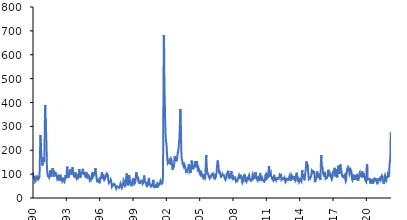
| Category | Index |
|---|---|
| 1990-01-01 | 108.888 |
| 1990-01-02 | 107.41 |
| 1990-01-03 | 104.913 |
| 1990-01-04 | 101.838 |
| 1990-01-05 | 100.555 |
| 1990-01-06 | 100.528 |
| 1990-01-07 | 98.655 |
| 1990-01-08 | 98.989 |
| 1990-01-09 | 100.439 |
| 1990-01-10 | 100.368 |
| 1990-01-11 | 98.759 |
| 1990-01-12 | 98.669 |
| 1990-01-13 | 97.061 |
| 1990-01-14 | 95.389 |
| 1990-01-15 | 94.045 |
| 1990-01-16 | 92.8 |
| 1990-01-17 | 93.206 |
| 1990-01-18 | 90.599 |
| 1990-01-19 | 89.236 |
| 1990-01-20 | 86.482 |
| 1990-01-21 | 85.16 |
| 1990-01-22 | 84.007 |
| 1990-01-23 | 84.643 |
| 1990-01-24 | 83.991 |
| 1990-01-25 | 84.277 |
| 1990-01-26 | 84.188 |
| 1990-01-27 | 84.197 |
| 1990-01-28 | 82.541 |
| 1990-01-29 | 81.961 |
| 1990-01-30 | 82.99 |
| 1990-01-31 | 83.37 |
| 1990-02-01 | 83.561 |
| 1990-02-02 | 84.544 |
| 1990-02-03 | 86.52 |
| 1990-02-04 | 86.381 |
| 1990-02-05 | 87.983 |
| 1990-02-06 | 91.495 |
| 1990-02-07 | 91.184 |
| 1990-02-08 | 89.132 |
| 1990-02-09 | 88.004 |
| 1990-02-10 | 88.749 |
| 1990-02-11 | 88.25 |
| 1990-02-12 | 89.704 |
| 1990-02-13 | 89.977 |
| 1990-02-14 | 88.712 |
| 1990-02-15 | 88.406 |
| 1990-02-16 | 87.166 |
| 1990-02-17 | 87.312 |
| 1990-02-18 | 86.625 |
| 1990-02-19 | 87.193 |
| 1990-02-20 | 86.603 |
| 1990-02-21 | 86.388 |
| 1990-02-22 | 84.271 |
| 1990-02-23 | 83.254 |
| 1990-02-24 | 82.737 |
| 1990-02-25 | 81.87 |
| 1990-02-26 | 81.005 |
| 1990-02-27 | 83.451 |
| 1990-02-28 | 82.212 |
| 1990-03-01 | 81.337 |
| 1990-03-02 | 79.881 |
| 1990-03-03 | 78.446 |
| 1990-03-04 | 76.539 |
| 1990-03-05 | 75.167 |
| 1990-03-06 | 75.443 |
| 1990-03-07 | 74.192 |
| 1990-03-08 | 71.445 |
| 1990-03-09 | 70.327 |
| 1990-03-10 | 71.295 |
| 1990-03-11 | 70.455 |
| 1990-03-12 | 68.815 |
| 1990-03-13 | 69.386 |
| 1990-03-14 | 68.702 |
| 1990-03-15 | 67.928 |
| 1990-03-16 | 68.188 |
| 1990-03-17 | 68.685 |
| 1990-03-18 | 68.941 |
| 1990-03-19 | 68.688 |
| 1990-03-20 | 68.804 |
| 1990-03-21 | 67.771 |
| 1990-03-22 | 68.325 |
| 1990-03-23 | 67.422 |
| 1990-03-24 | 67.949 |
| 1990-03-25 | 68.957 |
| 1990-03-26 | 69.097 |
| 1990-03-27 | 69.89 |
| 1990-03-28 | 70.682 |
| 1990-03-29 | 69.19 |
| 1990-03-30 | 68.958 |
| 1990-03-31 | 70.704 |
| 1990-04-01 | 70.158 |
| 1990-04-02 | 73.422 |
| 1990-04-03 | 75.191 |
| 1990-04-04 | 75.59 |
| 1990-04-05 | 75.518 |
| 1990-04-06 | 76.008 |
| 1990-04-07 | 75.975 |
| 1990-04-08 | 75.326 |
| 1990-04-09 | 74.881 |
| 1990-04-10 | 76.383 |
| 1990-04-11 | 78.055 |
| 1990-04-12 | 78.141 |
| 1990-04-13 | 77.781 |
| 1990-04-14 | 79.164 |
| 1990-04-15 | 78.725 |
| 1990-04-16 | 78.929 |
| 1990-04-17 | 79.578 |
| 1990-04-18 | 80.737 |
| 1990-04-19 | 80.804 |
| 1990-04-20 | 82.924 |
| 1990-04-21 | 83.57 |
| 1990-04-22 | 85.28 |
| 1990-04-23 | 87.052 |
| 1990-04-24 | 87.251 |
| 1990-04-25 | 87.436 |
| 1990-04-26 | 88.024 |
| 1990-04-27 | 87.672 |
| 1990-04-28 | 87.759 |
| 1990-04-29 | 86.872 |
| 1990-04-30 | 84.691 |
| 1990-05-01 | 86.428 |
| 1990-05-02 | 87.079 |
| 1990-05-03 | 86.471 |
| 1990-05-04 | 86.835 |
| 1990-05-05 | 88.836 |
| 1990-05-06 | 87.506 |
| 1990-05-07 | 87.706 |
| 1990-05-08 | 88.491 |
| 1990-05-09 | 88.167 |
| 1990-05-10 | 87.384 |
| 1990-05-11 | 86.09 |
| 1990-05-12 | 84.584 |
| 1990-05-13 | 84.657 |
| 1990-05-14 | 84.476 |
| 1990-05-15 | 85.028 |
| 1990-05-16 | 85.713 |
| 1990-05-17 | 85.847 |
| 1990-05-18 | 84.95 |
| 1990-05-19 | 84.734 |
| 1990-05-20 | 82.827 |
| 1990-05-21 | 83.704 |
| 1990-05-22 | 83.857 |
| 1990-05-23 | 82.49 |
| 1990-05-24 | 83.213 |
| 1990-05-25 | 83.811 |
| 1990-05-26 | 83.866 |
| 1990-05-27 | 83.852 |
| 1990-05-28 | 85.695 |
| 1990-05-29 | 88.988 |
| 1990-05-30 | 90.612 |
| 1990-05-31 | 90.288 |
| 1990-06-01 | 88.062 |
| 1990-06-02 | 88.599 |
| 1990-06-03 | 88.045 |
| 1990-06-04 | 88.156 |
| 1990-06-05 | 89.708 |
| 1990-06-06 | 90.555 |
| 1990-06-07 | 91.1 |
| 1990-06-08 | 91.674 |
| 1990-06-09 | 92.383 |
| 1990-06-10 | 92.216 |
| 1990-06-11 | 92.507 |
| 1990-06-12 | 91.941 |
| 1990-06-13 | 91.258 |
| 1990-06-14 | 91.162 |
| 1990-06-15 | 89.927 |
| 1990-06-16 | 91.257 |
| 1990-06-17 | 90.814 |
| 1990-06-18 | 90.942 |
| 1990-06-19 | 90.664 |
| 1990-06-20 | 89.604 |
| 1990-06-21 | 88.773 |
| 1990-06-22 | 88.803 |
| 1990-06-23 | 89.433 |
| 1990-06-24 | 87.612 |
| 1990-06-25 | 86.231 |
| 1990-06-26 | 85.266 |
| 1990-06-27 | 83.956 |
| 1990-06-28 | 81.266 |
| 1990-06-29 | 81.395 |
| 1990-06-30 | 79.453 |
| 1990-07-01 | 79.619 |
| 1990-07-02 | 79.694 |
| 1990-07-03 | 81.252 |
| 1990-07-04 | 80.527 |
| 1990-07-05 | 80.068 |
| 1990-07-06 | 79.805 |
| 1990-07-07 | 81.898 |
| 1990-07-08 | 81.248 |
| 1990-07-09 | 80.202 |
| 1990-07-10 | 81.353 |
| 1990-07-11 | 82.132 |
| 1990-07-12 | 81.686 |
| 1990-07-13 | 81.727 |
| 1990-07-14 | 81.57 |
| 1990-07-15 | 81.203 |
| 1990-07-16 | 79.424 |
| 1990-07-17 | 78.849 |
| 1990-07-18 | 79.084 |
| 1990-07-19 | 79.631 |
| 1990-07-20 | 79.664 |
| 1990-07-21 | 80.957 |
| 1990-07-22 | 79.903 |
| 1990-07-23 | 79.552 |
| 1990-07-24 | 82.489 |
| 1990-07-25 | 84.811 |
| 1990-07-26 | 86.03 |
| 1990-07-27 | 85.32 |
| 1990-07-28 | 88.356 |
| 1990-07-29 | 87.033 |
| 1990-07-30 | 87.395 |
| 1990-07-31 | 88.76 |
| 1990-08-01 | 89.971 |
| 1990-08-02 | 89.36 |
| 1990-08-03 | 94.125 |
| 1990-08-04 | 98.387 |
| 1990-08-05 | 100.55 |
| 1990-08-06 | 104.374 |
| 1990-08-07 | 111.679 |
| 1990-08-08 | 120.63 |
| 1990-08-09 | 125.054 |
| 1990-08-10 | 130.204 |
| 1990-08-11 | 137.649 |
| 1990-08-12 | 142.137 |
| 1990-08-13 | 151.323 |
| 1990-08-14 | 161.894 |
| 1990-08-15 | 168.642 |
| 1990-08-16 | 173.748 |
| 1990-08-17 | 178.78 |
| 1990-08-18 | 184.345 |
| 1990-08-19 | 186.776 |
| 1990-08-20 | 191.094 |
| 1990-08-21 | 199.834 |
| 1990-08-22 | 207.727 |
| 1990-08-23 | 213.09 |
| 1990-08-24 | 218.012 |
| 1990-08-25 | 226.364 |
| 1990-08-26 | 230.697 |
| 1990-08-27 | 233.677 |
| 1990-08-28 | 240.632 |
| 1990-08-29 | 248.28 |
| 1990-08-30 | 250.135 |
| 1990-08-31 | 254.349 |
| 1990-09-01 | 259.432 |
| 1990-09-02 | 257.131 |
| 1990-09-03 | 258.662 |
| 1990-09-04 | 263.269 |
| 1990-09-05 | 263.858 |
| 1990-09-06 | 259.837 |
| 1990-09-07 | 256.058 |
| 1990-09-08 | 256.927 |
| 1990-09-09 | 254.21 |
| 1990-09-10 | 251.669 |
| 1990-09-11 | 250.891 |
| 1990-09-12 | 244.306 |
| 1990-09-13 | 235.978 |
| 1990-09-14 | 233.571 |
| 1990-09-15 | 236.36 |
| 1990-09-16 | 232.822 |
| 1990-09-17 | 230.669 |
| 1990-09-18 | 231.067 |
| 1990-09-19 | 230.129 |
| 1990-09-20 | 224.346 |
| 1990-09-21 | 218.618 |
| 1990-09-22 | 213.784 |
| 1990-09-23 | 209.185 |
| 1990-09-24 | 204.642 |
| 1990-09-25 | 206.99 |
| 1990-09-26 | 205.247 |
| 1990-09-27 | 201.497 |
| 1990-09-28 | 196.678 |
| 1990-09-29 | 195.995 |
| 1990-09-30 | 191.022 |
| 1990-10-01 | 189.418 |
| 1990-10-02 | 189.296 |
| 1990-10-03 | 184.958 |
| 1990-10-04 | 179.893 |
| 1990-10-05 | 176.692 |
| 1990-10-06 | 176.302 |
| 1990-10-07 | 173.024 |
| 1990-10-08 | 169.992 |
| 1990-10-09 | 170.384 |
| 1990-10-10 | 169.118 |
| 1990-10-11 | 166.356 |
| 1990-10-12 | 166.398 |
| 1990-10-13 | 167.752 |
| 1990-10-14 | 164.543 |
| 1990-10-15 | 160.898 |
| 1990-10-16 | 161.753 |
| 1990-10-17 | 160.01 |
| 1990-10-18 | 158.356 |
| 1990-10-19 | 156.78 |
| 1990-10-20 | 157.133 |
| 1990-10-21 | 155.508 |
| 1990-10-22 | 156.115 |
| 1990-10-23 | 156.503 |
| 1990-10-24 | 155.406 |
| 1990-10-25 | 149.924 |
| 1990-10-26 | 148.698 |
| 1990-10-27 | 147.52 |
| 1990-10-28 | 146.083 |
| 1990-10-29 | 145.463 |
| 1990-10-30 | 144.637 |
| 1990-10-31 | 143.308 |
| 1990-11-01 | 140.489 |
| 1990-11-02 | 140.319 |
| 1990-11-03 | 138.491 |
| 1990-11-04 | 135.831 |
| 1990-11-05 | 134.936 |
| 1990-11-06 | 138.865 |
| 1990-11-07 | 137.727 |
| 1990-11-08 | 136.763 |
| 1990-11-09 | 136.579 |
| 1990-11-10 | 139.652 |
| 1990-11-11 | 138.035 |
| 1990-11-12 | 137.703 |
| 1990-11-13 | 139.317 |
| 1990-11-14 | 140.408 |
| 1990-11-15 | 140.44 |
| 1990-11-16 | 141.38 |
| 1990-11-17 | 142.353 |
| 1990-11-18 | 140.939 |
| 1990-11-19 | 140.71 |
| 1990-11-20 | 142.068 |
| 1990-11-21 | 143.917 |
| 1990-11-22 | 142.944 |
| 1990-11-23 | 142.001 |
| 1990-11-24 | 145.842 |
| 1990-11-25 | 144.647 |
| 1990-11-26 | 146.535 |
| 1990-11-27 | 150.699 |
| 1990-11-28 | 152.173 |
| 1990-11-29 | 155.514 |
| 1990-11-30 | 155.135 |
| 1990-12-01 | 159.444 |
| 1990-12-02 | 158.778 |
| 1990-12-03 | 163.545 |
| 1990-12-04 | 167.11 |
| 1990-12-05 | 169.755 |
| 1990-12-06 | 167.82 |
| 1990-12-07 | 170.297 |
| 1990-12-08 | 172.686 |
| 1990-12-09 | 170.88 |
| 1990-12-10 | 169.331 |
| 1990-12-11 | 171.765 |
| 1990-12-12 | 170.33 |
| 1990-12-13 | 169.585 |
| 1990-12-14 | 167.422 |
| 1990-12-15 | 167.676 |
| 1990-12-16 | 165.871 |
| 1990-12-17 | 166.773 |
| 1990-12-18 | 168.805 |
| 1990-12-19 | 167.92 |
| 1990-12-20 | 166.815 |
| 1990-12-21 | 162.189 |
| 1990-12-22 | 165.289 |
| 1990-12-23 | 164.01 |
| 1990-12-24 | 159.775 |
| 1990-12-25 | 161.217 |
| 1990-12-26 | 162.591 |
| 1990-12-27 | 161.342 |
| 1990-12-28 | 158.55 |
| 1990-12-29 | 157.229 |
| 1990-12-30 | 155.134 |
| 1990-12-31 | 154.157 |
| 1991-01-01 | 156.688 |
| 1991-01-02 | 154.629 |
| 1991-01-03 | 153.135 |
| 1991-01-04 | 151.791 |
| 1991-01-05 | 154.468 |
| 1991-01-06 | 150.904 |
| 1991-01-07 | 152.765 |
| 1991-01-08 | 161.563 |
| 1991-01-09 | 166.57 |
| 1991-01-10 | 170.601 |
| 1991-01-11 | 179.217 |
| 1991-01-12 | 186.844 |
| 1991-01-13 | 190.141 |
| 1991-01-14 | 196.383 |
| 1991-01-15 | 211.914 |
| 1991-01-16 | 221.773 |
| 1991-01-17 | 234.695 |
| 1991-01-18 | 249.09 |
| 1991-01-19 | 257.772 |
| 1991-01-20 | 263.979 |
| 1991-01-21 | 272.418 |
| 1991-01-22 | 285.864 |
| 1991-01-23 | 296.976 |
| 1991-01-24 | 305.113 |
| 1991-01-25 | 311.71 |
| 1991-01-26 | 319.529 |
| 1991-01-27 | 325.117 |
| 1991-01-28 | 331.397 |
| 1991-01-29 | 343.023 |
| 1991-01-30 | 352.917 |
| 1991-01-31 | 358.199 |
| 1991-02-01 | 363.29 |
| 1991-02-02 | 368.68 |
| 1991-02-03 | 372.897 |
| 1991-02-04 | 374.876 |
| 1991-02-05 | 384.75 |
| 1991-02-06 | 389.402 |
| 1991-02-07 | 385.547 |
| 1991-02-08 | 387.621 |
| 1991-02-09 | 387.625 |
| 1991-02-10 | 381.881 |
| 1991-02-11 | 381.881 |
| 1991-02-12 | 383.405 |
| 1991-02-13 | 380.495 |
| 1991-02-14 | 371.234 |
| 1991-02-15 | 363.16 |
| 1991-02-16 | 353.78 |
| 1991-02-17 | 342.821 |
| 1991-02-18 | 341.998 |
| 1991-02-19 | 342.092 |
| 1991-02-20 | 336.266 |
| 1991-02-21 | 329.164 |
| 1991-02-22 | 325.409 |
| 1991-02-23 | 326.082 |
| 1991-02-24 | 321.539 |
| 1991-02-25 | 324.321 |
| 1991-02-26 | 327.445 |
| 1991-02-27 | 330.672 |
| 1991-02-28 | 323.834 |
| 1991-03-01 | 313.975 |
| 1991-03-02 | 309.706 |
| 1991-03-03 | 305.109 |
| 1991-03-04 | 301.824 |
| 1991-03-05 | 298.284 |
| 1991-03-06 | 294.369 |
| 1991-03-07 | 288.048 |
| 1991-03-08 | 279.02 |
| 1991-03-09 | 276.178 |
| 1991-03-10 | 269.37 |
| 1991-03-11 | 266.034 |
| 1991-03-12 | 265.826 |
| 1991-03-13 | 258.04 |
| 1991-03-14 | 251.402 |
| 1991-03-15 | 246.312 |
| 1991-03-16 | 242.048 |
| 1991-03-17 | 239.382 |
| 1991-03-18 | 236.995 |
| 1991-03-19 | 235.156 |
| 1991-03-20 | 227.367 |
| 1991-03-21 | 221.416 |
| 1991-03-22 | 216.044 |
| 1991-03-23 | 211.219 |
| 1991-03-24 | 203.24 |
| 1991-03-25 | 193.128 |
| 1991-03-26 | 187.388 |
| 1991-03-27 | 174.635 |
| 1991-03-28 | 165.776 |
| 1991-03-29 | 153.906 |
| 1991-03-30 | 149.16 |
| 1991-03-31 | 144.999 |
| 1991-04-01 | 140.599 |
| 1991-04-02 | 139.802 |
| 1991-04-03 | 137.34 |
| 1991-04-04 | 133.918 |
| 1991-04-05 | 131.056 |
| 1991-04-06 | 128.787 |
| 1991-04-07 | 127.756 |
| 1991-04-08 | 125.668 |
| 1991-04-09 | 123.665 |
| 1991-04-10 | 120.104 |
| 1991-04-11 | 116.471 |
| 1991-04-12 | 115.998 |
| 1991-04-13 | 115.368 |
| 1991-04-14 | 113.591 |
| 1991-04-15 | 112.53 |
| 1991-04-16 | 110.267 |
| 1991-04-17 | 107.371 |
| 1991-04-18 | 104.538 |
| 1991-04-19 | 103.422 |
| 1991-04-20 | 104.688 |
| 1991-04-21 | 102.75 |
| 1991-04-22 | 100.245 |
| 1991-04-23 | 99.564 |
| 1991-04-24 | 99.54 |
| 1991-04-25 | 97.63 |
| 1991-04-26 | 96.73 |
| 1991-04-27 | 96.195 |
| 1991-04-28 | 95.465 |
| 1991-04-29 | 95.43 |
| 1991-04-30 | 96.354 |
| 1991-05-01 | 97.747 |
| 1991-05-02 | 93.892 |
| 1991-05-03 | 91.185 |
| 1991-05-04 | 89.99 |
| 1991-05-05 | 88.508 |
| 1991-05-06 | 90.856 |
| 1991-05-07 | 92.22 |
| 1991-05-08 | 92.945 |
| 1991-05-09 | 92.056 |
| 1991-05-10 | 92.871 |
| 1991-05-11 | 92.869 |
| 1991-05-12 | 91.171 |
| 1991-05-13 | 92.64 |
| 1991-05-14 | 94.059 |
| 1991-05-15 | 92.715 |
| 1991-05-16 | 92.32 |
| 1991-05-17 | 90.23 |
| 1991-05-18 | 90.556 |
| 1991-05-19 | 89.003 |
| 1991-05-20 | 88.975 |
| 1991-05-21 | 89.099 |
| 1991-05-22 | 90.142 |
| 1991-05-23 | 91.61 |
| 1991-05-24 | 89.674 |
| 1991-05-25 | 90.551 |
| 1991-05-26 | 90.171 |
| 1991-05-27 | 90.905 |
| 1991-05-28 | 92.555 |
| 1991-05-29 | 91.12 |
| 1991-05-30 | 90.098 |
| 1991-05-31 | 90.056 |
| 1991-06-01 | 92.122 |
| 1991-06-02 | 92.058 |
| 1991-06-03 | 91.38 |
| 1991-06-04 | 93.162 |
| 1991-06-05 | 90.056 |
| 1991-06-06 | 87.98 |
| 1991-06-07 | 86.439 |
| 1991-06-08 | 88.106 |
| 1991-06-09 | 86.725 |
| 1991-06-10 | 87.303 |
| 1991-06-11 | 88.491 |
| 1991-06-12 | 88.092 |
| 1991-06-13 | 87.528 |
| 1991-06-14 | 87.369 |
| 1991-06-15 | 86.569 |
| 1991-06-16 | 86.408 |
| 1991-06-17 | 85.655 |
| 1991-06-18 | 86.875 |
| 1991-06-19 | 85.575 |
| 1991-06-20 | 85.165 |
| 1991-06-21 | 84.802 |
| 1991-06-22 | 82.634 |
| 1991-06-23 | 82.813 |
| 1991-06-24 | 82.16 |
| 1991-06-25 | 82.983 |
| 1991-06-26 | 81.838 |
| 1991-06-27 | 82.64 |
| 1991-06-28 | 85.265 |
| 1991-06-29 | 87.215 |
| 1991-06-30 | 86.096 |
| 1991-07-01 | 87.988 |
| 1991-07-02 | 89.568 |
| 1991-07-03 | 93.826 |
| 1991-07-04 | 95.651 |
| 1991-07-05 | 96.149 |
| 1991-07-06 | 99.139 |
| 1991-07-07 | 101.109 |
| 1991-07-08 | 103.037 |
| 1991-07-09 | 104.261 |
| 1991-07-10 | 105.07 |
| 1991-07-11 | 105.238 |
| 1991-07-12 | 105.56 |
| 1991-07-13 | 106.379 |
| 1991-07-14 | 107.041 |
| 1991-07-15 | 110.778 |
| 1991-07-16 | 113.038 |
| 1991-07-17 | 113.555 |
| 1991-07-18 | 113.559 |
| 1991-07-19 | 113.943 |
| 1991-07-20 | 114.218 |
| 1991-07-21 | 113.387 |
| 1991-07-22 | 115.394 |
| 1991-07-23 | 115.349 |
| 1991-07-24 | 116.352 |
| 1991-07-25 | 115.856 |
| 1991-07-26 | 116.777 |
| 1991-07-27 | 115.639 |
| 1991-07-28 | 113.42 |
| 1991-07-29 | 112.767 |
| 1991-07-30 | 113.397 |
| 1991-07-31 | 112.207 |
| 1991-08-01 | 111.575 |
| 1991-08-02 | 109.022 |
| 1991-08-03 | 106.429 |
| 1991-08-04 | 104.566 |
| 1991-08-05 | 101.646 |
| 1991-08-06 | 100.538 |
| 1991-08-07 | 98.34 |
| 1991-08-08 | 97.992 |
| 1991-08-09 | 98.157 |
| 1991-08-10 | 98.432 |
| 1991-08-11 | 97.419 |
| 1991-08-12 | 98.37 |
| 1991-08-13 | 97.573 |
| 1991-08-14 | 93.884 |
| 1991-08-15 | 91.9 |
| 1991-08-16 | 91.058 |
| 1991-08-17 | 91.309 |
| 1991-08-18 | 89.246 |
| 1991-08-19 | 89.004 |
| 1991-08-20 | 95.642 |
| 1991-08-21 | 98.738 |
| 1991-08-22 | 101.297 |
| 1991-08-23 | 103.634 |
| 1991-08-24 | 102.364 |
| 1991-08-25 | 101.164 |
| 1991-08-26 | 102.48 |
| 1991-08-27 | 104.627 |
| 1991-08-28 | 106.598 |
| 1991-08-29 | 107.622 |
| 1991-08-30 | 109.262 |
| 1991-08-31 | 108.993 |
| 1991-09-01 | 107.967 |
| 1991-09-02 | 109.04 |
| 1991-09-03 | 109.608 |
| 1991-09-04 | 110.73 |
| 1991-09-05 | 110.325 |
| 1991-09-06 | 110.85 |
| 1991-09-07 | 110.107 |
| 1991-09-08 | 108.825 |
| 1991-09-09 | 107.859 |
| 1991-09-10 | 109.212 |
| 1991-09-11 | 107.589 |
| 1991-09-12 | 108.544 |
| 1991-09-13 | 110.225 |
| 1991-09-14 | 112.987 |
| 1991-09-15 | 113.872 |
| 1991-09-16 | 115.856 |
| 1991-09-17 | 117.935 |
| 1991-09-18 | 119.128 |
| 1991-09-19 | 113.974 |
| 1991-09-20 | 111.868 |
| 1991-09-21 | 110.788 |
| 1991-09-22 | 108.428 |
| 1991-09-23 | 112.72 |
| 1991-09-24 | 115.518 |
| 1991-09-25 | 115.724 |
| 1991-09-26 | 116.713 |
| 1991-09-27 | 115.889 |
| 1991-09-28 | 117.145 |
| 1991-09-29 | 114.781 |
| 1991-09-30 | 116.281 |
| 1991-10-01 | 120.257 |
| 1991-10-02 | 119.598 |
| 1991-10-03 | 121.286 |
| 1991-10-04 | 122.746 |
| 1991-10-05 | 123.645 |
| 1991-10-06 | 122.002 |
| 1991-10-07 | 123.591 |
| 1991-10-08 | 125.627 |
| 1991-10-09 | 127.011 |
| 1991-10-10 | 125.2 |
| 1991-10-11 | 125.454 |
| 1991-10-12 | 125.429 |
| 1991-10-13 | 124.986 |
| 1991-10-14 | 121.218 |
| 1991-10-15 | 122.713 |
| 1991-10-16 | 120.148 |
| 1991-10-17 | 119.459 |
| 1991-10-18 | 118.565 |
| 1991-10-19 | 117.411 |
| 1991-10-20 | 115.683 |
| 1991-10-21 | 114.547 |
| 1991-10-22 | 115.19 |
| 1991-10-23 | 110.958 |
| 1991-10-24 | 108.476 |
| 1991-10-25 | 107.729 |
| 1991-10-26 | 104.959 |
| 1991-10-27 | 103.355 |
| 1991-10-28 | 100.393 |
| 1991-10-29 | 100.946 |
| 1991-10-30 | 100.248 |
| 1991-10-31 | 97.741 |
| 1991-11-01 | 96.307 |
| 1991-11-02 | 93.654 |
| 1991-11-03 | 91.685 |
| 1991-11-04 | 92.844 |
| 1991-11-05 | 93.954 |
| 1991-11-06 | 92.883 |
| 1991-11-07 | 89.413 |
| 1991-11-08 | 88.252 |
| 1991-11-09 | 89.868 |
| 1991-11-10 | 90.933 |
| 1991-11-11 | 91.372 |
| 1991-11-12 | 91.251 |
| 1991-11-13 | 93.118 |
| 1991-11-14 | 90.715 |
| 1991-11-15 | 91.21 |
| 1991-11-16 | 90.707 |
| 1991-11-17 | 90.424 |
| 1991-11-18 | 91.202 |
| 1991-11-19 | 92.531 |
| 1991-11-20 | 92.239 |
| 1991-11-21 | 92.869 |
| 1991-11-22 | 94.907 |
| 1991-11-23 | 96.643 |
| 1991-11-24 | 95.109 |
| 1991-11-25 | 95.662 |
| 1991-11-26 | 97.251 |
| 1991-11-27 | 97.584 |
| 1991-11-28 | 97.322 |
| 1991-11-29 | 98.115 |
| 1991-11-30 | 97.963 |
| 1991-12-01 | 98.396 |
| 1991-12-02 | 100.749 |
| 1991-12-03 | 102.048 |
| 1991-12-04 | 100.358 |
| 1991-12-05 | 98.964 |
| 1991-12-06 | 99.068 |
| 1991-12-07 | 100.305 |
| 1991-12-08 | 99.843 |
| 1991-12-09 | 99.602 |
| 1991-12-10 | 101.03 |
| 1991-12-11 | 100.369 |
| 1991-12-12 | 100.801 |
| 1991-12-13 | 101.208 |
| 1991-12-14 | 102.954 |
| 1991-12-15 | 103.352 |
| 1991-12-16 | 106.391 |
| 1991-12-17 | 107.652 |
| 1991-12-18 | 106.904 |
| 1991-12-19 | 105.785 |
| 1991-12-20 | 107.047 |
| 1991-12-21 | 106.469 |
| 1991-12-22 | 105.724 |
| 1991-12-23 | 104.566 |
| 1991-12-24 | 105.605 |
| 1991-12-25 | 105.289 |
| 1991-12-26 | 103.527 |
| 1991-12-27 | 103.489 |
| 1991-12-28 | 103.805 |
| 1991-12-29 | 102.102 |
| 1991-12-30 | 101.927 |
| 1991-12-31 | 104.054 |
| 1992-01-01 | 103.886 |
| 1992-01-02 | 103.303 |
| 1992-01-03 | 103.738 |
| 1992-01-04 | 105.715 |
| 1992-01-05 | 104.847 |
| 1992-01-06 | 105.647 |
| 1992-01-07 | 107.705 |
| 1992-01-08 | 107.958 |
| 1992-01-09 | 105.572 |
| 1992-01-10 | 105.158 |
| 1992-01-11 | 106.671 |
| 1992-01-12 | 106.249 |
| 1992-01-13 | 105.301 |
| 1992-01-14 | 105.876 |
| 1992-01-15 | 103.501 |
| 1992-01-16 | 102.08 |
| 1992-01-17 | 101.931 |
| 1992-01-18 | 102.344 |
| 1992-01-19 | 101.091 |
| 1992-01-20 | 101.981 |
| 1992-01-21 | 102.427 |
| 1992-01-22 | 101.998 |
| 1992-01-23 | 100.957 |
| 1992-01-24 | 101.839 |
| 1992-01-25 | 102.342 |
| 1992-01-26 | 101.455 |
| 1992-01-27 | 100.234 |
| 1992-01-28 | 100.657 |
| 1992-01-29 | 101.037 |
| 1992-01-30 | 101.226 |
| 1992-01-31 | 101.52 |
| 1992-02-01 | 101.119 |
| 1992-02-02 | 100.363 |
| 1992-02-03 | 99.512 |
| 1992-02-04 | 99.699 |
| 1992-02-05 | 99.122 |
| 1992-02-06 | 97.269 |
| 1992-02-07 | 96.989 |
| 1992-02-08 | 96.579 |
| 1992-02-09 | 96.603 |
| 1992-02-10 | 93.91 |
| 1992-02-11 | 93.322 |
| 1992-02-12 | 93.63 |
| 1992-02-13 | 92.067 |
| 1992-02-14 | 92.316 |
| 1992-02-15 | 93.375 |
| 1992-02-16 | 93.456 |
| 1992-02-17 | 91.568 |
| 1992-02-18 | 92.434 |
| 1992-02-19 | 92.004 |
| 1992-02-20 | 90.447 |
| 1992-02-21 | 90.393 |
| 1992-02-22 | 92.443 |
| 1992-02-23 | 91.75 |
| 1992-02-24 | 90.924 |
| 1992-02-25 | 91.842 |
| 1992-02-26 | 91.106 |
| 1992-02-27 | 89.091 |
| 1992-02-28 | 88.35 |
| 1992-02-29 | 86.365 |
| 1992-03-01 | 84.426 |
| 1992-03-02 | 83.109 |
| 1992-03-03 | 83.002 |
| 1992-03-04 | 81.685 |
| 1992-03-05 | 81.344 |
| 1992-03-06 | 80.036 |
| 1992-03-07 | 80.661 |
| 1992-03-08 | 78.99 |
| 1992-03-09 | 79.44 |
| 1992-03-10 | 79.217 |
| 1992-03-11 | 80.322 |
| 1992-03-12 | 80.251 |
| 1992-03-13 | 80.675 |
| 1992-03-14 | 80.371 |
| 1992-03-15 | 79.144 |
| 1992-03-16 | 79.003 |
| 1992-03-17 | 79.117 |
| 1992-03-18 | 80.155 |
| 1992-03-19 | 80.299 |
| 1992-03-20 | 80.64 |
| 1992-03-21 | 81.027 |
| 1992-03-22 | 80.835 |
| 1992-03-23 | 79.78 |
| 1992-03-24 | 79.207 |
| 1992-03-25 | 78.602 |
| 1992-03-26 | 78.537 |
| 1992-03-27 | 80.391 |
| 1992-03-28 | 82.269 |
| 1992-03-29 | 81.902 |
| 1992-03-30 | 83.467 |
| 1992-03-31 | 83.969 |
| 1992-04-01 | 86.199 |
| 1992-04-02 | 86.19 |
| 1992-04-03 | 86.251 |
| 1992-04-04 | 87.106 |
| 1992-04-05 | 87.504 |
| 1992-04-06 | 87.228 |
| 1992-04-07 | 88.785 |
| 1992-04-08 | 89.03 |
| 1992-04-09 | 88.591 |
| 1992-04-10 | 88.847 |
| 1992-04-11 | 89.289 |
| 1992-04-12 | 88.683 |
| 1992-04-13 | 89.095 |
| 1992-04-14 | 90.266 |
| 1992-04-15 | 91.143 |
| 1992-04-16 | 91.445 |
| 1992-04-17 | 92.846 |
| 1992-04-18 | 92.501 |
| 1992-04-19 | 90.007 |
| 1992-04-20 | 92.116 |
| 1992-04-21 | 93.555 |
| 1992-04-22 | 92.49 |
| 1992-04-23 | 91.921 |
| 1992-04-24 | 91.604 |
| 1992-04-25 | 92.008 |
| 1992-04-26 | 89.349 |
| 1992-04-27 | 89.176 |
| 1992-04-28 | 89.089 |
| 1992-04-29 | 86.766 |
| 1992-04-30 | 86.446 |
| 1992-05-01 | 84.238 |
| 1992-05-02 | 83.361 |
| 1992-05-03 | 83.459 |
| 1992-05-04 | 83.678 |
| 1992-05-05 | 83.359 |
| 1992-05-06 | 83.552 |
| 1992-05-07 | 83.187 |
| 1992-05-08 | 81.08 |
| 1992-05-09 | 81.115 |
| 1992-05-10 | 79.237 |
| 1992-05-11 | 78.637 |
| 1992-05-12 | 79.46 |
| 1992-05-13 | 78.607 |
| 1992-05-14 | 76.773 |
| 1992-05-15 | 74.82 |
| 1992-05-16 | 74.173 |
| 1992-05-17 | 72.05 |
| 1992-05-18 | 72.727 |
| 1992-05-19 | 73.777 |
| 1992-05-20 | 72.157 |
| 1992-05-21 | 70.719 |
| 1992-05-22 | 71.005 |
| 1992-05-23 | 72.05 |
| 1992-05-24 | 72.75 |
| 1992-05-25 | 74.276 |
| 1992-05-26 | 77.585 |
| 1992-05-27 | 77.307 |
| 1992-05-28 | 78.031 |
| 1992-05-29 | 78.16 |
| 1992-05-30 | 78.598 |
| 1992-05-31 | 79.704 |
| 1992-06-01 | 80.515 |
| 1992-06-02 | 80.042 |
| 1992-06-03 | 82.399 |
| 1992-06-04 | 84.292 |
| 1992-06-05 | 85.855 |
| 1992-06-06 | 86.492 |
| 1992-06-07 | 87.433 |
| 1992-06-08 | 87.021 |
| 1992-06-09 | 90.037 |
| 1992-06-10 | 90.564 |
| 1992-06-11 | 89.883 |
| 1992-06-12 | 90.391 |
| 1992-06-13 | 93.058 |
| 1992-06-14 | 93.512 |
| 1992-06-15 | 94.809 |
| 1992-06-16 | 97.231 |
| 1992-06-17 | 96.518 |
| 1992-06-18 | 96.924 |
| 1992-06-19 | 96.716 |
| 1992-06-20 | 97.114 |
| 1992-06-21 | 97.544 |
| 1992-06-22 | 97.074 |
| 1992-06-23 | 97.428 |
| 1992-06-24 | 96.341 |
| 1992-06-25 | 93.321 |
| 1992-06-26 | 92.105 |
| 1992-06-27 | 92.182 |
| 1992-06-28 | 92.551 |
| 1992-06-29 | 92.83 |
| 1992-06-30 | 91.85 |
| 1992-07-01 | 91.559 |
| 1992-07-02 | 91.463 |
| 1992-07-03 | 89.81 |
| 1992-07-04 | 88.307 |
| 1992-07-05 | 87.089 |
| 1992-07-06 | 86.1 |
| 1992-07-07 | 87.05 |
| 1992-07-08 | 89.346 |
| 1992-07-09 | 87.343 |
| 1992-07-10 | 86.687 |
| 1992-07-11 | 85.94 |
| 1992-07-12 | 84.251 |
| 1992-07-13 | 82.051 |
| 1992-07-14 | 83.168 |
| 1992-07-15 | 80.567 |
| 1992-07-16 | 78.993 |
| 1992-07-17 | 77.905 |
| 1992-07-18 | 76.323 |
| 1992-07-19 | 75.093 |
| 1992-07-20 | 74.562 |
| 1992-07-21 | 73.647 |
| 1992-07-22 | 73.7 |
| 1992-07-23 | 74.768 |
| 1992-07-24 | 74.42 |
| 1992-07-25 | 75.96 |
| 1992-07-26 | 76.945 |
| 1992-07-27 | 76.661 |
| 1992-07-28 | 77.165 |
| 1992-07-29 | 75.959 |
| 1992-07-30 | 75.114 |
| 1992-07-31 | 74.968 |
| 1992-08-01 | 75.449 |
| 1992-08-02 | 73.589 |
| 1992-08-03 | 73.411 |
| 1992-08-04 | 72.807 |
| 1992-08-05 | 72.527 |
| 1992-08-06 | 70.795 |
| 1992-08-07 | 69.354 |
| 1992-08-08 | 68.916 |
| 1992-08-09 | 68.618 |
| 1992-08-10 | 70.559 |
| 1992-08-11 | 74.726 |
| 1992-08-12 | 75.585 |
| 1992-08-13 | 74.373 |
| 1992-08-14 | 76.81 |
| 1992-08-15 | 76.492 |
| 1992-08-16 | 76.728 |
| 1992-08-17 | 79.178 |
| 1992-08-18 | 79.538 |
| 1992-08-19 | 79.771 |
| 1992-08-20 | 80.94 |
| 1992-08-21 | 80.128 |
| 1992-08-22 | 78.242 |
| 1992-08-23 | 75.467 |
| 1992-08-24 | 74.518 |
| 1992-08-25 | 76.033 |
| 1992-08-26 | 75.912 |
| 1992-08-27 | 77.553 |
| 1992-08-28 | 78.068 |
| 1992-08-29 | 80.428 |
| 1992-08-30 | 80.34 |
| 1992-08-31 | 81.711 |
| 1992-09-01 | 82.313 |
| 1992-09-02 | 82.498 |
| 1992-09-03 | 82.32 |
| 1992-09-04 | 83.386 |
| 1992-09-05 | 84.907 |
| 1992-09-06 | 83.85 |
| 1992-09-07 | 84.314 |
| 1992-09-08 | 85.391 |
| 1992-09-09 | 84.25 |
| 1992-09-10 | 81.187 |
| 1992-09-11 | 80.403 |
| 1992-09-12 | 80.887 |
| 1992-09-13 | 79.676 |
| 1992-09-14 | 80.472 |
| 1992-09-15 | 81.443 |
| 1992-09-16 | 80.198 |
| 1992-09-17 | 80.012 |
| 1992-09-18 | 80.779 |
| 1992-09-19 | 79.914 |
| 1992-09-20 | 80.374 |
| 1992-09-21 | 81.298 |
| 1992-09-22 | 84.013 |
| 1992-09-23 | 83.343 |
| 1992-09-24 | 81.524 |
| 1992-09-25 | 80.322 |
| 1992-09-26 | 78.75 |
| 1992-09-27 | 76.995 |
| 1992-09-28 | 76.914 |
| 1992-09-29 | 77.081 |
| 1992-09-30 | 76.46 |
| 1992-10-01 | 75.83 |
| 1992-10-02 | 75.902 |
| 1992-10-03 | 76.354 |
| 1992-10-04 | 74.93 |
| 1992-10-05 | 73.586 |
| 1992-10-06 | 72.806 |
| 1992-10-07 | 71.814 |
| 1992-10-08 | 71.405 |
| 1992-10-09 | 70.517 |
| 1992-10-10 | 70.357 |
| 1992-10-11 | 70.626 |
| 1992-10-12 | 72.328 |
| 1992-10-13 | 72.758 |
| 1992-10-14 | 71.589 |
| 1992-10-15 | 70.344 |
| 1992-10-16 | 70.219 |
| 1992-10-17 | 70.101 |
| 1992-10-18 | 69.112 |
| 1992-10-19 | 69.087 |
| 1992-10-20 | 69.087 |
| 1992-10-21 | 68.357 |
| 1992-10-22 | 67.63 |
| 1992-10-23 | 69.133 |
| 1992-10-24 | 69.053 |
| 1992-10-25 | 68.627 |
| 1992-10-26 | 67.836 |
| 1992-10-27 | 69.492 |
| 1992-10-28 | 69.15 |
| 1992-10-29 | 68.474 |
| 1992-10-30 | 67.152 |
| 1992-10-31 | 68.28 |
| 1992-11-01 | 67.549 |
| 1992-11-02 | 67.021 |
| 1992-11-03 | 67.829 |
| 1992-11-04 | 67.959 |
| 1992-11-05 | 68.63 |
| 1992-11-06 | 70.049 |
| 1992-11-07 | 69.888 |
| 1992-11-08 | 70.884 |
| 1992-11-09 | 74.735 |
| 1992-11-10 | 77.277 |
| 1992-11-11 | 77.413 |
| 1992-11-12 | 76.629 |
| 1992-11-13 | 77.57 |
| 1992-11-14 | 78.492 |
| 1992-11-15 | 77.768 |
| 1992-11-16 | 80.402 |
| 1992-11-17 | 81.403 |
| 1992-11-18 | 81.731 |
| 1992-11-19 | 82.507 |
| 1992-11-20 | 83.162 |
| 1992-11-21 | 83.213 |
| 1992-11-22 | 82.11 |
| 1992-11-23 | 85.007 |
| 1992-11-24 | 87.757 |
| 1992-11-25 | 88.548 |
| 1992-11-26 | 89.161 |
| 1992-11-27 | 88.003 |
| 1992-11-28 | 89.702 |
| 1992-11-29 | 91.107 |
| 1992-11-30 | 93.006 |
| 1992-12-01 | 96.023 |
| 1992-12-02 | 96.368 |
| 1992-12-03 | 95.726 |
| 1992-12-04 | 97.277 |
| 1992-12-05 | 99.22 |
| 1992-12-06 | 97.804 |
| 1992-12-07 | 98.042 |
| 1992-12-08 | 99.092 |
| 1992-12-09 | 96.453 |
| 1992-12-10 | 92.804 |
| 1992-12-11 | 90.483 |
| 1992-12-12 | 90.684 |
| 1992-12-13 | 90.059 |
| 1992-12-14 | 89.936 |
| 1992-12-15 | 89.537 |
| 1992-12-16 | 88.115 |
| 1992-12-17 | 87.737 |
| 1992-12-18 | 86.74 |
| 1992-12-19 | 86.953 |
| 1992-12-20 | 86.623 |
| 1992-12-21 | 86.227 |
| 1992-12-22 | 88.363 |
| 1992-12-23 | 87.471 |
| 1992-12-24 | 86.424 |
| 1992-12-25 | 86.032 |
| 1992-12-26 | 83.488 |
| 1992-12-27 | 84.047 |
| 1992-12-28 | 83.83 |
| 1992-12-29 | 84.299 |
| 1992-12-30 | 84.141 |
| 1992-12-31 | 82.322 |
| 1993-01-01 | 83.704 |
| 1993-01-02 | 85.395 |
| 1993-01-03 | 84.268 |
| 1993-01-04 | 84.582 |
| 1993-01-05 | 86.896 |
| 1993-01-06 | 87.143 |
| 1993-01-07 | 87.983 |
| 1993-01-08 | 89.543 |
| 1993-01-09 | 93.567 |
| 1993-01-10 | 93.785 |
| 1993-01-11 | 96.717 |
| 1993-01-12 | 99.815 |
| 1993-01-13 | 101.463 |
| 1993-01-14 | 108.414 |
| 1993-01-15 | 111.579 |
| 1993-01-16 | 113.047 |
| 1993-01-17 | 114.67 |
| 1993-01-18 | 117.218 |
| 1993-01-19 | 120.577 |
| 1993-01-20 | 121.378 |
| 1993-01-21 | 120.561 |
| 1993-01-22 | 120.286 |
| 1993-01-23 | 121.474 |
| 1993-01-24 | 121.029 |
| 1993-01-25 | 126.575 |
| 1993-01-26 | 128.897 |
| 1993-01-27 | 128.275 |
| 1993-01-28 | 128.494 |
| 1993-01-29 | 127.491 |
| 1993-01-30 | 128.243 |
| 1993-01-31 | 128.137 |
| 1993-02-01 | 128.861 |
| 1993-02-02 | 131.612 |
| 1993-02-03 | 132.194 |
| 1993-02-04 | 131.466 |
| 1993-02-05 | 131.973 |
| 1993-02-06 | 129.945 |
| 1993-02-07 | 127.628 |
| 1993-02-08 | 124.873 |
| 1993-02-09 | 125.971 |
| 1993-02-10 | 123.779 |
| 1993-02-11 | 122.156 |
| 1993-02-12 | 121.423 |
| 1993-02-13 | 114.345 |
| 1993-02-14 | 110.731 |
| 1993-02-15 | 109.045 |
| 1993-02-16 | 108.361 |
| 1993-02-17 | 104.541 |
| 1993-02-18 | 102.178 |
| 1993-02-19 | 101.989 |
| 1993-02-20 | 100.302 |
| 1993-02-21 | 98.365 |
| 1993-02-22 | 96.741 |
| 1993-02-23 | 97.216 |
| 1993-02-24 | 94.355 |
| 1993-02-25 | 93.6 |
| 1993-02-26 | 93.975 |
| 1993-02-27 | 93.076 |
| 1993-02-28 | 91.57 |
| 1993-03-01 | 91.345 |
| 1993-03-02 | 90.071 |
| 1993-03-03 | 87.634 |
| 1993-03-04 | 84.345 |
| 1993-03-05 | 81.918 |
| 1993-03-06 | 81.361 |
| 1993-03-07 | 80.359 |
| 1993-03-08 | 80.463 |
| 1993-03-09 | 82.765 |
| 1993-03-10 | 82.859 |
| 1993-03-11 | 82.428 |
| 1993-03-12 | 83.9 |
| 1993-03-13 | 83.519 |
| 1993-03-14 | 82.092 |
| 1993-03-15 | 82.524 |
| 1993-03-16 | 83.326 |
| 1993-03-17 | 85.224 |
| 1993-03-18 | 85.41 |
| 1993-03-19 | 87.314 |
| 1993-03-20 | 86.237 |
| 1993-03-21 | 85.396 |
| 1993-03-22 | 87.645 |
| 1993-03-23 | 90.277 |
| 1993-03-24 | 90.442 |
| 1993-03-25 | 91.063 |
| 1993-03-26 | 92.886 |
| 1993-03-27 | 92.771 |
| 1993-03-28 | 91.726 |
| 1993-03-29 | 91.622 |
| 1993-03-30 | 93.668 |
| 1993-03-31 | 93.198 |
| 1993-04-01 | 93.943 |
| 1993-04-02 | 95.358 |
| 1993-04-03 | 97.214 |
| 1993-04-04 | 98.248 |
| 1993-04-05 | 99.419 |
| 1993-04-06 | 99.788 |
| 1993-04-07 | 100.621 |
| 1993-04-08 | 101.309 |
| 1993-04-09 | 102.724 |
| 1993-04-10 | 102.141 |
| 1993-04-11 | 100.854 |
| 1993-04-12 | 102.203 |
| 1993-04-13 | 104.513 |
| 1993-04-14 | 107.18 |
| 1993-04-15 | 108.501 |
| 1993-04-16 | 107.592 |
| 1993-04-17 | 109.116 |
| 1993-04-18 | 108.171 |
| 1993-04-19 | 110.731 |
| 1993-04-20 | 112.676 |
| 1993-04-21 | 111.863 |
| 1993-04-22 | 110.748 |
| 1993-04-23 | 111.074 |
| 1993-04-24 | 111.221 |
| 1993-04-25 | 109.45 |
| 1993-04-26 | 109.738 |
| 1993-04-27 | 112.128 |
| 1993-04-28 | 113.031 |
| 1993-04-29 | 112.357 |
| 1993-04-30 | 113.779 |
| 1993-05-01 | 113.482 |
| 1993-05-02 | 113.185 |
| 1993-05-03 | 114.263 |
| 1993-05-04 | 116.306 |
| 1993-05-05 | 115.972 |
| 1993-05-06 | 117.539 |
| 1993-05-07 | 119.841 |
| 1993-05-08 | 118.691 |
| 1993-05-09 | 117.61 |
| 1993-05-10 | 119.244 |
| 1993-05-11 | 119.667 |
| 1993-05-12 | 118.749 |
| 1993-05-13 | 117.741 |
| 1993-05-14 | 117.241 |
| 1993-05-15 | 115.65 |
| 1993-05-16 | 114.446 |
| 1993-05-17 | 115.789 |
| 1993-05-18 | 117.606 |
| 1993-05-19 | 116.152 |
| 1993-05-20 | 114.276 |
| 1993-05-21 | 113.681 |
| 1993-05-22 | 114.221 |
| 1993-05-23 | 113.753 |
| 1993-05-24 | 114.402 |
| 1993-05-25 | 115.39 |
| 1993-05-26 | 115.744 |
| 1993-05-27 | 113.573 |
| 1993-05-28 | 112.083 |
| 1993-05-29 | 110.746 |
| 1993-05-30 | 109.346 |
| 1993-05-31 | 110.594 |
| 1993-06-01 | 112.545 |
| 1993-06-02 | 109.186 |
| 1993-06-03 | 105.951 |
| 1993-06-04 | 105.796 |
| 1993-06-05 | 106.641 |
| 1993-06-06 | 102.449 |
| 1993-06-07 | 102.117 |
| 1993-06-08 | 102.47 |
| 1993-06-09 | 101.566 |
| 1993-06-10 | 100.398 |
| 1993-06-11 | 99.303 |
| 1993-06-12 | 99.746 |
| 1993-06-13 | 97.507 |
| 1993-06-14 | 96.742 |
| 1993-06-15 | 97.405 |
| 1993-06-16 | 95.847 |
| 1993-06-17 | 94.469 |
| 1993-06-18 | 94.532 |
| 1993-06-19 | 95.276 |
| 1993-06-20 | 95.256 |
| 1993-06-21 | 94.471 |
| 1993-06-22 | 96.68 |
| 1993-06-23 | 97.285 |
| 1993-06-24 | 96.488 |
| 1993-06-25 | 96.179 |
| 1993-06-26 | 99.032 |
| 1993-06-27 | 99.126 |
| 1993-06-28 | 103.191 |
| 1993-06-29 | 105.806 |
| 1993-06-30 | 105.138 |
| 1993-07-01 | 103.594 |
| 1993-07-02 | 106.713 |
| 1993-07-03 | 109.837 |
| 1993-07-04 | 109.858 |
| 1993-07-05 | 109.547 |
| 1993-07-06 | 112.172 |
| 1993-07-07 | 113.794 |
| 1993-07-08 | 114.049 |
| 1993-07-09 | 114.353 |
| 1993-07-10 | 116.698 |
| 1993-07-11 | 118.457 |
| 1993-07-12 | 120.399 |
| 1993-07-13 | 123.076 |
| 1993-07-14 | 125.176 |
| 1993-07-15 | 126.443 |
| 1993-07-16 | 126.469 |
| 1993-07-17 | 128.563 |
| 1993-07-18 | 127.485 |
| 1993-07-19 | 129.214 |
| 1993-07-20 | 131.72 |
| 1993-07-21 | 132.432 |
| 1993-07-22 | 131.041 |
| 1993-07-23 | 129.918 |
| 1993-07-24 | 130.185 |
| 1993-07-25 | 127.875 |
| 1993-07-26 | 127.188 |
| 1993-07-27 | 128.856 |
| 1993-07-28 | 127.81 |
| 1993-07-29 | 126.108 |
| 1993-07-30 | 125.125 |
| 1993-07-31 | 125.553 |
| 1993-08-01 | 123.431 |
| 1993-08-02 | 122.029 |
| 1993-08-03 | 122.479 |
| 1993-08-04 | 121.075 |
| 1993-08-05 | 119.208 |
| 1993-08-06 | 116.474 |
| 1993-08-07 | 116.184 |
| 1993-08-08 | 114.609 |
| 1993-08-09 | 112.372 |
| 1993-08-10 | 111.828 |
| 1993-08-11 | 108.474 |
| 1993-08-12 | 106.817 |
| 1993-08-13 | 105.468 |
| 1993-08-14 | 104.217 |
| 1993-08-15 | 101.231 |
| 1993-08-16 | 99.635 |
| 1993-08-17 | 100.211 |
| 1993-08-18 | 99.058 |
| 1993-08-19 | 97.231 |
| 1993-08-20 | 96.559 |
| 1993-08-21 | 97.207 |
| 1993-08-22 | 95.717 |
| 1993-08-23 | 95.905 |
| 1993-08-24 | 96.804 |
| 1993-08-25 | 97.034 |
| 1993-08-26 | 98.214 |
| 1993-08-27 | 97.978 |
| 1993-08-28 | 98.038 |
| 1993-08-29 | 98.342 |
| 1993-08-30 | 97.704 |
| 1993-08-31 | 96.915 |
| 1993-09-01 | 95.406 |
| 1993-09-02 | 93.783 |
| 1993-09-03 | 93.918 |
| 1993-09-04 | 93.771 |
| 1993-09-05 | 94.109 |
| 1993-09-06 | 93.734 |
| 1993-09-07 | 95.665 |
| 1993-09-08 | 95.339 |
| 1993-09-09 | 94.884 |
| 1993-09-10 | 95.845 |
| 1993-09-11 | 96.008 |
| 1993-09-12 | 95.153 |
| 1993-09-13 | 94.58 |
| 1993-09-14 | 96.463 |
| 1993-09-15 | 94.805 |
| 1993-09-16 | 95.921 |
| 1993-09-17 | 94.936 |
| 1993-09-18 | 94.675 |
| 1993-09-19 | 94.786 |
| 1993-09-20 | 94.324 |
| 1993-09-21 | 95.052 |
| 1993-09-22 | 94.745 |
| 1993-09-23 | 95.197 |
| 1993-09-24 | 93.041 |
| 1993-09-25 | 90.454 |
| 1993-09-26 | 86.912 |
| 1993-09-27 | 85.726 |
| 1993-09-28 | 87.6 |
| 1993-09-29 | 86.974 |
| 1993-09-30 | 88.075 |
| 1993-10-01 | 91.163 |
| 1993-10-02 | 92.06 |
| 1993-10-03 | 90.406 |
| 1993-10-04 | 91.733 |
| 1993-10-05 | 93.243 |
| 1993-10-06 | 93.549 |
| 1993-10-07 | 92.634 |
| 1993-10-08 | 93.945 |
| 1993-10-09 | 94.055 |
| 1993-10-10 | 92.741 |
| 1993-10-11 | 91.883 |
| 1993-10-12 | 94 |
| 1993-10-13 | 95.948 |
| 1993-10-14 | 96.553 |
| 1993-10-15 | 97.678 |
| 1993-10-16 | 96.813 |
| 1993-10-17 | 97.295 |
| 1993-10-18 | 98.447 |
| 1993-10-19 | 100.137 |
| 1993-10-20 | 101.397 |
| 1993-10-21 | 101.311 |
| 1993-10-22 | 101.748 |
| 1993-10-23 | 101.537 |
| 1993-10-24 | 102.375 |
| 1993-10-25 | 105.181 |
| 1993-10-26 | 108.402 |
| 1993-10-27 | 108.953 |
| 1993-10-28 | 106.911 |
| 1993-10-29 | 107.779 |
| 1993-10-30 | 107.6 |
| 1993-10-31 | 104.008 |
| 1993-11-01 | 104.462 |
| 1993-11-02 | 105.177 |
| 1993-11-03 | 104.804 |
| 1993-11-04 | 103.05 |
| 1993-11-05 | 102.244 |
| 1993-11-06 | 103.263 |
| 1993-11-07 | 103.327 |
| 1993-11-08 | 102.852 |
| 1993-11-09 | 103.434 |
| 1993-11-10 | 103.354 |
| 1993-11-11 | 102.258 |
| 1993-11-12 | 99.702 |
| 1993-11-13 | 98.269 |
| 1993-11-14 | 96.755 |
| 1993-11-15 | 95.821 |
| 1993-11-16 | 95.172 |
| 1993-11-17 | 95.299 |
| 1993-11-18 | 93.377 |
| 1993-11-19 | 92.283 |
| 1993-11-20 | 91.448 |
| 1993-11-21 | 89.664 |
| 1993-11-22 | 89.14 |
| 1993-11-23 | 88.924 |
| 1993-11-24 | 86.145 |
| 1993-11-25 | 83.628 |
| 1993-11-26 | 82.66 |
| 1993-11-27 | 83.317 |
| 1993-11-28 | 81.568 |
| 1993-11-29 | 81.709 |
| 1993-11-30 | 83.57 |
| 1993-12-01 | 83.019 |
| 1993-12-02 | 82.011 |
| 1993-12-03 | 80.876 |
| 1993-12-04 | 81.413 |
| 1993-12-05 | 81.136 |
| 1993-12-06 | 79.413 |
| 1993-12-07 | 78.244 |
| 1993-12-08 | 79.362 |
| 1993-12-09 | 79.492 |
| 1993-12-10 | 80.813 |
| 1993-12-11 | 79.763 |
| 1993-12-12 | 79.449 |
| 1993-12-13 | 79.07 |
| 1993-12-14 | 80.907 |
| 1993-12-15 | 81.283 |
| 1993-12-16 | 81.602 |
| 1993-12-17 | 81.03 |
| 1993-12-18 | 80.453 |
| 1993-12-19 | 78.295 |
| 1993-12-20 | 79.262 |
| 1993-12-21 | 80.33 |
| 1993-12-22 | 79.662 |
| 1993-12-23 | 79.068 |
| 1993-12-24 | 79.725 |
| 1993-12-25 | 81 |
| 1993-12-26 | 81.629 |
| 1993-12-27 | 81.569 |
| 1993-12-28 | 83.501 |
| 1993-12-29 | 83.245 |
| 1993-12-30 | 80.542 |
| 1993-12-31 | 81.478 |
| 1994-01-01 | 82.652 |
| 1994-01-02 | 81.988 |
| 1994-01-03 | 81.618 |
| 1994-01-04 | 83.34 |
| 1994-01-05 | 84.512 |
| 1994-01-06 | 86.241 |
| 1994-01-07 | 85.68 |
| 1994-01-08 | 86.666 |
| 1994-01-09 | 85.378 |
| 1994-01-10 | 85.917 |
| 1994-01-11 | 88.047 |
| 1994-01-12 | 89.866 |
| 1994-01-13 | 89.068 |
| 1994-01-14 | 89.467 |
| 1994-01-15 | 89.932 |
| 1994-01-16 | 88.54 |
| 1994-01-17 | 88.579 |
| 1994-01-18 | 90.439 |
| 1994-01-19 | 90.12 |
| 1994-01-20 | 87.865 |
| 1994-01-21 | 88.078 |
| 1994-01-22 | 87.985 |
| 1994-01-23 | 86.194 |
| 1994-01-24 | 86.141 |
| 1994-01-25 | 86.443 |
| 1994-01-26 | 85.485 |
| 1994-01-27 | 84.636 |
| 1994-01-28 | 85.338 |
| 1994-01-29 | 86.123 |
| 1994-01-30 | 83.662 |
| 1994-01-31 | 83.975 |
| 1994-02-01 | 84.49 |
| 1994-02-02 | 84.734 |
| 1994-02-03 | 84.01 |
| 1994-02-04 | 84.103 |
| 1994-02-05 | 83.144 |
| 1994-02-06 | 82.783 |
| 1994-02-07 | 82.883 |
| 1994-02-08 | 86.814 |
| 1994-02-09 | 88.547 |
| 1994-02-10 | 88.873 |
| 1994-02-11 | 89.359 |
| 1994-02-12 | 89.778 |
| 1994-02-13 | 89.408 |
| 1994-02-14 | 91.813 |
| 1994-02-15 | 94.645 |
| 1994-02-16 | 98.582 |
| 1994-02-17 | 100.52 |
| 1994-02-18 | 101.552 |
| 1994-02-19 | 106.015 |
| 1994-02-20 | 108.482 |
| 1994-02-21 | 111.429 |
| 1994-02-22 | 114.673 |
| 1994-02-23 | 114.853 |
| 1994-02-24 | 115.341 |
| 1994-02-25 | 115.349 |
| 1994-02-26 | 116.004 |
| 1994-02-27 | 115.468 |
| 1994-02-28 | 116.695 |
| 1994-03-01 | 118.326 |
| 1994-03-02 | 119.013 |
| 1994-03-03 | 119.685 |
| 1994-03-04 | 121.093 |
| 1994-03-05 | 121.779 |
| 1994-03-06 | 119.904 |
| 1994-03-07 | 120.581 |
| 1994-03-08 | 120.832 |
| 1994-03-09 | 120.438 |
| 1994-03-10 | 118.625 |
| 1994-03-11 | 117.943 |
| 1994-03-12 | 115.397 |
| 1994-03-13 | 113.148 |
| 1994-03-14 | 112.306 |
| 1994-03-15 | 111.729 |
| 1994-03-16 | 109.469 |
| 1994-03-17 | 107.41 |
| 1994-03-18 | 104.695 |
| 1994-03-19 | 101.969 |
| 1994-03-20 | 102.455 |
| 1994-03-21 | 100.799 |
| 1994-03-22 | 100.871 |
| 1994-03-23 | 99.256 |
| 1994-03-24 | 97.634 |
| 1994-03-25 | 96.399 |
| 1994-03-26 | 94.854 |
| 1994-03-27 | 94.339 |
| 1994-03-28 | 94.816 |
| 1994-03-29 | 94 |
| 1994-03-30 | 93.18 |
| 1994-03-31 | 93.375 |
| 1994-04-01 | 92.787 |
| 1994-04-02 | 92.213 |
| 1994-04-03 | 90.13 |
| 1994-04-04 | 88.806 |
| 1994-04-05 | 90.159 |
| 1994-04-06 | 88.673 |
| 1994-04-07 | 87.345 |
| 1994-04-08 | 87.082 |
| 1994-04-09 | 84.59 |
| 1994-04-10 | 82.845 |
| 1994-04-11 | 84.698 |
| 1994-04-12 | 86.017 |
| 1994-04-13 | 86.55 |
| 1994-04-14 | 86.994 |
| 1994-04-15 | 88.275 |
| 1994-04-16 | 88.106 |
| 1994-04-17 | 86.417 |
| 1994-04-18 | 88.217 |
| 1994-04-19 | 87.545 |
| 1994-04-20 | 88.85 |
| 1994-04-21 | 87.819 |
| 1994-04-22 | 89.295 |
| 1994-04-23 | 90.07 |
| 1994-04-24 | 90.494 |
| 1994-04-25 | 92.537 |
| 1994-04-26 | 93.823 |
| 1994-04-27 | 93.267 |
| 1994-04-28 | 94.41 |
| 1994-04-29 | 95.569 |
| 1994-04-30 | 94.699 |
| 1994-05-01 | 93.711 |
| 1994-05-02 | 94.75 |
| 1994-05-03 | 96.765 |
| 1994-05-04 | 98.803 |
| 1994-05-05 | 98.957 |
| 1994-05-06 | 102.249 |
| 1994-05-07 | 103.111 |
| 1994-05-08 | 103.688 |
| 1994-05-09 | 106.613 |
| 1994-05-10 | 108.6 |
| 1994-05-11 | 107.833 |
| 1994-05-12 | 107.746 |
| 1994-05-13 | 109.4 |
| 1994-05-14 | 109.702 |
| 1994-05-15 | 107.885 |
| 1994-05-16 | 108.742 |
| 1994-05-17 | 109.92 |
| 1994-05-18 | 108.713 |
| 1994-05-19 | 107.467 |
| 1994-05-20 | 105.142 |
| 1994-05-21 | 104.487 |
| 1994-05-22 | 102.159 |
| 1994-05-23 | 101.914 |
| 1994-05-24 | 103.475 |
| 1994-05-25 | 103.337 |
| 1994-05-26 | 104.042 |
| 1994-05-27 | 105.428 |
| 1994-05-28 | 105.434 |
| 1994-05-29 | 104.342 |
| 1994-05-30 | 105.331 |
| 1994-05-31 | 106.762 |
| 1994-06-01 | 108.108 |
| 1994-06-02 | 106.503 |
| 1994-06-03 | 106.602 |
| 1994-06-04 | 108.318 |
| 1994-06-05 | 106.188 |
| 1994-06-06 | 106.06 |
| 1994-06-07 | 105.409 |
| 1994-06-08 | 104.004 |
| 1994-06-09 | 103.852 |
| 1994-06-10 | 106.338 |
| 1994-06-11 | 107.308 |
| 1994-06-12 | 106.018 |
| 1994-06-13 | 109.959 |
| 1994-06-14 | 111.547 |
| 1994-06-15 | 113.305 |
| 1994-06-16 | 114.182 |
| 1994-06-17 | 115.079 |
| 1994-06-18 | 117.719 |
| 1994-06-19 | 117.381 |
| 1994-06-20 | 119.988 |
| 1994-06-21 | 121.762 |
| 1994-06-22 | 121.348 |
| 1994-06-23 | 120.745 |
| 1994-06-24 | 121.881 |
| 1994-06-25 | 121.188 |
| 1994-06-26 | 118.457 |
| 1994-06-27 | 120.487 |
| 1994-06-28 | 122.243 |
| 1994-06-29 | 122.217 |
| 1994-06-30 | 121.076 |
| 1994-07-01 | 118.003 |
| 1994-07-02 | 118.543 |
| 1994-07-03 | 116.449 |
| 1994-07-04 | 115.319 |
| 1994-07-05 | 116.042 |
| 1994-07-06 | 118.082 |
| 1994-07-07 | 118.902 |
| 1994-07-08 | 119.965 |
| 1994-07-09 | 119.359 |
| 1994-07-10 | 117.428 |
| 1994-07-11 | 117.594 |
| 1994-07-12 | 116.712 |
| 1994-07-13 | 113.681 |
| 1994-07-14 | 112.609 |
| 1994-07-15 | 109.885 |
| 1994-07-16 | 109.952 |
| 1994-07-17 | 107.31 |
| 1994-07-18 | 106.013 |
| 1994-07-19 | 106.421 |
| 1994-07-20 | 103.719 |
| 1994-07-21 | 101.459 |
| 1994-07-22 | 101.757 |
| 1994-07-23 | 101.418 |
| 1994-07-24 | 98.082 |
| 1994-07-25 | 96.986 |
| 1994-07-26 | 98.163 |
| 1994-07-27 | 97.463 |
| 1994-07-28 | 97.706 |
| 1994-07-29 | 99.06 |
| 1994-07-30 | 101.199 |
| 1994-07-31 | 103.041 |
| 1994-08-01 | 105.766 |
| 1994-08-02 | 107.425 |
| 1994-08-03 | 106.733 |
| 1994-08-04 | 106.453 |
| 1994-08-05 | 106.277 |
| 1994-08-06 | 106.456 |
| 1994-08-07 | 104.902 |
| 1994-08-08 | 106.129 |
| 1994-08-09 | 107.022 |
| 1994-08-10 | 106.205 |
| 1994-08-11 | 106.817 |
| 1994-08-12 | 106.348 |
| 1994-08-13 | 107.118 |
| 1994-08-14 | 107.168 |
| 1994-08-15 | 106.392 |
| 1994-08-16 | 108.067 |
| 1994-08-17 | 107.046 |
| 1994-08-18 | 106.396 |
| 1994-08-19 | 106.469 |
| 1994-08-20 | 107.757 |
| 1994-08-21 | 107.281 |
| 1994-08-22 | 106.798 |
| 1994-08-23 | 106.758 |
| 1994-08-24 | 107.496 |
| 1994-08-25 | 107.41 |
| 1994-08-26 | 106.005 |
| 1994-08-27 | 104.182 |
| 1994-08-28 | 101.589 |
| 1994-08-29 | 101.079 |
| 1994-08-30 | 100.186 |
| 1994-08-31 | 98.319 |
| 1994-09-01 | 97.427 |
| 1994-09-02 | 98.681 |
| 1994-09-03 | 96.795 |
| 1994-09-04 | 94.61 |
| 1994-09-05 | 93.447 |
| 1994-09-06 | 93.55 |
| 1994-09-07 | 91.589 |
| 1994-09-08 | 90.708 |
| 1994-09-09 | 89.248 |
| 1994-09-10 | 88.707 |
| 1994-09-11 | 86.905 |
| 1994-09-12 | 86.458 |
| 1994-09-13 | 87.644 |
| 1994-09-14 | 87.047 |
| 1994-09-15 | 88.072 |
| 1994-09-16 | 88.503 |
| 1994-09-17 | 89.694 |
| 1994-09-18 | 89.583 |
| 1994-09-19 | 90.661 |
| 1994-09-20 | 92.744 |
| 1994-09-21 | 93.05 |
| 1994-09-22 | 94.701 |
| 1994-09-23 | 94.933 |
| 1994-09-24 | 94.401 |
| 1994-09-25 | 94.133 |
| 1994-09-26 | 94.625 |
| 1994-09-27 | 97.822 |
| 1994-09-28 | 97.851 |
| 1994-09-29 | 98.513 |
| 1994-09-30 | 97.799 |
| 1994-10-01 | 96.423 |
| 1994-10-02 | 93.729 |
| 1994-10-03 | 95.205 |
| 1994-10-04 | 94.865 |
| 1994-10-05 | 94.493 |
| 1994-10-06 | 93.879 |
| 1994-10-07 | 93.359 |
| 1994-10-08 | 94.169 |
| 1994-10-09 | 94.433 |
| 1994-10-10 | 97.29 |
| 1994-10-11 | 103.687 |
| 1994-10-12 | 104.924 |
| 1994-10-13 | 104.564 |
| 1994-10-14 | 106.016 |
| 1994-10-15 | 106.147 |
| 1994-10-16 | 105.471 |
| 1994-10-17 | 106.19 |
| 1994-10-18 | 108.203 |
| 1994-10-19 | 107.501 |
| 1994-10-20 | 106.307 |
| 1994-10-21 | 106.559 |
| 1994-10-22 | 105.827 |
| 1994-10-23 | 105.423 |
| 1994-10-24 | 105.97 |
| 1994-10-25 | 106.108 |
| 1994-10-26 | 104.645 |
| 1994-10-27 | 102.541 |
| 1994-10-28 | 101.159 |
| 1994-10-29 | 99.784 |
| 1994-10-30 | 98.526 |
| 1994-10-31 | 99.315 |
| 1994-11-01 | 100.213 |
| 1994-11-02 | 99.204 |
| 1994-11-03 | 98.411 |
| 1994-11-04 | 98.498 |
| 1994-11-05 | 98.034 |
| 1994-11-06 | 97.936 |
| 1994-11-07 | 96.731 |
| 1994-11-08 | 96.078 |
| 1994-11-09 | 92.752 |
| 1994-11-10 | 86.548 |
| 1994-11-11 | 86.159 |
| 1994-11-12 | 87.467 |
| 1994-11-13 | 86.256 |
| 1994-11-14 | 85.357 |
| 1994-11-15 | 87.526 |
| 1994-11-16 | 86.868 |
| 1994-11-17 | 85.705 |
| 1994-11-18 | 84.686 |
| 1994-11-19 | 83.711 |
| 1994-11-20 | 81.628 |
| 1994-11-21 | 82.715 |
| 1994-11-22 | 82.848 |
| 1994-11-23 | 82.346 |
| 1994-11-24 | 82.645 |
| 1994-11-25 | 84.265 |
| 1994-11-26 | 84.356 |
| 1994-11-27 | 84.031 |
| 1994-11-28 | 85.541 |
| 1994-11-29 | 88.562 |
| 1994-11-30 | 89.258 |
| 1994-12-01 | 90.334 |
| 1994-12-02 | 92.925 |
| 1994-12-03 | 95.425 |
| 1994-12-04 | 95.884 |
| 1994-12-05 | 97.933 |
| 1994-12-06 | 100.015 |
| 1994-12-07 | 100.094 |
| 1994-12-08 | 100.884 |
| 1994-12-09 | 101.459 |
| 1994-12-10 | 101.795 |
| 1994-12-11 | 99.251 |
| 1994-12-12 | 98.135 |
| 1994-12-13 | 99.815 |
| 1994-12-14 | 98.399 |
| 1994-12-15 | 96.999 |
| 1994-12-16 | 97.035 |
| 1994-12-17 | 97.262 |
| 1994-12-18 | 95.842 |
| 1994-12-19 | 96.657 |
| 1994-12-20 | 99.399 |
| 1994-12-21 | 98.793 |
| 1994-12-22 | 98.099 |
| 1994-12-23 | 97.411 |
| 1994-12-24 | 97.488 |
| 1994-12-25 | 96.617 |
| 1994-12-26 | 98.267 |
| 1994-12-27 | 100.546 |
| 1994-12-28 | 101.302 |
| 1994-12-29 | 98.142 |
| 1994-12-30 | 98.042 |
| 1994-12-31 | 98.979 |
| 1995-01-01 | 96.607 |
| 1995-01-02 | 94.962 |
| 1995-01-03 | 95.474 |
| 1995-01-04 | 94.497 |
| 1995-01-05 | 93.812 |
| 1995-01-06 | 93.822 |
| 1995-01-07 | 94.968 |
| 1995-01-08 | 93.679 |
| 1995-01-09 | 96.135 |
| 1995-01-10 | 96.96 |
| 1995-01-11 | 96.69 |
| 1995-01-12 | 94.693 |
| 1995-01-13 | 95.367 |
| 1995-01-14 | 94.575 |
| 1995-01-15 | 92.518 |
| 1995-01-16 | 92.07 |
| 1995-01-17 | 92.758 |
| 1995-01-18 | 92.259 |
| 1995-01-19 | 90.583 |
| 1995-01-20 | 89.524 |
| 1995-01-21 | 90.086 |
| 1995-01-22 | 89.288 |
| 1995-01-23 | 88.99 |
| 1995-01-24 | 89.843 |
| 1995-01-25 | 87.756 |
| 1995-01-26 | 84.659 |
| 1995-01-27 | 82.186 |
| 1995-01-28 | 81.811 |
| 1995-01-29 | 80.027 |
| 1995-01-30 | 80.024 |
| 1995-01-31 | 81.605 |
| 1995-02-01 | 81.833 |
| 1995-02-02 | 79.895 |
| 1995-02-03 | 78.568 |
| 1995-02-04 | 76.57 |
| 1995-02-05 | 76.019 |
| 1995-02-06 | 75.302 |
| 1995-02-07 | 76.792 |
| 1995-02-08 | 74.366 |
| 1995-02-09 | 74.475 |
| 1995-02-10 | 74.515 |
| 1995-02-11 | 74.787 |
| 1995-02-12 | 74.405 |
| 1995-02-13 | 74.773 |
| 1995-02-14 | 75.685 |
| 1995-02-15 | 75.559 |
| 1995-02-16 | 75.839 |
| 1995-02-17 | 75.43 |
| 1995-02-18 | 75.607 |
| 1995-02-19 | 76.341 |
| 1995-02-20 | 76.711 |
| 1995-02-21 | 79.477 |
| 1995-02-22 | 79.808 |
| 1995-02-23 | 79.333 |
| 1995-02-24 | 79.729 |
| 1995-02-25 | 80.548 |
| 1995-02-26 | 79.724 |
| 1995-02-27 | 79.774 |
| 1995-02-28 | 80.66 |
| 1995-03-01 | 79.018 |
| 1995-03-02 | 76.412 |
| 1995-03-03 | 75.651 |
| 1995-03-04 | 76.065 |
| 1995-03-05 | 76.143 |
| 1995-03-06 | 78.612 |
| 1995-03-07 | 78.387 |
| 1995-03-08 | 78.163 |
| 1995-03-09 | 78.479 |
| 1995-03-10 | 78.805 |
| 1995-03-11 | 78.267 |
| 1995-03-12 | 76.477 |
| 1995-03-13 | 76.447 |
| 1995-03-14 | 76.951 |
| 1995-03-15 | 77.51 |
| 1995-03-16 | 76.539 |
| 1995-03-17 | 75 |
| 1995-03-18 | 74.702 |
| 1995-03-19 | 72.927 |
| 1995-03-20 | 73.855 |
| 1995-03-21 | 75.439 |
| 1995-03-22 | 76.084 |
| 1995-03-23 | 77.095 |
| 1995-03-24 | 78.49 |
| 1995-03-25 | 77.719 |
| 1995-03-26 | 76.942 |
| 1995-03-27 | 77.578 |
| 1995-03-28 | 80.425 |
| 1995-03-29 | 82.308 |
| 1995-03-30 | 82.807 |
| 1995-03-31 | 83.198 |
| 1995-04-01 | 83.95 |
| 1995-04-02 | 84.003 |
| 1995-04-03 | 84.161 |
| 1995-04-04 | 85.648 |
| 1995-04-05 | 85.881 |
| 1995-04-06 | 87.387 |
| 1995-04-07 | 88.061 |
| 1995-04-08 | 87.848 |
| 1995-04-09 | 87.489 |
| 1995-04-10 | 88.208 |
| 1995-04-11 | 88.828 |
| 1995-04-12 | 89.254 |
| 1995-04-13 | 89.65 |
| 1995-04-14 | 89.669 |
| 1995-04-15 | 91.14 |
| 1995-04-16 | 92.37 |
| 1995-04-17 | 94.815 |
| 1995-04-18 | 97.384 |
| 1995-04-19 | 97.365 |
| 1995-04-20 | 98.327 |
| 1995-04-21 | 101.428 |
| 1995-04-22 | 99.411 |
| 1995-04-23 | 98.442 |
| 1995-04-24 | 99.84 |
| 1995-04-25 | 100.229 |
| 1995-04-26 | 100.284 |
| 1995-04-27 | 98.483 |
| 1995-04-28 | 97.458 |
| 1995-04-29 | 99.065 |
| 1995-04-30 | 98.382 |
| 1995-05-01 | 101.737 |
| 1995-05-02 | 104.032 |
| 1995-05-03 | 106.745 |
| 1995-05-04 | 106.341 |
| 1995-05-05 | 105.301 |
| 1995-05-06 | 103.862 |
| 1995-05-07 | 102.734 |
| 1995-05-08 | 103.349 |
| 1995-05-09 | 104.147 |
| 1995-05-10 | 103.785 |
| 1995-05-11 | 104.576 |
| 1995-05-12 | 104.134 |
| 1995-05-13 | 102.791 |
| 1995-05-14 | 101.245 |
| 1995-05-15 | 100.598 |
| 1995-05-16 | 99.67 |
| 1995-05-17 | 97.455 |
| 1995-05-18 | 96.39 |
| 1995-05-19 | 95.949 |
| 1995-05-20 | 92.388 |
| 1995-05-21 | 86.934 |
| 1995-05-22 | 86.468 |
| 1995-05-23 | 85.887 |
| 1995-05-24 | 85.736 |
| 1995-05-25 | 85.154 |
| 1995-05-26 | 84.534 |
| 1995-05-27 | 85.061 |
| 1995-05-28 | 84.316 |
| 1995-05-29 | 83.433 |
| 1995-05-30 | 85.948 |
| 1995-05-31 | 84.788 |
| 1995-06-01 | 85.942 |
| 1995-06-02 | 85.14 |
| 1995-06-03 | 85.362 |
| 1995-06-04 | 85.079 |
| 1995-06-05 | 87.504 |
| 1995-06-06 | 88.089 |
| 1995-06-07 | 88.302 |
| 1995-06-08 | 88.007 |
| 1995-06-09 | 89.787 |
| 1995-06-10 | 90.096 |
| 1995-06-11 | 89.344 |
| 1995-06-12 | 90.191 |
| 1995-06-13 | 91.852 |
| 1995-06-14 | 94.695 |
| 1995-06-15 | 97.768 |
| 1995-06-16 | 99.78 |
| 1995-06-17 | 101.841 |
| 1995-06-18 | 102.363 |
| 1995-06-19 | 104.974 |
| 1995-06-20 | 107.469 |
| 1995-06-21 | 108.956 |
| 1995-06-22 | 110.513 |
| 1995-06-23 | 110.302 |
| 1995-06-24 | 109.998 |
| 1995-06-25 | 110.181 |
| 1995-06-26 | 110.34 |
| 1995-06-27 | 110.828 |
| 1995-06-28 | 109.352 |
| 1995-06-29 | 108.336 |
| 1995-06-30 | 106.53 |
| 1995-07-01 | 104.284 |
| 1995-07-02 | 102.575 |
| 1995-07-03 | 100.875 |
| 1995-07-04 | 102.161 |
| 1995-07-05 | 99.479 |
| 1995-07-06 | 99.237 |
| 1995-07-07 | 98.444 |
| 1995-07-08 | 98.496 |
| 1995-07-09 | 95.645 |
| 1995-07-10 | 95.76 |
| 1995-07-11 | 96.196 |
| 1995-07-12 | 97.675 |
| 1995-07-13 | 97.224 |
| 1995-07-14 | 95.11 |
| 1995-07-15 | 93.785 |
| 1995-07-16 | 92.69 |
| 1995-07-17 | 94.257 |
| 1995-07-18 | 93.828 |
| 1995-07-19 | 93.703 |
| 1995-07-20 | 93.547 |
| 1995-07-21 | 93.186 |
| 1995-07-22 | 92.316 |
| 1995-07-23 | 91.542 |
| 1995-07-24 | 94.796 |
| 1995-07-25 | 96.837 |
| 1995-07-26 | 99.8 |
| 1995-07-27 | 102.937 |
| 1995-07-28 | 105.47 |
| 1995-07-29 | 106.814 |
| 1995-07-30 | 107.102 |
| 1995-07-31 | 109.334 |
| 1995-08-01 | 110.262 |
| 1995-08-02 | 112.874 |
| 1995-08-03 | 112.374 |
| 1995-08-04 | 114.736 |
| 1995-08-05 | 115.97 |
| 1995-08-06 | 116.262 |
| 1995-08-07 | 118.339 |
| 1995-08-08 | 120.682 |
| 1995-08-09 | 121.444 |
| 1995-08-10 | 122.522 |
| 1995-08-11 | 122.553 |
| 1995-08-12 | 122.868 |
| 1995-08-13 | 123.016 |
| 1995-08-14 | 125.01 |
| 1995-08-15 | 125.537 |
| 1995-08-16 | 123.142 |
| 1995-08-17 | 123.435 |
| 1995-08-18 | 124.425 |
| 1995-08-19 | 124.74 |
| 1995-08-20 | 123.676 |
| 1995-08-21 | 123.22 |
| 1995-08-22 | 123.942 |
| 1995-08-23 | 122.453 |
| 1995-08-24 | 120.146 |
| 1995-08-25 | 117.153 |
| 1995-08-26 | 114.591 |
| 1995-08-27 | 112.594 |
| 1995-08-28 | 110.28 |
| 1995-08-29 | 110.225 |
| 1995-08-30 | 108.81 |
| 1995-08-31 | 108.849 |
| 1995-09-01 | 107.309 |
| 1995-09-02 | 106.062 |
| 1995-09-03 | 103.686 |
| 1995-09-04 | 103.678 |
| 1995-09-05 | 103.973 |
| 1995-09-06 | 101.532 |
| 1995-09-07 | 101.03 |
| 1995-09-08 | 99.497 |
| 1995-09-09 | 99.747 |
| 1995-09-10 | 97.551 |
| 1995-09-11 | 97.644 |
| 1995-09-12 | 96.803 |
| 1995-09-13 | 93.993 |
| 1995-09-14 | 92.512 |
| 1995-09-15 | 90.379 |
| 1995-09-16 | 89.276 |
| 1995-09-17 | 85.23 |
| 1995-09-18 | 83.823 |
| 1995-09-19 | 83.127 |
| 1995-09-20 | 82.976 |
| 1995-09-21 | 82.069 |
| 1995-09-22 | 80.259 |
| 1995-09-23 | 80.577 |
| 1995-09-24 | 79.306 |
| 1995-09-25 | 77.781 |
| 1995-09-26 | 78.291 |
| 1995-09-27 | 76.567 |
| 1995-09-28 | 75.911 |
| 1995-09-29 | 74.048 |
| 1995-09-30 | 72.731 |
| 1995-10-01 | 72.802 |
| 1995-10-02 | 73.293 |
| 1995-10-03 | 73.258 |
| 1995-10-04 | 72.649 |
| 1995-10-05 | 70.753 |
| 1995-10-06 | 69.912 |
| 1995-10-07 | 69.439 |
| 1995-10-08 | 68.78 |
| 1995-10-09 | 66.978 |
| 1995-10-10 | 68.167 |
| 1995-10-11 | 67.221 |
| 1995-10-12 | 66.91 |
| 1995-10-13 | 66.111 |
| 1995-10-14 | 66.703 |
| 1995-10-15 | 68.113 |
| 1995-10-16 | 69.324 |
| 1995-10-17 | 69.908 |
| 1995-10-18 | 70.555 |
| 1995-10-19 | 71.337 |
| 1995-10-20 | 70.397 |
| 1995-10-21 | 70.299 |
| 1995-10-22 | 70.259 |
| 1995-10-23 | 68.334 |
| 1995-10-24 | 68.34 |
| 1995-10-25 | 68.634 |
| 1995-10-26 | 67.879 |
| 1995-10-27 | 68.744 |
| 1995-10-28 | 68.028 |
| 1995-10-29 | 67.979 |
| 1995-10-30 | 69.559 |
| 1995-10-31 | 68.641 |
| 1995-11-01 | 67.594 |
| 1995-11-02 | 68.557 |
| 1995-11-03 | 67.997 |
| 1995-11-04 | 67.184 |
| 1995-11-05 | 67.795 |
| 1995-11-06 | 68.182 |
| 1995-11-07 | 69.308 |
| 1995-11-08 | 70.088 |
| 1995-11-09 | 69.075 |
| 1995-11-10 | 69.053 |
| 1995-11-11 | 69.038 |
| 1995-11-12 | 69.101 |
| 1995-11-13 | 70.72 |
| 1995-11-14 | 71.891 |
| 1995-11-15 | 70.361 |
| 1995-11-16 | 69.875 |
| 1995-11-17 | 69.051 |
| 1995-11-18 | 69.237 |
| 1995-11-19 | 69.161 |
| 1995-11-20 | 69.215 |
| 1995-11-21 | 70.278 |
| 1995-11-22 | 72.995 |
| 1995-11-23 | 75.417 |
| 1995-11-24 | 77.917 |
| 1995-11-25 | 78.34 |
| 1995-11-26 | 78.053 |
| 1995-11-27 | 77.974 |
| 1995-11-28 | 78.368 |
| 1995-11-29 | 76.33 |
| 1995-11-30 | 76.835 |
| 1995-12-01 | 77.725 |
| 1995-12-02 | 75.612 |
| 1995-12-03 | 74.818 |
| 1995-12-04 | 76.646 |
| 1995-12-05 | 76.913 |
| 1995-12-06 | 75.995 |
| 1995-12-07 | 74.996 |
| 1995-12-08 | 74.562 |
| 1995-12-09 | 75.182 |
| 1995-12-10 | 75.166 |
| 1995-12-11 | 74.968 |
| 1995-12-12 | 75.755 |
| 1995-12-13 | 72.995 |
| 1995-12-14 | 70.94 |
| 1995-12-15 | 71.78 |
| 1995-12-16 | 73.444 |
| 1995-12-17 | 72.898 |
| 1995-12-18 | 72.324 |
| 1995-12-19 | 72.806 |
| 1995-12-20 | 72.804 |
| 1995-12-21 | 70.922 |
| 1995-12-22 | 68.496 |
| 1995-12-23 | 66.438 |
| 1995-12-24 | 63.499 |
| 1995-12-25 | 61.848 |
| 1995-12-26 | 62.227 |
| 1995-12-27 | 63.525 |
| 1995-12-28 | 63.411 |
| 1995-12-29 | 64.355 |
| 1995-12-30 | 64.27 |
| 1995-12-31 | 64.047 |
| 1996-01-01 | 66.661 |
| 1996-01-02 | 67.267 |
| 1996-01-03 | 65.984 |
| 1996-01-04 | 66.826 |
| 1996-01-05 | 67.437 |
| 1996-01-06 | 67.458 |
| 1996-01-07 | 67.414 |
| 1996-01-08 | 68.765 |
| 1996-01-09 | 68.787 |
| 1996-01-10 | 69.882 |
| 1996-01-11 | 70.267 |
| 1996-01-12 | 71.32 |
| 1996-01-13 | 71.318 |
| 1996-01-14 | 72.25 |
| 1996-01-15 | 73.664 |
| 1996-01-16 | 75.77 |
| 1996-01-17 | 76.801 |
| 1996-01-18 | 79.644 |
| 1996-01-19 | 81.001 |
| 1996-01-20 | 82.289 |
| 1996-01-21 | 83.564 |
| 1996-01-22 | 84.807 |
| 1996-01-23 | 85.637 |
| 1996-01-24 | 86.878 |
| 1996-01-25 | 87.463 |
| 1996-01-26 | 86.209 |
| 1996-01-27 | 86.293 |
| 1996-01-28 | 84.974 |
| 1996-01-29 | 86.312 |
| 1996-01-30 | 87.424 |
| 1996-01-31 | 85.709 |
| 1996-02-01 | 85.999 |
| 1996-02-02 | 88.755 |
| 1996-02-03 | 87.773 |
| 1996-02-04 | 86.651 |
| 1996-02-05 | 86.728 |
| 1996-02-06 | 86.207 |
| 1996-02-07 | 86.272 |
| 1996-02-08 | 87.395 |
| 1996-02-09 | 87.399 |
| 1996-02-10 | 87.269 |
| 1996-02-11 | 87.116 |
| 1996-02-12 | 87.234 |
| 1996-02-13 | 87.923 |
| 1996-02-14 | 86.402 |
| 1996-02-15 | 85.911 |
| 1996-02-16 | 85.868 |
| 1996-02-17 | 82.727 |
| 1996-02-18 | 81.589 |
| 1996-02-19 | 81.999 |
| 1996-02-20 | 83.224 |
| 1996-02-21 | 83.345 |
| 1996-02-22 | 84.086 |
| 1996-02-23 | 86.259 |
| 1996-02-24 | 84.925 |
| 1996-02-25 | 85.335 |
| 1996-02-26 | 86.966 |
| 1996-02-27 | 90.472 |
| 1996-02-28 | 93 |
| 1996-02-29 | 93.707 |
| 1996-03-01 | 94.856 |
| 1996-03-02 | 94.134 |
| 1996-03-03 | 92.292 |
| 1996-03-04 | 94.875 |
| 1996-03-05 | 98.61 |
| 1996-03-06 | 101.757 |
| 1996-03-07 | 104.056 |
| 1996-03-08 | 104.936 |
| 1996-03-09 | 105.394 |
| 1996-03-10 | 104.464 |
| 1996-03-11 | 105.325 |
| 1996-03-12 | 107.409 |
| 1996-03-13 | 109.083 |
| 1996-03-14 | 109.279 |
| 1996-03-15 | 110.74 |
| 1996-03-16 | 108.621 |
| 1996-03-17 | 107.541 |
| 1996-03-18 | 107.35 |
| 1996-03-19 | 107.335 |
| 1996-03-20 | 107.625 |
| 1996-03-21 | 105.995 |
| 1996-03-22 | 105.157 |
| 1996-03-23 | 104.91 |
| 1996-03-24 | 102.204 |
| 1996-03-25 | 105.332 |
| 1996-03-26 | 104.528 |
| 1996-03-27 | 103.105 |
| 1996-03-28 | 101.17 |
| 1996-03-29 | 98.703 |
| 1996-03-30 | 95.778 |
| 1996-03-31 | 94.4 |
| 1996-04-01 | 97.446 |
| 1996-04-02 | 98.137 |
| 1996-04-03 | 96.159 |
| 1996-04-04 | 93.029 |
| 1996-04-05 | 90.075 |
| 1996-04-06 | 88.301 |
| 1996-04-07 | 84.68 |
| 1996-04-08 | 85.12 |
| 1996-04-09 | 85.692 |
| 1996-04-10 | 84.046 |
| 1996-04-11 | 82.813 |
| 1996-04-12 | 82.116 |
| 1996-04-13 | 80.528 |
| 1996-04-14 | 79.14 |
| 1996-04-15 | 80.687 |
| 1996-04-16 | 81.134 |
| 1996-04-17 | 84.07 |
| 1996-04-18 | 86.71 |
| 1996-04-19 | 87.304 |
| 1996-04-20 | 89.222 |
| 1996-04-21 | 88.624 |
| 1996-04-22 | 90.642 |
| 1996-04-23 | 93.513 |
| 1996-04-24 | 92.094 |
| 1996-04-25 | 94.17 |
| 1996-04-26 | 95.943 |
| 1996-04-27 | 96.138 |
| 1996-04-28 | 94.416 |
| 1996-04-29 | 96.446 |
| 1996-04-30 | 99.164 |
| 1996-05-01 | 97.171 |
| 1996-05-02 | 96.282 |
| 1996-05-03 | 94.936 |
| 1996-05-04 | 93.782 |
| 1996-05-05 | 92.255 |
| 1996-05-06 | 93.354 |
| 1996-05-07 | 93.678 |
| 1996-05-08 | 91.428 |
| 1996-05-09 | 92.192 |
| 1996-05-10 | 91.637 |
| 1996-05-11 | 90.619 |
| 1996-05-12 | 89.304 |
| 1996-05-13 | 89.1 |
| 1996-05-14 | 87.857 |
| 1996-05-15 | 86.84 |
| 1996-05-16 | 87.385 |
| 1996-05-17 | 84.778 |
| 1996-05-18 | 82.549 |
| 1996-05-19 | 79.921 |
| 1996-05-20 | 79.617 |
| 1996-05-21 | 82.387 |
| 1996-05-22 | 80.433 |
| 1996-05-23 | 79.441 |
| 1996-05-24 | 79.619 |
| 1996-05-25 | 79.365 |
| 1996-05-26 | 76.937 |
| 1996-05-27 | 77.136 |
| 1996-05-28 | 78.17 |
| 1996-05-29 | 76.976 |
| 1996-05-30 | 74.845 |
| 1996-05-31 | 75.611 |
| 1996-06-01 | 75.451 |
| 1996-06-02 | 76.234 |
| 1996-06-03 | 76.961 |
| 1996-06-04 | 78.01 |
| 1996-06-05 | 76.262 |
| 1996-06-06 | 76.377 |
| 1996-06-07 | 76.687 |
| 1996-06-08 | 74.616 |
| 1996-06-09 | 73.612 |
| 1996-06-10 | 75.245 |
| 1996-06-11 | 75.471 |
| 1996-06-12 | 74.58 |
| 1996-06-13 | 75.447 |
| 1996-06-14 | 75.851 |
| 1996-06-15 | 75.326 |
| 1996-06-16 | 74.901 |
| 1996-06-17 | 75.553 |
| 1996-06-18 | 76.521 |
| 1996-06-19 | 76.824 |
| 1996-06-20 | 74.584 |
| 1996-06-21 | 75.974 |
| 1996-06-22 | 74.495 |
| 1996-06-23 | 73.53 |
| 1996-06-24 | 72.119 |
| 1996-06-25 | 74.407 |
| 1996-06-26 | 73.742 |
| 1996-06-27 | 77.178 |
| 1996-06-28 | 78.865 |
| 1996-06-29 | 80.337 |
| 1996-06-30 | 79.695 |
| 1996-07-01 | 81.388 |
| 1996-07-02 | 82.439 |
| 1996-07-03 | 82.265 |
| 1996-07-04 | 82.049 |
| 1996-07-05 | 83.127 |
| 1996-07-06 | 82.54 |
| 1996-07-07 | 82.204 |
| 1996-07-08 | 84.063 |
| 1996-07-09 | 87.394 |
| 1996-07-10 | 86.068 |
| 1996-07-11 | 87.808 |
| 1996-07-12 | 87.699 |
| 1996-07-13 | 86.902 |
| 1996-07-14 | 85.723 |
| 1996-07-15 | 85.862 |
| 1996-07-16 | 86.6 |
| 1996-07-17 | 86.911 |
| 1996-07-18 | 88.219 |
| 1996-07-19 | 87.752 |
| 1996-07-20 | 88.838 |
| 1996-07-21 | 88.978 |
| 1996-07-22 | 90.797 |
| 1996-07-23 | 91.202 |
| 1996-07-24 | 93.686 |
| 1996-07-25 | 92.674 |
| 1996-07-26 | 93.49 |
| 1996-07-27 | 90.955 |
| 1996-07-28 | 88.857 |
| 1996-07-29 | 89.817 |
| 1996-07-30 | 91.307 |
| 1996-07-31 | 92.094 |
| 1996-08-01 | 92.291 |
| 1996-08-02 | 92.359 |
| 1996-08-03 | 93.042 |
| 1996-08-04 | 93.583 |
| 1996-08-05 | 96.916 |
| 1996-08-06 | 99.231 |
| 1996-08-07 | 101.376 |
| 1996-08-08 | 102.496 |
| 1996-08-09 | 103.401 |
| 1996-08-10 | 101.99 |
| 1996-08-11 | 103.225 |
| 1996-08-12 | 103.429 |
| 1996-08-13 | 106.505 |
| 1996-08-14 | 105.962 |
| 1996-08-15 | 106.526 |
| 1996-08-16 | 104.987 |
| 1996-08-17 | 104.456 |
| 1996-08-18 | 102.571 |
| 1996-08-19 | 102.545 |
| 1996-08-20 | 101.45 |
| 1996-08-21 | 100.868 |
| 1996-08-22 | 101.562 |
| 1996-08-23 | 100.101 |
| 1996-08-24 | 99.007 |
| 1996-08-25 | 97.326 |
| 1996-08-26 | 96.569 |
| 1996-08-27 | 96.634 |
| 1996-08-28 | 94.274 |
| 1996-08-29 | 92.627 |
| 1996-08-30 | 92.265 |
| 1996-08-31 | 92.994 |
| 1996-09-01 | 94.219 |
| 1996-09-02 | 97.878 |
| 1996-09-03 | 100.842 |
| 1996-09-04 | 102.702 |
| 1996-09-05 | 102.875 |
| 1996-09-06 | 103.065 |
| 1996-09-07 | 100.419 |
| 1996-09-08 | 98.913 |
| 1996-09-09 | 99.776 |
| 1996-09-10 | 100.032 |
| 1996-09-11 | 102.238 |
| 1996-09-12 | 99.847 |
| 1996-09-13 | 100.878 |
| 1996-09-14 | 101.568 |
| 1996-09-15 | 102.117 |
| 1996-09-16 | 101.538 |
| 1996-09-17 | 103.466 |
| 1996-09-18 | 102.508 |
| 1996-09-19 | 101.738 |
| 1996-09-20 | 101.114 |
| 1996-09-21 | 99.297 |
| 1996-09-22 | 99.684 |
| 1996-09-23 | 99.536 |
| 1996-09-24 | 101.397 |
| 1996-09-25 | 101.056 |
| 1996-09-26 | 102.401 |
| 1996-09-27 | 103.727 |
| 1996-09-28 | 102.702 |
| 1996-09-29 | 100.456 |
| 1996-09-30 | 98.75 |
| 1996-10-01 | 98.03 |
| 1996-10-02 | 95.174 |
| 1996-10-03 | 91.021 |
| 1996-10-04 | 87.227 |
| 1996-10-05 | 83.985 |
| 1996-10-06 | 80.252 |
| 1996-10-07 | 79.588 |
| 1996-10-08 | 79.692 |
| 1996-10-09 | 79.803 |
| 1996-10-10 | 78.46 |
| 1996-10-11 | 76.018 |
| 1996-10-12 | 75.833 |
| 1996-10-13 | 73.368 |
| 1996-10-14 | 72.44 |
| 1996-10-15 | 72.16 |
| 1996-10-16 | 71.491 |
| 1996-10-17 | 70.471 |
| 1996-10-18 | 70.05 |
| 1996-10-19 | 69.189 |
| 1996-10-20 | 68.483 |
| 1996-10-21 | 69.344 |
| 1996-10-22 | 69.286 |
| 1996-10-23 | 69.311 |
| 1996-10-24 | 67.988 |
| 1996-10-25 | 67.207 |
| 1996-10-26 | 65.965 |
| 1996-10-27 | 63.638 |
| 1996-10-28 | 62.815 |
| 1996-10-29 | 63.776 |
| 1996-10-30 | 61.873 |
| 1996-10-31 | 61.895 |
| 1996-11-01 | 60.986 |
| 1996-11-02 | 61.144 |
| 1996-11-03 | 59.157 |
| 1996-11-04 | 61.088 |
| 1996-11-05 | 61.805 |
| 1996-11-06 | 62.003 |
| 1996-11-07 | 60.931 |
| 1996-11-08 | 59.306 |
| 1996-11-09 | 58.864 |
| 1996-11-10 | 59.475 |
| 1996-11-11 | 60.16 |
| 1996-11-12 | 62.457 |
| 1996-11-13 | 62.647 |
| 1996-11-14 | 62.593 |
| 1996-11-15 | 63.592 |
| 1996-11-16 | 63.423 |
| 1996-11-17 | 64.082 |
| 1996-11-18 | 65.403 |
| 1996-11-19 | 65.349 |
| 1996-11-20 | 65.031 |
| 1996-11-21 | 63.957 |
| 1996-11-22 | 63.092 |
| 1996-11-23 | 62.053 |
| 1996-11-24 | 62.33 |
| 1996-11-25 | 63.241 |
| 1996-11-26 | 65.101 |
| 1996-11-27 | 66.071 |
| 1996-11-28 | 65.855 |
| 1996-11-29 | 67.416 |
| 1996-11-30 | 65.886 |
| 1996-12-01 | 64.949 |
| 1996-12-02 | 65.37 |
| 1996-12-03 | 67.52 |
| 1996-12-04 | 67.219 |
| 1996-12-05 | 67.469 |
| 1996-12-06 | 68.307 |
| 1996-12-07 | 67.676 |
| 1996-12-08 | 67.396 |
| 1996-12-09 | 67.672 |
| 1996-12-10 | 68.666 |
| 1996-12-11 | 68.582 |
| 1996-12-12 | 67.847 |
| 1996-12-13 | 65.967 |
| 1996-12-14 | 66.01 |
| 1996-12-15 | 64.877 |
| 1996-12-16 | 65.546 |
| 1996-12-17 | 65.401 |
| 1996-12-18 | 64.635 |
| 1996-12-19 | 65.667 |
| 1996-12-20 | 67.535 |
| 1996-12-21 | 68.539 |
| 1996-12-22 | 70.116 |
| 1996-12-23 | 72.473 |
| 1996-12-24 | 72.468 |
| 1996-12-25 | 72.121 |
| 1996-12-26 | 71.649 |
| 1996-12-27 | 71.523 |
| 1996-12-28 | 70.791 |
| 1996-12-29 | 70.433 |
| 1996-12-30 | 73.987 |
| 1996-12-31 | 76.566 |
| 1997-01-01 | 77 |
| 1997-01-02 | 77.355 |
| 1997-01-03 | 76.215 |
| 1997-01-04 | 75.746 |
| 1997-01-05 | 75.168 |
| 1997-01-06 | 76.808 |
| 1997-01-07 | 77.765 |
| 1997-01-08 | 77.112 |
| 1997-01-09 | 74.711 |
| 1997-01-10 | 73.981 |
| 1997-01-11 | 73.429 |
| 1997-01-12 | 73.34 |
| 1997-01-13 | 72.382 |
| 1997-01-14 | 72.079 |
| 1997-01-15 | 70.907 |
| 1997-01-16 | 70.158 |
| 1997-01-17 | 69.601 |
| 1997-01-18 | 68.268 |
| 1997-01-19 | 65.917 |
| 1997-01-20 | 65.06 |
| 1997-01-21 | 64.014 |
| 1997-01-22 | 61.937 |
| 1997-01-23 | 61.722 |
| 1997-01-24 | 61.105 |
| 1997-01-25 | 59.19 |
| 1997-01-26 | 59.586 |
| 1997-01-27 | 59.702 |
| 1997-01-28 | 59.174 |
| 1997-01-29 | 56.572 |
| 1997-01-30 | 54.916 |
| 1997-01-31 | 52.827 |
| 1997-02-01 | 50.611 |
| 1997-02-02 | 49.503 |
| 1997-02-03 | 48.806 |
| 1997-02-04 | 47.959 |
| 1997-02-05 | 46.775 |
| 1997-02-06 | 45.98 |
| 1997-02-07 | 47.276 |
| 1997-02-08 | 47.376 |
| 1997-02-09 | 46.469 |
| 1997-02-10 | 46.932 |
| 1997-02-11 | 47.216 |
| 1997-02-12 | 48.202 |
| 1997-02-13 | 48.33 |
| 1997-02-14 | 47.85 |
| 1997-02-15 | 47.695 |
| 1997-02-16 | 47.621 |
| 1997-02-17 | 47.413 |
| 1997-02-18 | 47.608 |
| 1997-02-19 | 48.68 |
| 1997-02-20 | 49.301 |
| 1997-02-21 | 49.481 |
| 1997-02-22 | 48.952 |
| 1997-02-23 | 48.702 |
| 1997-02-24 | 49.543 |
| 1997-02-25 | 48.307 |
| 1997-02-26 | 48.284 |
| 1997-02-27 | 49.258 |
| 1997-02-28 | 49.007 |
| 1997-03-01 | 47.668 |
| 1997-03-02 | 47.926 |
| 1997-03-03 | 49.905 |
| 1997-03-04 | 51.363 |
| 1997-03-05 | 52.074 |
| 1997-03-06 | 52.773 |
| 1997-03-07 | 54.023 |
| 1997-03-08 | 54.349 |
| 1997-03-09 | 53.69 |
| 1997-03-10 | 54.809 |
| 1997-03-11 | 56.059 |
| 1997-03-12 | 56.294 |
| 1997-03-13 | 55.867 |
| 1997-03-14 | 55.77 |
| 1997-03-15 | 56.213 |
| 1997-03-16 | 55.935 |
| 1997-03-17 | 55.85 |
| 1997-03-18 | 56.153 |
| 1997-03-19 | 56.086 |
| 1997-03-20 | 55.837 |
| 1997-03-21 | 54.729 |
| 1997-03-22 | 54.887 |
| 1997-03-23 | 55.384 |
| 1997-03-24 | 56.828 |
| 1997-03-25 | 57.143 |
| 1997-03-26 | 57.403 |
| 1997-03-27 | 58.077 |
| 1997-03-28 | 58.179 |
| 1997-03-29 | 58.347 |
| 1997-03-30 | 58.203 |
| 1997-03-31 | 59.069 |
| 1997-04-01 | 59.542 |
| 1997-04-02 | 57.952 |
| 1997-04-03 | 57.091 |
| 1997-04-04 | 56.766 |
| 1997-04-05 | 55.697 |
| 1997-04-06 | 54.873 |
| 1997-04-07 | 55.177 |
| 1997-04-08 | 56.07 |
| 1997-04-09 | 56.963 |
| 1997-04-10 | 56.239 |
| 1997-04-11 | 55.722 |
| 1997-04-12 | 55.81 |
| 1997-04-13 | 54.519 |
| 1997-04-14 | 54.669 |
| 1997-04-15 | 56.234 |
| 1997-04-16 | 56.34 |
| 1997-04-17 | 57.306 |
| 1997-04-18 | 56.739 |
| 1997-04-19 | 56.362 |
| 1997-04-20 | 55.271 |
| 1997-04-21 | 55.506 |
| 1997-04-22 | 54.967 |
| 1997-04-23 | 57.663 |
| 1997-04-24 | 59.027 |
| 1997-04-25 | 60.16 |
| 1997-04-26 | 59.986 |
| 1997-04-27 | 59.912 |
| 1997-04-28 | 59.091 |
| 1997-04-29 | 61.012 |
| 1997-04-30 | 61.791 |
| 1997-05-01 | 61.966 |
| 1997-05-02 | 62.6 |
| 1997-05-03 | 62.514 |
| 1997-05-04 | 61.872 |
| 1997-05-05 | 63.009 |
| 1997-05-06 | 62.773 |
| 1997-05-07 | 61.126 |
| 1997-05-08 | 60.231 |
| 1997-05-09 | 58.932 |
| 1997-05-10 | 59.198 |
| 1997-05-11 | 59.051 |
| 1997-05-12 | 59.612 |
| 1997-05-13 | 60.886 |
| 1997-05-14 | 61.867 |
| 1997-05-15 | 62.008 |
| 1997-05-16 | 62.199 |
| 1997-05-17 | 60.644 |
| 1997-05-18 | 60.961 |
| 1997-05-19 | 61.701 |
| 1997-05-20 | 62.617 |
| 1997-05-21 | 61.622 |
| 1997-05-22 | 61.597 |
| 1997-05-23 | 58.282 |
| 1997-05-24 | 56.113 |
| 1997-05-25 | 54.46 |
| 1997-05-26 | 54.957 |
| 1997-05-27 | 56.225 |
| 1997-05-28 | 56.525 |
| 1997-05-29 | 55.312 |
| 1997-05-30 | 55.264 |
| 1997-05-31 | 54.434 |
| 1997-06-01 | 53.091 |
| 1997-06-02 | 53.121 |
| 1997-06-03 | 52.814 |
| 1997-06-04 | 52.096 |
| 1997-06-05 | 51.824 |
| 1997-06-06 | 52.45 |
| 1997-06-07 | 51.475 |
| 1997-06-08 | 50.53 |
| 1997-06-09 | 49.88 |
| 1997-06-10 | 49.049 |
| 1997-06-11 | 48.89 |
| 1997-06-12 | 48.172 |
| 1997-06-13 | 46.828 |
| 1997-06-14 | 45.021 |
| 1997-06-15 | 44.617 |
| 1997-06-16 | 45.719 |
| 1997-06-17 | 46.07 |
| 1997-06-18 | 45.56 |
| 1997-06-19 | 45.098 |
| 1997-06-20 | 45.159 |
| 1997-06-21 | 44.29 |
| 1997-06-22 | 43.624 |
| 1997-06-23 | 44.892 |
| 1997-06-24 | 45.176 |
| 1997-06-25 | 44.326 |
| 1997-06-26 | 42.757 |
| 1997-06-27 | 41.868 |
| 1997-06-28 | 41.077 |
| 1997-06-29 | 39.351 |
| 1997-06-30 | 39.108 |
| 1997-07-01 | 39.926 |
| 1997-07-02 | 39.783 |
| 1997-07-03 | 40.207 |
| 1997-07-04 | 39.495 |
| 1997-07-05 | 39.978 |
| 1997-07-06 | 40.402 |
| 1997-07-07 | 42.093 |
| 1997-07-08 | 42.666 |
| 1997-07-09 | 42.833 |
| 1997-07-10 | 43.534 |
| 1997-07-11 | 43.783 |
| 1997-07-12 | 43.914 |
| 1997-07-13 | 42.816 |
| 1997-07-14 | 43.469 |
| 1997-07-15 | 43.602 |
| 1997-07-16 | 43.609 |
| 1997-07-17 | 43.986 |
| 1997-07-18 | 44.588 |
| 1997-07-19 | 45.155 |
| 1997-07-20 | 44.489 |
| 1997-07-21 | 45.128 |
| 1997-07-22 | 46.1 |
| 1997-07-23 | 45.182 |
| 1997-07-24 | 44.881 |
| 1997-07-25 | 44.707 |
| 1997-07-26 | 44.957 |
| 1997-07-27 | 45.081 |
| 1997-07-28 | 45.328 |
| 1997-07-29 | 46.362 |
| 1997-07-30 | 46.947 |
| 1997-07-31 | 47.886 |
| 1997-08-01 | 48.713 |
| 1997-08-02 | 49.709 |
| 1997-08-03 | 50.048 |
| 1997-08-04 | 50.287 |
| 1997-08-05 | 51.011 |
| 1997-08-06 | 50.67 |
| 1997-08-07 | 50.551 |
| 1997-08-08 | 51.203 |
| 1997-08-09 | 51.701 |
| 1997-08-10 | 50.61 |
| 1997-08-11 | 51.036 |
| 1997-08-12 | 52.105 |
| 1997-08-13 | 52.198 |
| 1997-08-14 | 52.234 |
| 1997-08-15 | 51.357 |
| 1997-08-16 | 50.333 |
| 1997-08-17 | 49.222 |
| 1997-08-18 | 48.366 |
| 1997-08-19 | 49.236 |
| 1997-08-20 | 49.652 |
| 1997-08-21 | 48.845 |
| 1997-08-22 | 48.944 |
| 1997-08-23 | 49.499 |
| 1997-08-24 | 50.372 |
| 1997-08-25 | 49.659 |
| 1997-08-26 | 49.275 |
| 1997-08-27 | 48.835 |
| 1997-08-28 | 48.795 |
| 1997-08-29 | 49.332 |
| 1997-08-30 | 48.57 |
| 1997-08-31 | 48.02 |
| 1997-09-01 | 46.755 |
| 1997-09-02 | 46.468 |
| 1997-09-03 | 46.358 |
| 1997-09-04 | 45.209 |
| 1997-09-05 | 45.237 |
| 1997-09-06 | 45.582 |
| 1997-09-07 | 44.008 |
| 1997-09-08 | 43.113 |
| 1997-09-09 | 43.522 |
| 1997-09-10 | 43.121 |
| 1997-09-11 | 43.575 |
| 1997-09-12 | 43.917 |
| 1997-09-13 | 43.725 |
| 1997-09-14 | 43.562 |
| 1997-09-15 | 44.139 |
| 1997-09-16 | 44.637 |
| 1997-09-17 | 45.346 |
| 1997-09-18 | 44.823 |
| 1997-09-19 | 43.904 |
| 1997-09-20 | 43.382 |
| 1997-09-21 | 43.162 |
| 1997-09-22 | 42.582 |
| 1997-09-23 | 42.441 |
| 1997-09-24 | 42.765 |
| 1997-09-25 | 43.597 |
| 1997-09-26 | 43.299 |
| 1997-09-27 | 43.359 |
| 1997-09-28 | 42.046 |
| 1997-09-29 | 41.486 |
| 1997-09-30 | 42.324 |
| 1997-10-01 | 42.172 |
| 1997-10-02 | 42.442 |
| 1997-10-03 | 42.422 |
| 1997-10-04 | 42.154 |
| 1997-10-05 | 41.275 |
| 1997-10-06 | 41.042 |
| 1997-10-07 | 42.049 |
| 1997-10-08 | 41.803 |
| 1997-10-09 | 42.179 |
| 1997-10-10 | 42.185 |
| 1997-10-11 | 41.089 |
| 1997-10-12 | 40.333 |
| 1997-10-13 | 41.044 |
| 1997-10-14 | 41.17 |
| 1997-10-15 | 41.325 |
| 1997-10-16 | 41.918 |
| 1997-10-17 | 42.179 |
| 1997-10-18 | 42.91 |
| 1997-10-19 | 41.92 |
| 1997-10-20 | 42.683 |
| 1997-10-21 | 43.401 |
| 1997-10-22 | 44.347 |
| 1997-10-23 | 43.77 |
| 1997-10-24 | 45.16 |
| 1997-10-25 | 45.435 |
| 1997-10-26 | 45.859 |
| 1997-10-27 | 46.592 |
| 1997-10-28 | 48.227 |
| 1997-10-29 | 48.926 |
| 1997-10-30 | 48.572 |
| 1997-10-31 | 50.148 |
| 1997-11-01 | 50.799 |
| 1997-11-02 | 50.196 |
| 1997-11-03 | 50.827 |
| 1997-11-04 | 52.076 |
| 1997-11-05 | 52.597 |
| 1997-11-06 | 53.289 |
| 1997-11-07 | 53.505 |
| 1997-11-08 | 55.153 |
| 1997-11-09 | 54.775 |
| 1997-11-10 | 55.858 |
| 1997-11-11 | 56.961 |
| 1997-11-12 | 57.356 |
| 1997-11-13 | 58.529 |
| 1997-11-14 | 58.887 |
| 1997-11-15 | 58.687 |
| 1997-11-16 | 58.683 |
| 1997-11-17 | 58.984 |
| 1997-11-18 | 61.532 |
| 1997-11-19 | 61.928 |
| 1997-11-20 | 62.587 |
| 1997-11-21 | 63.605 |
| 1997-11-22 | 64.257 |
| 1997-11-23 | 63.575 |
| 1997-11-24 | 63.852 |
| 1997-11-25 | 64.531 |
| 1997-11-26 | 63.123 |
| 1997-11-27 | 61.584 |
| 1997-11-28 | 60.823 |
| 1997-11-29 | 60.755 |
| 1997-11-30 | 60.066 |
| 1997-12-01 | 60.519 |
| 1997-12-02 | 61.21 |
| 1997-12-03 | 61.226 |
| 1997-12-04 | 59.947 |
| 1997-12-05 | 59.425 |
| 1997-12-06 | 58.198 |
| 1997-12-07 | 57.959 |
| 1997-12-08 | 56.018 |
| 1997-12-09 | 56.167 |
| 1997-12-10 | 55.211 |
| 1997-12-11 | 54.227 |
| 1997-12-12 | 52.96 |
| 1997-12-13 | 51.886 |
| 1997-12-14 | 51.629 |
| 1997-12-15 | 51.118 |
| 1997-12-16 | 51.213 |
| 1997-12-17 | 50.456 |
| 1997-12-18 | 48.885 |
| 1997-12-19 | 48.283 |
| 1997-12-20 | 47.077 |
| 1997-12-21 | 44.971 |
| 1997-12-22 | 44.402 |
| 1997-12-23 | 44.579 |
| 1997-12-24 | 43.761 |
| 1997-12-25 | 44.07 |
| 1997-12-26 | 44.768 |
| 1997-12-27 | 45.431 |
| 1997-12-28 | 45.649 |
| 1997-12-29 | 44.689 |
| 1997-12-30 | 43.709 |
| 1997-12-31 | 43.267 |
| 1998-01-01 | 42.456 |
| 1998-01-02 | 42.727 |
| 1998-01-03 | 43.079 |
| 1998-01-04 | 43.013 |
| 1998-01-05 | 44.037 |
| 1998-01-06 | 44.533 |
| 1998-01-07 | 44.629 |
| 1998-01-08 | 45.591 |
| 1998-01-09 | 45.887 |
| 1998-01-10 | 46.555 |
| 1998-01-11 | 46.499 |
| 1998-01-12 | 47.021 |
| 1998-01-13 | 48.237 |
| 1998-01-14 | 49.458 |
| 1998-01-15 | 49.316 |
| 1998-01-16 | 50.141 |
| 1998-01-17 | 50.912 |
| 1998-01-18 | 50.727 |
| 1998-01-19 | 51.272 |
| 1998-01-20 | 52.867 |
| 1998-01-21 | 53.323 |
| 1998-01-22 | 52.43 |
| 1998-01-23 | 52.152 |
| 1998-01-24 | 51.457 |
| 1998-01-25 | 50.552 |
| 1998-01-26 | 51.085 |
| 1998-01-27 | 51.976 |
| 1998-01-28 | 52.907 |
| 1998-01-29 | 54.23 |
| 1998-01-30 | 53.651 |
| 1998-01-31 | 53.88 |
| 1998-02-01 | 53.241 |
| 1998-02-02 | 54.002 |
| 1998-02-03 | 54.932 |
| 1998-02-04 | 55.827 |
| 1998-02-05 | 56.829 |
| 1998-02-06 | 57.188 |
| 1998-02-07 | 56.799 |
| 1998-02-08 | 57.119 |
| 1998-02-09 | 57.867 |
| 1998-02-10 | 59.815 |
| 1998-02-11 | 61.206 |
| 1998-02-12 | 60.139 |
| 1998-02-13 | 59.835 |
| 1998-02-14 | 60.649 |
| 1998-02-15 | 60.151 |
| 1998-02-16 | 60.928 |
| 1998-02-17 | 62.979 |
| 1998-02-18 | 64.413 |
| 1998-02-19 | 64.923 |
| 1998-02-20 | 65.744 |
| 1998-02-21 | 66.855 |
| 1998-02-22 | 68.359 |
| 1998-02-23 | 70.293 |
| 1998-02-24 | 73.989 |
| 1998-02-25 | 74.89 |
| 1998-02-26 | 74.269 |
| 1998-02-27 | 75.484 |
| 1998-02-28 | 74.82 |
| 1998-03-01 | 75.498 |
| 1998-03-02 | 76.568 |
| 1998-03-03 | 77.751 |
| 1998-03-04 | 77.132 |
| 1998-03-05 | 76.84 |
| 1998-03-06 | 75.914 |
| 1998-03-07 | 75.777 |
| 1998-03-08 | 76.385 |
| 1998-03-09 | 76.994 |
| 1998-03-10 | 77.668 |
| 1998-03-11 | 76.202 |
| 1998-03-12 | 75.886 |
| 1998-03-13 | 75.367 |
| 1998-03-14 | 74.596 |
| 1998-03-15 | 73.016 |
| 1998-03-16 | 72.096 |
| 1998-03-17 | 72.072 |
| 1998-03-18 | 70.968 |
| 1998-03-19 | 69.354 |
| 1998-03-20 | 67.644 |
| 1998-03-21 | 65.88 |
| 1998-03-22 | 64.522 |
| 1998-03-23 | 64.395 |
| 1998-03-24 | 64.169 |
| 1998-03-25 | 62.637 |
| 1998-03-26 | 60.077 |
| 1998-03-27 | 58.73 |
| 1998-03-28 | 58.861 |
| 1998-03-29 | 56.842 |
| 1998-03-30 | 57.579 |
| 1998-03-31 | 57.39 |
| 1998-04-01 | 56.71 |
| 1998-04-02 | 56.425 |
| 1998-04-03 | 56.253 |
| 1998-04-04 | 55.998 |
| 1998-04-05 | 54.747 |
| 1998-04-06 | 53.788 |
| 1998-04-07 | 53.794 |
| 1998-04-08 | 52.192 |
| 1998-04-09 | 51.189 |
| 1998-04-10 | 51.706 |
| 1998-04-11 | 49.718 |
| 1998-04-12 | 47.577 |
| 1998-04-13 | 48.312 |
| 1998-04-14 | 49.917 |
| 1998-04-15 | 50.038 |
| 1998-04-16 | 49.434 |
| 1998-04-17 | 50.054 |
| 1998-04-18 | 49.695 |
| 1998-04-19 | 49.354 |
| 1998-04-20 | 49.045 |
| 1998-04-21 | 49.837 |
| 1998-04-22 | 49.024 |
| 1998-04-23 | 49.037 |
| 1998-04-24 | 49.401 |
| 1998-04-25 | 49.257 |
| 1998-04-26 | 48.833 |
| 1998-04-27 | 49.424 |
| 1998-04-28 | 50.788 |
| 1998-04-29 | 50.201 |
| 1998-04-30 | 50.222 |
| 1998-05-01 | 51.06 |
| 1998-05-02 | 50.251 |
| 1998-05-03 | 50.066 |
| 1998-05-04 | 51.103 |
| 1998-05-05 | 52.475 |
| 1998-05-06 | 52.823 |
| 1998-05-07 | 52.742 |
| 1998-05-08 | 54.044 |
| 1998-05-09 | 54.891 |
| 1998-05-10 | 54.582 |
| 1998-05-11 | 57.073 |
| 1998-05-12 | 61.541 |
| 1998-05-13 | 66.425 |
| 1998-05-14 | 69.666 |
| 1998-05-15 | 72.873 |
| 1998-05-16 | 76.174 |
| 1998-05-17 | 76.964 |
| 1998-05-18 | 79.309 |
| 1998-05-19 | 81.967 |
| 1998-05-20 | 84.168 |
| 1998-05-21 | 84.83 |
| 1998-05-22 | 85.836 |
| 1998-05-23 | 86.548 |
| 1998-05-24 | 85.602 |
| 1998-05-25 | 86.342 |
| 1998-05-26 | 88.135 |
| 1998-05-27 | 89.039 |
| 1998-05-28 | 89.219 |
| 1998-05-29 | 92.774 |
| 1998-05-30 | 94.246 |
| 1998-05-31 | 94.756 |
| 1998-06-01 | 97.079 |
| 1998-06-02 | 98.103 |
| 1998-06-03 | 97.832 |
| 1998-06-04 | 98.493 |
| 1998-06-05 | 99.312 |
| 1998-06-06 | 99.215 |
| 1998-06-07 | 99.399 |
| 1998-06-08 | 101.484 |
| 1998-06-09 | 102.334 |
| 1998-06-10 | 102.71 |
| 1998-06-11 | 100.864 |
| 1998-06-12 | 97.784 |
| 1998-06-13 | 95.345 |
| 1998-06-14 | 92.417 |
| 1998-06-15 | 90.941 |
| 1998-06-16 | 91.321 |
| 1998-06-17 | 89.431 |
| 1998-06-18 | 87.947 |
| 1998-06-19 | 88.012 |
| 1998-06-20 | 86.771 |
| 1998-06-21 | 86.038 |
| 1998-06-22 | 84.737 |
| 1998-06-23 | 85.509 |
| 1998-06-24 | 85.691 |
| 1998-06-25 | 85.106 |
| 1998-06-26 | 83.937 |
| 1998-06-27 | 82.611 |
| 1998-06-28 | 78.713 |
| 1998-06-29 | 77.114 |
| 1998-06-30 | 75.439 |
| 1998-07-01 | 73.971 |
| 1998-07-02 | 73.348 |
| 1998-07-03 | 73.017 |
| 1998-07-04 | 72.37 |
| 1998-07-05 | 70.904 |
| 1998-07-06 | 70.667 |
| 1998-07-07 | 70.261 |
| 1998-07-08 | 68.396 |
| 1998-07-09 | 67.774 |
| 1998-07-10 | 66.345 |
| 1998-07-11 | 64.709 |
| 1998-07-12 | 62.21 |
| 1998-07-13 | 60.88 |
| 1998-07-14 | 59.841 |
| 1998-07-15 | 59.18 |
| 1998-07-16 | 57.846 |
| 1998-07-17 | 57.1 |
| 1998-07-18 | 55.996 |
| 1998-07-19 | 54.14 |
| 1998-07-20 | 54.296 |
| 1998-07-21 | 54.271 |
| 1998-07-22 | 54.553 |
| 1998-07-23 | 53.851 |
| 1998-07-24 | 52.561 |
| 1998-07-25 | 51.727 |
| 1998-07-26 | 51.891 |
| 1998-07-27 | 52.825 |
| 1998-07-28 | 54.039 |
| 1998-07-29 | 53.603 |
| 1998-07-30 | 54.399 |
| 1998-07-31 | 53.828 |
| 1998-08-01 | 53.767 |
| 1998-08-02 | 53.319 |
| 1998-08-03 | 53.857 |
| 1998-08-04 | 56.411 |
| 1998-08-05 | 58.279 |
| 1998-08-06 | 59.458 |
| 1998-08-07 | 59.784 |
| 1998-08-08 | 60.87 |
| 1998-08-09 | 61.783 |
| 1998-08-10 | 63.528 |
| 1998-08-11 | 65.81 |
| 1998-08-12 | 66.891 |
| 1998-08-13 | 67.875 |
| 1998-08-14 | 67.277 |
| 1998-08-15 | 68.143 |
| 1998-08-16 | 69.113 |
| 1998-08-17 | 72.546 |
| 1998-08-18 | 74.274 |
| 1998-08-19 | 75.201 |
| 1998-08-20 | 75.426 |
| 1998-08-21 | 80.235 |
| 1998-08-22 | 85.757 |
| 1998-08-23 | 87.94 |
| 1998-08-24 | 91.117 |
| 1998-08-25 | 93.542 |
| 1998-08-26 | 96.146 |
| 1998-08-27 | 95.815 |
| 1998-08-28 | 97.344 |
| 1998-08-29 | 97.081 |
| 1998-08-30 | 97.511 |
| 1998-08-31 | 97.571 |
| 1998-09-01 | 98.469 |
| 1998-09-02 | 99.255 |
| 1998-09-03 | 97.788 |
| 1998-09-04 | 96.064 |
| 1998-09-05 | 94.847 |
| 1998-09-06 | 94.383 |
| 1998-09-07 | 93.072 |
| 1998-09-08 | 92.181 |
| 1998-09-09 | 90.708 |
| 1998-09-10 | 89.463 |
| 1998-09-11 | 88.846 |
| 1998-09-12 | 89.234 |
| 1998-09-13 | 88.175 |
| 1998-09-14 | 87.618 |
| 1998-09-15 | 87.89 |
| 1998-09-16 | 84.816 |
| 1998-09-17 | 83.768 |
| 1998-09-18 | 82.926 |
| 1998-09-19 | 82.707 |
| 1998-09-20 | 77.169 |
| 1998-09-21 | 71.906 |
| 1998-09-22 | 70.082 |
| 1998-09-23 | 67.488 |
| 1998-09-24 | 65.656 |
| 1998-09-25 | 63.674 |
| 1998-09-26 | 63.153 |
| 1998-09-27 | 61.616 |
| 1998-09-28 | 61.363 |
| 1998-09-29 | 62.125 |
| 1998-09-30 | 61.613 |
| 1998-10-01 | 60.91 |
| 1998-10-02 | 59.531 |
| 1998-10-03 | 58.164 |
| 1998-10-04 | 57.483 |
| 1998-10-05 | 57.593 |
| 1998-10-06 | 57.85 |
| 1998-10-07 | 58.617 |
| 1998-10-08 | 58.351 |
| 1998-10-09 | 59.045 |
| 1998-10-10 | 58.659 |
| 1998-10-11 | 58.069 |
| 1998-10-12 | 56.625 |
| 1998-10-13 | 57.814 |
| 1998-10-14 | 57.407 |
| 1998-10-15 | 57.302 |
| 1998-10-16 | 56.571 |
| 1998-10-17 | 56.473 |
| 1998-10-18 | 55.685 |
| 1998-10-19 | 56.261 |
| 1998-10-20 | 57.999 |
| 1998-10-21 | 58.023 |
| 1998-10-22 | 57.927 |
| 1998-10-23 | 58.451 |
| 1998-10-24 | 57.284 |
| 1998-10-25 | 55.068 |
| 1998-10-26 | 55.913 |
| 1998-10-27 | 56.751 |
| 1998-10-28 | 56.49 |
| 1998-10-29 | 54.999 |
| 1998-10-30 | 55.231 |
| 1998-10-31 | 54.176 |
| 1998-11-01 | 53.681 |
| 1998-11-02 | 55.232 |
| 1998-11-03 | 56.414 |
| 1998-11-04 | 56.596 |
| 1998-11-05 | 56.138 |
| 1998-11-06 | 55.434 |
| 1998-11-07 | 56.44 |
| 1998-11-08 | 55.552 |
| 1998-11-09 | 55.532 |
| 1998-11-10 | 55.569 |
| 1998-11-11 | 56.848 |
| 1998-11-12 | 57.386 |
| 1998-11-13 | 58.758 |
| 1998-11-14 | 60.141 |
| 1998-11-15 | 61.014 |
| 1998-11-16 | 63.575 |
| 1998-11-17 | 65.779 |
| 1998-11-18 | 66.037 |
| 1998-11-19 | 65.13 |
| 1998-11-20 | 64.907 |
| 1998-11-21 | 64.856 |
| 1998-11-22 | 64.299 |
| 1998-11-23 | 65.054 |
| 1998-11-24 | 66.683 |
| 1998-11-25 | 66.223 |
| 1998-11-26 | 65.437 |
| 1998-11-27 | 66.235 |
| 1998-11-28 | 66.081 |
| 1998-11-29 | 66.4 |
| 1998-11-30 | 67.062 |
| 1998-12-01 | 67.141 |
| 1998-12-02 | 66.942 |
| 1998-12-03 | 65.802 |
| 1998-12-04 | 64.99 |
| 1998-12-05 | 64.375 |
| 1998-12-06 | 64.515 |
| 1998-12-07 | 62.444 |
| 1998-12-08 | 63.097 |
| 1998-12-09 | 63.207 |
| 1998-12-10 | 63.898 |
| 1998-12-11 | 62.38 |
| 1998-12-12 | 60.633 |
| 1998-12-13 | 58.812 |
| 1998-12-14 | 56.688 |
| 1998-12-15 | 56.662 |
| 1998-12-16 | 54.983 |
| 1998-12-17 | 56.96 |
| 1998-12-18 | 61.179 |
| 1998-12-19 | 63.11 |
| 1998-12-20 | 64.585 |
| 1998-12-21 | 67.418 |
| 1998-12-22 | 69.144 |
| 1998-12-23 | 70.595 |
| 1998-12-24 | 70.119 |
| 1998-12-25 | 70.418 |
| 1998-12-26 | 72.186 |
| 1998-12-27 | 72.497 |
| 1998-12-28 | 73.281 |
| 1998-12-29 | 74.386 |
| 1998-12-30 | 75.763 |
| 1998-12-31 | 77.297 |
| 1999-01-01 | 77.091 |
| 1999-01-02 | 77.122 |
| 1999-01-03 | 77.246 |
| 1999-01-04 | 77.686 |
| 1999-01-05 | 78.002 |
| 1999-01-06 | 79.133 |
| 1999-01-07 | 79.147 |
| 1999-01-08 | 79.679 |
| 1999-01-09 | 79.217 |
| 1999-01-10 | 80.914 |
| 1999-01-11 | 82.479 |
| 1999-01-12 | 83.704 |
| 1999-01-13 | 84.714 |
| 1999-01-14 | 85.986 |
| 1999-01-15 | 85.62 |
| 1999-01-16 | 83.02 |
| 1999-01-17 | 78.21 |
| 1999-01-18 | 76.43 |
| 1999-01-19 | 75.584 |
| 1999-01-20 | 72.566 |
| 1999-01-21 | 69.588 |
| 1999-01-22 | 68.149 |
| 1999-01-23 | 68.719 |
| 1999-01-24 | 67.925 |
| 1999-01-25 | 68.131 |
| 1999-01-26 | 67.968 |
| 1999-01-27 | 67.592 |
| 1999-01-28 | 66.435 |
| 1999-01-29 | 65.739 |
| 1999-01-30 | 64.863 |
| 1999-01-31 | 64.293 |
| 1999-02-01 | 65.12 |
| 1999-02-02 | 65.616 |
| 1999-02-03 | 65.724 |
| 1999-02-04 | 64.784 |
| 1999-02-05 | 64.256 |
| 1999-02-06 | 63.499 |
| 1999-02-07 | 62.767 |
| 1999-02-08 | 62.104 |
| 1999-02-09 | 61.442 |
| 1999-02-10 | 61.475 |
| 1999-02-11 | 61.146 |
| 1999-02-12 | 60.739 |
| 1999-02-13 | 59.596 |
| 1999-02-14 | 58.369 |
| 1999-02-15 | 57.947 |
| 1999-02-16 | 58.677 |
| 1999-02-17 | 58.665 |
| 1999-02-18 | 58.086 |
| 1999-02-19 | 58.076 |
| 1999-02-20 | 58.841 |
| 1999-02-21 | 58.053 |
| 1999-02-22 | 59.384 |
| 1999-02-23 | 60.922 |
| 1999-02-24 | 59.487 |
| 1999-02-25 | 58.956 |
| 1999-02-26 | 59.883 |
| 1999-02-27 | 59.543 |
| 1999-02-28 | 58.541 |
| 1999-03-01 | 59.448 |
| 1999-03-02 | 60.837 |
| 1999-03-03 | 60.979 |
| 1999-03-04 | 61.117 |
| 1999-03-05 | 60.684 |
| 1999-03-06 | 61.187 |
| 1999-03-07 | 61.369 |
| 1999-03-08 | 62.267 |
| 1999-03-09 | 62.631 |
| 1999-03-10 | 63.42 |
| 1999-03-11 | 64.996 |
| 1999-03-12 | 64.874 |
| 1999-03-13 | 64.469 |
| 1999-03-14 | 63.779 |
| 1999-03-15 | 64.31 |
| 1999-03-16 | 66.589 |
| 1999-03-17 | 67.265 |
| 1999-03-18 | 66.872 |
| 1999-03-19 | 67.482 |
| 1999-03-20 | 68.179 |
| 1999-03-21 | 68.595 |
| 1999-03-22 | 69.429 |
| 1999-03-23 | 71.247 |
| 1999-03-24 | 71.939 |
| 1999-03-25 | 73.075 |
| 1999-03-26 | 74.798 |
| 1999-03-27 | 76.72 |
| 1999-03-28 | 77.205 |
| 1999-03-29 | 80.017 |
| 1999-03-30 | 82.151 |
| 1999-03-31 | 82.548 |
| 1999-04-01 | 83.714 |
| 1999-04-02 | 84.314 |
| 1999-04-03 | 86.63 |
| 1999-04-04 | 87.316 |
| 1999-04-05 | 90.126 |
| 1999-04-06 | 92.913 |
| 1999-04-07 | 94.48 |
| 1999-04-08 | 96.361 |
| 1999-04-09 | 97.963 |
| 1999-04-10 | 98.501 |
| 1999-04-11 | 98.514 |
| 1999-04-12 | 99.789 |
| 1999-04-13 | 103.113 |
| 1999-04-14 | 104.793 |
| 1999-04-15 | 106.051 |
| 1999-04-16 | 106.779 |
| 1999-04-17 | 107.105 |
| 1999-04-18 | 105.92 |
| 1999-04-19 | 107.517 |
| 1999-04-20 | 110.202 |
| 1999-04-21 | 110.615 |
| 1999-04-22 | 109.558 |
| 1999-04-23 | 107.818 |
| 1999-04-24 | 106.064 |
| 1999-04-25 | 104.693 |
| 1999-04-26 | 104.731 |
| 1999-04-27 | 105.057 |
| 1999-04-28 | 104.377 |
| 1999-04-29 | 105.096 |
| 1999-04-30 | 105.422 |
| 1999-05-01 | 103.495 |
| 1999-05-02 | 102.902 |
| 1999-05-03 | 100.518 |
| 1999-05-04 | 101.152 |
| 1999-05-05 | 99.679 |
| 1999-05-06 | 98.08 |
| 1999-05-07 | 97.989 |
| 1999-05-08 | 96.468 |
| 1999-05-09 | 95.455 |
| 1999-05-10 | 93.446 |
| 1999-05-11 | 93.869 |
| 1999-05-12 | 94.061 |
| 1999-05-13 | 93.174 |
| 1999-05-14 | 91.814 |
| 1999-05-15 | 89.58 |
| 1999-05-16 | 88.529 |
| 1999-05-17 | 88.351 |
| 1999-05-18 | 89.732 |
| 1999-05-19 | 87.568 |
| 1999-05-20 | 85.228 |
| 1999-05-21 | 85.534 |
| 1999-05-22 | 86.744 |
| 1999-05-23 | 85.507 |
| 1999-05-24 | 84.385 |
| 1999-05-25 | 85.78 |
| 1999-05-26 | 86.654 |
| 1999-05-27 | 86.859 |
| 1999-05-28 | 86.583 |
| 1999-05-29 | 84.664 |
| 1999-05-30 | 82.664 |
| 1999-05-31 | 84.185 |
| 1999-06-01 | 84.884 |
| 1999-06-02 | 86.013 |
| 1999-06-03 | 85.714 |
| 1999-06-04 | 85.728 |
| 1999-06-05 | 86.428 |
| 1999-06-06 | 85.514 |
| 1999-06-07 | 86.081 |
| 1999-06-08 | 87.156 |
| 1999-06-09 | 88.389 |
| 1999-06-10 | 88.469 |
| 1999-06-11 | 89.443 |
| 1999-06-12 | 88.21 |
| 1999-06-13 | 87.649 |
| 1999-06-14 | 88.31 |
| 1999-06-15 | 88.7 |
| 1999-06-16 | 89.026 |
| 1999-06-17 | 88.798 |
| 1999-06-18 | 89.865 |
| 1999-06-19 | 88.908 |
| 1999-06-20 | 87.323 |
| 1999-06-21 | 86.349 |
| 1999-06-22 | 86.891 |
| 1999-06-23 | 87.925 |
| 1999-06-24 | 86.948 |
| 1999-06-25 | 85.04 |
| 1999-06-26 | 84.17 |
| 1999-06-27 | 82.155 |
| 1999-06-28 | 82.052 |
| 1999-06-29 | 83.552 |
| 1999-06-30 | 80.963 |
| 1999-07-01 | 80.196 |
| 1999-07-02 | 79.654 |
| 1999-07-03 | 78.569 |
| 1999-07-04 | 76.923 |
| 1999-07-05 | 75.094 |
| 1999-07-06 | 73.618 |
| 1999-07-07 | 72.658 |
| 1999-07-08 | 70.747 |
| 1999-07-09 | 70.22 |
| 1999-07-10 | 69.431 |
| 1999-07-11 | 67.473 |
| 1999-07-12 | 67.986 |
| 1999-07-13 | 68.355 |
| 1999-07-14 | 67.664 |
| 1999-07-15 | 68.123 |
| 1999-07-16 | 67.703 |
| 1999-07-17 | 66.331 |
| 1999-07-18 | 64.749 |
| 1999-07-19 | 65.152 |
| 1999-07-20 | 66.107 |
| 1999-07-21 | 65.903 |
| 1999-07-22 | 65.899 |
| 1999-07-23 | 64.994 |
| 1999-07-24 | 64.019 |
| 1999-07-25 | 62.279 |
| 1999-07-26 | 62.061 |
| 1999-07-27 | 63.523 |
| 1999-07-28 | 62.962 |
| 1999-07-29 | 61.749 |
| 1999-07-30 | 62.001 |
| 1999-07-31 | 61.175 |
| 1999-08-01 | 59.789 |
| 1999-08-02 | 60.237 |
| 1999-08-03 | 61.947 |
| 1999-08-04 | 62.622 |
| 1999-08-05 | 62.432 |
| 1999-08-06 | 62.579 |
| 1999-08-07 | 62.606 |
| 1999-08-08 | 61.95 |
| 1999-08-09 | 63.071 |
| 1999-08-10 | 63.69 |
| 1999-08-11 | 63.181 |
| 1999-08-12 | 62.879 |
| 1999-08-13 | 63.116 |
| 1999-08-14 | 63.295 |
| 1999-08-15 | 61.59 |
| 1999-08-16 | 62.903 |
| 1999-08-17 | 63.827 |
| 1999-08-18 | 64.212 |
| 1999-08-19 | 63.255 |
| 1999-08-20 | 63.107 |
| 1999-08-21 | 62.894 |
| 1999-08-22 | 62.647 |
| 1999-08-23 | 62.816 |
| 1999-08-24 | 64.459 |
| 1999-08-25 | 64.122 |
| 1999-08-26 | 62.867 |
| 1999-08-27 | 63.229 |
| 1999-08-28 | 62.794 |
| 1999-08-29 | 62.571 |
| 1999-08-30 | 63.783 |
| 1999-08-31 | 64.426 |
| 1999-09-01 | 64.39 |
| 1999-09-02 | 63.647 |
| 1999-09-03 | 63.657 |
| 1999-09-04 | 63.728 |
| 1999-09-05 | 62.993 |
| 1999-09-06 | 64.768 |
| 1999-09-07 | 65.76 |
| 1999-09-08 | 65.067 |
| 1999-09-09 | 63.935 |
| 1999-09-10 | 63.519 |
| 1999-09-11 | 63.892 |
| 1999-09-12 | 62.848 |
| 1999-09-13 | 62.867 |
| 1999-09-14 | 65.252 |
| 1999-09-15 | 64.565 |
| 1999-09-16 | 63.617 |
| 1999-09-17 | 63.715 |
| 1999-09-18 | 65.309 |
| 1999-09-19 | 65.258 |
| 1999-09-20 | 67.218 |
| 1999-09-21 | 68.173 |
| 1999-09-22 | 68.893 |
| 1999-09-23 | 68.527 |
| 1999-09-24 | 68.394 |
| 1999-09-25 | 69.511 |
| 1999-09-26 | 70.053 |
| 1999-09-27 | 70.7 |
| 1999-09-28 | 72.141 |
| 1999-09-29 | 71.725 |
| 1999-09-30 | 71.122 |
| 1999-10-01 | 72.292 |
| 1999-10-02 | 73.158 |
| 1999-10-03 | 72.21 |
| 1999-10-04 | 72.526 |
| 1999-10-05 | 73.237 |
| 1999-10-06 | 72.253 |
| 1999-10-07 | 72.27 |
| 1999-10-08 | 72.216 |
| 1999-10-09 | 72.871 |
| 1999-10-10 | 72.117 |
| 1999-10-11 | 73.064 |
| 1999-10-12 | 73.456 |
| 1999-10-13 | 72.417 |
| 1999-10-14 | 72.676 |
| 1999-10-15 | 73.613 |
| 1999-10-16 | 75.566 |
| 1999-10-17 | 75.53 |
| 1999-10-18 | 74.875 |
| 1999-10-19 | 75.53 |
| 1999-10-20 | 73.474 |
| 1999-10-21 | 72.799 |
| 1999-10-22 | 72.554 |
| 1999-10-23 | 71.763 |
| 1999-10-24 | 71.435 |
| 1999-10-25 | 70.72 |
| 1999-10-26 | 72.18 |
| 1999-10-27 | 72.463 |
| 1999-10-28 | 72.569 |
| 1999-10-29 | 72.375 |
| 1999-10-30 | 73.159 |
| 1999-10-31 | 71.463 |
| 1999-11-01 | 70.968 |
| 1999-11-02 | 70.957 |
| 1999-11-03 | 71.023 |
| 1999-11-04 | 70.721 |
| 1999-11-05 | 69.338 |
| 1999-11-06 | 68.189 |
| 1999-11-07 | 66.687 |
| 1999-11-08 | 65.735 |
| 1999-11-09 | 65.936 |
| 1999-11-10 | 64.102 |
| 1999-11-11 | 64.116 |
| 1999-11-12 | 63.048 |
| 1999-11-13 | 61.562 |
| 1999-11-14 | 59.217 |
| 1999-11-15 | 58.571 |
| 1999-11-16 | 58.41 |
| 1999-11-17 | 57.314 |
| 1999-11-18 | 56.64 |
| 1999-11-19 | 56.847 |
| 1999-11-20 | 57.933 |
| 1999-11-21 | 56.865 |
| 1999-11-22 | 57.043 |
| 1999-11-23 | 58.316 |
| 1999-11-24 | 59.273 |
| 1999-11-25 | 57.313 |
| 1999-11-26 | 57.196 |
| 1999-11-27 | 56.403 |
| 1999-11-28 | 55.645 |
| 1999-11-29 | 56.128 |
| 1999-11-30 | 57.847 |
| 1999-12-01 | 56.248 |
| 1999-12-02 | 56.447 |
| 1999-12-03 | 56.36 |
| 1999-12-04 | 56.96 |
| 1999-12-05 | 57.95 |
| 1999-12-06 | 57.925 |
| 1999-12-07 | 59.597 |
| 1999-12-08 | 60.284 |
| 1999-12-09 | 61.293 |
| 1999-12-10 | 62.708 |
| 1999-12-11 | 64.139 |
| 1999-12-12 | 65 |
| 1999-12-13 | 65.774 |
| 1999-12-14 | 68.904 |
| 1999-12-15 | 69.705 |
| 1999-12-16 | 70.103 |
| 1999-12-17 | 70.675 |
| 1999-12-18 | 73.771 |
| 1999-12-19 | 74.437 |
| 1999-12-20 | 75.647 |
| 1999-12-21 | 77.414 |
| 1999-12-22 | 78.798 |
| 1999-12-23 | 78.132 |
| 1999-12-24 | 77.869 |
| 1999-12-25 | 80.503 |
| 1999-12-26 | 81.987 |
| 1999-12-27 | 84.152 |
| 1999-12-28 | 89.053 |
| 1999-12-29 | 90.598 |
| 1999-12-30 | 90.344 |
| 1999-12-31 | 91.606 |
| 2000-01-01 | 93.995 |
| 2000-01-02 | 94.002 |
| 2000-01-03 | 94.99 |
| 2000-01-04 | 95.872 |
| 2000-01-05 | 95.572 |
| 2000-01-06 | 94.736 |
| 2000-01-07 | 93.945 |
| 2000-01-08 | 93.856 |
| 2000-01-09 | 92.508 |
| 2000-01-10 | 91.086 |
| 2000-01-11 | 90.61 |
| 2000-01-12 | 89.559 |
| 2000-01-13 | 88.006 |
| 2000-01-14 | 86.545 |
| 2000-01-15 | 85.745 |
| 2000-01-16 | 85.414 |
| 2000-01-17 | 82.066 |
| 2000-01-18 | 81.782 |
| 2000-01-19 | 80.699 |
| 2000-01-20 | 79.688 |
| 2000-01-21 | 79.196 |
| 2000-01-22 | 79.316 |
| 2000-01-23 | 78.379 |
| 2000-01-24 | 76.719 |
| 2000-01-25 | 74.904 |
| 2000-01-26 | 73.394 |
| 2000-01-27 | 69.379 |
| 2000-01-28 | 66.934 |
| 2000-01-29 | 65.645 |
| 2000-01-30 | 65.352 |
| 2000-01-31 | 63.893 |
| 2000-02-01 | 65.047 |
| 2000-02-02 | 63.814 |
| 2000-02-03 | 62.479 |
| 2000-02-04 | 62.944 |
| 2000-02-05 | 63.28 |
| 2000-02-06 | 63.866 |
| 2000-02-07 | 63.931 |
| 2000-02-08 | 66.153 |
| 2000-02-09 | 66.532 |
| 2000-02-10 | 66.73 |
| 2000-02-11 | 68.111 |
| 2000-02-12 | 68.614 |
| 2000-02-13 | 68.732 |
| 2000-02-14 | 69.517 |
| 2000-02-15 | 70.46 |
| 2000-02-16 | 70.826 |
| 2000-02-17 | 70.782 |
| 2000-02-18 | 69.656 |
| 2000-02-19 | 69.455 |
| 2000-02-20 | 68.465 |
| 2000-02-21 | 67.364 |
| 2000-02-22 | 67.634 |
| 2000-02-23 | 66.413 |
| 2000-02-24 | 65.556 |
| 2000-02-25 | 65.227 |
| 2000-02-26 | 64.618 |
| 2000-02-27 | 64.166 |
| 2000-02-28 | 64.837 |
| 2000-02-29 | 64.405 |
| 2000-03-01 | 63.716 |
| 2000-03-02 | 61.864 |
| 2000-03-03 | 61.454 |
| 2000-03-04 | 61.177 |
| 2000-03-05 | 60.238 |
| 2000-03-06 | 60.03 |
| 2000-03-07 | 59.532 |
| 2000-03-08 | 58.437 |
| 2000-03-09 | 56.456 |
| 2000-03-10 | 55.204 |
| 2000-03-11 | 55.018 |
| 2000-03-12 | 53.474 |
| 2000-03-13 | 52.137 |
| 2000-03-14 | 51.904 |
| 2000-03-15 | 50.754 |
| 2000-03-16 | 50.386 |
| 2000-03-17 | 50.653 |
| 2000-03-18 | 49.924 |
| 2000-03-19 | 49.983 |
| 2000-03-20 | 50.394 |
| 2000-03-21 | 50.853 |
| 2000-03-22 | 51.588 |
| 2000-03-23 | 51.094 |
| 2000-03-24 | 51.113 |
| 2000-03-25 | 51.376 |
| 2000-03-26 | 50.516 |
| 2000-03-27 | 50.802 |
| 2000-03-28 | 52.211 |
| 2000-03-29 | 50.73 |
| 2000-03-30 | 50.791 |
| 2000-03-31 | 50.408 |
| 2000-04-01 | 50.555 |
| 2000-04-02 | 50.48 |
| 2000-04-03 | 50.098 |
| 2000-04-04 | 50.209 |
| 2000-04-05 | 49.153 |
| 2000-04-06 | 48.565 |
| 2000-04-07 | 48.495 |
| 2000-04-08 | 47.114 |
| 2000-04-09 | 47.707 |
| 2000-04-10 | 47.052 |
| 2000-04-11 | 47.709 |
| 2000-04-12 | 48.062 |
| 2000-04-13 | 47.675 |
| 2000-04-14 | 48.058 |
| 2000-04-15 | 47.801 |
| 2000-04-16 | 47.197 |
| 2000-04-17 | 47.475 |
| 2000-04-18 | 47.256 |
| 2000-04-19 | 47.137 |
| 2000-04-20 | 46.426 |
| 2000-04-21 | 45.416 |
| 2000-04-22 | 45.524 |
| 2000-04-23 | 45.508 |
| 2000-04-24 | 47.637 |
| 2000-04-25 | 48.892 |
| 2000-04-26 | 48.392 |
| 2000-04-27 | 47.541 |
| 2000-04-28 | 49.052 |
| 2000-04-29 | 49.531 |
| 2000-04-30 | 49.652 |
| 2000-05-01 | 50.677 |
| 2000-05-02 | 50.442 |
| 2000-05-03 | 51.856 |
| 2000-05-04 | 53.161 |
| 2000-05-05 | 55.388 |
| 2000-05-06 | 57.38 |
| 2000-05-07 | 57.332 |
| 2000-05-08 | 59.748 |
| 2000-05-09 | 61.272 |
| 2000-05-10 | 63.171 |
| 2000-05-11 | 64.102 |
| 2000-05-12 | 65.63 |
| 2000-05-13 | 67.132 |
| 2000-05-14 | 66.376 |
| 2000-05-15 | 66.904 |
| 2000-05-16 | 68.976 |
| 2000-05-17 | 68.308 |
| 2000-05-18 | 70.11 |
| 2000-05-19 | 71.459 |
| 2000-05-20 | 72.397 |
| 2000-05-21 | 73.747 |
| 2000-05-22 | 75.912 |
| 2000-05-23 | 76.998 |
| 2000-05-24 | 76.437 |
| 2000-05-25 | 75.458 |
| 2000-05-26 | 76.555 |
| 2000-05-27 | 76.879 |
| 2000-05-28 | 76.996 |
| 2000-05-29 | 78.649 |
| 2000-05-30 | 79.582 |
| 2000-05-31 | 80.186 |
| 2000-06-01 | 82.584 |
| 2000-06-02 | 82.197 |
| 2000-06-03 | 82.159 |
| 2000-06-04 | 81.622 |
| 2000-06-05 | 82.357 |
| 2000-06-06 | 83.889 |
| 2000-06-07 | 82.948 |
| 2000-06-08 | 81.152 |
| 2000-06-09 | 79.729 |
| 2000-06-10 | 79.677 |
| 2000-06-11 | 78.459 |
| 2000-06-12 | 77.247 |
| 2000-06-13 | 78.623 |
| 2000-06-14 | 77.424 |
| 2000-06-15 | 75.769 |
| 2000-06-16 | 77.294 |
| 2000-06-17 | 75.943 |
| 2000-06-18 | 74.391 |
| 2000-06-19 | 74.431 |
| 2000-06-20 | 73.628 |
| 2000-06-21 | 72.144 |
| 2000-06-22 | 70.735 |
| 2000-06-23 | 68.951 |
| 2000-06-24 | 69.234 |
| 2000-06-25 | 68.804 |
| 2000-06-26 | 68.171 |
| 2000-06-27 | 67.39 |
| 2000-06-28 | 65.685 |
| 2000-06-29 | 64.71 |
| 2000-06-30 | 64.127 |
| 2000-07-01 | 62.436 |
| 2000-07-02 | 61.519 |
| 2000-07-03 | 60.121 |
| 2000-07-04 | 59.888 |
| 2000-07-05 | 58.869 |
| 2000-07-06 | 58.344 |
| 2000-07-07 | 58.305 |
| 2000-07-08 | 57.706 |
| 2000-07-09 | 57.614 |
| 2000-07-10 | 56.694 |
| 2000-07-11 | 56.195 |
| 2000-07-12 | 55.566 |
| 2000-07-13 | 55.248 |
| 2000-07-14 | 56.049 |
| 2000-07-15 | 55.427 |
| 2000-07-16 | 53.646 |
| 2000-07-17 | 53.62 |
| 2000-07-18 | 52.762 |
| 2000-07-19 | 52.625 |
| 2000-07-20 | 53.167 |
| 2000-07-21 | 51.531 |
| 2000-07-22 | 52.132 |
| 2000-07-23 | 51.808 |
| 2000-07-24 | 51.883 |
| 2000-07-25 | 51.491 |
| 2000-07-26 | 51.374 |
| 2000-07-27 | 52.3 |
| 2000-07-28 | 51.541 |
| 2000-07-29 | 52.182 |
| 2000-07-30 | 51.243 |
| 2000-07-31 | 50.712 |
| 2000-08-01 | 51.327 |
| 2000-08-02 | 52.073 |
| 2000-08-03 | 51.328 |
| 2000-08-04 | 50.59 |
| 2000-08-05 | 49.274 |
| 2000-08-06 | 47.432 |
| 2000-08-07 | 47.582 |
| 2000-08-08 | 48.427 |
| 2000-08-09 | 48.256 |
| 2000-08-10 | 48.632 |
| 2000-08-11 | 48.774 |
| 2000-08-12 | 47.991 |
| 2000-08-13 | 46.98 |
| 2000-08-14 | 46.742 |
| 2000-08-15 | 48.185 |
| 2000-08-16 | 48.198 |
| 2000-08-17 | 48.447 |
| 2000-08-18 | 47.428 |
| 2000-08-19 | 46.369 |
| 2000-08-20 | 46.53 |
| 2000-08-21 | 46.002 |
| 2000-08-22 | 46.683 |
| 2000-08-23 | 46.289 |
| 2000-08-24 | 46.114 |
| 2000-08-25 | 46.511 |
| 2000-08-26 | 45.561 |
| 2000-08-27 | 45.846 |
| 2000-08-28 | 46.904 |
| 2000-08-29 | 47.354 |
| 2000-08-30 | 47.694 |
| 2000-08-31 | 47.242 |
| 2000-09-01 | 46.916 |
| 2000-09-02 | 47.525 |
| 2000-09-03 | 46.951 |
| 2000-09-04 | 47.559 |
| 2000-09-05 | 48.947 |
| 2000-09-06 | 49.587 |
| 2000-09-07 | 48.482 |
| 2000-09-08 | 47.736 |
| 2000-09-09 | 47.821 |
| 2000-09-10 | 47.829 |
| 2000-09-11 | 48.525 |
| 2000-09-12 | 49.695 |
| 2000-09-13 | 50.334 |
| 2000-09-14 | 49.886 |
| 2000-09-15 | 49.995 |
| 2000-09-16 | 51.159 |
| 2000-09-17 | 51.967 |
| 2000-09-18 | 54.023 |
| 2000-09-19 | 55.241 |
| 2000-09-20 | 55.693 |
| 2000-09-21 | 55.827 |
| 2000-09-22 | 56.279 |
| 2000-09-23 | 56.474 |
| 2000-09-24 | 56.067 |
| 2000-09-25 | 56.029 |
| 2000-09-26 | 56.292 |
| 2000-09-27 | 54.449 |
| 2000-09-28 | 53.492 |
| 2000-09-29 | 52.648 |
| 2000-09-30 | 52.758 |
| 2000-10-01 | 52.503 |
| 2000-10-02 | 51.685 |
| 2000-10-03 | 52.611 |
| 2000-10-04 | 53.231 |
| 2000-10-05 | 52.875 |
| 2000-10-06 | 53.792 |
| 2000-10-07 | 55.488 |
| 2000-10-08 | 56.434 |
| 2000-10-09 | 58.286 |
| 2000-10-10 | 60.455 |
| 2000-10-11 | 61.203 |
| 2000-10-12 | 59.838 |
| 2000-10-13 | 64.34 |
| 2000-10-14 | 66.468 |
| 2000-10-15 | 67.146 |
| 2000-10-16 | 68.335 |
| 2000-10-17 | 69.669 |
| 2000-10-18 | 69.076 |
| 2000-10-19 | 69.346 |
| 2000-10-20 | 69.261 |
| 2000-10-21 | 70.8 |
| 2000-10-22 | 70.44 |
| 2000-10-23 | 71.572 |
| 2000-10-24 | 72.454 |
| 2000-10-25 | 72.499 |
| 2000-10-26 | 72.816 |
| 2000-10-27 | 72.486 |
| 2000-10-28 | 73.732 |
| 2000-10-29 | 73.978 |
| 2000-10-30 | 74.457 |
| 2000-10-31 | 76.085 |
| 2000-11-01 | 76.473 |
| 2000-11-02 | 75.684 |
| 2000-11-03 | 75.821 |
| 2000-11-04 | 75.177 |
| 2000-11-05 | 73.119 |
| 2000-11-06 | 71.904 |
| 2000-11-07 | 71.232 |
| 2000-11-08 | 69.412 |
| 2000-11-09 | 67.434 |
| 2000-11-10 | 65.82 |
| 2000-11-11 | 66.057 |
| 2000-11-12 | 60.362 |
| 2000-11-13 | 57.882 |
| 2000-11-14 | 56.787 |
| 2000-11-15 | 54.2 |
| 2000-11-16 | 51.763 |
| 2000-11-17 | 50.165 |
| 2000-11-18 | 49.06 |
| 2000-11-19 | 48.751 |
| 2000-11-20 | 47.486 |
| 2000-11-21 | 47.666 |
| 2000-11-22 | 47.159 |
| 2000-11-23 | 46.87 |
| 2000-11-24 | 48.034 |
| 2000-11-25 | 47.444 |
| 2000-11-26 | 47.265 |
| 2000-11-27 | 46.55 |
| 2000-11-28 | 47.189 |
| 2000-11-29 | 46.787 |
| 2000-11-30 | 45.44 |
| 2000-12-01 | 44.587 |
| 2000-12-02 | 44.693 |
| 2000-12-03 | 43.768 |
| 2000-12-04 | 44.477 |
| 2000-12-05 | 44.72 |
| 2000-12-06 | 44.563 |
| 2000-12-07 | 43.943 |
| 2000-12-08 | 43.581 |
| 2000-12-09 | 43.122 |
| 2000-12-10 | 44.021 |
| 2000-12-11 | 44.812 |
| 2000-12-12 | 45.238 |
| 2000-12-13 | 45.474 |
| 2000-12-14 | 45.294 |
| 2000-12-15 | 46.158 |
| 2000-12-16 | 46.509 |
| 2000-12-17 | 46.834 |
| 2000-12-18 | 47.472 |
| 2000-12-19 | 47.404 |
| 2000-12-20 | 47.822 |
| 2000-12-21 | 48.539 |
| 2000-12-22 | 47.501 |
| 2000-12-23 | 46.336 |
| 2000-12-24 | 45.485 |
| 2000-12-25 | 45.061 |
| 2000-12-26 | 45.412 |
| 2000-12-27 | 46.184 |
| 2000-12-28 | 46.084 |
| 2000-12-29 | 46.268 |
| 2000-12-30 | 45.934 |
| 2000-12-31 | 46.702 |
| 2001-01-01 | 46.761 |
| 2001-01-02 | 46.78 |
| 2001-01-03 | 46.366 |
| 2001-01-04 | 47.286 |
| 2001-01-05 | 47.86 |
| 2001-01-06 | 48.753 |
| 2001-01-07 | 48.515 |
| 2001-01-08 | 49.419 |
| 2001-01-09 | 49.373 |
| 2001-01-10 | 48.89 |
| 2001-01-11 | 49.642 |
| 2001-01-12 | 49.829 |
| 2001-01-13 | 49.998 |
| 2001-01-14 | 49.976 |
| 2001-01-15 | 50.519 |
| 2001-01-16 | 51.364 |
| 2001-01-17 | 50.887 |
| 2001-01-18 | 50.83 |
| 2001-01-19 | 49.892 |
| 2001-01-20 | 49.74 |
| 2001-01-21 | 49.011 |
| 2001-01-22 | 49.242 |
| 2001-01-23 | 49.489 |
| 2001-01-24 | 50.11 |
| 2001-01-25 | 50.022 |
| 2001-01-26 | 49.21 |
| 2001-01-27 | 48.968 |
| 2001-01-28 | 48.429 |
| 2001-01-29 | 48.43 |
| 2001-01-30 | 47.329 |
| 2001-01-31 | 47.339 |
| 2001-02-01 | 47.25 |
| 2001-02-02 | 48.161 |
| 2001-02-03 | 47.11 |
| 2001-02-04 | 46.555 |
| 2001-02-05 | 46.266 |
| 2001-02-06 | 47.22 |
| 2001-02-07 | 46.253 |
| 2001-02-08 | 45.379 |
| 2001-02-09 | 45.102 |
| 2001-02-10 | 43.942 |
| 2001-02-11 | 43.462 |
| 2001-02-12 | 43.766 |
| 2001-02-13 | 43.442 |
| 2001-02-14 | 43.075 |
| 2001-02-15 | 42.754 |
| 2001-02-16 | 42.431 |
| 2001-02-17 | 44.987 |
| 2001-02-18 | 44.977 |
| 2001-02-19 | 47.721 |
| 2001-02-20 | 50.268 |
| 2001-02-21 | 52.006 |
| 2001-02-22 | 51.95 |
| 2001-02-23 | 52.487 |
| 2001-02-24 | 53.61 |
| 2001-02-25 | 53.548 |
| 2001-02-26 | 53.028 |
| 2001-02-27 | 53.555 |
| 2001-02-28 | 54.685 |
| 2001-03-01 | 55.625 |
| 2001-03-02 | 56.891 |
| 2001-03-03 | 57.106 |
| 2001-03-04 | 56.835 |
| 2001-03-05 | 58.105 |
| 2001-03-06 | 58.18 |
| 2001-03-07 | 58.78 |
| 2001-03-08 | 58.059 |
| 2001-03-09 | 58.722 |
| 2001-03-10 | 59.574 |
| 2001-03-11 | 59.851 |
| 2001-03-12 | 60.915 |
| 2001-03-13 | 62.303 |
| 2001-03-14 | 62.652 |
| 2001-03-15 | 62.905 |
| 2001-03-16 | 64.6 |
| 2001-03-17 | 65.404 |
| 2001-03-18 | 65.072 |
| 2001-03-19 | 63.008 |
| 2001-03-20 | 63.267 |
| 2001-03-21 | 60.383 |
| 2001-03-22 | 59.393 |
| 2001-03-23 | 58.783 |
| 2001-03-24 | 58.696 |
| 2001-03-25 | 58.713 |
| 2001-03-26 | 59.207 |
| 2001-03-27 | 60.709 |
| 2001-03-28 | 61.444 |
| 2001-03-29 | 61.765 |
| 2001-03-30 | 61.768 |
| 2001-03-31 | 62.329 |
| 2001-04-01 | 60.754 |
| 2001-04-02 | 60.429 |
| 2001-04-03 | 60.602 |
| 2001-04-04 | 60.419 |
| 2001-04-05 | 60.483 |
| 2001-04-06 | 60.087 |
| 2001-04-07 | 59.675 |
| 2001-04-08 | 59.144 |
| 2001-04-09 | 58.242 |
| 2001-04-10 | 58.271 |
| 2001-04-11 | 57.455 |
| 2001-04-12 | 56.19 |
| 2001-04-13 | 55.23 |
| 2001-04-14 | 54.793 |
| 2001-04-15 | 53.523 |
| 2001-04-16 | 53.588 |
| 2001-04-17 | 55.184 |
| 2001-04-18 | 55.247 |
| 2001-04-19 | 54.669 |
| 2001-04-20 | 54.008 |
| 2001-04-21 | 53.353 |
| 2001-04-22 | 52.446 |
| 2001-04-23 | 52.128 |
| 2001-04-24 | 51.318 |
| 2001-04-25 | 51.16 |
| 2001-04-26 | 50.384 |
| 2001-04-27 | 50.558 |
| 2001-04-28 | 49.897 |
| 2001-04-29 | 49.75 |
| 2001-04-30 | 49.027 |
| 2001-05-01 | 49.177 |
| 2001-05-02 | 50.596 |
| 2001-05-03 | 51.002 |
| 2001-05-04 | 52.012 |
| 2001-05-05 | 51.813 |
| 2001-05-06 | 51.753 |
| 2001-05-07 | 52.853 |
| 2001-05-08 | 54.613 |
| 2001-05-09 | 56.561 |
| 2001-05-10 | 56.462 |
| 2001-05-11 | 57.313 |
| 2001-05-12 | 57.388 |
| 2001-05-13 | 57.818 |
| 2001-05-14 | 58.06 |
| 2001-05-15 | 57.573 |
| 2001-05-16 | 56.607 |
| 2001-05-17 | 56.565 |
| 2001-05-18 | 56.675 |
| 2001-05-19 | 57.2 |
| 2001-05-20 | 57.502 |
| 2001-05-21 | 57.781 |
| 2001-05-22 | 58.581 |
| 2001-05-23 | 58.569 |
| 2001-05-24 | 58.75 |
| 2001-05-25 | 57.675 |
| 2001-05-26 | 58.147 |
| 2001-05-27 | 57.645 |
| 2001-05-28 | 59.003 |
| 2001-05-29 | 59.292 |
| 2001-05-30 | 60.025 |
| 2001-05-31 | 60.514 |
| 2001-06-01 | 60.124 |
| 2001-06-02 | 60.721 |
| 2001-06-03 | 60.131 |
| 2001-06-04 | 61.208 |
| 2001-06-05 | 62.348 |
| 2001-06-06 | 61.974 |
| 2001-06-07 | 61.24 |
| 2001-06-08 | 60.54 |
| 2001-06-09 | 61.214 |
| 2001-06-10 | 61.745 |
| 2001-06-11 | 63.38 |
| 2001-06-12 | 64.941 |
| 2001-06-13 | 66.259 |
| 2001-06-14 | 67.157 |
| 2001-06-15 | 67.554 |
| 2001-06-16 | 67.71 |
| 2001-06-17 | 66.967 |
| 2001-06-18 | 67.838 |
| 2001-06-19 | 68.743 |
| 2001-06-20 | 70.161 |
| 2001-06-21 | 71.075 |
| 2001-06-22 | 71.044 |
| 2001-06-23 | 72.776 |
| 2001-06-24 | 72.708 |
| 2001-06-25 | 72.431 |
| 2001-06-26 | 73.201 |
| 2001-06-27 | 72.777 |
| 2001-06-28 | 72.495 |
| 2001-06-29 | 71.867 |
| 2001-06-30 | 70.942 |
| 2001-07-01 | 69.681 |
| 2001-07-02 | 69.855 |
| 2001-07-03 | 70.123 |
| 2001-07-04 | 69.924 |
| 2001-07-05 | 70.02 |
| 2001-07-06 | 70.584 |
| 2001-07-07 | 70.122 |
| 2001-07-08 | 69.425 |
| 2001-07-09 | 68.195 |
| 2001-07-10 | 67.172 |
| 2001-07-11 | 65.639 |
| 2001-07-12 | 63.636 |
| 2001-07-13 | 62.725 |
| 2001-07-14 | 62.644 |
| 2001-07-15 | 62.501 |
| 2001-07-16 | 63.21 |
| 2001-07-17 | 63.757 |
| 2001-07-18 | 63.466 |
| 2001-07-19 | 62.789 |
| 2001-07-20 | 61.374 |
| 2001-07-21 | 59.941 |
| 2001-07-22 | 60.396 |
| 2001-07-23 | 58.999 |
| 2001-07-24 | 60.265 |
| 2001-07-25 | 60.814 |
| 2001-07-26 | 60.514 |
| 2001-07-27 | 60.26 |
| 2001-07-28 | 59.906 |
| 2001-07-29 | 59.715 |
| 2001-07-30 | 60.38 |
| 2001-07-31 | 60.814 |
| 2001-08-01 | 59.503 |
| 2001-08-02 | 59.272 |
| 2001-08-03 | 58.056 |
| 2001-08-04 | 56.949 |
| 2001-08-05 | 56.385 |
| 2001-08-06 | 56.456 |
| 2001-08-07 | 55.716 |
| 2001-08-08 | 56.718 |
| 2001-08-09 | 56.987 |
| 2001-08-10 | 58.151 |
| 2001-08-11 | 59.788 |
| 2001-08-12 | 59.972 |
| 2001-08-13 | 61.365 |
| 2001-08-14 | 62.741 |
| 2001-08-15 | 62.601 |
| 2001-08-16 | 62.85 |
| 2001-08-17 | 62.533 |
| 2001-08-18 | 61.971 |
| 2001-08-19 | 62.253 |
| 2001-08-20 | 62.23 |
| 2001-08-21 | 62.288 |
| 2001-08-22 | 62.483 |
| 2001-08-23 | 61.816 |
| 2001-08-24 | 62.081 |
| 2001-08-25 | 62.225 |
| 2001-08-26 | 61.885 |
| 2001-08-27 | 61.934 |
| 2001-08-28 | 63.37 |
| 2001-08-29 | 63.629 |
| 2001-08-30 | 63.884 |
| 2001-08-31 | 64.535 |
| 2001-09-01 | 63.746 |
| 2001-09-02 | 64.063 |
| 2001-09-03 | 64.929 |
| 2001-09-04 | 64.952 |
| 2001-09-05 | 64.536 |
| 2001-09-06 | 64.928 |
| 2001-09-07 | 65.39 |
| 2001-09-08 | 65.028 |
| 2001-09-09 | 62.873 |
| 2001-09-10 | 61.245 |
| 2001-09-11 | 64.132 |
| 2001-09-12 | 84.853 |
| 2001-09-13 | 102.597 |
| 2001-09-14 | 121.766 |
| 2001-09-15 | 138.821 |
| 2001-09-16 | 147.822 |
| 2001-09-17 | 171.112 |
| 2001-09-18 | 197.457 |
| 2001-09-19 | 221.215 |
| 2001-09-20 | 244.823 |
| 2001-09-21 | 271.635 |
| 2001-09-22 | 295.092 |
| 2001-09-23 | 308.29 |
| 2001-09-24 | 332.468 |
| 2001-09-25 | 365.561 |
| 2001-09-26 | 394.684 |
| 2001-09-27 | 418.265 |
| 2001-09-28 | 442.222 |
| 2001-09-29 | 460.84 |
| 2001-09-30 | 472.491 |
| 2001-10-01 | 491.519 |
| 2001-10-02 | 515.576 |
| 2001-10-03 | 540.25 |
| 2001-10-04 | 561.687 |
| 2001-10-05 | 583.314 |
| 2001-10-06 | 601.656 |
| 2001-10-07 | 610.635 |
| 2001-10-08 | 629.804 |
| 2001-10-09 | 652.665 |
| 2001-10-10 | 670.275 |
| 2001-10-11 | 681.694 |
| 2001-10-12 | 677.126 |
| 2001-10-13 | 671.967 |
| 2001-10-14 | 659.38 |
| 2001-10-15 | 655.104 |
| 2001-10-16 | 665.223 |
| 2001-10-17 | 661.021 |
| 2001-10-18 | 650.335 |
| 2001-10-19 | 640.34 |
| 2001-10-20 | 628.453 |
| 2001-10-21 | 607.057 |
| 2001-10-22 | 595.518 |
| 2001-10-23 | 596.903 |
| 2001-10-24 | 587.456 |
| 2001-10-25 | 566.12 |
| 2001-10-26 | 549.572 |
| 2001-10-27 | 533.823 |
| 2001-10-28 | 515.496 |
| 2001-10-29 | 506.195 |
| 2001-10-30 | 504.856 |
| 2001-10-31 | 500.277 |
| 2001-11-01 | 487.937 |
| 2001-11-02 | 473.499 |
| 2001-11-03 | 460.194 |
| 2001-11-04 | 444.787 |
| 2001-11-05 | 434.49 |
| 2001-11-06 | 437.537 |
| 2001-11-07 | 430.976 |
| 2001-11-08 | 416.398 |
| 2001-11-09 | 408.357 |
| 2001-11-10 | 400.955 |
| 2001-11-11 | 391.029 |
| 2001-11-12 | 384.73 |
| 2001-11-13 | 389.918 |
| 2001-11-14 | 387.644 |
| 2001-11-15 | 375.718 |
| 2001-11-16 | 364.861 |
| 2001-11-17 | 355.953 |
| 2001-11-18 | 347.125 |
| 2001-11-19 | 341.879 |
| 2001-11-20 | 345.339 |
| 2001-11-21 | 340.676 |
| 2001-11-22 | 331.891 |
| 2001-11-23 | 324.84 |
| 2001-11-24 | 317.705 |
| 2001-11-25 | 310.377 |
| 2001-11-26 | 306.793 |
| 2001-11-27 | 309.15 |
| 2001-11-28 | 310.005 |
| 2001-11-29 | 304.244 |
| 2001-11-30 | 296.178 |
| 2001-12-01 | 289.274 |
| 2001-12-02 | 282.179 |
| 2001-12-03 | 279.132 |
| 2001-12-04 | 280.957 |
| 2001-12-05 | 280.64 |
| 2001-12-06 | 274.001 |
| 2001-12-07 | 268.435 |
| 2001-12-08 | 266.763 |
| 2001-12-09 | 263.272 |
| 2001-12-10 | 262.339 |
| 2001-12-11 | 260.647 |
| 2001-12-12 | 260.312 |
| 2001-12-13 | 254.182 |
| 2001-12-14 | 251.517 |
| 2001-12-15 | 248.863 |
| 2001-12-16 | 246.49 |
| 2001-12-17 | 246.173 |
| 2001-12-18 | 246.978 |
| 2001-12-19 | 245.07 |
| 2001-12-20 | 242.146 |
| 2001-12-21 | 240.368 |
| 2001-12-22 | 239.107 |
| 2001-12-23 | 235.217 |
| 2001-12-24 | 235.95 |
| 2001-12-25 | 238.333 |
| 2001-12-26 | 237.725 |
| 2001-12-27 | 236.595 |
| 2001-12-28 | 233.351 |
| 2001-12-29 | 234.261 |
| 2001-12-30 | 232.352 |
| 2001-12-31 | 232.524 |
| 2002-01-01 | 236.405 |
| 2002-01-02 | 237.101 |
| 2002-01-03 | 234.302 |
| 2002-01-04 | 231.579 |
| 2002-01-05 | 228.864 |
| 2002-01-06 | 224.109 |
| 2002-01-07 | 222.649 |
| 2002-01-08 | 221.044 |
| 2002-01-09 | 218.936 |
| 2002-01-10 | 218.108 |
| 2002-01-11 | 215.845 |
| 2002-01-12 | 210.672 |
| 2002-01-13 | 204.565 |
| 2002-01-14 | 204.687 |
| 2002-01-15 | 203.504 |
| 2002-01-16 | 200.347 |
| 2002-01-17 | 200.131 |
| 2002-01-18 | 199.46 |
| 2002-01-19 | 196.17 |
| 2002-01-20 | 192.324 |
| 2002-01-21 | 189.835 |
| 2002-01-22 | 190.03 |
| 2002-01-23 | 188.379 |
| 2002-01-24 | 183.684 |
| 2002-01-25 | 182.023 |
| 2002-01-26 | 178.415 |
| 2002-01-27 | 173.395 |
| 2002-01-28 | 170.624 |
| 2002-01-29 | 170.633 |
| 2002-01-30 | 168.887 |
| 2002-01-31 | 166.006 |
| 2002-02-01 | 163.758 |
| 2002-02-02 | 161.57 |
| 2002-02-03 | 158.92 |
| 2002-02-04 | 157.446 |
| 2002-02-05 | 158.815 |
| 2002-02-06 | 158.874 |
| 2002-02-07 | 159.061 |
| 2002-02-08 | 156.828 |
| 2002-02-09 | 154.297 |
| 2002-02-10 | 151.343 |
| 2002-02-11 | 152.906 |
| 2002-02-12 | 154.806 |
| 2002-02-13 | 155.292 |
| 2002-02-14 | 154.226 |
| 2002-02-15 | 154.076 |
| 2002-02-16 | 149.967 |
| 2002-02-17 | 146.657 |
| 2002-02-18 | 145.137 |
| 2002-02-19 | 147.332 |
| 2002-02-20 | 147.493 |
| 2002-02-21 | 147.346 |
| 2002-02-22 | 147.23 |
| 2002-02-23 | 147.1 |
| 2002-02-24 | 145.776 |
| 2002-02-25 | 145.927 |
| 2002-02-26 | 147.037 |
| 2002-02-27 | 146.692 |
| 2002-02-28 | 145.455 |
| 2002-03-01 | 144.984 |
| 2002-03-02 | 142.484 |
| 2002-03-03 | 141.627 |
| 2002-03-04 | 144.861 |
| 2002-03-05 | 146.737 |
| 2002-03-06 | 147.787 |
| 2002-03-07 | 147.448 |
| 2002-03-08 | 146.395 |
| 2002-03-09 | 145.898 |
| 2002-03-10 | 146.432 |
| 2002-03-11 | 149.405 |
| 2002-03-12 | 152.596 |
| 2002-03-13 | 153.829 |
| 2002-03-14 | 153.037 |
| 2002-03-15 | 151.271 |
| 2002-03-16 | 150.069 |
| 2002-03-17 | 148.942 |
| 2002-03-18 | 152.233 |
| 2002-03-19 | 153.962 |
| 2002-03-20 | 156.473 |
| 2002-03-21 | 155.01 |
| 2002-03-22 | 155.248 |
| 2002-03-23 | 152.701 |
| 2002-03-24 | 152.2 |
| 2002-03-25 | 151.338 |
| 2002-03-26 | 152.204 |
| 2002-03-27 | 151.412 |
| 2002-03-28 | 149.285 |
| 2002-03-29 | 149.935 |
| 2002-03-30 | 150.995 |
| 2002-03-31 | 150.921 |
| 2002-04-01 | 151.869 |
| 2002-04-02 | 153.677 |
| 2002-04-03 | 151.93 |
| 2002-04-04 | 154.395 |
| 2002-04-05 | 156.532 |
| 2002-04-06 | 156.364 |
| 2002-04-07 | 156.546 |
| 2002-04-08 | 157.289 |
| 2002-04-09 | 159.562 |
| 2002-04-10 | 157.686 |
| 2002-04-11 | 156.911 |
| 2002-04-12 | 155.605 |
| 2002-04-13 | 156.623 |
| 2002-04-14 | 155.991 |
| 2002-04-15 | 158.302 |
| 2002-04-16 | 161.07 |
| 2002-04-17 | 158.154 |
| 2002-04-18 | 158.656 |
| 2002-04-19 | 159.237 |
| 2002-04-20 | 159.374 |
| 2002-04-21 | 157.512 |
| 2002-04-22 | 158.051 |
| 2002-04-23 | 157.527 |
| 2002-04-24 | 157.494 |
| 2002-04-25 | 156.878 |
| 2002-04-26 | 156.579 |
| 2002-04-27 | 156.641 |
| 2002-04-28 | 155.056 |
| 2002-04-29 | 153.215 |
| 2002-04-30 | 154.135 |
| 2002-05-01 | 153.044 |
| 2002-05-02 | 150.606 |
| 2002-05-03 | 149.28 |
| 2002-05-04 | 145.848 |
| 2002-05-05 | 144.027 |
| 2002-05-06 | 144.703 |
| 2002-05-07 | 145.644 |
| 2002-05-08 | 144.9 |
| 2002-05-09 | 144.779 |
| 2002-05-10 | 142.974 |
| 2002-05-11 | 140.639 |
| 2002-05-12 | 139.56 |
| 2002-05-13 | 138.921 |
| 2002-05-14 | 140.584 |
| 2002-05-15 | 139.92 |
| 2002-05-16 | 139.36 |
| 2002-05-17 | 140.796 |
| 2002-05-18 | 141.576 |
| 2002-05-19 | 138.854 |
| 2002-05-20 | 139.325 |
| 2002-05-21 | 142.109 |
| 2002-05-22 | 145.132 |
| 2002-05-23 | 147.788 |
| 2002-05-24 | 149.544 |
| 2002-05-25 | 151.016 |
| 2002-05-26 | 149.971 |
| 2002-05-27 | 154.413 |
| 2002-05-28 | 157.062 |
| 2002-05-29 | 159.004 |
| 2002-05-30 | 160.078 |
| 2002-05-31 | 160.348 |
| 2002-06-01 | 161.256 |
| 2002-06-02 | 160.598 |
| 2002-06-03 | 162.625 |
| 2002-06-04 | 162.923 |
| 2002-06-05 | 163.569 |
| 2002-06-06 | 162.639 |
| 2002-06-07 | 164.183 |
| 2002-06-08 | 161.808 |
| 2002-06-09 | 161.69 |
| 2002-06-10 | 162.465 |
| 2002-06-11 | 164.782 |
| 2002-06-12 | 164.521 |
| 2002-06-13 | 163.699 |
| 2002-06-14 | 162.838 |
| 2002-06-15 | 164.135 |
| 2002-06-16 | 162.593 |
| 2002-06-17 | 162.809 |
| 2002-06-18 | 163.436 |
| 2002-06-19 | 164.713 |
| 2002-06-20 | 163.558 |
| 2002-06-21 | 161.481 |
| 2002-06-22 | 157.955 |
| 2002-06-23 | 155.403 |
| 2002-06-24 | 155.769 |
| 2002-06-25 | 158.957 |
| 2002-06-26 | 157.095 |
| 2002-06-27 | 155.047 |
| 2002-06-28 | 152.415 |
| 2002-06-29 | 149.644 |
| 2002-06-30 | 147.798 |
| 2002-07-01 | 146.902 |
| 2002-07-02 | 147.664 |
| 2002-07-03 | 144.539 |
| 2002-07-04 | 144.475 |
| 2002-07-05 | 143.567 |
| 2002-07-06 | 144.337 |
| 2002-07-07 | 140.285 |
| 2002-07-08 | 139.603 |
| 2002-07-09 | 139.391 |
| 2002-07-10 | 137.777 |
| 2002-07-11 | 135.201 |
| 2002-07-12 | 134.739 |
| 2002-07-13 | 132.68 |
| 2002-07-14 | 131.683 |
| 2002-07-15 | 127.926 |
| 2002-07-16 | 128.27 |
| 2002-07-17 | 126.016 |
| 2002-07-18 | 125.696 |
| 2002-07-19 | 123.212 |
| 2002-07-20 | 121.905 |
| 2002-07-21 | 121.482 |
| 2002-07-22 | 121.186 |
| 2002-07-23 | 121.1 |
| 2002-07-24 | 120.033 |
| 2002-07-25 | 117.887 |
| 2002-07-26 | 115.83 |
| 2002-07-27 | 115.644 |
| 2002-07-28 | 115.179 |
| 2002-07-29 | 115.472 |
| 2002-07-30 | 118.408 |
| 2002-07-31 | 119.316 |
| 2002-08-01 | 119.116 |
| 2002-08-02 | 120.108 |
| 2002-08-03 | 121.096 |
| 2002-08-04 | 119.71 |
| 2002-08-05 | 118.162 |
| 2002-08-06 | 120.935 |
| 2002-08-07 | 123.161 |
| 2002-08-08 | 125.357 |
| 2002-08-09 | 125.562 |
| 2002-08-10 | 127.27 |
| 2002-08-11 | 125.699 |
| 2002-08-12 | 127.47 |
| 2002-08-13 | 127.686 |
| 2002-08-14 | 127.296 |
| 2002-08-15 | 126.711 |
| 2002-08-16 | 127.056 |
| 2002-08-17 | 126.132 |
| 2002-08-18 | 125.256 |
| 2002-08-19 | 123.66 |
| 2002-08-20 | 124.23 |
| 2002-08-21 | 126.253 |
| 2002-08-22 | 128.069 |
| 2002-08-23 | 128.111 |
| 2002-08-24 | 127.939 |
| 2002-08-25 | 128.488 |
| 2002-08-26 | 128.847 |
| 2002-08-27 | 130.274 |
| 2002-08-28 | 130.54 |
| 2002-08-29 | 128.589 |
| 2002-08-30 | 127.432 |
| 2002-08-31 | 126.807 |
| 2002-09-01 | 125.063 |
| 2002-09-02 | 123.823 |
| 2002-09-03 | 124.095 |
| 2002-09-04 | 126.126 |
| 2002-09-05 | 126.603 |
| 2002-09-06 | 125.944 |
| 2002-09-07 | 125.972 |
| 2002-09-08 | 126.385 |
| 2002-09-09 | 126.218 |
| 2002-09-10 | 130.597 |
| 2002-09-11 | 131.983 |
| 2002-09-12 | 134.362 |
| 2002-09-13 | 141.019 |
| 2002-09-14 | 144.675 |
| 2002-09-15 | 144.927 |
| 2002-09-16 | 146.866 |
| 2002-09-17 | 150.666 |
| 2002-09-18 | 156.338 |
| 2002-09-19 | 157.509 |
| 2002-09-20 | 158.723 |
| 2002-09-21 | 158.441 |
| 2002-09-22 | 157.189 |
| 2002-09-23 | 157.409 |
| 2002-09-24 | 160.73 |
| 2002-09-25 | 164.066 |
| 2002-09-26 | 164.446 |
| 2002-09-27 | 168.878 |
| 2002-09-28 | 169.767 |
| 2002-09-29 | 168.735 |
| 2002-09-30 | 170.251 |
| 2002-10-01 | 172.759 |
| 2002-10-02 | 172.35 |
| 2002-10-03 | 173.145 |
| 2002-10-04 | 172.479 |
| 2002-10-05 | 171.235 |
| 2002-10-06 | 168.845 |
| 2002-10-07 | 169.801 |
| 2002-10-08 | 172.078 |
| 2002-10-09 | 173.793 |
| 2002-10-10 | 172.216 |
| 2002-10-11 | 171.579 |
| 2002-10-12 | 171.95 |
| 2002-10-13 | 166.451 |
| 2002-10-14 | 166.029 |
| 2002-10-15 | 168.284 |
| 2002-10-16 | 168.523 |
| 2002-10-17 | 167.904 |
| 2002-10-18 | 169.065 |
| 2002-10-19 | 168.447 |
| 2002-10-20 | 167.706 |
| 2002-10-21 | 168.806 |
| 2002-10-22 | 170.215 |
| 2002-10-23 | 171.322 |
| 2002-10-24 | 168.917 |
| 2002-10-25 | 167.731 |
| 2002-10-26 | 169.448 |
| 2002-10-27 | 164.882 |
| 2002-10-28 | 166.273 |
| 2002-10-29 | 169.409 |
| 2002-10-30 | 169.227 |
| 2002-10-31 | 168.725 |
| 2002-11-01 | 169.891 |
| 2002-11-02 | 168.599 |
| 2002-11-03 | 165.23 |
| 2002-11-04 | 163.456 |
| 2002-11-05 | 165.544 |
| 2002-11-06 | 164.863 |
| 2002-11-07 | 163.789 |
| 2002-11-08 | 162.18 |
| 2002-11-09 | 161.875 |
| 2002-11-10 | 158.947 |
| 2002-11-11 | 157.739 |
| 2002-11-12 | 158.427 |
| 2002-11-13 | 158.737 |
| 2002-11-14 | 159.466 |
| 2002-11-15 | 160.666 |
| 2002-11-16 | 160.975 |
| 2002-11-17 | 156.687 |
| 2002-11-18 | 157.134 |
| 2002-11-19 | 158.706 |
| 2002-11-20 | 157.271 |
| 2002-11-21 | 157.517 |
| 2002-11-22 | 157.053 |
| 2002-11-23 | 158.21 |
| 2002-11-24 | 155.619 |
| 2002-11-25 | 153.574 |
| 2002-11-26 | 155.253 |
| 2002-11-27 | 154.198 |
| 2002-11-28 | 153.231 |
| 2002-11-29 | 154.723 |
| 2002-11-30 | 156.048 |
| 2002-12-01 | 154.327 |
| 2002-12-02 | 156.875 |
| 2002-12-03 | 160.433 |
| 2002-12-04 | 163.012 |
| 2002-12-05 | 164.924 |
| 2002-12-06 | 166.059 |
| 2002-12-07 | 164.304 |
| 2002-12-08 | 161.899 |
| 2002-12-09 | 160.798 |
| 2002-12-10 | 163.613 |
| 2002-12-11 | 164.046 |
| 2002-12-12 | 164.542 |
| 2002-12-13 | 163.636 |
| 2002-12-14 | 161.654 |
| 2002-12-15 | 157.981 |
| 2002-12-16 | 156.522 |
| 2002-12-17 | 157.673 |
| 2002-12-18 | 158.334 |
| 2002-12-19 | 156.962 |
| 2002-12-20 | 162.043 |
| 2002-12-21 | 163.401 |
| 2002-12-22 | 163.513 |
| 2002-12-23 | 163.88 |
| 2002-12-24 | 168.853 |
| 2002-12-25 | 170.975 |
| 2002-12-26 | 172.252 |
| 2002-12-27 | 174.29 |
| 2002-12-28 | 175.855 |
| 2002-12-29 | 173.854 |
| 2002-12-30 | 173.27 |
| 2002-12-31 | 176.972 |
| 2003-01-01 | 180.51 |
| 2003-01-02 | 180.806 |
| 2003-01-03 | 180.79 |
| 2003-01-04 | 179.535 |
| 2003-01-05 | 177.695 |
| 2003-01-06 | 178.208 |
| 2003-01-07 | 182.239 |
| 2003-01-08 | 184.458 |
| 2003-01-09 | 184.443 |
| 2003-01-10 | 186.695 |
| 2003-01-11 | 187.946 |
| 2003-01-12 | 186.122 |
| 2003-01-13 | 187.621 |
| 2003-01-14 | 191.232 |
| 2003-01-15 | 194.205 |
| 2003-01-16 | 194.242 |
| 2003-01-17 | 195.563 |
| 2003-01-18 | 195.249 |
| 2003-01-19 | 189.263 |
| 2003-01-20 | 190.148 |
| 2003-01-21 | 192.755 |
| 2003-01-22 | 193.988 |
| 2003-01-23 | 191.031 |
| 2003-01-24 | 192.831 |
| 2003-01-25 | 194.143 |
| 2003-01-26 | 193.064 |
| 2003-01-27 | 195.187 |
| 2003-01-28 | 200.079 |
| 2003-01-29 | 203.245 |
| 2003-01-30 | 204.437 |
| 2003-01-31 | 202.708 |
| 2003-02-01 | 203.34 |
| 2003-02-02 | 201.395 |
| 2003-02-03 | 201.553 |
| 2003-02-04 | 203.042 |
| 2003-02-05 | 205.665 |
| 2003-02-06 | 205.731 |
| 2003-02-07 | 207.551 |
| 2003-02-08 | 208.435 |
| 2003-02-09 | 203.956 |
| 2003-02-10 | 203 |
| 2003-02-11 | 206.425 |
| 2003-02-12 | 209.556 |
| 2003-02-13 | 214.278 |
| 2003-02-14 | 217.693 |
| 2003-02-15 | 222.357 |
| 2003-02-16 | 220.051 |
| 2003-02-17 | 224.203 |
| 2003-02-18 | 232.41 |
| 2003-02-19 | 233.488 |
| 2003-02-20 | 233.833 |
| 2003-02-21 | 233.852 |
| 2003-02-22 | 236.605 |
| 2003-02-23 | 234.932 |
| 2003-02-24 | 232.933 |
| 2003-02-25 | 238.514 |
| 2003-02-26 | 239.38 |
| 2003-02-27 | 237.494 |
| 2003-02-28 | 236.936 |
| 2003-03-01 | 234.444 |
| 2003-03-02 | 231.429 |
| 2003-03-03 | 232.926 |
| 2003-03-04 | 240.015 |
| 2003-03-05 | 245.702 |
| 2003-03-06 | 248.33 |
| 2003-03-07 | 252.213 |
| 2003-03-08 | 255.148 |
| 2003-03-09 | 252.715 |
| 2003-03-10 | 256.916 |
| 2003-03-11 | 263.522 |
| 2003-03-12 | 269.083 |
| 2003-03-13 | 270.71 |
| 2003-03-14 | 272.052 |
| 2003-03-15 | 269.852 |
| 2003-03-16 | 265.591 |
| 2003-03-17 | 266.488 |
| 2003-03-18 | 279.24 |
| 2003-03-19 | 287.549 |
| 2003-03-20 | 292.091 |
| 2003-03-21 | 303.846 |
| 2003-03-22 | 310.573 |
| 2003-03-23 | 311.499 |
| 2003-03-24 | 317.312 |
| 2003-03-25 | 327.944 |
| 2003-03-26 | 335.667 |
| 2003-03-27 | 340.469 |
| 2003-03-28 | 343.436 |
| 2003-03-29 | 347.376 |
| 2003-03-30 | 346.249 |
| 2003-03-31 | 354.562 |
| 2003-04-01 | 366.977 |
| 2003-04-02 | 373.033 |
| 2003-04-03 | 374.059 |
| 2003-04-04 | 375.926 |
| 2003-04-05 | 375.119 |
| 2003-04-06 | 371.564 |
| 2003-04-07 | 370.828 |
| 2003-04-08 | 376.026 |
| 2003-04-09 | 376.912 |
| 2003-04-10 | 376.2 |
| 2003-04-11 | 375.258 |
| 2003-04-12 | 374.518 |
| 2003-04-13 | 369.941 |
| 2003-04-14 | 369.762 |
| 2003-04-15 | 371.897 |
| 2003-04-16 | 369.742 |
| 2003-04-17 | 358.911 |
| 2003-04-18 | 348.724 |
| 2003-04-19 | 339.212 |
| 2003-04-20 | 324.911 |
| 2003-04-21 | 316.84 |
| 2003-04-22 | 314.167 |
| 2003-04-23 | 305.598 |
| 2003-04-24 | 294.123 |
| 2003-04-25 | 287.356 |
| 2003-04-26 | 276.854 |
| 2003-04-27 | 268.412 |
| 2003-04-28 | 261.556 |
| 2003-04-29 | 259.971 |
| 2003-04-30 | 252.859 |
| 2003-05-01 | 242.501 |
| 2003-05-02 | 233.344 |
| 2003-05-03 | 226.134 |
| 2003-05-04 | 216.339 |
| 2003-05-05 | 213.481 |
| 2003-05-06 | 211.943 |
| 2003-05-07 | 207.869 |
| 2003-05-08 | 201.384 |
| 2003-05-09 | 195.983 |
| 2003-05-10 | 190.767 |
| 2003-05-11 | 183.599 |
| 2003-05-12 | 181.666 |
| 2003-05-13 | 180.603 |
| 2003-05-14 | 179.258 |
| 2003-05-15 | 177.379 |
| 2003-05-16 | 175.042 |
| 2003-05-17 | 172.477 |
| 2003-05-18 | 168.384 |
| 2003-05-19 | 166.732 |
| 2003-05-20 | 167.7 |
| 2003-05-21 | 167.265 |
| 2003-05-22 | 168.353 |
| 2003-05-23 | 168.517 |
| 2003-05-24 | 167.171 |
| 2003-05-25 | 164.225 |
| 2003-05-26 | 163.71 |
| 2003-05-27 | 163.911 |
| 2003-05-28 | 164.138 |
| 2003-05-29 | 163.027 |
| 2003-05-30 | 160.288 |
| 2003-05-31 | 158.282 |
| 2003-06-01 | 156.015 |
| 2003-06-02 | 156.361 |
| 2003-06-03 | 159.857 |
| 2003-06-04 | 160.219 |
| 2003-06-05 | 160.411 |
| 2003-06-06 | 160.988 |
| 2003-06-07 | 160.257 |
| 2003-06-08 | 156.781 |
| 2003-06-09 | 157.418 |
| 2003-06-10 | 159.7 |
| 2003-06-11 | 158.928 |
| 2003-06-12 | 159.093 |
| 2003-06-13 | 156.302 |
| 2003-06-14 | 151.99 |
| 2003-06-15 | 147.175 |
| 2003-06-16 | 147.87 |
| 2003-06-17 | 149.046 |
| 2003-06-18 | 150.145 |
| 2003-06-19 | 149.141 |
| 2003-06-20 | 148.142 |
| 2003-06-21 | 145.013 |
| 2003-06-22 | 142.427 |
| 2003-06-23 | 142.735 |
| 2003-06-24 | 143.716 |
| 2003-06-25 | 146.173 |
| 2003-06-26 | 147.53 |
| 2003-06-27 | 147.596 |
| 2003-06-28 | 146.585 |
| 2003-06-29 | 145.417 |
| 2003-06-30 | 145.722 |
| 2003-07-01 | 148.006 |
| 2003-07-02 | 148.858 |
| 2003-07-03 | 145.988 |
| 2003-07-04 | 144.795 |
| 2003-07-05 | 141.721 |
| 2003-07-06 | 138.338 |
| 2003-07-07 | 137.185 |
| 2003-07-08 | 140.594 |
| 2003-07-09 | 140.441 |
| 2003-07-10 | 139.607 |
| 2003-07-11 | 137.485 |
| 2003-07-12 | 135.54 |
| 2003-07-13 | 133.852 |
| 2003-07-14 | 135.463 |
| 2003-07-15 | 138.177 |
| 2003-07-16 | 137.118 |
| 2003-07-17 | 136.821 |
| 2003-07-18 | 135.334 |
| 2003-07-19 | 133.54 |
| 2003-07-20 | 132.998 |
| 2003-07-21 | 134.71 |
| 2003-07-22 | 135.479 |
| 2003-07-23 | 136.458 |
| 2003-07-24 | 135.444 |
| 2003-07-25 | 133.223 |
| 2003-07-26 | 131.327 |
| 2003-07-27 | 128.961 |
| 2003-07-28 | 130.238 |
| 2003-07-29 | 132.574 |
| 2003-07-30 | 133.936 |
| 2003-07-31 | 133.268 |
| 2003-08-01 | 132.511 |
| 2003-08-02 | 131.725 |
| 2003-08-03 | 130.617 |
| 2003-08-04 | 133.539 |
| 2003-08-05 | 134.753 |
| 2003-08-06 | 136.866 |
| 2003-08-07 | 135.062 |
| 2003-08-08 | 135.23 |
| 2003-08-09 | 134.284 |
| 2003-08-10 | 134.845 |
| 2003-08-11 | 135.53 |
| 2003-08-12 | 137.39 |
| 2003-08-13 | 138.598 |
| 2003-08-14 | 138.731 |
| 2003-08-15 | 141.281 |
| 2003-08-16 | 141.309 |
| 2003-08-17 | 139.459 |
| 2003-08-18 | 140.398 |
| 2003-08-19 | 141.163 |
| 2003-08-20 | 142.622 |
| 2003-08-21 | 142.04 |
| 2003-08-22 | 140.831 |
| 2003-08-23 | 140.886 |
| 2003-08-24 | 138.015 |
| 2003-08-25 | 138.659 |
| 2003-08-26 | 142.547 |
| 2003-08-27 | 143.562 |
| 2003-08-28 | 142.264 |
| 2003-08-29 | 139.688 |
| 2003-08-30 | 138.662 |
| 2003-08-31 | 136.85 |
| 2003-09-01 | 138.818 |
| 2003-09-02 | 139.977 |
| 2003-09-03 | 139.002 |
| 2003-09-04 | 138.726 |
| 2003-09-05 | 138.096 |
| 2003-09-06 | 136.219 |
| 2003-09-07 | 133.914 |
| 2003-09-08 | 135.446 |
| 2003-09-09 | 136.974 |
| 2003-09-10 | 137.813 |
| 2003-09-11 | 136.249 |
| 2003-09-12 | 134.473 |
| 2003-09-13 | 134.446 |
| 2003-09-14 | 129.328 |
| 2003-09-15 | 128.41 |
| 2003-09-16 | 130.305 |
| 2003-09-17 | 129.755 |
| 2003-09-18 | 128.614 |
| 2003-09-19 | 125.494 |
| 2003-09-20 | 124.701 |
| 2003-09-21 | 123.501 |
| 2003-09-22 | 123.14 |
| 2003-09-23 | 124.206 |
| 2003-09-24 | 124.902 |
| 2003-09-25 | 122.042 |
| 2003-09-26 | 120.53 |
| 2003-09-27 | 118.122 |
| 2003-09-28 | 117.084 |
| 2003-09-29 | 118 |
| 2003-09-30 | 118.718 |
| 2003-10-01 | 116.353 |
| 2003-10-02 | 115.1 |
| 2003-10-03 | 115.128 |
| 2003-10-04 | 114.378 |
| 2003-10-05 | 112.312 |
| 2003-10-06 | 114.183 |
| 2003-10-07 | 115.672 |
| 2003-10-08 | 113.132 |
| 2003-10-09 | 110.445 |
| 2003-10-10 | 109.699 |
| 2003-10-11 | 109.257 |
| 2003-10-12 | 107.664 |
| 2003-10-13 | 106.986 |
| 2003-10-14 | 108.96 |
| 2003-10-15 | 109.018 |
| 2003-10-16 | 108.905 |
| 2003-10-17 | 108.495 |
| 2003-10-18 | 107.016 |
| 2003-10-19 | 106.171 |
| 2003-10-20 | 106.91 |
| 2003-10-21 | 108.779 |
| 2003-10-22 | 110.361 |
| 2003-10-23 | 110.875 |
| 2003-10-24 | 110.3 |
| 2003-10-25 | 108.84 |
| 2003-10-26 | 107.055 |
| 2003-10-27 | 108.193 |
| 2003-10-28 | 109.188 |
| 2003-10-29 | 109.101 |
| 2003-10-30 | 107.551 |
| 2003-10-31 | 108.351 |
| 2003-11-01 | 107.388 |
| 2003-11-02 | 105.314 |
| 2003-11-03 | 107.801 |
| 2003-11-04 | 109.501 |
| 2003-11-05 | 108.619 |
| 2003-11-06 | 107.594 |
| 2003-11-07 | 107.514 |
| 2003-11-08 | 107.713 |
| 2003-11-09 | 107.038 |
| 2003-11-10 | 108.523 |
| 2003-11-11 | 110.971 |
| 2003-11-12 | 109.826 |
| 2003-11-13 | 109.704 |
| 2003-11-14 | 109.321 |
| 2003-11-15 | 107.609 |
| 2003-11-16 | 106.739 |
| 2003-11-17 | 108.253 |
| 2003-11-18 | 110.328 |
| 2003-11-19 | 110.97 |
| 2003-11-20 | 110.209 |
| 2003-11-21 | 111.527 |
| 2003-11-22 | 113.231 |
| 2003-11-23 | 112.155 |
| 2003-11-24 | 114.339 |
| 2003-11-25 | 115.533 |
| 2003-11-26 | 115.672 |
| 2003-11-27 | 115.901 |
| 2003-11-28 | 116.385 |
| 2003-11-29 | 118.007 |
| 2003-11-30 | 117.273 |
| 2003-12-01 | 119.205 |
| 2003-12-02 | 120.851 |
| 2003-12-03 | 121.371 |
| 2003-12-04 | 121.76 |
| 2003-12-05 | 121.855 |
| 2003-12-06 | 122.432 |
| 2003-12-07 | 123.251 |
| 2003-12-08 | 123.228 |
| 2003-12-09 | 121.997 |
| 2003-12-10 | 122.479 |
| 2003-12-11 | 121.06 |
| 2003-12-12 | 122.325 |
| 2003-12-13 | 121.43 |
| 2003-12-14 | 120.37 |
| 2003-12-15 | 122.078 |
| 2003-12-16 | 123.878 |
| 2003-12-17 | 124.002 |
| 2003-12-18 | 121.651 |
| 2003-12-19 | 122.383 |
| 2003-12-20 | 122.795 |
| 2003-12-21 | 119.627 |
| 2003-12-22 | 119.798 |
| 2003-12-23 | 122.156 |
| 2003-12-24 | 123.977 |
| 2003-12-25 | 124.892 |
| 2003-12-26 | 126.4 |
| 2003-12-27 | 125.939 |
| 2003-12-28 | 125.557 |
| 2003-12-29 | 127.594 |
| 2003-12-30 | 131.134 |
| 2003-12-31 | 131.579 |
| 2004-01-01 | 134.699 |
| 2004-01-02 | 134.638 |
| 2004-01-03 | 136.097 |
| 2004-01-04 | 136.856 |
| 2004-01-05 | 136.51 |
| 2004-01-06 | 137.086 |
| 2004-01-07 | 139.287 |
| 2004-01-08 | 140.883 |
| 2004-01-09 | 140.912 |
| 2004-01-10 | 141.345 |
| 2004-01-11 | 139.108 |
| 2004-01-12 | 138.454 |
| 2004-01-13 | 141.03 |
| 2004-01-14 | 139.943 |
| 2004-01-15 | 139.324 |
| 2004-01-16 | 138.078 |
| 2004-01-17 | 138.179 |
| 2004-01-18 | 135.037 |
| 2004-01-19 | 133.21 |
| 2004-01-20 | 132.978 |
| 2004-01-21 | 129.926 |
| 2004-01-22 | 128.138 |
| 2004-01-23 | 125.426 |
| 2004-01-24 | 124.045 |
| 2004-01-25 | 121.618 |
| 2004-01-26 | 121.345 |
| 2004-01-27 | 121.273 |
| 2004-01-28 | 119.435 |
| 2004-01-29 | 117.802 |
| 2004-01-30 | 115.636 |
| 2004-01-31 | 110.819 |
| 2004-02-01 | 108.459 |
| 2004-02-02 | 108.693 |
| 2004-02-03 | 109.223 |
| 2004-02-04 | 111.18 |
| 2004-02-05 | 110.77 |
| 2004-02-06 | 110.492 |
| 2004-02-07 | 109.961 |
| 2004-02-08 | 108.315 |
| 2004-02-09 | 108.683 |
| 2004-02-10 | 110.662 |
| 2004-02-11 | 112.42 |
| 2004-02-12 | 110.618 |
| 2004-02-13 | 111.426 |
| 2004-02-14 | 110.783 |
| 2004-02-15 | 110.916 |
| 2004-02-16 | 111.198 |
| 2004-02-17 | 112.174 |
| 2004-02-18 | 112.314 |
| 2004-02-19 | 113.343 |
| 2004-02-20 | 113.08 |
| 2004-02-21 | 111.96 |
| 2004-02-22 | 111.086 |
| 2004-02-23 | 112.2 |
| 2004-02-24 | 114.198 |
| 2004-02-25 | 116.335 |
| 2004-02-26 | 115.721 |
| 2004-02-27 | 115.623 |
| 2004-02-28 | 113.845 |
| 2004-02-29 | 113.322 |
| 2004-03-01 | 114.948 |
| 2004-03-02 | 114.693 |
| 2004-03-03 | 112.144 |
| 2004-03-04 | 110.858 |
| 2004-03-05 | 109.036 |
| 2004-03-06 | 108.559 |
| 2004-03-07 | 105.484 |
| 2004-03-08 | 104.566 |
| 2004-03-09 | 104.172 |
| 2004-03-10 | 103.458 |
| 2004-03-11 | 102.961 |
| 2004-03-12 | 104.725 |
| 2004-03-13 | 106.568 |
| 2004-03-14 | 105.943 |
| 2004-03-15 | 108.994 |
| 2004-03-16 | 114.246 |
| 2004-03-17 | 117.226 |
| 2004-03-18 | 119.021 |
| 2004-03-19 | 122.814 |
| 2004-03-20 | 123.807 |
| 2004-03-21 | 125.337 |
| 2004-03-22 | 127.941 |
| 2004-03-23 | 132.271 |
| 2004-03-24 | 134.053 |
| 2004-03-25 | 134.313 |
| 2004-03-26 | 134.419 |
| 2004-03-27 | 134.321 |
| 2004-03-28 | 132.477 |
| 2004-03-29 | 134.475 |
| 2004-03-30 | 135.818 |
| 2004-03-31 | 137.67 |
| 2004-04-01 | 139.445 |
| 2004-04-02 | 141.4 |
| 2004-04-03 | 141.851 |
| 2004-04-04 | 141.102 |
| 2004-04-05 | 143.85 |
| 2004-04-06 | 148.091 |
| 2004-04-07 | 149.665 |
| 2004-04-08 | 151.87 |
| 2004-04-09 | 156.559 |
| 2004-04-10 | 158.388 |
| 2004-04-11 | 156.047 |
| 2004-04-12 | 157.348 |
| 2004-04-13 | 159.042 |
| 2004-04-14 | 160.613 |
| 2004-04-15 | 157.962 |
| 2004-04-16 | 157.894 |
| 2004-04-17 | 155.29 |
| 2004-04-18 | 152.567 |
| 2004-04-19 | 153.064 |
| 2004-04-20 | 153.771 |
| 2004-04-21 | 152.844 |
| 2004-04-22 | 150.823 |
| 2004-04-23 | 149.3 |
| 2004-04-24 | 147.73 |
| 2004-04-25 | 145.02 |
| 2004-04-26 | 145.414 |
| 2004-04-27 | 147.334 |
| 2004-04-28 | 148.68 |
| 2004-04-29 | 149.511 |
| 2004-04-30 | 148.73 |
| 2004-05-01 | 146.856 |
| 2004-05-02 | 143.962 |
| 2004-05-03 | 143.542 |
| 2004-05-04 | 144.835 |
| 2004-05-05 | 142.968 |
| 2004-05-06 | 140.593 |
| 2004-05-07 | 140.777 |
| 2004-05-08 | 138.664 |
| 2004-05-09 | 133.117 |
| 2004-05-10 | 131.876 |
| 2004-05-11 | 132.683 |
| 2004-05-12 | 130.516 |
| 2004-05-13 | 129.571 |
| 2004-05-14 | 125.424 |
| 2004-05-15 | 122.971 |
| 2004-05-16 | 120.29 |
| 2004-05-17 | 123.032 |
| 2004-05-18 | 124.126 |
| 2004-05-19 | 122.15 |
| 2004-05-20 | 122.668 |
| 2004-05-21 | 122.334 |
| 2004-05-22 | 120.53 |
| 2004-05-23 | 118.14 |
| 2004-05-24 | 120.057 |
| 2004-05-25 | 121.804 |
| 2004-05-26 | 122.175 |
| 2004-05-27 | 123.589 |
| 2004-05-28 | 122.654 |
| 2004-05-29 | 120.682 |
| 2004-05-30 | 120.83 |
| 2004-05-31 | 123.106 |
| 2004-06-01 | 125.493 |
| 2004-06-02 | 126.929 |
| 2004-06-03 | 128.719 |
| 2004-06-04 | 129.657 |
| 2004-06-05 | 129.485 |
| 2004-06-06 | 127.461 |
| 2004-06-07 | 126.396 |
| 2004-06-08 | 128.914 |
| 2004-06-09 | 129.162 |
| 2004-06-10 | 129.592 |
| 2004-06-11 | 130.952 |
| 2004-06-12 | 130.501 |
| 2004-06-13 | 129.462 |
| 2004-06-14 | 129.347 |
| 2004-06-15 | 130.116 |
| 2004-06-16 | 128.554 |
| 2004-06-17 | 127.535 |
| 2004-06-18 | 129.968 |
| 2004-06-19 | 129.807 |
| 2004-06-20 | 130.194 |
| 2004-06-21 | 133.166 |
| 2004-06-22 | 136.526 |
| 2004-06-23 | 136.672 |
| 2004-06-24 | 136.642 |
| 2004-06-25 | 137.737 |
| 2004-06-26 | 135.981 |
| 2004-06-27 | 134.241 |
| 2004-06-28 | 136.546 |
| 2004-06-29 | 138.08 |
| 2004-06-30 | 136.992 |
| 2004-07-01 | 136.206 |
| 2004-07-02 | 134.091 |
| 2004-07-03 | 131.387 |
| 2004-07-04 | 129.33 |
| 2004-07-05 | 129.484 |
| 2004-07-06 | 129.8 |
| 2004-07-07 | 131.657 |
| 2004-07-08 | 129.899 |
| 2004-07-09 | 130.788 |
| 2004-07-10 | 129.907 |
| 2004-07-11 | 128.345 |
| 2004-07-12 | 130.22 |
| 2004-07-13 | 131.47 |
| 2004-07-14 | 132.557 |
| 2004-07-15 | 134.114 |
| 2004-07-16 | 135.167 |
| 2004-07-17 | 134.425 |
| 2004-07-18 | 131.148 |
| 2004-07-19 | 130.498 |
| 2004-07-20 | 130.441 |
| 2004-07-21 | 129.311 |
| 2004-07-22 | 129.059 |
| 2004-07-23 | 133.075 |
| 2004-07-24 | 132.064 |
| 2004-07-25 | 130.248 |
| 2004-07-26 | 131.718 |
| 2004-07-27 | 133.501 |
| 2004-07-28 | 132.15 |
| 2004-07-29 | 129.894 |
| 2004-07-30 | 131.323 |
| 2004-07-31 | 130.468 |
| 2004-08-01 | 130.411 |
| 2004-08-02 | 133.81 |
| 2004-08-03 | 142.142 |
| 2004-08-04 | 146.215 |
| 2004-08-05 | 149.375 |
| 2004-08-06 | 152.762 |
| 2004-08-07 | 153.173 |
| 2004-08-08 | 152.095 |
| 2004-08-09 | 153.391 |
| 2004-08-10 | 155.105 |
| 2004-08-11 | 153.842 |
| 2004-08-12 | 153.997 |
| 2004-08-13 | 154.095 |
| 2004-08-14 | 150.641 |
| 2004-08-15 | 148.913 |
| 2004-08-16 | 149.737 |
| 2004-08-17 | 150.525 |
| 2004-08-18 | 150.44 |
| 2004-08-19 | 149.945 |
| 2004-08-20 | 148.472 |
| 2004-08-21 | 146.244 |
| 2004-08-22 | 139.07 |
| 2004-08-23 | 138.971 |
| 2004-08-24 | 139.003 |
| 2004-08-25 | 139.303 |
| 2004-08-26 | 137.676 |
| 2004-08-27 | 138.768 |
| 2004-08-28 | 138.958 |
| 2004-08-29 | 137.22 |
| 2004-08-30 | 139.336 |
| 2004-08-31 | 141.58 |
| 2004-09-01 | 139.736 |
| 2004-09-02 | 134.398 |
| 2004-09-03 | 133.302 |
| 2004-09-04 | 132.092 |
| 2004-09-05 | 128.9 |
| 2004-09-06 | 129.191 |
| 2004-09-07 | 130.966 |
| 2004-09-08 | 131.124 |
| 2004-09-09 | 131.926 |
| 2004-09-10 | 133.843 |
| 2004-09-11 | 134.015 |
| 2004-09-12 | 132.724 |
| 2004-09-13 | 134.475 |
| 2004-09-14 | 137.166 |
| 2004-09-15 | 137.904 |
| 2004-09-16 | 138.735 |
| 2004-09-17 | 139.098 |
| 2004-09-18 | 140.212 |
| 2004-09-19 | 140.432 |
| 2004-09-20 | 143.276 |
| 2004-09-21 | 146.942 |
| 2004-09-22 | 149.063 |
| 2004-09-23 | 151.05 |
| 2004-09-24 | 150.738 |
| 2004-09-25 | 151.575 |
| 2004-09-26 | 149.138 |
| 2004-09-27 | 150.654 |
| 2004-09-28 | 153.234 |
| 2004-09-29 | 152.434 |
| 2004-09-30 | 152.97 |
| 2004-10-01 | 153.74 |
| 2004-10-02 | 151.901 |
| 2004-10-03 | 148.529 |
| 2004-10-04 | 149.184 |
| 2004-10-05 | 148.872 |
| 2004-10-06 | 149.757 |
| 2004-10-07 | 148.162 |
| 2004-10-08 | 148.244 |
| 2004-10-09 | 144.686 |
| 2004-10-10 | 141.949 |
| 2004-10-11 | 142.267 |
| 2004-10-12 | 143.273 |
| 2004-10-13 | 142.505 |
| 2004-10-14 | 140.421 |
| 2004-10-15 | 139.43 |
| 2004-10-16 | 137.646 |
| 2004-10-17 | 135.854 |
| 2004-10-18 | 134.166 |
| 2004-10-19 | 134.342 |
| 2004-10-20 | 132.214 |
| 2004-10-21 | 130.685 |
| 2004-10-22 | 128.413 |
| 2004-10-23 | 126.625 |
| 2004-10-24 | 124.089 |
| 2004-10-25 | 123.488 |
| 2004-10-26 | 125.301 |
| 2004-10-27 | 123.224 |
| 2004-10-28 | 121.058 |
| 2004-10-29 | 120.11 |
| 2004-10-30 | 117.177 |
| 2004-10-31 | 116.491 |
| 2004-11-01 | 116.314 |
| 2004-11-02 | 116.761 |
| 2004-11-03 | 114.221 |
| 2004-11-04 | 113.6 |
| 2004-11-05 | 112.976 |
| 2004-11-06 | 111.719 |
| 2004-11-07 | 109.274 |
| 2004-11-08 | 112.317 |
| 2004-11-09 | 115.517 |
| 2004-11-10 | 116.384 |
| 2004-11-11 | 115.973 |
| 2004-11-12 | 116.886 |
| 2004-11-13 | 115.905 |
| 2004-11-14 | 115.373 |
| 2004-11-15 | 118.523 |
| 2004-11-16 | 121.103 |
| 2004-11-17 | 122.924 |
| 2004-11-18 | 122.835 |
| 2004-11-19 | 122.1 |
| 2004-11-20 | 120.804 |
| 2004-11-21 | 120.78 |
| 2004-11-22 | 121.266 |
| 2004-11-23 | 124.491 |
| 2004-11-24 | 126.313 |
| 2004-11-25 | 126.84 |
| 2004-11-26 | 125.65 |
| 2004-11-27 | 124.52 |
| 2004-11-28 | 124.445 |
| 2004-11-29 | 125.483 |
| 2004-11-30 | 124.462 |
| 2004-12-01 | 125.222 |
| 2004-12-02 | 126.322 |
| 2004-12-03 | 126.388 |
| 2004-12-04 | 127.045 |
| 2004-12-05 | 125.351 |
| 2004-12-06 | 126.672 |
| 2004-12-07 | 127.802 |
| 2004-12-08 | 126.092 |
| 2004-12-09 | 123.143 |
| 2004-12-10 | 120.936 |
| 2004-12-11 | 119.431 |
| 2004-12-12 | 117.132 |
| 2004-12-13 | 118.817 |
| 2004-12-14 | 118.238 |
| 2004-12-15 | 116.011 |
| 2004-12-16 | 112.82 |
| 2004-12-17 | 110.817 |
| 2004-12-18 | 110.671 |
| 2004-12-19 | 111.185 |
| 2004-12-20 | 112.443 |
| 2004-12-21 | 113.14 |
| 2004-12-22 | 112.849 |
| 2004-12-23 | 110.496 |
| 2004-12-24 | 108.393 |
| 2004-12-25 | 107.099 |
| 2004-12-26 | 106.358 |
| 2004-12-27 | 107.089 |
| 2004-12-28 | 106.341 |
| 2004-12-29 | 106.087 |
| 2004-12-30 | 106.708 |
| 2004-12-31 | 105.849 |
| 2005-01-01 | 103.186 |
| 2005-01-02 | 102.167 |
| 2005-01-03 | 103.332 |
| 2005-01-04 | 105.281 |
| 2005-01-05 | 104.36 |
| 2005-01-06 | 103.109 |
| 2005-01-07 | 102.542 |
| 2005-01-08 | 100.437 |
| 2005-01-09 | 99.909 |
| 2005-01-10 | 101.322 |
| 2005-01-11 | 102.154 |
| 2005-01-12 | 101.661 |
| 2005-01-13 | 101.827 |
| 2005-01-14 | 100.97 |
| 2005-01-15 | 101.275 |
| 2005-01-16 | 100.035 |
| 2005-01-17 | 99.309 |
| 2005-01-18 | 99.783 |
| 2005-01-19 | 99.098 |
| 2005-01-20 | 98.139 |
| 2005-01-21 | 97.907 |
| 2005-01-22 | 97.87 |
| 2005-01-23 | 96.165 |
| 2005-01-24 | 98.075 |
| 2005-01-25 | 99.284 |
| 2005-01-26 | 99.899 |
| 2005-01-27 | 100.814 |
| 2005-01-28 | 100.604 |
| 2005-01-29 | 99.961 |
| 2005-01-30 | 97.528 |
| 2005-01-31 | 100.765 |
| 2005-02-01 | 103.526 |
| 2005-02-02 | 103.632 |
| 2005-02-03 | 102.546 |
| 2005-02-04 | 102.445 |
| 2005-02-05 | 101.458 |
| 2005-02-06 | 99.94 |
| 2005-02-07 | 102.941 |
| 2005-02-08 | 103.02 |
| 2005-02-09 | 103.878 |
| 2005-02-10 | 105.233 |
| 2005-02-11 | 105.814 |
| 2005-02-12 | 105.654 |
| 2005-02-13 | 104.688 |
| 2005-02-14 | 106.253 |
| 2005-02-15 | 109.279 |
| 2005-02-16 | 110.661 |
| 2005-02-17 | 111.441 |
| 2005-02-18 | 111.412 |
| 2005-02-19 | 111.157 |
| 2005-02-20 | 109.743 |
| 2005-02-21 | 109.591 |
| 2005-02-22 | 111.642 |
| 2005-02-23 | 109.181 |
| 2005-02-24 | 109.314 |
| 2005-02-25 | 108.805 |
| 2005-02-26 | 107.833 |
| 2005-02-27 | 108.91 |
| 2005-02-28 | 109.075 |
| 2005-03-01 | 112.371 |
| 2005-03-02 | 110.861 |
| 2005-03-03 | 109.082 |
| 2005-03-04 | 106.719 |
| 2005-03-05 | 106.081 |
| 2005-03-06 | 104.503 |
| 2005-03-07 | 106.107 |
| 2005-03-08 | 108.185 |
| 2005-03-09 | 106.707 |
| 2005-03-10 | 106.554 |
| 2005-03-11 | 105.213 |
| 2005-03-12 | 103.785 |
| 2005-03-13 | 102.626 |
| 2005-03-14 | 102.315 |
| 2005-03-15 | 103.699 |
| 2005-03-16 | 103.111 |
| 2005-03-17 | 100.88 |
| 2005-03-18 | 99.068 |
| 2005-03-19 | 97.133 |
| 2005-03-20 | 94.899 |
| 2005-03-21 | 96.816 |
| 2005-03-22 | 96.999 |
| 2005-03-23 | 96.688 |
| 2005-03-24 | 96.733 |
| 2005-03-25 | 97 |
| 2005-03-26 | 95.52 |
| 2005-03-27 | 93.366 |
| 2005-03-28 | 93.396 |
| 2005-03-29 | 91.728 |
| 2005-03-30 | 90.732 |
| 2005-03-31 | 88.596 |
| 2005-04-01 | 88.791 |
| 2005-04-02 | 87.858 |
| 2005-04-03 | 88.609 |
| 2005-04-04 | 88.798 |
| 2005-04-05 | 90.477 |
| 2005-04-06 | 90.932 |
| 2005-04-07 | 90.602 |
| 2005-04-08 | 89.657 |
| 2005-04-09 | 89.299 |
| 2005-04-10 | 88.216 |
| 2005-04-11 | 88.463 |
| 2005-04-12 | 88.074 |
| 2005-04-13 | 87.925 |
| 2005-04-14 | 86.892 |
| 2005-04-15 | 86.557 |
| 2005-04-16 | 85.977 |
| 2005-04-17 | 86.06 |
| 2005-04-18 | 87.777 |
| 2005-04-19 | 90.177 |
| 2005-04-20 | 88.228 |
| 2005-04-21 | 87.688 |
| 2005-04-22 | 87.44 |
| 2005-04-23 | 85.801 |
| 2005-04-24 | 84.201 |
| 2005-04-25 | 84.712 |
| 2005-04-26 | 86.438 |
| 2005-04-27 | 86.595 |
| 2005-04-28 | 87.279 |
| 2005-04-29 | 87.088 |
| 2005-04-30 | 86.937 |
| 2005-05-01 | 86.001 |
| 2005-05-02 | 88.992 |
| 2005-05-03 | 89.838 |
| 2005-05-04 | 90.805 |
| 2005-05-05 | 89.704 |
| 2005-05-06 | 88.986 |
| 2005-05-07 | 88.058 |
| 2005-05-08 | 88.638 |
| 2005-05-09 | 90.753 |
| 2005-05-10 | 91.842 |
| 2005-05-11 | 92.127 |
| 2005-05-12 | 94.169 |
| 2005-05-13 | 94.892 |
| 2005-05-14 | 94.376 |
| 2005-05-15 | 93.539 |
| 2005-05-16 | 94.777 |
| 2005-05-17 | 94.545 |
| 2005-05-18 | 93.557 |
| 2005-05-19 | 92.772 |
| 2005-05-20 | 93.943 |
| 2005-05-21 | 93.679 |
| 2005-05-22 | 92.931 |
| 2005-05-23 | 92.469 |
| 2005-05-24 | 93.437 |
| 2005-05-25 | 94.169 |
| 2005-05-26 | 95.252 |
| 2005-05-27 | 97.037 |
| 2005-05-28 | 95.942 |
| 2005-05-29 | 95.928 |
| 2005-05-30 | 97.503 |
| 2005-05-31 | 99.165 |
| 2005-06-01 | 96.847 |
| 2005-06-02 | 95.54 |
| 2005-06-03 | 92.806 |
| 2005-06-04 | 92.694 |
| 2005-06-05 | 90.669 |
| 2005-06-06 | 91.799 |
| 2005-06-07 | 92.011 |
| 2005-06-08 | 90.517 |
| 2005-06-09 | 90.955 |
| 2005-06-10 | 90.494 |
| 2005-06-11 | 88.012 |
| 2005-06-12 | 86.512 |
| 2005-06-13 | 88.458 |
| 2005-06-14 | 88.093 |
| 2005-06-15 | 86.792 |
| 2005-06-16 | 86.601 |
| 2005-06-17 | 86.65 |
| 2005-06-18 | 86.329 |
| 2005-06-19 | 83.931 |
| 2005-06-20 | 84.099 |
| 2005-06-21 | 84.565 |
| 2005-06-22 | 86.053 |
| 2005-06-23 | 86.642 |
| 2005-06-24 | 85.78 |
| 2005-06-25 | 83.198 |
| 2005-06-26 | 80.921 |
| 2005-06-27 | 83.681 |
| 2005-06-28 | 84.249 |
| 2005-06-29 | 82.661 |
| 2005-06-30 | 81.757 |
| 2005-07-01 | 83.329 |
| 2005-07-02 | 82.771 |
| 2005-07-03 | 84.129 |
| 2005-07-04 | 85.843 |
| 2005-07-05 | 88.758 |
| 2005-07-06 | 87.509 |
| 2005-07-07 | 86.024 |
| 2005-07-08 | 98.659 |
| 2005-07-09 | 102.986 |
| 2005-07-10 | 105.449 |
| 2005-07-11 | 110.719 |
| 2005-07-12 | 115.688 |
| 2005-07-13 | 119.392 |
| 2005-07-14 | 122.958 |
| 2005-07-15 | 125.968 |
| 2005-07-16 | 130.338 |
| 2005-07-17 | 131.618 |
| 2005-07-18 | 134.551 |
| 2005-07-19 | 138.941 |
| 2005-07-20 | 143.306 |
| 2005-07-21 | 145.08 |
| 2005-07-22 | 147.89 |
| 2005-07-23 | 150.287 |
| 2005-07-24 | 150.657 |
| 2005-07-25 | 155.938 |
| 2005-07-26 | 160.399 |
| 2005-07-27 | 161.45 |
| 2005-07-28 | 163.866 |
| 2005-07-29 | 166.933 |
| 2005-07-30 | 167.737 |
| 2005-07-31 | 165.99 |
| 2005-08-01 | 169.928 |
| 2005-08-02 | 172.372 |
| 2005-08-03 | 173.675 |
| 2005-08-04 | 175.141 |
| 2005-08-05 | 176.442 |
| 2005-08-06 | 179.774 |
| 2005-08-07 | 167.687 |
| 2005-08-08 | 165.422 |
| 2005-08-09 | 165.112 |
| 2005-08-10 | 162.232 |
| 2005-08-11 | 159.301 |
| 2005-08-12 | 156.791 |
| 2005-08-13 | 153.199 |
| 2005-08-14 | 153.085 |
| 2005-08-15 | 150.556 |
| 2005-08-16 | 148.908 |
| 2005-08-17 | 146.474 |
| 2005-08-18 | 143.317 |
| 2005-08-19 | 141.319 |
| 2005-08-20 | 138.977 |
| 2005-08-21 | 134.805 |
| 2005-08-22 | 132.49 |
| 2005-08-23 | 133.406 |
| 2005-08-24 | 129.56 |
| 2005-08-25 | 126.301 |
| 2005-08-26 | 123.681 |
| 2005-08-27 | 121.02 |
| 2005-08-28 | 117.699 |
| 2005-08-29 | 117.004 |
| 2005-08-30 | 117.741 |
| 2005-08-31 | 114.642 |
| 2005-09-01 | 112.188 |
| 2005-09-02 | 111.38 |
| 2005-09-03 | 109.646 |
| 2005-09-04 | 108.742 |
| 2005-09-05 | 105.871 |
| 2005-09-06 | 105.949 |
| 2005-09-07 | 104.266 |
| 2005-09-08 | 101.993 |
| 2005-09-09 | 100.822 |
| 2005-09-10 | 99.203 |
| 2005-09-11 | 97.269 |
| 2005-09-12 | 98.936 |
| 2005-09-13 | 97.256 |
| 2005-09-14 | 97.6 |
| 2005-09-15 | 98.23 |
| 2005-09-16 | 98.218 |
| 2005-09-17 | 98.201 |
| 2005-09-18 | 95.744 |
| 2005-09-19 | 99.006 |
| 2005-09-20 | 101.774 |
| 2005-09-21 | 103.38 |
| 2005-09-22 | 103.225 |
| 2005-09-23 | 103.84 |
| 2005-09-24 | 102.851 |
| 2005-09-25 | 102.273 |
| 2005-09-26 | 103.045 |
| 2005-09-27 | 104.337 |
| 2005-09-28 | 103.941 |
| 2005-09-29 | 103.47 |
| 2005-09-30 | 103.767 |
| 2005-10-01 | 102.306 |
| 2005-10-02 | 99.814 |
| 2005-10-03 | 99.998 |
| 2005-10-04 | 100.273 |
| 2005-10-05 | 102.447 |
| 2005-10-06 | 101.423 |
| 2005-10-07 | 102.002 |
| 2005-10-08 | 103.222 |
| 2005-10-09 | 103.187 |
| 2005-10-10 | 104.107 |
| 2005-10-11 | 103.956 |
| 2005-10-12 | 102.282 |
| 2005-10-13 | 102.235 |
| 2005-10-14 | 99.919 |
| 2005-10-15 | 98.719 |
| 2005-10-16 | 97.61 |
| 2005-10-17 | 98.521 |
| 2005-10-18 | 100.704 |
| 2005-10-19 | 97.396 |
| 2005-10-20 | 94.95 |
| 2005-10-21 | 93.263 |
| 2005-10-22 | 92.228 |
| 2005-10-23 | 89.73 |
| 2005-10-24 | 89.597 |
| 2005-10-25 | 88.936 |
| 2005-10-26 | 88.175 |
| 2005-10-27 | 87.434 |
| 2005-10-28 | 86.658 |
| 2005-10-29 | 85.43 |
| 2005-10-30 | 84.406 |
| 2005-10-31 | 88.895 |
| 2005-11-01 | 90.473 |
| 2005-11-02 | 88.882 |
| 2005-11-03 | 88.086 |
| 2005-11-04 | 87.201 |
| 2005-11-05 | 86.933 |
| 2005-11-06 | 84.489 |
| 2005-11-07 | 84.133 |
| 2005-11-08 | 84.037 |
| 2005-11-09 | 83.623 |
| 2005-11-10 | 84.689 |
| 2005-11-11 | 87.461 |
| 2005-11-12 | 86.75 |
| 2005-11-13 | 86.311 |
| 2005-11-14 | 86.926 |
| 2005-11-15 | 88.961 |
| 2005-11-16 | 87.971 |
| 2005-11-17 | 86.677 |
| 2005-11-18 | 87.071 |
| 2005-11-19 | 86.495 |
| 2005-11-20 | 85.561 |
| 2005-11-21 | 85.977 |
| 2005-11-22 | 87.374 |
| 2005-11-23 | 87.51 |
| 2005-11-24 | 87.452 |
| 2005-11-25 | 87.249 |
| 2005-11-26 | 85.992 |
| 2005-11-27 | 85.495 |
| 2005-11-28 | 85.737 |
| 2005-11-29 | 85.441 |
| 2005-11-30 | 82.072 |
| 2005-12-01 | 82.176 |
| 2005-12-02 | 81.876 |
| 2005-12-03 | 81.742 |
| 2005-12-04 | 80.305 |
| 2005-12-05 | 81.015 |
| 2005-12-06 | 83.3 |
| 2005-12-07 | 82.564 |
| 2005-12-08 | 82.438 |
| 2005-12-09 | 83.442 |
| 2005-12-10 | 81.093 |
| 2005-12-11 | 78.723 |
| 2005-12-12 | 79.012 |
| 2005-12-13 | 82.245 |
| 2005-12-14 | 83.428 |
| 2005-12-15 | 83.355 |
| 2005-12-16 | 83.491 |
| 2005-12-17 | 83.648 |
| 2005-12-18 | 83.694 |
| 2005-12-19 | 86.459 |
| 2005-12-20 | 87.702 |
| 2005-12-21 | 88.323 |
| 2005-12-22 | 88.939 |
| 2005-12-23 | 88.93 |
| 2005-12-24 | 89.219 |
| 2005-12-25 | 89.126 |
| 2005-12-26 | 91.847 |
| 2005-12-27 | 92.849 |
| 2005-12-28 | 94.507 |
| 2005-12-29 | 96.356 |
| 2005-12-30 | 96.479 |
| 2005-12-31 | 94.684 |
| 2006-01-01 | 94.451 |
| 2006-01-02 | 94.31 |
| 2006-01-03 | 94.6 |
| 2006-01-04 | 95.131 |
| 2006-01-05 | 92.552 |
| 2006-01-06 | 92.972 |
| 2006-01-07 | 91.912 |
| 2006-01-08 | 90.931 |
| 2006-01-09 | 92.175 |
| 2006-01-10 | 92.883 |
| 2006-01-11 | 93.912 |
| 2006-01-12 | 92.132 |
| 2006-01-13 | 91.953 |
| 2006-01-14 | 90.131 |
| 2006-01-15 | 90.114 |
| 2006-01-16 | 90.293 |
| 2006-01-17 | 91.316 |
| 2006-01-18 | 91.525 |
| 2006-01-19 | 91.302 |
| 2006-01-20 | 92.907 |
| 2006-01-21 | 93.313 |
| 2006-01-22 | 92.952 |
| 2006-01-23 | 94.035 |
| 2006-01-24 | 93.61 |
| 2006-01-25 | 92.77 |
| 2006-01-26 | 93.484 |
| 2006-01-27 | 94.271 |
| 2006-01-28 | 92.059 |
| 2006-01-29 | 91.594 |
| 2006-01-30 | 93.272 |
| 2006-01-31 | 94.822 |
| 2006-02-01 | 98.02 |
| 2006-02-02 | 98.85 |
| 2006-02-03 | 99.647 |
| 2006-02-04 | 100.669 |
| 2006-02-05 | 100.137 |
| 2006-02-06 | 102.732 |
| 2006-02-07 | 104.845 |
| 2006-02-08 | 104.849 |
| 2006-02-09 | 103.888 |
| 2006-02-10 | 102.906 |
| 2006-02-11 | 102.012 |
| 2006-02-12 | 98.901 |
| 2006-02-13 | 99.715 |
| 2006-02-14 | 99.98 |
| 2006-02-15 | 99.021 |
| 2006-02-16 | 99.233 |
| 2006-02-17 | 97.883 |
| 2006-02-18 | 96.795 |
| 2006-02-19 | 93.686 |
| 2006-02-20 | 92.161 |
| 2006-02-21 | 93.506 |
| 2006-02-22 | 92.721 |
| 2006-02-23 | 94.913 |
| 2006-02-24 | 94.808 |
| 2006-02-25 | 94.793 |
| 2006-02-26 | 93.455 |
| 2006-02-27 | 95.345 |
| 2006-02-28 | 97.41 |
| 2006-03-01 | 97.695 |
| 2006-03-02 | 96.533 |
| 2006-03-03 | 95.164 |
| 2006-03-04 | 94.302 |
| 2006-03-05 | 92.462 |
| 2006-03-06 | 93.492 |
| 2006-03-07 | 95.375 |
| 2006-03-08 | 95.297 |
| 2006-03-09 | 94.7 |
| 2006-03-10 | 96.193 |
| 2006-03-11 | 96.257 |
| 2006-03-12 | 95.567 |
| 2006-03-13 | 96.579 |
| 2006-03-14 | 100.429 |
| 2006-03-15 | 100.157 |
| 2006-03-16 | 100.691 |
| 2006-03-17 | 102.72 |
| 2006-03-18 | 100.722 |
| 2006-03-19 | 98.595 |
| 2006-03-20 | 99.671 |
| 2006-03-21 | 101.397 |
| 2006-03-22 | 102.718 |
| 2006-03-23 | 101.413 |
| 2006-03-24 | 101.547 |
| 2006-03-25 | 98.877 |
| 2006-03-26 | 96.604 |
| 2006-03-27 | 95.511 |
| 2006-03-28 | 95.128 |
| 2006-03-29 | 93.854 |
| 2006-03-30 | 92.113 |
| 2006-03-31 | 90.896 |
| 2006-04-01 | 90.439 |
| 2006-04-02 | 87.817 |
| 2006-04-03 | 89.733 |
| 2006-04-04 | 89.938 |
| 2006-04-05 | 88.031 |
| 2006-04-06 | 85.7 |
| 2006-04-07 | 84.332 |
| 2006-04-08 | 82.567 |
| 2006-04-09 | 80.273 |
| 2006-04-10 | 81.291 |
| 2006-04-11 | 82.886 |
| 2006-04-12 | 83.055 |
| 2006-04-13 | 81.586 |
| 2006-04-14 | 80.913 |
| 2006-04-15 | 81.108 |
| 2006-04-16 | 78.978 |
| 2006-04-17 | 81.867 |
| 2006-04-18 | 84.869 |
| 2006-04-19 | 85.04 |
| 2006-04-20 | 84.316 |
| 2006-04-21 | 83.087 |
| 2006-04-22 | 83.1 |
| 2006-04-23 | 81.133 |
| 2006-04-24 | 82.724 |
| 2006-04-25 | 85.85 |
| 2006-04-26 | 87.447 |
| 2006-04-27 | 89.219 |
| 2006-04-28 | 89.931 |
| 2006-04-29 | 90.116 |
| 2006-04-30 | 89.328 |
| 2006-05-01 | 90.692 |
| 2006-05-02 | 92.638 |
| 2006-05-03 | 91.812 |
| 2006-05-04 | 91.85 |
| 2006-05-05 | 92.827 |
| 2006-05-06 | 92.883 |
| 2006-05-07 | 91.775 |
| 2006-05-08 | 93.604 |
| 2006-05-09 | 95.043 |
| 2006-05-10 | 95.645 |
| 2006-05-11 | 95.666 |
| 2006-05-12 | 95.401 |
| 2006-05-13 | 94.231 |
| 2006-05-14 | 94.864 |
| 2006-05-15 | 93.523 |
| 2006-05-16 | 95.114 |
| 2006-05-17 | 93.393 |
| 2006-05-18 | 91.577 |
| 2006-05-19 | 90.914 |
| 2006-05-20 | 90.129 |
| 2006-05-21 | 90.083 |
| 2006-05-22 | 90.634 |
| 2006-05-23 | 92.413 |
| 2006-05-24 | 91.997 |
| 2006-05-25 | 89.815 |
| 2006-05-26 | 88.685 |
| 2006-05-27 | 86.411 |
| 2006-05-28 | 84.798 |
| 2006-05-29 | 84.96 |
| 2006-05-30 | 85.437 |
| 2006-05-31 | 83.902 |
| 2006-06-01 | 84.306 |
| 2006-06-02 | 84.359 |
| 2006-06-03 | 85.11 |
| 2006-06-04 | 84.86 |
| 2006-06-05 | 85.566 |
| 2006-06-06 | 87.563 |
| 2006-06-07 | 87.138 |
| 2006-06-08 | 86.53 |
| 2006-06-09 | 86.374 |
| 2006-06-10 | 85.731 |
| 2006-06-11 | 84.536 |
| 2006-06-12 | 85.202 |
| 2006-06-13 | 85.551 |
| 2006-06-14 | 87.396 |
| 2006-06-15 | 87.554 |
| 2006-06-16 | 87.838 |
| 2006-06-17 | 87.672 |
| 2006-06-18 | 88.516 |
| 2006-06-19 | 90.095 |
| 2006-06-20 | 92.409 |
| 2006-06-21 | 92.933 |
| 2006-06-22 | 93.801 |
| 2006-06-23 | 95.141 |
| 2006-06-24 | 95.183 |
| 2006-06-25 | 93.945 |
| 2006-06-26 | 95.538 |
| 2006-06-27 | 98.571 |
| 2006-06-28 | 98.84 |
| 2006-06-29 | 99.63 |
| 2006-06-30 | 102.323 |
| 2006-07-01 | 100.085 |
| 2006-07-02 | 98.683 |
| 2006-07-03 | 97.911 |
| 2006-07-04 | 100.01 |
| 2006-07-05 | 100.999 |
| 2006-07-06 | 102.65 |
| 2006-07-07 | 103.854 |
| 2006-07-08 | 104.528 |
| 2006-07-09 | 103.244 |
| 2006-07-10 | 105.398 |
| 2006-07-11 | 108.501 |
| 2006-07-12 | 110.836 |
| 2006-07-13 | 113.851 |
| 2006-07-14 | 115.38 |
| 2006-07-15 | 115.229 |
| 2006-07-16 | 116.166 |
| 2006-07-17 | 121.191 |
| 2006-07-18 | 124.588 |
| 2006-07-19 | 126.759 |
| 2006-07-20 | 126.437 |
| 2006-07-21 | 127.605 |
| 2006-07-22 | 128.448 |
| 2006-07-23 | 127.589 |
| 2006-07-24 | 130.481 |
| 2006-07-25 | 133.227 |
| 2006-07-26 | 135.109 |
| 2006-07-27 | 134.549 |
| 2006-07-28 | 137.395 |
| 2006-07-29 | 138.131 |
| 2006-07-30 | 137.016 |
| 2006-07-31 | 140.316 |
| 2006-08-01 | 143.503 |
| 2006-08-02 | 145.751 |
| 2006-08-03 | 145.437 |
| 2006-08-04 | 146.017 |
| 2006-08-05 | 143.913 |
| 2006-08-06 | 141.697 |
| 2006-08-07 | 143.843 |
| 2006-08-08 | 146.338 |
| 2006-08-09 | 146.193 |
| 2006-08-10 | 145.994 |
| 2006-08-11 | 149.264 |
| 2006-08-12 | 151.021 |
| 2006-08-13 | 149.788 |
| 2006-08-14 | 153.048 |
| 2006-08-15 | 156.884 |
| 2006-08-16 | 153.896 |
| 2006-08-17 | 151.589 |
| 2006-08-18 | 150.777 |
| 2006-08-19 | 149.786 |
| 2006-08-20 | 148.682 |
| 2006-08-21 | 149.298 |
| 2006-08-22 | 151.771 |
| 2006-08-23 | 152.087 |
| 2006-08-24 | 151.402 |
| 2006-08-25 | 150.931 |
| 2006-08-26 | 151.604 |
| 2006-08-27 | 148.039 |
| 2006-08-28 | 148.326 |
| 2006-08-29 | 150.376 |
| 2006-08-30 | 149.047 |
| 2006-08-31 | 147.356 |
| 2006-09-01 | 147.649 |
| 2006-09-02 | 146.993 |
| 2006-09-03 | 145.687 |
| 2006-09-04 | 147.204 |
| 2006-09-05 | 150.161 |
| 2006-09-06 | 148.921 |
| 2006-09-07 | 146.624 |
| 2006-09-08 | 146.362 |
| 2006-09-09 | 145.618 |
| 2006-09-10 | 140.453 |
| 2006-09-11 | 137.356 |
| 2006-09-12 | 136.894 |
| 2006-09-13 | 133.592 |
| 2006-09-14 | 129.591 |
| 2006-09-15 | 128.349 |
| 2006-09-16 | 126.23 |
| 2006-09-17 | 124.118 |
| 2006-09-18 | 124.499 |
| 2006-09-19 | 126.051 |
| 2006-09-20 | 124.991 |
| 2006-09-21 | 122.738 |
| 2006-09-22 | 120.927 |
| 2006-09-23 | 120.221 |
| 2006-09-24 | 117.562 |
| 2006-09-25 | 115.587 |
| 2006-09-26 | 117.015 |
| 2006-09-27 | 115.443 |
| 2006-09-28 | 113.978 |
| 2006-09-29 | 114.125 |
| 2006-09-30 | 113.619 |
| 2006-10-01 | 110.152 |
| 2006-10-02 | 109.826 |
| 2006-10-03 | 110.486 |
| 2006-10-04 | 109.644 |
| 2006-10-05 | 107.942 |
| 2006-10-06 | 107.158 |
| 2006-10-07 | 106.813 |
| 2006-10-08 | 103.451 |
| 2006-10-09 | 102.715 |
| 2006-10-10 | 107.847 |
| 2006-10-11 | 111.267 |
| 2006-10-12 | 110.867 |
| 2006-10-13 | 111.338 |
| 2006-10-14 | 110.718 |
| 2006-10-15 | 109.782 |
| 2006-10-16 | 112.669 |
| 2006-10-17 | 114.682 |
| 2006-10-18 | 114.593 |
| 2006-10-19 | 113.346 |
| 2006-10-20 | 112.448 |
| 2006-10-21 | 112.544 |
| 2006-10-22 | 110.966 |
| 2006-10-23 | 111.333 |
| 2006-10-24 | 113.157 |
| 2006-10-25 | 114.951 |
| 2006-10-26 | 114.431 |
| 2006-10-27 | 114.735 |
| 2006-10-28 | 113.523 |
| 2006-10-29 | 111.808 |
| 2006-10-30 | 111.612 |
| 2006-10-31 | 114.656 |
| 2006-11-01 | 115.829 |
| 2006-11-02 | 115.854 |
| 2006-11-03 | 115.313 |
| 2006-11-04 | 113.251 |
| 2006-11-05 | 111.127 |
| 2006-11-06 | 110.356 |
| 2006-11-07 | 110.493 |
| 2006-11-08 | 109.759 |
| 2006-11-09 | 104.362 |
| 2006-11-10 | 100.082 |
| 2006-11-11 | 98.98 |
| 2006-11-12 | 96.689 |
| 2006-11-13 | 97.4 |
| 2006-11-14 | 99.689 |
| 2006-11-15 | 97.915 |
| 2006-11-16 | 96.656 |
| 2006-11-17 | 94.9 |
| 2006-11-18 | 93.279 |
| 2006-11-19 | 92.415 |
| 2006-11-20 | 92.515 |
| 2006-11-21 | 92.916 |
| 2006-11-22 | 91.643 |
| 2006-11-23 | 91.343 |
| 2006-11-24 | 89.613 |
| 2006-11-25 | 88.925 |
| 2006-11-26 | 88.223 |
| 2006-11-27 | 88.974 |
| 2006-11-28 | 89.456 |
| 2006-11-29 | 90.057 |
| 2006-11-30 | 87.805 |
| 2006-12-01 | 86.237 |
| 2006-12-02 | 84.57 |
| 2006-12-03 | 82.233 |
| 2006-12-04 | 83.105 |
| 2006-12-05 | 86.567 |
| 2006-12-06 | 87.839 |
| 2006-12-07 | 88.527 |
| 2006-12-08 | 89.434 |
| 2006-12-09 | 89.775 |
| 2006-12-10 | 88.662 |
| 2006-12-11 | 88.836 |
| 2006-12-12 | 90.167 |
| 2006-12-13 | 90.292 |
| 2006-12-14 | 88.172 |
| 2006-12-15 | 87.28 |
| 2006-12-16 | 86.447 |
| 2006-12-17 | 87.044 |
| 2006-12-18 | 87.514 |
| 2006-12-19 | 89.667 |
| 2006-12-20 | 88.778 |
| 2006-12-21 | 89.541 |
| 2006-12-22 | 89.841 |
| 2006-12-23 | 89.111 |
| 2006-12-24 | 88.497 |
| 2006-12-25 | 90.415 |
| 2006-12-26 | 92.27 |
| 2006-12-27 | 91.258 |
| 2006-12-28 | 92.081 |
| 2006-12-29 | 91.914 |
| 2006-12-30 | 93.292 |
| 2006-12-31 | 91.339 |
| 2007-01-01 | 92.224 |
| 2007-01-02 | 94.588 |
| 2007-01-03 | 94.245 |
| 2007-01-04 | 92.063 |
| 2007-01-05 | 92.143 |
| 2007-01-06 | 93.116 |
| 2007-01-07 | 91.892 |
| 2007-01-08 | 92.106 |
| 2007-01-09 | 92.924 |
| 2007-01-10 | 95.326 |
| 2007-01-11 | 95.595 |
| 2007-01-12 | 96.745 |
| 2007-01-13 | 97.695 |
| 2007-01-14 | 97.187 |
| 2007-01-15 | 97.901 |
| 2007-01-16 | 98.144 |
| 2007-01-17 | 99.625 |
| 2007-01-18 | 99.34 |
| 2007-01-19 | 98.486 |
| 2007-01-20 | 97.343 |
| 2007-01-21 | 97.286 |
| 2007-01-22 | 98.017 |
| 2007-01-23 | 99.817 |
| 2007-01-24 | 98.921 |
| 2007-01-25 | 98.423 |
| 2007-01-26 | 98.622 |
| 2007-01-27 | 98.007 |
| 2007-01-28 | 97.04 |
| 2007-01-29 | 95.043 |
| 2007-01-30 | 97.436 |
| 2007-01-31 | 97.646 |
| 2007-02-01 | 96.419 |
| 2007-02-02 | 98.5 |
| 2007-02-03 | 99.191 |
| 2007-02-04 | 98.098 |
| 2007-02-05 | 97.293 |
| 2007-02-06 | 97.999 |
| 2007-02-07 | 98.652 |
| 2007-02-08 | 97.656 |
| 2007-02-09 | 95.735 |
| 2007-02-10 | 94.805 |
| 2007-02-11 | 92.216 |
| 2007-02-12 | 92.192 |
| 2007-02-13 | 93.206 |
| 2007-02-14 | 93.59 |
| 2007-02-15 | 94.59 |
| 2007-02-16 | 93.543 |
| 2007-02-17 | 91.453 |
| 2007-02-18 | 91.065 |
| 2007-02-19 | 91.724 |
| 2007-02-20 | 93.352 |
| 2007-02-21 | 92.836 |
| 2007-02-22 | 91.862 |
| 2007-02-23 | 92.412 |
| 2007-02-24 | 91.402 |
| 2007-02-25 | 91.93 |
| 2007-02-26 | 92.569 |
| 2007-02-27 | 93.43 |
| 2007-02-28 | 95.593 |
| 2007-03-01 | 95.251 |
| 2007-03-02 | 96.274 |
| 2007-03-03 | 96.021 |
| 2007-03-04 | 92.772 |
| 2007-03-05 | 93.394 |
| 2007-03-06 | 94.893 |
| 2007-03-07 | 96.824 |
| 2007-03-08 | 95.979 |
| 2007-03-09 | 94.819 |
| 2007-03-10 | 94.143 |
| 2007-03-11 | 93.158 |
| 2007-03-12 | 92.666 |
| 2007-03-13 | 92.551 |
| 2007-03-14 | 92.637 |
| 2007-03-15 | 92.918 |
| 2007-03-16 | 92.916 |
| 2007-03-17 | 91.085 |
| 2007-03-18 | 89.327 |
| 2007-03-19 | 89.369 |
| 2007-03-20 | 90.72 |
| 2007-03-21 | 90.264 |
| 2007-03-22 | 89.055 |
| 2007-03-23 | 88.222 |
| 2007-03-24 | 88.167 |
| 2007-03-25 | 85.589 |
| 2007-03-26 | 86.417 |
| 2007-03-27 | 87.537 |
| 2007-03-28 | 87.561 |
| 2007-03-29 | 88.003 |
| 2007-03-30 | 86.959 |
| 2007-03-31 | 85.691 |
| 2007-04-01 | 83.691 |
| 2007-04-02 | 84.112 |
| 2007-04-03 | 86.2 |
| 2007-04-04 | 84.138 |
| 2007-04-05 | 83.999 |
| 2007-04-06 | 83.034 |
| 2007-04-07 | 82.301 |
| 2007-04-08 | 80.507 |
| 2007-04-09 | 80.831 |
| 2007-04-10 | 81.346 |
| 2007-04-11 | 82.601 |
| 2007-04-12 | 82.82 |
| 2007-04-13 | 82.025 |
| 2007-04-14 | 80.533 |
| 2007-04-15 | 78.802 |
| 2007-04-16 | 80.722 |
| 2007-04-17 | 82.204 |
| 2007-04-18 | 82.117 |
| 2007-04-19 | 81.023 |
| 2007-04-20 | 82.179 |
| 2007-04-21 | 81.296 |
| 2007-04-22 | 79.825 |
| 2007-04-23 | 78.67 |
| 2007-04-24 | 79.363 |
| 2007-04-25 | 79.822 |
| 2007-04-26 | 77.677 |
| 2007-04-27 | 77.118 |
| 2007-04-28 | 75.514 |
| 2007-04-29 | 74.014 |
| 2007-04-30 | 75.713 |
| 2007-05-01 | 78.139 |
| 2007-05-02 | 77.779 |
| 2007-05-03 | 76.231 |
| 2007-05-04 | 77.067 |
| 2007-05-05 | 75.299 |
| 2007-05-06 | 73.173 |
| 2007-05-07 | 74.296 |
| 2007-05-08 | 75.579 |
| 2007-05-09 | 77.013 |
| 2007-05-10 | 77.96 |
| 2007-05-11 | 78.098 |
| 2007-05-12 | 77.535 |
| 2007-05-13 | 77.018 |
| 2007-05-14 | 78.35 |
| 2007-05-15 | 79.102 |
| 2007-05-16 | 78.809 |
| 2007-05-17 | 78.983 |
| 2007-05-18 | 81.012 |
| 2007-05-19 | 80.515 |
| 2007-05-20 | 80.244 |
| 2007-05-21 | 80.807 |
| 2007-05-22 | 82.793 |
| 2007-05-23 | 85.02 |
| 2007-05-24 | 86.157 |
| 2007-05-25 | 86.358 |
| 2007-05-26 | 87.012 |
| 2007-05-27 | 87.698 |
| 2007-05-28 | 88.319 |
| 2007-05-29 | 89.595 |
| 2007-05-30 | 91.159 |
| 2007-05-31 | 90.215 |
| 2007-06-01 | 91.515 |
| 2007-06-02 | 92.258 |
| 2007-06-03 | 91.448 |
| 2007-06-04 | 95.878 |
| 2007-06-05 | 98.541 |
| 2007-06-06 | 100.305 |
| 2007-06-07 | 101.877 |
| 2007-06-08 | 102.236 |
| 2007-06-09 | 100.969 |
| 2007-06-10 | 99.505 |
| 2007-06-11 | 100.001 |
| 2007-06-12 | 101.479 |
| 2007-06-13 | 102.063 |
| 2007-06-14 | 102.514 |
| 2007-06-15 | 102.099 |
| 2007-06-16 | 101.582 |
| 2007-06-17 | 100.166 |
| 2007-06-18 | 103.375 |
| 2007-06-19 | 104.423 |
| 2007-06-20 | 105.738 |
| 2007-06-21 | 105.201 |
| 2007-06-22 | 103.686 |
| 2007-06-23 | 103.89 |
| 2007-06-24 | 101.894 |
| 2007-06-25 | 101.639 |
| 2007-06-26 | 100.568 |
| 2007-06-27 | 101.169 |
| 2007-06-28 | 100.237 |
| 2007-06-29 | 98.729 |
| 2007-06-30 | 98.585 |
| 2007-07-01 | 97.907 |
| 2007-07-02 | 100.357 |
| 2007-07-03 | 103.341 |
| 2007-07-04 | 102.795 |
| 2007-07-05 | 103.512 |
| 2007-07-06 | 103.31 |
| 2007-07-07 | 101.013 |
| 2007-07-08 | 99.798 |
| 2007-07-09 | 102.478 |
| 2007-07-10 | 105.047 |
| 2007-07-11 | 106.121 |
| 2007-07-12 | 105.74 |
| 2007-07-13 | 106.869 |
| 2007-07-14 | 105.796 |
| 2007-07-15 | 106.491 |
| 2007-07-16 | 109.765 |
| 2007-07-17 | 110.797 |
| 2007-07-18 | 111.153 |
| 2007-07-19 | 109.789 |
| 2007-07-20 | 108.705 |
| 2007-07-21 | 109.101 |
| 2007-07-22 | 110.259 |
| 2007-07-23 | 110.854 |
| 2007-07-24 | 111.436 |
| 2007-07-25 | 111.933 |
| 2007-07-26 | 113.56 |
| 2007-07-27 | 114.115 |
| 2007-07-28 | 115.407 |
| 2007-07-29 | 113.773 |
| 2007-07-30 | 113.452 |
| 2007-07-31 | 114.757 |
| 2007-08-01 | 113.771 |
| 2007-08-02 | 111.833 |
| 2007-08-03 | 110.588 |
| 2007-08-04 | 109.024 |
| 2007-08-05 | 107.263 |
| 2007-08-06 | 108.93 |
| 2007-08-07 | 110.404 |
| 2007-08-08 | 108.403 |
| 2007-08-09 | 106.46 |
| 2007-08-10 | 106.005 |
| 2007-08-11 | 105.172 |
| 2007-08-12 | 101.663 |
| 2007-08-13 | 102.02 |
| 2007-08-14 | 100.445 |
| 2007-08-15 | 98.21 |
| 2007-08-16 | 97.973 |
| 2007-08-17 | 95.571 |
| 2007-08-18 | 95.345 |
| 2007-08-19 | 94.313 |
| 2007-08-20 | 95.101 |
| 2007-08-21 | 93.64 |
| 2007-08-22 | 91.903 |
| 2007-08-23 | 91.101 |
| 2007-08-24 | 90.622 |
| 2007-08-25 | 87.766 |
| 2007-08-26 | 85.861 |
| 2007-08-27 | 85.112 |
| 2007-08-28 | 85.722 |
| 2007-08-29 | 84.931 |
| 2007-08-30 | 83.308 |
| 2007-08-31 | 81.754 |
| 2007-09-01 | 79.956 |
| 2007-09-02 | 77.414 |
| 2007-09-03 | 79.552 |
| 2007-09-04 | 81.097 |
| 2007-09-05 | 80.678 |
| 2007-09-06 | 79.781 |
| 2007-09-07 | 80.352 |
| 2007-09-08 | 80.528 |
| 2007-09-09 | 80.451 |
| 2007-09-10 | 82.102 |
| 2007-09-11 | 84.108 |
| 2007-09-12 | 84.612 |
| 2007-09-13 | 86.52 |
| 2007-09-14 | 85.703 |
| 2007-09-15 | 84.405 |
| 2007-09-16 | 83.858 |
| 2007-09-17 | 82.838 |
| 2007-09-18 | 84.172 |
| 2007-09-19 | 82.861 |
| 2007-09-20 | 84.905 |
| 2007-09-21 | 85.266 |
| 2007-09-22 | 85.661 |
| 2007-09-23 | 84.37 |
| 2007-09-24 | 86.09 |
| 2007-09-25 | 87.938 |
| 2007-09-26 | 88.678 |
| 2007-09-27 | 91.831 |
| 2007-09-28 | 93.32 |
| 2007-09-29 | 93.246 |
| 2007-09-30 | 92.719 |
| 2007-10-01 | 95.406 |
| 2007-10-02 | 97.321 |
| 2007-10-03 | 94.642 |
| 2007-10-04 | 93.672 |
| 2007-10-05 | 94.783 |
| 2007-10-06 | 93.757 |
| 2007-10-07 | 91.96 |
| 2007-10-08 | 93.472 |
| 2007-10-09 | 92.528 |
| 2007-10-10 | 91.189 |
| 2007-10-11 | 89.955 |
| 2007-10-12 | 89.225 |
| 2007-10-13 | 87.891 |
| 2007-10-14 | 87.236 |
| 2007-10-15 | 87.739 |
| 2007-10-16 | 90.61 |
| 2007-10-17 | 94.977 |
| 2007-10-18 | 94.835 |
| 2007-10-19 | 96.135 |
| 2007-10-20 | 94.991 |
| 2007-10-21 | 94.938 |
| 2007-10-22 | 95.654 |
| 2007-10-23 | 98.752 |
| 2007-10-24 | 101.002 |
| 2007-10-25 | 101.684 |
| 2007-10-26 | 104.197 |
| 2007-10-27 | 102.301 |
| 2007-10-28 | 99.853 |
| 2007-10-29 | 100.499 |
| 2007-10-30 | 101.858 |
| 2007-10-31 | 100.269 |
| 2007-11-01 | 99.528 |
| 2007-11-02 | 100.367 |
| 2007-11-03 | 101.659 |
| 2007-11-04 | 101.019 |
| 2007-11-05 | 103.671 |
| 2007-11-06 | 107.583 |
| 2007-11-07 | 106.483 |
| 2007-11-08 | 108.748 |
| 2007-11-09 | 110.04 |
| 2007-11-10 | 109.799 |
| 2007-11-11 | 109.1 |
| 2007-11-12 | 109.69 |
| 2007-11-13 | 110.433 |
| 2007-11-14 | 111.977 |
| 2007-11-15 | 110.07 |
| 2007-11-16 | 108.457 |
| 2007-11-17 | 108.112 |
| 2007-11-18 | 106.309 |
| 2007-11-19 | 105.496 |
| 2007-11-20 | 104.572 |
| 2007-11-21 | 102.606 |
| 2007-11-22 | 100.179 |
| 2007-11-23 | 98.884 |
| 2007-11-24 | 95.38 |
| 2007-11-25 | 91.712 |
| 2007-11-26 | 89.388 |
| 2007-11-27 | 91.485 |
| 2007-11-28 | 90.503 |
| 2007-11-29 | 89 |
| 2007-11-30 | 89.11 |
| 2007-12-01 | 88.902 |
| 2007-12-02 | 87.724 |
| 2007-12-03 | 85.454 |
| 2007-12-04 | 86.38 |
| 2007-12-05 | 87.537 |
| 2007-12-06 | 85.418 |
| 2007-12-07 | 85.784 |
| 2007-12-08 | 83.414 |
| 2007-12-09 | 82.73 |
| 2007-12-10 | 83.311 |
| 2007-12-11 | 85.396 |
| 2007-12-12 | 86.002 |
| 2007-12-13 | 86.047 |
| 2007-12-14 | 84.128 |
| 2007-12-15 | 83.131 |
| 2007-12-16 | 81.348 |
| 2007-12-17 | 81.45 |
| 2007-12-18 | 82.84 |
| 2007-12-19 | 84.245 |
| 2007-12-20 | 85.502 |
| 2007-12-21 | 86.556 |
| 2007-12-22 | 86.444 |
| 2007-12-23 | 84.374 |
| 2007-12-24 | 87.065 |
| 2007-12-25 | 89.133 |
| 2007-12-26 | 89.375 |
| 2007-12-27 | 89.301 |
| 2007-12-28 | 93.22 |
| 2007-12-29 | 95.186 |
| 2007-12-30 | 94.893 |
| 2007-12-31 | 95.301 |
| 2008-01-01 | 95.038 |
| 2008-01-02 | 96.307 |
| 2008-01-03 | 94.615 |
| 2008-01-04 | 91.402 |
| 2008-01-05 | 89.672 |
| 2008-01-06 | 88.365 |
| 2008-01-07 | 88.674 |
| 2008-01-08 | 88.134 |
| 2008-01-09 | 89.609 |
| 2008-01-10 | 89.093 |
| 2008-01-11 | 86.98 |
| 2008-01-12 | 85.939 |
| 2008-01-13 | 85.945 |
| 2008-01-14 | 86.814 |
| 2008-01-15 | 87.548 |
| 2008-01-16 | 87.807 |
| 2008-01-17 | 86.954 |
| 2008-01-18 | 85.017 |
| 2008-01-19 | 83.802 |
| 2008-01-20 | 84.294 |
| 2008-01-21 | 85.155 |
| 2008-01-22 | 86.036 |
| 2008-01-23 | 87.19 |
| 2008-01-24 | 85.974 |
| 2008-01-25 | 87.119 |
| 2008-01-26 | 86.358 |
| 2008-01-27 | 83.031 |
| 2008-01-28 | 82.126 |
| 2008-01-29 | 82.069 |
| 2008-01-30 | 80.379 |
| 2008-01-31 | 81.369 |
| 2008-02-01 | 81.526 |
| 2008-02-02 | 80.367 |
| 2008-02-03 | 78.933 |
| 2008-02-04 | 80.931 |
| 2008-02-05 | 82.069 |
| 2008-02-06 | 82.297 |
| 2008-02-07 | 81.233 |
| 2008-02-08 | 79.716 |
| 2008-02-09 | 78.232 |
| 2008-02-10 | 78.496 |
| 2008-02-11 | 79.548 |
| 2008-02-12 | 80.18 |
| 2008-02-13 | 80.574 |
| 2008-02-14 | 80.363 |
| 2008-02-15 | 81.023 |
| 2008-02-16 | 79.989 |
| 2008-02-17 | 79.938 |
| 2008-02-18 | 81.523 |
| 2008-02-19 | 82.687 |
| 2008-02-20 | 82.443 |
| 2008-02-21 | 82.438 |
| 2008-02-22 | 80.572 |
| 2008-02-23 | 80.617 |
| 2008-02-24 | 79.915 |
| 2008-02-25 | 79.933 |
| 2008-02-26 | 80.485 |
| 2008-02-27 | 79.748 |
| 2008-02-28 | 80.541 |
| 2008-02-29 | 82.021 |
| 2008-03-01 | 81.601 |
| 2008-03-02 | 81.801 |
| 2008-03-03 | 84.284 |
| 2008-03-04 | 88.143 |
| 2008-03-05 | 87.425 |
| 2008-03-06 | 87.894 |
| 2008-03-07 | 88.116 |
| 2008-03-08 | 89.212 |
| 2008-03-09 | 88.351 |
| 2008-03-10 | 88.524 |
| 2008-03-11 | 87.7 |
| 2008-03-12 | 88.04 |
| 2008-03-13 | 86.748 |
| 2008-03-14 | 86.309 |
| 2008-03-15 | 84.4 |
| 2008-03-16 | 82.288 |
| 2008-03-17 | 82.876 |
| 2008-03-18 | 84.041 |
| 2008-03-19 | 83.058 |
| 2008-03-20 | 80.526 |
| 2008-03-21 | 80.899 |
| 2008-03-22 | 80.498 |
| 2008-03-23 | 79.463 |
| 2008-03-24 | 79.735 |
| 2008-03-25 | 80.22 |
| 2008-03-26 | 79.915 |
| 2008-03-27 | 78.638 |
| 2008-03-28 | 79.202 |
| 2008-03-29 | 77.315 |
| 2008-03-30 | 77.197 |
| 2008-03-31 | 78.117 |
| 2008-04-01 | 76.623 |
| 2008-04-02 | 75.228 |
| 2008-04-03 | 72.158 |
| 2008-04-04 | 71.155 |
| 2008-04-05 | 68.956 |
| 2008-04-06 | 67.55 |
| 2008-04-07 | 67.405 |
| 2008-04-08 | 67.559 |
| 2008-04-09 | 68.296 |
| 2008-04-10 | 69.101 |
| 2008-04-11 | 68.563 |
| 2008-04-12 | 68.364 |
| 2008-04-13 | 67.585 |
| 2008-04-14 | 68.281 |
| 2008-04-15 | 68.143 |
| 2008-04-16 | 68.435 |
| 2008-04-17 | 68.345 |
| 2008-04-18 | 68.38 |
| 2008-04-19 | 68.992 |
| 2008-04-20 | 68.006 |
| 2008-04-21 | 68.32 |
| 2008-04-22 | 69.535 |
| 2008-04-23 | 69.859 |
| 2008-04-24 | 70.229 |
| 2008-04-25 | 69.956 |
| 2008-04-26 | 71.016 |
| 2008-04-27 | 70.692 |
| 2008-04-28 | 72.732 |
| 2008-04-29 | 72.502 |
| 2008-04-30 | 71.866 |
| 2008-05-01 | 72.853 |
| 2008-05-02 | 72.08 |
| 2008-05-03 | 71.975 |
| 2008-05-04 | 72.173 |
| 2008-05-05 | 72.001 |
| 2008-05-06 | 72.892 |
| 2008-05-07 | 73.162 |
| 2008-05-08 | 73.14 |
| 2008-05-09 | 73.154 |
| 2008-05-10 | 73.682 |
| 2008-05-11 | 73.686 |
| 2008-05-12 | 75.974 |
| 2008-05-13 | 76.779 |
| 2008-05-14 | 77.856 |
| 2008-05-15 | 78.292 |
| 2008-05-16 | 78.589 |
| 2008-05-17 | 77.647 |
| 2008-05-18 | 76.612 |
| 2008-05-19 | 76.317 |
| 2008-05-20 | 75.751 |
| 2008-05-21 | 75.688 |
| 2008-05-22 | 75.574 |
| 2008-05-23 | 74.928 |
| 2008-05-24 | 73.445 |
| 2008-05-25 | 72.987 |
| 2008-05-26 | 73.853 |
| 2008-05-27 | 74.158 |
| 2008-05-28 | 73.269 |
| 2008-05-29 | 73.41 |
| 2008-05-30 | 73.103 |
| 2008-05-31 | 72.51 |
| 2008-06-01 | 71.706 |
| 2008-06-02 | 71.998 |
| 2008-06-03 | 73.309 |
| 2008-06-04 | 74.456 |
| 2008-06-05 | 74.221 |
| 2008-06-06 | 75.056 |
| 2008-06-07 | 74.846 |
| 2008-06-08 | 73.74 |
| 2008-06-09 | 73.417 |
| 2008-06-10 | 73.199 |
| 2008-06-11 | 73.107 |
| 2008-06-12 | 72.424 |
| 2008-06-13 | 72.072 |
| 2008-06-14 | 73.896 |
| 2008-06-15 | 73.027 |
| 2008-06-16 | 74.604 |
| 2008-06-17 | 76.128 |
| 2008-06-18 | 77.289 |
| 2008-06-19 | 79.814 |
| 2008-06-20 | 81.538 |
| 2008-06-21 | 81.251 |
| 2008-06-22 | 80.126 |
| 2008-06-23 | 80.762 |
| 2008-06-24 | 84.484 |
| 2008-06-25 | 84.842 |
| 2008-06-26 | 85.87 |
| 2008-06-27 | 86.511 |
| 2008-06-28 | 86.299 |
| 2008-06-29 | 86.774 |
| 2008-06-30 | 86.786 |
| 2008-07-01 | 89.792 |
| 2008-07-02 | 90.908 |
| 2008-07-03 | 90 |
| 2008-07-04 | 89.679 |
| 2008-07-05 | 89.17 |
| 2008-07-06 | 86.743 |
| 2008-07-07 | 88.241 |
| 2008-07-08 | 89.841 |
| 2008-07-09 | 91.405 |
| 2008-07-10 | 93.403 |
| 2008-07-11 | 93.023 |
| 2008-07-12 | 93.2 |
| 2008-07-13 | 92.56 |
| 2008-07-14 | 93.322 |
| 2008-07-15 | 95.613 |
| 2008-07-16 | 96.412 |
| 2008-07-17 | 96.228 |
| 2008-07-18 | 96.469 |
| 2008-07-19 | 94.888 |
| 2008-07-20 | 92.906 |
| 2008-07-21 | 94.533 |
| 2008-07-22 | 95.534 |
| 2008-07-23 | 96.589 |
| 2008-07-24 | 93.472 |
| 2008-07-25 | 91.296 |
| 2008-07-26 | 89.004 |
| 2008-07-27 | 87.892 |
| 2008-07-28 | 88.993 |
| 2008-07-29 | 89.268 |
| 2008-07-30 | 89.759 |
| 2008-07-31 | 88.337 |
| 2008-08-01 | 87.923 |
| 2008-08-02 | 87.092 |
| 2008-08-03 | 87.345 |
| 2008-08-04 | 88.078 |
| 2008-08-05 | 89.597 |
| 2008-08-06 | 87.822 |
| 2008-08-07 | 86.056 |
| 2008-08-08 | 84.43 |
| 2008-08-09 | 83.39 |
| 2008-08-10 | 81.576 |
| 2008-08-11 | 83.893 |
| 2008-08-12 | 87.005 |
| 2008-08-13 | 86.487 |
| 2008-08-14 | 85.654 |
| 2008-08-15 | 84.504 |
| 2008-08-16 | 84.241 |
| 2008-08-17 | 82.901 |
| 2008-08-18 | 85.054 |
| 2008-08-19 | 85.564 |
| 2008-08-20 | 86.584 |
| 2008-08-21 | 86.802 |
| 2008-08-22 | 86.91 |
| 2008-08-23 | 87.312 |
| 2008-08-24 | 86.981 |
| 2008-08-25 | 87.527 |
| 2008-08-26 | 88.676 |
| 2008-08-27 | 88.854 |
| 2008-08-28 | 89.134 |
| 2008-08-29 | 89.456 |
| 2008-08-30 | 89.023 |
| 2008-08-31 | 88.269 |
| 2008-09-01 | 90.087 |
| 2008-09-02 | 90.325 |
| 2008-09-03 | 90.757 |
| 2008-09-04 | 93 |
| 2008-09-05 | 94.59 |
| 2008-09-06 | 95.562 |
| 2008-09-07 | 96.446 |
| 2008-09-08 | 95.76 |
| 2008-09-09 | 97.469 |
| 2008-09-10 | 94.753 |
| 2008-09-11 | 93.316 |
| 2008-09-12 | 92.762 |
| 2008-09-13 | 92.313 |
| 2008-09-14 | 92.031 |
| 2008-09-15 | 91.812 |
| 2008-09-16 | 94.348 |
| 2008-09-17 | 94.222 |
| 2008-09-18 | 94.252 |
| 2008-09-19 | 91.606 |
| 2008-09-20 | 91.079 |
| 2008-09-21 | 88.778 |
| 2008-09-22 | 88.053 |
| 2008-09-23 | 89.71 |
| 2008-09-24 | 90.741 |
| 2008-09-25 | 91.245 |
| 2008-09-26 | 90.091 |
| 2008-09-27 | 88.659 |
| 2008-09-28 | 87.748 |
| 2008-09-29 | 88.866 |
| 2008-09-30 | 89.218 |
| 2008-10-01 | 87.444 |
| 2008-10-02 | 86.646 |
| 2008-10-03 | 86.557 |
| 2008-10-04 | 83.788 |
| 2008-10-05 | 82.831 |
| 2008-10-06 | 83.554 |
| 2008-10-07 | 82.249 |
| 2008-10-08 | 81.748 |
| 2008-10-09 | 80.271 |
| 2008-10-10 | 81.34 |
| 2008-10-11 | 80.323 |
| 2008-10-12 | 78.656 |
| 2008-10-13 | 79.567 |
| 2008-10-14 | 79.293 |
| 2008-10-15 | 78.695 |
| 2008-10-16 | 75.988 |
| 2008-10-17 | 73.785 |
| 2008-10-18 | 72.529 |
| 2008-10-19 | 71.007 |
| 2008-10-20 | 71.097 |
| 2008-10-21 | 70.974 |
| 2008-10-22 | 70.077 |
| 2008-10-23 | 68.285 |
| 2008-10-24 | 67.459 |
| 2008-10-25 | 64.985 |
| 2008-10-26 | 64.676 |
| 2008-10-27 | 64.295 |
| 2008-10-28 | 65.137 |
| 2008-10-29 | 65.245 |
| 2008-10-30 | 65.606 |
| 2008-10-31 | 65.133 |
| 2008-11-01 | 64.805 |
| 2008-11-02 | 63.469 |
| 2008-11-03 | 63.386 |
| 2008-11-04 | 63.39 |
| 2008-11-05 | 63.025 |
| 2008-11-06 | 64.396 |
| 2008-11-07 | 65.368 |
| 2008-11-08 | 66.207 |
| 2008-11-09 | 65.415 |
| 2008-11-10 | 65.347 |
| 2008-11-11 | 65.602 |
| 2008-11-12 | 64.245 |
| 2008-11-13 | 65.415 |
| 2008-11-14 | 66.42 |
| 2008-11-15 | 66.303 |
| 2008-11-16 | 65.98 |
| 2008-11-17 | 66.652 |
| 2008-11-18 | 68.391 |
| 2008-11-19 | 67.348 |
| 2008-11-20 | 68.168 |
| 2008-11-21 | 70.161 |
| 2008-11-22 | 70.242 |
| 2008-11-23 | 69.144 |
| 2008-11-24 | 70.721 |
| 2008-11-25 | 70.701 |
| 2008-11-26 | 71.264 |
| 2008-11-27 | 73.373 |
| 2008-11-28 | 75.583 |
| 2008-11-29 | 77.652 |
| 2008-11-30 | 79.131 |
| 2008-12-01 | 84.388 |
| 2008-12-02 | 88.399 |
| 2008-12-03 | 89.36 |
| 2008-12-04 | 90.593 |
| 2008-12-05 | 89.818 |
| 2008-12-06 | 89.358 |
| 2008-12-07 | 87.709 |
| 2008-12-08 | 88.103 |
| 2008-12-09 | 90.325 |
| 2008-12-10 | 90.783 |
| 2008-12-11 | 90.981 |
| 2008-12-12 | 92.697 |
| 2008-12-13 | 91.478 |
| 2008-12-14 | 90.853 |
| 2008-12-15 | 92.603 |
| 2008-12-16 | 92.594 |
| 2008-12-17 | 93.027 |
| 2008-12-18 | 92.68 |
| 2008-12-19 | 93.012 |
| 2008-12-20 | 93.024 |
| 2008-12-21 | 91.986 |
| 2008-12-22 | 92.18 |
| 2008-12-23 | 93.216 |
| 2008-12-24 | 93.593 |
| 2008-12-25 | 95.834 |
| 2008-12-26 | 96.081 |
| 2008-12-27 | 93.993 |
| 2008-12-28 | 89.942 |
| 2008-12-29 | 89.978 |
| 2008-12-30 | 92.946 |
| 2008-12-31 | 90.373 |
| 2009-01-01 | 88.797 |
| 2009-01-02 | 88.144 |
| 2009-01-03 | 87.555 |
| 2009-01-04 | 88.199 |
| 2009-01-05 | 89.204 |
| 2009-01-06 | 91.345 |
| 2009-01-07 | 92.929 |
| 2009-01-08 | 92.835 |
| 2009-01-09 | 93.455 |
| 2009-01-10 | 93.559 |
| 2009-01-11 | 91.73 |
| 2009-01-12 | 94.087 |
| 2009-01-13 | 95.381 |
| 2009-01-14 | 96.66 |
| 2009-01-15 | 98.069 |
| 2009-01-16 | 99.886 |
| 2009-01-17 | 99.474 |
| 2009-01-18 | 100.261 |
| 2009-01-19 | 101.516 |
| 2009-01-20 | 101.23 |
| 2009-01-21 | 100.859 |
| 2009-01-22 | 100.708 |
| 2009-01-23 | 99.951 |
| 2009-01-24 | 96.875 |
| 2009-01-25 | 95.496 |
| 2009-01-26 | 95.004 |
| 2009-01-27 | 95.851 |
| 2009-01-28 | 92.485 |
| 2009-01-29 | 88.491 |
| 2009-01-30 | 86.83 |
| 2009-01-31 | 85.133 |
| 2009-02-01 | 83.776 |
| 2009-02-02 | 83.019 |
| 2009-02-03 | 82.499 |
| 2009-02-04 | 81.109 |
| 2009-02-05 | 79.666 |
| 2009-02-06 | 77.63 |
| 2009-02-07 | 75.214 |
| 2009-02-08 | 73.856 |
| 2009-02-09 | 74.012 |
| 2009-02-10 | 74.562 |
| 2009-02-11 | 71.287 |
| 2009-02-12 | 70.542 |
| 2009-02-13 | 68.06 |
| 2009-02-14 | 66.656 |
| 2009-02-15 | 62.964 |
| 2009-02-16 | 63.701 |
| 2009-02-17 | 64.555 |
| 2009-02-18 | 64.067 |
| 2009-02-19 | 64.553 |
| 2009-02-20 | 65.209 |
| 2009-02-21 | 65.251 |
| 2009-02-22 | 64.858 |
| 2009-02-23 | 66.734 |
| 2009-02-24 | 68.364 |
| 2009-02-25 | 67.981 |
| 2009-02-26 | 68.269 |
| 2009-02-27 | 68.176 |
| 2009-02-28 | 67.54 |
| 2009-03-01 | 66.37 |
| 2009-03-02 | 68.027 |
| 2009-03-03 | 70.712 |
| 2009-03-04 | 72.612 |
| 2009-03-05 | 72.336 |
| 2009-03-06 | 72.252 |
| 2009-03-07 | 71.994 |
| 2009-03-08 | 70.867 |
| 2009-03-09 | 72.275 |
| 2009-03-10 | 72.66 |
| 2009-03-11 | 73.718 |
| 2009-03-12 | 72.654 |
| 2009-03-13 | 73.183 |
| 2009-03-14 | 71.637 |
| 2009-03-15 | 71.495 |
| 2009-03-16 | 71.684 |
| 2009-03-17 | 72.103 |
| 2009-03-18 | 71.178 |
| 2009-03-19 | 69.727 |
| 2009-03-20 | 68.278 |
| 2009-03-21 | 67.7 |
| 2009-03-22 | 67.727 |
| 2009-03-23 | 68.556 |
| 2009-03-24 | 69.825 |
| 2009-03-25 | 70.084 |
| 2009-03-26 | 70.003 |
| 2009-03-27 | 70.613 |
| 2009-03-28 | 70.248 |
| 2009-03-29 | 70.367 |
| 2009-03-30 | 71.683 |
| 2009-03-31 | 73.015 |
| 2009-04-01 | 71.912 |
| 2009-04-02 | 71.499 |
| 2009-04-03 | 70.586 |
| 2009-04-04 | 70.895 |
| 2009-04-05 | 70.674 |
| 2009-04-06 | 73.288 |
| 2009-04-07 | 75.059 |
| 2009-04-08 | 74.275 |
| 2009-04-09 | 76.017 |
| 2009-04-10 | 75.223 |
| 2009-04-11 | 77.151 |
| 2009-04-12 | 77.973 |
| 2009-04-13 | 80.556 |
| 2009-04-14 | 84.628 |
| 2009-04-15 | 85.756 |
| 2009-04-16 | 88 |
| 2009-04-17 | 88.761 |
| 2009-04-18 | 88.67 |
| 2009-04-19 | 87.733 |
| 2009-04-20 | 88.827 |
| 2009-04-21 | 88.645 |
| 2009-04-22 | 87.947 |
| 2009-04-23 | 87.024 |
| 2009-04-24 | 85.116 |
| 2009-04-25 | 85.043 |
| 2009-04-26 | 84.126 |
| 2009-04-27 | 85.285 |
| 2009-04-28 | 86.372 |
| 2009-04-29 | 86.099 |
| 2009-04-30 | 85.958 |
| 2009-05-01 | 84.958 |
| 2009-05-02 | 83.755 |
| 2009-05-03 | 82.889 |
| 2009-05-04 | 83.582 |
| 2009-05-05 | 85.483 |
| 2009-05-06 | 84.489 |
| 2009-05-07 | 83.766 |
| 2009-05-08 | 83.605 |
| 2009-05-09 | 81.249 |
| 2009-05-10 | 79.703 |
| 2009-05-11 | 80.037 |
| 2009-05-12 | 80.425 |
| 2009-05-13 | 78.688 |
| 2009-05-14 | 75.551 |
| 2009-05-15 | 74.158 |
| 2009-05-16 | 72.099 |
| 2009-05-17 | 71.707 |
| 2009-05-18 | 74.652 |
| 2009-05-19 | 78.841 |
| 2009-05-20 | 78.991 |
| 2009-05-21 | 80.318 |
| 2009-05-22 | 80.693 |
| 2009-05-23 | 80.286 |
| 2009-05-24 | 81.447 |
| 2009-05-25 | 82.903 |
| 2009-05-26 | 86.151 |
| 2009-05-27 | 87.56 |
| 2009-05-28 | 88.789 |
| 2009-05-29 | 90.041 |
| 2009-05-30 | 90.639 |
| 2009-05-31 | 92.388 |
| 2009-06-01 | 92.922 |
| 2009-06-02 | 94.571 |
| 2009-06-03 | 94.263 |
| 2009-06-04 | 92.824 |
| 2009-06-05 | 92.713 |
| 2009-06-06 | 92.312 |
| 2009-06-07 | 92.088 |
| 2009-06-08 | 93.261 |
| 2009-06-09 | 94.448 |
| 2009-06-10 | 92.496 |
| 2009-06-11 | 92.87 |
| 2009-06-12 | 93.552 |
| 2009-06-13 | 93.292 |
| 2009-06-14 | 93.695 |
| 2009-06-15 | 95.987 |
| 2009-06-16 | 97.78 |
| 2009-06-17 | 95.103 |
| 2009-06-18 | 94.736 |
| 2009-06-19 | 94.689 |
| 2009-06-20 | 93.388 |
| 2009-06-21 | 93.024 |
| 2009-06-22 | 93.715 |
| 2009-06-23 | 93.381 |
| 2009-06-24 | 91.288 |
| 2009-06-25 | 88.525 |
| 2009-06-26 | 85.606 |
| 2009-06-27 | 83.718 |
| 2009-06-28 | 82.102 |
| 2009-06-29 | 80.988 |
| 2009-06-30 | 81.252 |
| 2009-07-01 | 81.02 |
| 2009-07-02 | 79.324 |
| 2009-07-03 | 80.878 |
| 2009-07-04 | 80.399 |
| 2009-07-05 | 78.836 |
| 2009-07-06 | 80.565 |
| 2009-07-07 | 81.966 |
| 2009-07-08 | 81.602 |
| 2009-07-09 | 82.224 |
| 2009-07-10 | 82.792 |
| 2009-07-11 | 81.586 |
| 2009-07-12 | 80.47 |
| 2009-07-13 | 80.911 |
| 2009-07-14 | 81.508 |
| 2009-07-15 | 79.933 |
| 2009-07-16 | 77.631 |
| 2009-07-17 | 78.79 |
| 2009-07-18 | 77.477 |
| 2009-07-19 | 76.665 |
| 2009-07-20 | 76.642 |
| 2009-07-21 | 76.612 |
| 2009-07-22 | 76.718 |
| 2009-07-23 | 77.507 |
| 2009-07-24 | 80.015 |
| 2009-07-25 | 79.361 |
| 2009-07-26 | 79.669 |
| 2009-07-27 | 80.168 |
| 2009-07-28 | 81.896 |
| 2009-07-29 | 83.342 |
| 2009-07-30 | 81.71 |
| 2009-07-31 | 81.177 |
| 2009-08-01 | 80.263 |
| 2009-08-02 | 77.423 |
| 2009-08-03 | 78.972 |
| 2009-08-04 | 79.93 |
| 2009-08-05 | 79.192 |
| 2009-08-06 | 77.858 |
| 2009-08-07 | 78.979 |
| 2009-08-08 | 78.565 |
| 2009-08-09 | 77.729 |
| 2009-08-10 | 77.534 |
| 2009-08-11 | 78.244 |
| 2009-08-12 | 78.437 |
| 2009-08-13 | 77.064 |
| 2009-08-14 | 76.867 |
| 2009-08-15 | 77.016 |
| 2009-08-16 | 75.519 |
| 2009-08-17 | 76.103 |
| 2009-08-18 | 76.036 |
| 2009-08-19 | 77.642 |
| 2009-08-20 | 78.416 |
| 2009-08-21 | 77.716 |
| 2009-08-22 | 76.379 |
| 2009-08-23 | 74.069 |
| 2009-08-24 | 75.076 |
| 2009-08-25 | 75.365 |
| 2009-08-26 | 75.362 |
| 2009-08-27 | 72.864 |
| 2009-08-28 | 71.813 |
| 2009-08-29 | 73.752 |
| 2009-08-30 | 74.05 |
| 2009-08-31 | 75.165 |
| 2009-09-01 | 75.541 |
| 2009-09-02 | 74.358 |
| 2009-09-03 | 73.059 |
| 2009-09-04 | 73.01 |
| 2009-09-05 | 72.842 |
| 2009-09-06 | 71.44 |
| 2009-09-07 | 71.924 |
| 2009-09-08 | 73.118 |
| 2009-09-09 | 73.014 |
| 2009-09-10 | 73.76 |
| 2009-09-11 | 73.319 |
| 2009-09-12 | 74.394 |
| 2009-09-13 | 74.236 |
| 2009-09-14 | 74.848 |
| 2009-09-15 | 75.98 |
| 2009-09-16 | 75.311 |
| 2009-09-17 | 75.393 |
| 2009-09-18 | 77.357 |
| 2009-09-19 | 77.349 |
| 2009-09-20 | 77.064 |
| 2009-09-21 | 78.215 |
| 2009-09-22 | 79.793 |
| 2009-09-23 | 79.105 |
| 2009-09-24 | 79.735 |
| 2009-09-25 | 81.492 |
| 2009-09-26 | 85.055 |
| 2009-09-27 | 85.978 |
| 2009-09-28 | 86.155 |
| 2009-09-29 | 88.098 |
| 2009-09-30 | 91.13 |
| 2009-10-01 | 93.719 |
| 2009-10-02 | 94.845 |
| 2009-10-03 | 95.692 |
| 2009-10-04 | 95.001 |
| 2009-10-05 | 96.663 |
| 2009-10-06 | 97.598 |
| 2009-10-07 | 97.363 |
| 2009-10-08 | 97.468 |
| 2009-10-09 | 97.881 |
| 2009-10-10 | 98.007 |
| 2009-10-11 | 98.962 |
| 2009-10-12 | 99.579 |
| 2009-10-13 | 100.846 |
| 2009-10-14 | 101.881 |
| 2009-10-15 | 100.773 |
| 2009-10-16 | 101.504 |
| 2009-10-17 | 101.688 |
| 2009-10-18 | 98.46 |
| 2009-10-19 | 99.423 |
| 2009-10-20 | 100.579 |
| 2009-10-21 | 100.832 |
| 2009-10-22 | 100.139 |
| 2009-10-23 | 101.136 |
| 2009-10-24 | 101.023 |
| 2009-10-25 | 99.011 |
| 2009-10-26 | 96.932 |
| 2009-10-27 | 96.463 |
| 2009-10-28 | 95.994 |
| 2009-10-29 | 94.004 |
| 2009-10-30 | 91.441 |
| 2009-10-31 | 88.988 |
| 2009-11-01 | 87.091 |
| 2009-11-02 | 86.769 |
| 2009-11-03 | 88.562 |
| 2009-11-04 | 87.253 |
| 2009-11-05 | 86.053 |
| 2009-11-06 | 85.87 |
| 2009-11-07 | 85.253 |
| 2009-11-08 | 84.411 |
| 2009-11-09 | 84.382 |
| 2009-11-10 | 83.895 |
| 2009-11-11 | 84.665 |
| 2009-11-12 | 83.822 |
| 2009-11-13 | 83.423 |
| 2009-11-14 | 83.405 |
| 2009-11-15 | 81.879 |
| 2009-11-16 | 82.389 |
| 2009-11-17 | 83.54 |
| 2009-11-18 | 81.5 |
| 2009-11-19 | 81.932 |
| 2009-11-20 | 81.465 |
| 2009-11-21 | 80.544 |
| 2009-11-22 | 79.172 |
| 2009-11-23 | 79.378 |
| 2009-11-24 | 80.061 |
| 2009-11-25 | 80.678 |
| 2009-11-26 | 80.388 |
| 2009-11-27 | 79.034 |
| 2009-11-28 | 79.283 |
| 2009-11-29 | 79.02 |
| 2009-11-30 | 81.03 |
| 2009-12-01 | 82.413 |
| 2009-12-02 | 84.643 |
| 2009-12-03 | 84.456 |
| 2009-12-04 | 84.913 |
| 2009-12-05 | 85.448 |
| 2009-12-06 | 84.191 |
| 2009-12-07 | 85.198 |
| 2009-12-08 | 86.958 |
| 2009-12-09 | 86.054 |
| 2009-12-10 | 84.915 |
| 2009-12-11 | 83.702 |
| 2009-12-12 | 83.743 |
| 2009-12-13 | 83.445 |
| 2009-12-14 | 84.542 |
| 2009-12-15 | 85.486 |
| 2009-12-16 | 86.156 |
| 2009-12-17 | 84.264 |
| 2009-12-18 | 84.721 |
| 2009-12-19 | 84.209 |
| 2009-12-20 | 83.978 |
| 2009-12-21 | 83.99 |
| 2009-12-22 | 83.762 |
| 2009-12-23 | 82.512 |
| 2009-12-24 | 82.291 |
| 2009-12-25 | 81.643 |
| 2009-12-26 | 84.16 |
| 2009-12-27 | 85.765 |
| 2009-12-28 | 89.061 |
| 2009-12-29 | 93.509 |
| 2009-12-30 | 95.173 |
| 2009-12-31 | 95.982 |
| 2010-01-01 | 98.196 |
| 2010-01-02 | 97.965 |
| 2010-01-03 | 97.977 |
| 2010-01-04 | 101.14 |
| 2010-01-05 | 103.739 |
| 2010-01-06 | 105.751 |
| 2010-01-07 | 105.864 |
| 2010-01-08 | 107.265 |
| 2010-01-09 | 107.012 |
| 2010-01-10 | 107.053 |
| 2010-01-11 | 107.118 |
| 2010-01-12 | 108.34 |
| 2010-01-13 | 109.376 |
| 2010-01-14 | 109.192 |
| 2010-01-15 | 108.403 |
| 2010-01-16 | 107.929 |
| 2010-01-17 | 107.186 |
| 2010-01-18 | 106.953 |
| 2010-01-19 | 107.712 |
| 2010-01-20 | 108.213 |
| 2010-01-21 | 109.713 |
| 2010-01-22 | 109.252 |
| 2010-01-23 | 108.964 |
| 2010-01-24 | 108.091 |
| 2010-01-25 | 106.887 |
| 2010-01-26 | 105.798 |
| 2010-01-27 | 102.094 |
| 2010-01-28 | 99.087 |
| 2010-01-29 | 95.57 |
| 2010-01-30 | 94.352 |
| 2010-01-31 | 90.127 |
| 2010-02-01 | 91.25 |
| 2010-02-02 | 91.402 |
| 2010-02-03 | 89.278 |
| 2010-02-04 | 89.507 |
| 2010-02-05 | 87.191 |
| 2010-02-06 | 85.876 |
| 2010-02-07 | 84.02 |
| 2010-02-08 | 84.913 |
| 2010-02-09 | 84.606 |
| 2010-02-10 | 85.837 |
| 2010-02-11 | 85.136 |
| 2010-02-12 | 83.649 |
| 2010-02-13 | 82.461 |
| 2010-02-14 | 81.139 |
| 2010-02-15 | 82.633 |
| 2010-02-16 | 85.32 |
| 2010-02-17 | 85.456 |
| 2010-02-18 | 84.342 |
| 2010-02-19 | 85.512 |
| 2010-02-20 | 84.395 |
| 2010-02-21 | 85.254 |
| 2010-02-22 | 84.6 |
| 2010-02-23 | 85.634 |
| 2010-02-24 | 84.608 |
| 2010-02-25 | 83.615 |
| 2010-02-26 | 84.136 |
| 2010-02-27 | 81.821 |
| 2010-02-28 | 81.115 |
| 2010-03-01 | 80.559 |
| 2010-03-02 | 80.742 |
| 2010-03-03 | 78.071 |
| 2010-03-04 | 77.579 |
| 2010-03-05 | 76.667 |
| 2010-03-06 | 75.096 |
| 2010-03-07 | 73.894 |
| 2010-03-08 | 76.016 |
| 2010-03-09 | 77.151 |
| 2010-03-10 | 77.403 |
| 2010-03-11 | 78.253 |
| 2010-03-12 | 77.5 |
| 2010-03-13 | 75.962 |
| 2010-03-14 | 74.571 |
| 2010-03-15 | 76.538 |
| 2010-03-16 | 77.16 |
| 2010-03-17 | 76.866 |
| 2010-03-18 | 75.413 |
| 2010-03-19 | 75.587 |
| 2010-03-20 | 75.002 |
| 2010-03-21 | 72.221 |
| 2010-03-22 | 72.265 |
| 2010-03-23 | 72.432 |
| 2010-03-24 | 72.443 |
| 2010-03-25 | 71.363 |
| 2010-03-26 | 70.368 |
| 2010-03-27 | 70.706 |
| 2010-03-28 | 69.222 |
| 2010-03-29 | 69.751 |
| 2010-03-30 | 72.936 |
| 2010-03-31 | 73.081 |
| 2010-04-01 | 73.498 |
| 2010-04-02 | 75.425 |
| 2010-04-03 | 76.02 |
| 2010-04-04 | 76.301 |
| 2010-04-05 | 76.61 |
| 2010-04-06 | 78.483 |
| 2010-04-07 | 78.872 |
| 2010-04-08 | 80.566 |
| 2010-04-09 | 83.184 |
| 2010-04-10 | 82.397 |
| 2010-04-11 | 81.11 |
| 2010-04-12 | 83.455 |
| 2010-04-13 | 86.696 |
| 2010-04-14 | 86.416 |
| 2010-04-15 | 88.288 |
| 2010-04-16 | 87.994 |
| 2010-04-17 | 86.663 |
| 2010-04-18 | 86.184 |
| 2010-04-19 | 88.355 |
| 2010-04-20 | 91.271 |
| 2010-04-21 | 91.272 |
| 2010-04-22 | 90.526 |
| 2010-04-23 | 91.272 |
| 2010-04-24 | 91.648 |
| 2010-04-25 | 91.336 |
| 2010-04-26 | 91.371 |
| 2010-04-27 | 92.483 |
| 2010-04-28 | 91.917 |
| 2010-04-29 | 89.413 |
| 2010-04-30 | 88.625 |
| 2010-05-01 | 86.611 |
| 2010-05-02 | 83.33 |
| 2010-05-03 | 84.939 |
| 2010-05-04 | 86.106 |
| 2010-05-05 | 85.868 |
| 2010-05-06 | 84.432 |
| 2010-05-07 | 82.383 |
| 2010-05-08 | 79.452 |
| 2010-05-09 | 75.953 |
| 2010-05-10 | 76.19 |
| 2010-05-11 | 77.662 |
| 2010-05-12 | 75.181 |
| 2010-05-13 | 72.54 |
| 2010-05-14 | 72.66 |
| 2010-05-15 | 71.404 |
| 2010-05-16 | 71.493 |
| 2010-05-17 | 74.162 |
| 2010-05-18 | 76.449 |
| 2010-05-19 | 78.007 |
| 2010-05-20 | 77.707 |
| 2010-05-21 | 80.121 |
| 2010-05-22 | 81.653 |
| 2010-05-23 | 80.801 |
| 2010-05-24 | 81.82 |
| 2010-05-25 | 83.491 |
| 2010-05-26 | 84.772 |
| 2010-05-27 | 85.185 |
| 2010-05-28 | 86.728 |
| 2010-05-29 | 87.134 |
| 2010-05-30 | 86.702 |
| 2010-05-31 | 89.008 |
| 2010-06-01 | 93.759 |
| 2010-06-02 | 94.909 |
| 2010-06-03 | 94.971 |
| 2010-06-04 | 95.418 |
| 2010-06-05 | 96.19 |
| 2010-06-06 | 95.845 |
| 2010-06-07 | 99.136 |
| 2010-06-08 | 101.069 |
| 2010-06-09 | 100.97 |
| 2010-06-10 | 102.837 |
| 2010-06-11 | 104.648 |
| 2010-06-12 | 104.034 |
| 2010-06-13 | 103.776 |
| 2010-06-14 | 104.204 |
| 2010-06-15 | 105.306 |
| 2010-06-16 | 104.087 |
| 2010-06-17 | 102.548 |
| 2010-06-18 | 101.272 |
| 2010-06-19 | 99.105 |
| 2010-06-20 | 96.958 |
| 2010-06-21 | 96.452 |
| 2010-06-22 | 98.858 |
| 2010-06-23 | 98.424 |
| 2010-06-24 | 98.069 |
| 2010-06-25 | 96.377 |
| 2010-06-26 | 95.569 |
| 2010-06-27 | 93.594 |
| 2010-06-28 | 93.687 |
| 2010-06-29 | 96.474 |
| 2010-06-30 | 96.347 |
| 2010-07-01 | 93.968 |
| 2010-07-02 | 90.039 |
| 2010-07-03 | 87.166 |
| 2010-07-04 | 84.916 |
| 2010-07-05 | 83.148 |
| 2010-07-06 | 84.643 |
| 2010-07-07 | 82.762 |
| 2010-07-08 | 83.519 |
| 2010-07-09 | 83.282 |
| 2010-07-10 | 80.523 |
| 2010-07-11 | 78.966 |
| 2010-07-12 | 78.761 |
| 2010-07-13 | 80.321 |
| 2010-07-14 | 82.572 |
| 2010-07-15 | 83.262 |
| 2010-07-16 | 81.828 |
| 2010-07-17 | 80.066 |
| 2010-07-18 | 77.781 |
| 2010-07-19 | 78.51 |
| 2010-07-20 | 79.202 |
| 2010-07-21 | 79.538 |
| 2010-07-22 | 77.36 |
| 2010-07-23 | 77.066 |
| 2010-07-24 | 75.822 |
| 2010-07-25 | 75.889 |
| 2010-07-26 | 78.39 |
| 2010-07-27 | 80.673 |
| 2010-07-28 | 81.53 |
| 2010-07-29 | 79.918 |
| 2010-07-30 | 79.203 |
| 2010-07-31 | 78.897 |
| 2010-08-01 | 79.77 |
| 2010-08-02 | 82.194 |
| 2010-08-03 | 84.935 |
| 2010-08-04 | 86.945 |
| 2010-08-05 | 86.087 |
| 2010-08-06 | 85.117 |
| 2010-08-07 | 82.197 |
| 2010-08-08 | 82.826 |
| 2010-08-09 | 82.282 |
| 2010-08-10 | 83.046 |
| 2010-08-11 | 84.386 |
| 2010-08-12 | 82.507 |
| 2010-08-13 | 79.03 |
| 2010-08-14 | 76.444 |
| 2010-08-15 | 76.981 |
| 2010-08-16 | 78.003 |
| 2010-08-17 | 79.108 |
| 2010-08-18 | 80.349 |
| 2010-08-19 | 80.605 |
| 2010-08-20 | 79.198 |
| 2010-08-21 | 79.68 |
| 2010-08-22 | 79.601 |
| 2010-08-23 | 80.419 |
| 2010-08-24 | 81.869 |
| 2010-08-25 | 80.69 |
| 2010-08-26 | 80.174 |
| 2010-08-27 | 79.899 |
| 2010-08-28 | 80.13 |
| 2010-08-29 | 79.83 |
| 2010-08-30 | 80.228 |
| 2010-08-31 | 81.326 |
| 2010-09-01 | 80.557 |
| 2010-09-02 | 78.827 |
| 2010-09-03 | 78.215 |
| 2010-09-04 | 77.233 |
| 2010-09-05 | 76.333 |
| 2010-09-06 | 76.331 |
| 2010-09-07 | 77.282 |
| 2010-09-08 | 78.587 |
| 2010-09-09 | 77.548 |
| 2010-09-10 | 78.131 |
| 2010-09-11 | 76.066 |
| 2010-09-12 | 75.764 |
| 2010-09-13 | 76.604 |
| 2010-09-14 | 77.211 |
| 2010-09-15 | 77.083 |
| 2010-09-16 | 76.341 |
| 2010-09-17 | 75.691 |
| 2010-09-18 | 74.494 |
| 2010-09-19 | 74.99 |
| 2010-09-20 | 74.647 |
| 2010-09-21 | 75.63 |
| 2010-09-22 | 75.326 |
| 2010-09-23 | 74.485 |
| 2010-09-24 | 74.282 |
| 2010-09-25 | 73.568 |
| 2010-09-26 | 72.53 |
| 2010-09-27 | 73.309 |
| 2010-09-28 | 74.087 |
| 2010-09-29 | 73.616 |
| 2010-09-30 | 71.824 |
| 2010-10-01 | 71.362 |
| 2010-10-02 | 70.24 |
| 2010-10-03 | 69.054 |
| 2010-10-04 | 69.703 |
| 2010-10-05 | 72.154 |
| 2010-10-06 | 73.689 |
| 2010-10-07 | 73.369 |
| 2010-10-08 | 72.704 |
| 2010-10-09 | 73.033 |
| 2010-10-10 | 71.984 |
| 2010-10-11 | 73.601 |
| 2010-10-12 | 74.25 |
| 2010-10-13 | 73.614 |
| 2010-10-14 | 73.526 |
| 2010-10-15 | 73.818 |
| 2010-10-16 | 73.289 |
| 2010-10-17 | 72.884 |
| 2010-10-18 | 71.895 |
| 2010-10-19 | 72.274 |
| 2010-10-20 | 72.258 |
| 2010-10-21 | 70.333 |
| 2010-10-22 | 70.254 |
| 2010-10-23 | 68.94 |
| 2010-10-24 | 68.003 |
| 2010-10-25 | 67.61 |
| 2010-10-26 | 66.962 |
| 2010-10-27 | 66.638 |
| 2010-10-28 | 65.523 |
| 2010-10-29 | 65.366 |
| 2010-10-30 | 66.324 |
| 2010-10-31 | 65.046 |
| 2010-11-01 | 68.496 |
| 2010-11-02 | 71.329 |
| 2010-11-03 | 71.54 |
| 2010-11-04 | 70.49 |
| 2010-11-05 | 69.039 |
| 2010-11-06 | 67.514 |
| 2010-11-07 | 67.443 |
| 2010-11-08 | 68.668 |
| 2010-11-09 | 71.21 |
| 2010-11-10 | 71.515 |
| 2010-11-11 | 72.285 |
| 2010-11-12 | 73.051 |
| 2010-11-13 | 72.062 |
| 2010-11-14 | 72.03 |
| 2010-11-15 | 74.543 |
| 2010-11-16 | 76.012 |
| 2010-11-17 | 77.577 |
| 2010-11-18 | 77.253 |
| 2010-11-19 | 78.391 |
| 2010-11-20 | 79.698 |
| 2010-11-21 | 81.52 |
| 2010-11-22 | 83.936 |
| 2010-11-23 | 84.412 |
| 2010-11-24 | 88.279 |
| 2010-11-25 | 89.843 |
| 2010-11-26 | 88.867 |
| 2010-11-27 | 89.219 |
| 2010-11-28 | 88.878 |
| 2010-11-29 | 90.908 |
| 2010-11-30 | 95.604 |
| 2010-12-01 | 94.389 |
| 2010-12-02 | 93.374 |
| 2010-12-03 | 93.529 |
| 2010-12-04 | 93.825 |
| 2010-12-05 | 93.417 |
| 2010-12-06 | 95.152 |
| 2010-12-07 | 97.248 |
| 2010-12-08 | 96.418 |
| 2010-12-09 | 94.989 |
| 2010-12-10 | 94.385 |
| 2010-12-11 | 93.218 |
| 2010-12-12 | 93.046 |
| 2010-12-13 | 93.87 |
| 2010-12-14 | 93.755 |
| 2010-12-15 | 92.145 |
| 2010-12-16 | 92.653 |
| 2010-12-17 | 93.636 |
| 2010-12-18 | 93.822 |
| 2010-12-19 | 93.349 |
| 2010-12-20 | 94.881 |
| 2010-12-21 | 96.119 |
| 2010-12-22 | 97.808 |
| 2010-12-23 | 99.385 |
| 2010-12-24 | 98.043 |
| 2010-12-25 | 99.371 |
| 2010-12-26 | 100.991 |
| 2010-12-27 | 101.693 |
| 2010-12-28 | 103.913 |
| 2010-12-29 | 100.38 |
| 2010-12-30 | 99.645 |
| 2010-12-31 | 98.022 |
| 2011-01-01 | 97.459 |
| 2011-01-02 | 96.606 |
| 2011-01-03 | 96.125 |
| 2011-01-04 | 98.676 |
| 2011-01-05 | 96.472 |
| 2011-01-06 | 94.678 |
| 2011-01-07 | 94.908 |
| 2011-01-08 | 94.68 |
| 2011-01-09 | 95.421 |
| 2011-01-10 | 96.872 |
| 2011-01-11 | 97.504 |
| 2011-01-12 | 97.561 |
| 2011-01-13 | 97.364 |
| 2011-01-14 | 97.173 |
| 2011-01-15 | 94.986 |
| 2011-01-16 | 92.502 |
| 2011-01-17 | 92.905 |
| 2011-01-18 | 91.82 |
| 2011-01-19 | 89.633 |
| 2011-01-20 | 86.376 |
| 2011-01-21 | 83.881 |
| 2011-01-22 | 81.768 |
| 2011-01-23 | 79.979 |
| 2011-01-24 | 79.168 |
| 2011-01-25 | 82.477 |
| 2011-01-26 | 83.353 |
| 2011-01-27 | 81.156 |
| 2011-01-28 | 81.709 |
| 2011-01-29 | 78.452 |
| 2011-01-30 | 78.487 |
| 2011-01-31 | 78.692 |
| 2011-02-01 | 80.598 |
| 2011-02-02 | 81.419 |
| 2011-02-03 | 81.22 |
| 2011-02-04 | 82.889 |
| 2011-02-05 | 82.624 |
| 2011-02-06 | 81.884 |
| 2011-02-07 | 81.143 |
| 2011-02-08 | 80.248 |
| 2011-02-09 | 79.929 |
| 2011-02-10 | 80.42 |
| 2011-02-11 | 81.197 |
| 2011-02-12 | 81.135 |
| 2011-02-13 | 81.231 |
| 2011-02-14 | 81.422 |
| 2011-02-15 | 82.186 |
| 2011-02-16 | 81.206 |
| 2011-02-17 | 82.254 |
| 2011-02-18 | 82.381 |
| 2011-02-19 | 82.96 |
| 2011-02-20 | 82.05 |
| 2011-02-21 | 83.64 |
| 2011-02-22 | 86.672 |
| 2011-02-23 | 85.554 |
| 2011-02-24 | 83.548 |
| 2011-02-25 | 84.348 |
| 2011-02-26 | 86.331 |
| 2011-02-27 | 86.081 |
| 2011-02-28 | 87.535 |
| 2011-03-01 | 91.953 |
| 2011-03-02 | 93.206 |
| 2011-03-03 | 94.436 |
| 2011-03-04 | 95.129 |
| 2011-03-05 | 94.282 |
| 2011-03-06 | 92.823 |
| 2011-03-07 | 95.242 |
| 2011-03-08 | 99.03 |
| 2011-03-09 | 103.693 |
| 2011-03-10 | 106.35 |
| 2011-03-11 | 108.023 |
| 2011-03-12 | 107.659 |
| 2011-03-13 | 107.856 |
| 2011-03-14 | 108.799 |
| 2011-03-15 | 111.199 |
| 2011-03-16 | 114.192 |
| 2011-03-17 | 116.213 |
| 2011-03-18 | 119.066 |
| 2011-03-19 | 120.569 |
| 2011-03-20 | 121.548 |
| 2011-03-21 | 124.046 |
| 2011-03-22 | 128.421 |
| 2011-03-23 | 132.497 |
| 2011-03-24 | 131.859 |
| 2011-03-25 | 133.774 |
| 2011-03-26 | 132.416 |
| 2011-03-27 | 131.215 |
| 2011-03-28 | 131.338 |
| 2011-03-29 | 135.812 |
| 2011-03-30 | 136.408 |
| 2011-03-31 | 134.65 |
| 2011-04-01 | 134.612 |
| 2011-04-02 | 131.639 |
| 2011-04-03 | 130.052 |
| 2011-04-04 | 129.52 |
| 2011-04-05 | 131.272 |
| 2011-04-06 | 130.994 |
| 2011-04-07 | 127.948 |
| 2011-04-08 | 124.124 |
| 2011-04-09 | 121.313 |
| 2011-04-10 | 119.231 |
| 2011-04-11 | 119.416 |
| 2011-04-12 | 118.91 |
| 2011-04-13 | 119.695 |
| 2011-04-14 | 118.657 |
| 2011-04-15 | 116.006 |
| 2011-04-16 | 114.372 |
| 2011-04-17 | 110.451 |
| 2011-04-18 | 108.899 |
| 2011-04-19 | 108.926 |
| 2011-04-20 | 106.572 |
| 2011-04-21 | 104.061 |
| 2011-04-22 | 99.071 |
| 2011-04-23 | 96.71 |
| 2011-04-24 | 95.476 |
| 2011-04-25 | 94.64 |
| 2011-04-26 | 96.05 |
| 2011-04-27 | 95.812 |
| 2011-04-28 | 92.952 |
| 2011-04-29 | 91.076 |
| 2011-04-30 | 90.672 |
| 2011-05-01 | 88.793 |
| 2011-05-02 | 90.443 |
| 2011-05-03 | 97.016 |
| 2011-05-04 | 98.386 |
| 2011-05-05 | 98.312 |
| 2011-05-06 | 97.458 |
| 2011-05-07 | 98.984 |
| 2011-05-08 | 97.89 |
| 2011-05-09 | 100.359 |
| 2011-05-10 | 102.576 |
| 2011-05-11 | 102.244 |
| 2011-05-12 | 101.998 |
| 2011-05-13 | 102.084 |
| 2011-05-14 | 100.175 |
| 2011-05-15 | 100.424 |
| 2011-05-16 | 101.089 |
| 2011-05-17 | 102.571 |
| 2011-05-18 | 102.517 |
| 2011-05-19 | 104.304 |
| 2011-05-20 | 104.327 |
| 2011-05-21 | 102.588 |
| 2011-05-22 | 102.7 |
| 2011-05-23 | 104.235 |
| 2011-05-24 | 105.595 |
| 2011-05-25 | 106.959 |
| 2011-05-26 | 105.612 |
| 2011-05-27 | 104.603 |
| 2011-05-28 | 103.243 |
| 2011-05-29 | 103.357 |
| 2011-05-30 | 103.289 |
| 2011-05-31 | 105.64 |
| 2011-06-01 | 105.002 |
| 2011-06-02 | 98.907 |
| 2011-06-03 | 97.373 |
| 2011-06-04 | 95.791 |
| 2011-06-05 | 94.893 |
| 2011-06-06 | 92.96 |
| 2011-06-07 | 94.782 |
| 2011-06-08 | 94.652 |
| 2011-06-09 | 93.336 |
| 2011-06-10 | 93.399 |
| 2011-06-11 | 92.455 |
| 2011-06-12 | 92.114 |
| 2011-06-13 | 93.86 |
| 2011-06-14 | 92.162 |
| 2011-06-15 | 91.984 |
| 2011-06-16 | 93.346 |
| 2011-06-17 | 93.099 |
| 2011-06-18 | 90.335 |
| 2011-06-19 | 89.796 |
| 2011-06-20 | 90.088 |
| 2011-06-21 | 89.898 |
| 2011-06-22 | 87.769 |
| 2011-06-23 | 87.567 |
| 2011-06-24 | 87.431 |
| 2011-06-25 | 86.454 |
| 2011-06-26 | 85.755 |
| 2011-06-27 | 87.046 |
| 2011-06-28 | 86.842 |
| 2011-06-29 | 85.824 |
| 2011-06-30 | 84.537 |
| 2011-07-01 | 84.293 |
| 2011-07-02 | 83.18 |
| 2011-07-03 | 84.233 |
| 2011-07-04 | 84.787 |
| 2011-07-05 | 84.99 |
| 2011-07-06 | 84.294 |
| 2011-07-07 | 83.848 |
| 2011-07-08 | 81.956 |
| 2011-07-09 | 80.808 |
| 2011-07-10 | 80.585 |
| 2011-07-11 | 81.662 |
| 2011-07-12 | 80.727 |
| 2011-07-13 | 80.299 |
| 2011-07-14 | 81.351 |
| 2011-07-15 | 81.675 |
| 2011-07-16 | 79.53 |
| 2011-07-17 | 78.913 |
| 2011-07-18 | 79.096 |
| 2011-07-19 | 81.134 |
| 2011-07-20 | 81.733 |
| 2011-07-21 | 82.112 |
| 2011-07-22 | 82.324 |
| 2011-07-23 | 80.773 |
| 2011-07-24 | 78.052 |
| 2011-07-25 | 78.372 |
| 2011-07-26 | 79.01 |
| 2011-07-27 | 78.35 |
| 2011-07-28 | 79.543 |
| 2011-07-29 | 80.007 |
| 2011-07-30 | 79.121 |
| 2011-07-31 | 77.934 |
| 2011-08-01 | 79.106 |
| 2011-08-02 | 78.835 |
| 2011-08-03 | 79.377 |
| 2011-08-04 | 79.149 |
| 2011-08-05 | 79.497 |
| 2011-08-06 | 77.416 |
| 2011-08-07 | 77.732 |
| 2011-08-08 | 78.661 |
| 2011-08-09 | 77.967 |
| 2011-08-10 | 76.607 |
| 2011-08-11 | 77.125 |
| 2011-08-12 | 76.337 |
| 2011-08-13 | 75.38 |
| 2011-08-14 | 73.651 |
| 2011-08-15 | 76.314 |
| 2011-08-16 | 76.151 |
| 2011-08-17 | 75.019 |
| 2011-08-18 | 74.45 |
| 2011-08-19 | 75.368 |
| 2011-08-20 | 76.055 |
| 2011-08-21 | 75.296 |
| 2011-08-22 | 77.343 |
| 2011-08-23 | 82.82 |
| 2011-08-24 | 85.347 |
| 2011-08-25 | 85.917 |
| 2011-08-26 | 86.086 |
| 2011-08-27 | 85.616 |
| 2011-08-28 | 84.286 |
| 2011-08-29 | 85.964 |
| 2011-08-30 | 86.235 |
| 2011-08-31 | 86.335 |
| 2011-09-01 | 86.34 |
| 2011-09-02 | 86.961 |
| 2011-09-03 | 87.439 |
| 2011-09-04 | 87.516 |
| 2011-09-05 | 90.602 |
| 2011-09-06 | 92.727 |
| 2011-09-07 | 92.496 |
| 2011-09-08 | 93.707 |
| 2011-09-09 | 95.253 |
| 2011-09-10 | 95.4 |
| 2011-09-11 | 94.861 |
| 2011-09-12 | 96.994 |
| 2011-09-13 | 99.404 |
| 2011-09-14 | 97.648 |
| 2011-09-15 | 98.677 |
| 2011-09-16 | 99.805 |
| 2011-09-17 | 98.471 |
| 2011-09-18 | 96.279 |
| 2011-09-19 | 94.459 |
| 2011-09-20 | 95.492 |
| 2011-09-21 | 94.113 |
| 2011-09-22 | 90.328 |
| 2011-09-23 | 88.107 |
| 2011-09-24 | 86.381 |
| 2011-09-25 | 84.573 |
| 2011-09-26 | 84.089 |
| 2011-09-27 | 85.134 |
| 2011-09-28 | 82.823 |
| 2011-09-29 | 83.901 |
| 2011-09-30 | 83.145 |
| 2011-10-01 | 82.86 |
| 2011-10-02 | 80.598 |
| 2011-10-03 | 80.62 |
| 2011-10-04 | 81.264 |
| 2011-10-05 | 79.353 |
| 2011-10-06 | 77.617 |
| 2011-10-07 | 77.171 |
| 2011-10-08 | 75.457 |
| 2011-10-09 | 73.729 |
| 2011-10-10 | 72.381 |
| 2011-10-11 | 73.451 |
| 2011-10-12 | 74.354 |
| 2011-10-13 | 75.154 |
| 2011-10-14 | 75.006 |
| 2011-10-15 | 74.453 |
| 2011-10-16 | 73.836 |
| 2011-10-17 | 74.737 |
| 2011-10-18 | 76.752 |
| 2011-10-19 | 76.569 |
| 2011-10-20 | 76.617 |
| 2011-10-21 | 76.899 |
| 2011-10-22 | 76.236 |
| 2011-10-23 | 75.53 |
| 2011-10-24 | 76.816 |
| 2011-10-25 | 78.25 |
| 2011-10-26 | 77.952 |
| 2011-10-27 | 76.855 |
| 2011-10-28 | 76.709 |
| 2011-10-29 | 75.2 |
| 2011-10-30 | 74.914 |
| 2011-10-31 | 74.936 |
| 2011-11-01 | 76.358 |
| 2011-11-02 | 74.545 |
| 2011-11-03 | 75.772 |
| 2011-11-04 | 77.284 |
| 2011-11-05 | 76.426 |
| 2011-11-06 | 75.005 |
| 2011-11-07 | 75.591 |
| 2011-11-08 | 77.05 |
| 2011-11-09 | 78.964 |
| 2011-11-10 | 78.797 |
| 2011-11-11 | 76.447 |
| 2011-11-12 | 73.651 |
| 2011-11-13 | 73.745 |
| 2011-11-14 | 74.639 |
| 2011-11-15 | 76.636 |
| 2011-11-16 | 76.203 |
| 2011-11-17 | 76.013 |
| 2011-11-18 | 77.944 |
| 2011-11-19 | 78.065 |
| 2011-11-20 | 76.328 |
| 2011-11-21 | 77.904 |
| 2011-11-22 | 77.45 |
| 2011-11-23 | 77.648 |
| 2011-11-24 | 77.159 |
| 2011-11-25 | 77.785 |
| 2011-11-26 | 77.648 |
| 2011-11-27 | 79.702 |
| 2011-11-28 | 81.602 |
| 2011-11-29 | 83.199 |
| 2011-11-30 | 83.25 |
| 2011-12-01 | 84.047 |
| 2011-12-02 | 86.271 |
| 2011-12-03 | 85.147 |
| 2011-12-04 | 83.379 |
| 2011-12-05 | 84.59 |
| 2011-12-06 | 85.993 |
| 2011-12-07 | 85.468 |
| 2011-12-08 | 85.624 |
| 2011-12-09 | 84.253 |
| 2011-12-10 | 82.663 |
| 2011-12-11 | 81.569 |
| 2011-12-12 | 83.152 |
| 2011-12-13 | 83.582 |
| 2011-12-14 | 84.164 |
| 2011-12-15 | 83.102 |
| 2011-12-16 | 84.282 |
| 2011-12-17 | 82.266 |
| 2011-12-18 | 80.926 |
| 2011-12-19 | 81.274 |
| 2011-12-20 | 85.335 |
| 2011-12-21 | 84.288 |
| 2011-12-22 | 85.125 |
| 2011-12-23 | 84.235 |
| 2011-12-24 | 85.094 |
| 2011-12-25 | 84.421 |
| 2011-12-26 | 86.2 |
| 2011-12-27 | 84.708 |
| 2011-12-28 | 84.083 |
| 2011-12-29 | 84.344 |
| 2011-12-30 | 85.732 |
| 2011-12-31 | 84.179 |
| 2012-01-01 | 83.117 |
| 2012-01-02 | 82.564 |
| 2012-01-03 | 83.552 |
| 2012-01-04 | 82.881 |
| 2012-01-05 | 83.165 |
| 2012-01-06 | 84.857 |
| 2012-01-07 | 84.412 |
| 2012-01-08 | 83.881 |
| 2012-01-09 | 85.743 |
| 2012-01-10 | 86.833 |
| 2012-01-11 | 86.979 |
| 2012-01-12 | 87.452 |
| 2012-01-13 | 86.954 |
| 2012-01-14 | 87.632 |
| 2012-01-15 | 85.447 |
| 2012-01-16 | 86.269 |
| 2012-01-17 | 85.861 |
| 2012-01-18 | 85.451 |
| 2012-01-19 | 82.883 |
| 2012-01-20 | 82.576 |
| 2012-01-21 | 81.811 |
| 2012-01-22 | 80.592 |
| 2012-01-23 | 81.122 |
| 2012-01-24 | 82.475 |
| 2012-01-25 | 81.22 |
| 2012-01-26 | 81.802 |
| 2012-01-27 | 80.86 |
| 2012-01-28 | 78.722 |
| 2012-01-29 | 75.799 |
| 2012-01-30 | 78.165 |
| 2012-01-31 | 78.084 |
| 2012-02-01 | 80.579 |
| 2012-02-02 | 79.57 |
| 2012-02-03 | 80.438 |
| 2012-02-04 | 79.888 |
| 2012-02-05 | 77.881 |
| 2012-02-06 | 79.587 |
| 2012-02-07 | 82.496 |
| 2012-02-08 | 82.291 |
| 2012-02-09 | 82.929 |
| 2012-02-10 | 81.741 |
| 2012-02-11 | 79.98 |
| 2012-02-12 | 78.223 |
| 2012-02-13 | 76.865 |
| 2012-02-14 | 77.768 |
| 2012-02-15 | 79.63 |
| 2012-02-16 | 80.469 |
| 2012-02-17 | 79.667 |
| 2012-02-18 | 79.251 |
| 2012-02-19 | 78.302 |
| 2012-02-20 | 81.291 |
| 2012-02-21 | 84.701 |
| 2012-02-22 | 84.421 |
| 2012-02-23 | 83.247 |
| 2012-02-24 | 86.151 |
| 2012-02-25 | 87.75 |
| 2012-02-26 | 87.522 |
| 2012-02-27 | 87.642 |
| 2012-02-28 | 90.153 |
| 2012-02-29 | 90.769 |
| 2012-03-01 | 91.485 |
| 2012-03-02 | 90.311 |
| 2012-03-03 | 90.743 |
| 2012-03-04 | 90.459 |
| 2012-03-05 | 92.145 |
| 2012-03-06 | 94.492 |
| 2012-03-07 | 94.934 |
| 2012-03-08 | 95.306 |
| 2012-03-09 | 96.977 |
| 2012-03-10 | 94.949 |
| 2012-03-11 | 94.208 |
| 2012-03-12 | 94.89 |
| 2012-03-13 | 95.533 |
| 2012-03-14 | 95.777 |
| 2012-03-15 | 95.261 |
| 2012-03-16 | 93.395 |
| 2012-03-17 | 92.445 |
| 2012-03-18 | 91.839 |
| 2012-03-19 | 92.382 |
| 2012-03-20 | 94.453 |
| 2012-03-21 | 93.595 |
| 2012-03-22 | 91.132 |
| 2012-03-23 | 90.871 |
| 2012-03-24 | 90.305 |
| 2012-03-25 | 86.929 |
| 2012-03-26 | 85.126 |
| 2012-03-27 | 87.287 |
| 2012-03-28 | 90.439 |
| 2012-03-29 | 89.435 |
| 2012-03-30 | 87.974 |
| 2012-03-31 | 87.967 |
| 2012-04-01 | 89.368 |
| 2012-04-02 | 92.158 |
| 2012-04-03 | 93.492 |
| 2012-04-04 | 93.811 |
| 2012-04-05 | 94.014 |
| 2012-04-06 | 92.35 |
| 2012-04-07 | 90.263 |
| 2012-04-08 | 88.404 |
| 2012-04-09 | 91.802 |
| 2012-04-10 | 94.137 |
| 2012-04-11 | 94.61 |
| 2012-04-12 | 97.011 |
| 2012-04-13 | 98.464 |
| 2012-04-14 | 99.072 |
| 2012-04-15 | 98.537 |
| 2012-04-16 | 101.325 |
| 2012-04-17 | 104.197 |
| 2012-04-18 | 103.939 |
| 2012-04-19 | 102.622 |
| 2012-04-20 | 101.822 |
| 2012-04-21 | 101.178 |
| 2012-04-22 | 100.084 |
| 2012-04-23 | 101.389 |
| 2012-04-24 | 102.786 |
| 2012-04-25 | 102.928 |
| 2012-04-26 | 103.006 |
| 2012-04-27 | 100.836 |
| 2012-04-28 | 99.188 |
| 2012-04-29 | 98.084 |
| 2012-04-30 | 98.371 |
| 2012-05-01 | 96.151 |
| 2012-05-02 | 93.921 |
| 2012-05-03 | 92.83 |
| 2012-05-04 | 90.702 |
| 2012-05-05 | 88.104 |
| 2012-05-06 | 86.01 |
| 2012-05-07 | 84.972 |
| 2012-05-08 | 85.236 |
| 2012-05-09 | 82.827 |
| 2012-05-10 | 80.803 |
| 2012-05-11 | 81.623 |
| 2012-05-12 | 78.098 |
| 2012-05-13 | 76.135 |
| 2012-05-14 | 75.56 |
| 2012-05-15 | 76.759 |
| 2012-05-16 | 74.43 |
| 2012-05-17 | 72.301 |
| 2012-05-18 | 73.897 |
| 2012-05-19 | 74.313 |
| 2012-05-20 | 73.421 |
| 2012-05-21 | 73.78 |
| 2012-05-22 | 75.622 |
| 2012-05-23 | 75.478 |
| 2012-05-24 | 76.147 |
| 2012-05-25 | 76.079 |
| 2012-05-26 | 74.029 |
| 2012-05-27 | 72.77 |
| 2012-05-28 | 76.887 |
| 2012-05-29 | 77.592 |
| 2012-05-30 | 77.206 |
| 2012-05-31 | 77.764 |
| 2012-06-01 | 77.108 |
| 2012-06-02 | 75.341 |
| 2012-06-03 | 73.699 |
| 2012-06-04 | 73.755 |
| 2012-06-05 | 75.15 |
| 2012-06-06 | 75.466 |
| 2012-06-07 | 76.08 |
| 2012-06-08 | 77.357 |
| 2012-06-09 | 78.493 |
| 2012-06-10 | 76.828 |
| 2012-06-11 | 78.41 |
| 2012-06-12 | 79.681 |
| 2012-06-13 | 80.795 |
| 2012-06-14 | 81.455 |
| 2012-06-15 | 81.066 |
| 2012-06-16 | 81.231 |
| 2012-06-17 | 78.646 |
| 2012-06-18 | 79.487 |
| 2012-06-19 | 80.754 |
| 2012-06-20 | 83.714 |
| 2012-06-21 | 82.291 |
| 2012-06-22 | 81.82 |
| 2012-06-23 | 79.536 |
| 2012-06-24 | 78.817 |
| 2012-06-25 | 80.244 |
| 2012-06-26 | 83.016 |
| 2012-06-27 | 79.379 |
| 2012-06-28 | 79.41 |
| 2012-06-29 | 79.136 |
| 2012-06-30 | 77.591 |
| 2012-07-01 | 75.98 |
| 2012-07-02 | 75.865 |
| 2012-07-03 | 78.013 |
| 2012-07-04 | 80.971 |
| 2012-07-05 | 81.484 |
| 2012-07-06 | 81.243 |
| 2012-07-07 | 79.837 |
| 2012-07-08 | 77.7 |
| 2012-07-09 | 77.505 |
| 2012-07-10 | 78.745 |
| 2012-07-11 | 78.443 |
| 2012-07-12 | 77.576 |
| 2012-07-13 | 77.857 |
| 2012-07-14 | 76.792 |
| 2012-07-15 | 76.553 |
| 2012-07-16 | 76.399 |
| 2012-07-17 | 79.274 |
| 2012-07-18 | 79.329 |
| 2012-07-19 | 80.535 |
| 2012-07-20 | 81.151 |
| 2012-07-21 | 80.071 |
| 2012-07-22 | 79.608 |
| 2012-07-23 | 80.8 |
| 2012-07-24 | 82.446 |
| 2012-07-25 | 82.01 |
| 2012-07-26 | 80.226 |
| 2012-07-27 | 80.855 |
| 2012-07-28 | 79.801 |
| 2012-07-29 | 79.514 |
| 2012-07-30 | 81.745 |
| 2012-07-31 | 83.263 |
| 2012-08-01 | 84.01 |
| 2012-08-02 | 83.188 |
| 2012-08-03 | 81.351 |
| 2012-08-04 | 80.106 |
| 2012-08-05 | 79.788 |
| 2012-08-06 | 81.083 |
| 2012-08-07 | 83.943 |
| 2012-08-08 | 83.663 |
| 2012-08-09 | 83.326 |
| 2012-08-10 | 83.857 |
| 2012-08-11 | 83.401 |
| 2012-08-12 | 81.94 |
| 2012-08-13 | 82.254 |
| 2012-08-14 | 84.283 |
| 2012-08-15 | 85.626 |
| 2012-08-16 | 83.621 |
| 2012-08-17 | 83.616 |
| 2012-08-18 | 80.328 |
| 2012-08-19 | 75.938 |
| 2012-08-20 | 76.883 |
| 2012-08-21 | 77.459 |
| 2012-08-22 | 78.896 |
| 2012-08-23 | 77.778 |
| 2012-08-24 | 77.206 |
| 2012-08-25 | 75.621 |
| 2012-08-26 | 75.16 |
| 2012-08-27 | 75.919 |
| 2012-08-28 | 75.994 |
| 2012-08-29 | 74.417 |
| 2012-08-30 | 75.054 |
| 2012-08-31 | 75.105 |
| 2012-09-01 | 74.953 |
| 2012-09-02 | 74.614 |
| 2012-09-03 | 75.019 |
| 2012-09-04 | 76.027 |
| 2012-09-05 | 75.43 |
| 2012-09-06 | 73.441 |
| 2012-09-07 | 73.257 |
| 2012-09-08 | 72.448 |
| 2012-09-09 | 71.812 |
| 2012-09-10 | 72.282 |
| 2012-09-11 | 72.795 |
| 2012-09-12 | 73.103 |
| 2012-09-13 | 71.661 |
| 2012-09-14 | 71.051 |
| 2012-09-15 | 69.51 |
| 2012-09-16 | 68.537 |
| 2012-09-17 | 69.966 |
| 2012-09-18 | 71.574 |
| 2012-09-19 | 71.043 |
| 2012-09-20 | 70.274 |
| 2012-09-21 | 68.41 |
| 2012-09-22 | 66.81 |
| 2012-09-23 | 66.212 |
| 2012-09-24 | 67.26 |
| 2012-09-25 | 67.976 |
| 2012-09-26 | 68.113 |
| 2012-09-27 | 69.211 |
| 2012-09-28 | 70.038 |
| 2012-09-29 | 69.298 |
| 2012-09-30 | 68.972 |
| 2012-10-01 | 69.102 |
| 2012-10-02 | 69.678 |
| 2012-10-03 | 69.889 |
| 2012-10-04 | 69.511 |
| 2012-10-05 | 69.72 |
| 2012-10-06 | 69.53 |
| 2012-10-07 | 68.517 |
| 2012-10-08 | 69.498 |
| 2012-10-09 | 70.898 |
| 2012-10-10 | 70.835 |
| 2012-10-11 | 71.163 |
| 2012-10-12 | 70.566 |
| 2012-10-13 | 70.863 |
| 2012-10-14 | 69.871 |
| 2012-10-15 | 72.55 |
| 2012-10-16 | 72.711 |
| 2012-10-17 | 72.825 |
| 2012-10-18 | 73.725 |
| 2012-10-19 | 75.417 |
| 2012-10-20 | 76.041 |
| 2012-10-21 | 76.533 |
| 2012-10-22 | 81.039 |
| 2012-10-23 | 82.864 |
| 2012-10-24 | 83.332 |
| 2012-10-25 | 83.833 |
| 2012-10-26 | 83.187 |
| 2012-10-27 | 81.299 |
| 2012-10-28 | 79.992 |
| 2012-10-29 | 81.832 |
| 2012-10-30 | 82.165 |
| 2012-10-31 | 82.935 |
| 2012-11-01 | 82.01 |
| 2012-11-02 | 81.723 |
| 2012-11-03 | 81.374 |
| 2012-11-04 | 80.292 |
| 2012-11-05 | 80.704 |
| 2012-11-06 | 83.711 |
| 2012-11-07 | 82.078 |
| 2012-11-08 | 80.456 |
| 2012-11-09 | 80.705 |
| 2012-11-10 | 79.535 |
| 2012-11-11 | 78.549 |
| 2012-11-12 | 79.669 |
| 2012-11-13 | 80.162 |
| 2012-11-14 | 77.732 |
| 2012-11-15 | 78.286 |
| 2012-11-16 | 78.372 |
| 2012-11-17 | 78.389 |
| 2012-11-18 | 77.566 |
| 2012-11-19 | 79.077 |
| 2012-11-20 | 80.842 |
| 2012-11-21 | 79.269 |
| 2012-11-22 | 79.773 |
| 2012-11-23 | 81.38 |
| 2012-11-24 | 80.466 |
| 2012-11-25 | 79.895 |
| 2012-11-26 | 81.913 |
| 2012-11-27 | 82.463 |
| 2012-11-28 | 80.402 |
| 2012-11-29 | 79.984 |
| 2012-11-30 | 79.751 |
| 2012-12-01 | 79.182 |
| 2012-12-02 | 79.795 |
| 2012-12-03 | 79.991 |
| 2012-12-04 | 81.54 |
| 2012-12-05 | 82.319 |
| 2012-12-06 | 79.317 |
| 2012-12-07 | 81.438 |
| 2012-12-08 | 81.496 |
| 2012-12-09 | 79.803 |
| 2012-12-10 | 79.998 |
| 2012-12-11 | 81.863 |
| 2012-12-12 | 81.872 |
| 2012-12-13 | 83.027 |
| 2012-12-14 | 84.621 |
| 2012-12-15 | 83.306 |
| 2012-12-16 | 81.957 |
| 2012-12-17 | 81.197 |
| 2012-12-18 | 81.236 |
| 2012-12-19 | 80.758 |
| 2012-12-20 | 78.981 |
| 2012-12-21 | 77.677 |
| 2012-12-22 | 75.646 |
| 2012-12-23 | 73.82 |
| 2012-12-24 | 74.714 |
| 2012-12-25 | 76.536 |
| 2012-12-26 | 74.715 |
| 2012-12-27 | 74.54 |
| 2012-12-28 | 76.158 |
| 2012-12-29 | 75.799 |
| 2012-12-30 | 75.82 |
| 2012-12-31 | 76.253 |
| 2013-01-01 | 77.694 |
| 2013-01-02 | 78.19 |
| 2013-01-03 | 77.405 |
| 2013-01-04 | 77.254 |
| 2013-01-05 | 77.771 |
| 2013-01-06 | 74.919 |
| 2013-01-07 | 75.672 |
| 2013-01-08 | 77.785 |
| 2013-01-09 | 78.134 |
| 2013-01-10 | 76.365 |
| 2013-01-11 | 75.91 |
| 2013-01-12 | 75.527 |
| 2013-01-13 | 73.9 |
| 2013-01-14 | 74.581 |
| 2013-01-15 | 76.824 |
| 2013-01-16 | 77.105 |
| 2013-01-17 | 78.627 |
| 2013-01-18 | 80.113 |
| 2013-01-19 | 80.913 |
| 2013-01-20 | 81.893 |
| 2013-01-21 | 83.924 |
| 2013-01-22 | 86.704 |
| 2013-01-23 | 87.623 |
| 2013-01-24 | 87.395 |
| 2013-01-25 | 89.684 |
| 2013-01-26 | 89.808 |
| 2013-01-27 | 88.663 |
| 2013-01-28 | 91.165 |
| 2013-01-29 | 90.104 |
| 2013-01-30 | 91.459 |
| 2013-01-31 | 89.354 |
| 2013-02-01 | 91.081 |
| 2013-02-02 | 89.763 |
| 2013-02-03 | 89.175 |
| 2013-02-04 | 90.097 |
| 2013-02-05 | 92.088 |
| 2013-02-06 | 92.362 |
| 2013-02-07 | 92.072 |
| 2013-02-08 | 92.783 |
| 2013-02-09 | 93.662 |
| 2013-02-10 | 93.998 |
| 2013-02-11 | 94.462 |
| 2013-02-12 | 95.637 |
| 2013-02-13 | 98.948 |
| 2013-02-14 | 97.659 |
| 2013-02-15 | 96.9 |
| 2013-02-16 | 94.91 |
| 2013-02-17 | 92.652 |
| 2013-02-18 | 91.212 |
| 2013-02-19 | 91.432 |
| 2013-02-20 | 90.276 |
| 2013-02-21 | 86.346 |
| 2013-02-22 | 85.152 |
| 2013-02-23 | 83.124 |
| 2013-02-24 | 80.288 |
| 2013-02-25 | 79.752 |
| 2013-02-26 | 81.244 |
| 2013-02-27 | 81.174 |
| 2013-02-28 | 82.142 |
| 2013-03-01 | 81.028 |
| 2013-03-02 | 80.274 |
| 2013-03-03 | 77.154 |
| 2013-03-04 | 77.371 |
| 2013-03-05 | 78.142 |
| 2013-03-06 | 78.383 |
| 2013-03-07 | 78.646 |
| 2013-03-08 | 78.659 |
| 2013-03-09 | 78.008 |
| 2013-03-10 | 76.854 |
| 2013-03-11 | 76.508 |
| 2013-03-12 | 76.093 |
| 2013-03-13 | 76.293 |
| 2013-03-14 | 74.92 |
| 2013-03-15 | 71.912 |
| 2013-03-16 | 71.955 |
| 2013-03-17 | 71.352 |
| 2013-03-18 | 72.72 |
| 2013-03-19 | 72.825 |
| 2013-03-20 | 73.139 |
| 2013-03-21 | 72.226 |
| 2013-03-22 | 72.981 |
| 2013-03-23 | 73.741 |
| 2013-03-24 | 73.035 |
| 2013-03-25 | 75.206 |
| 2013-03-26 | 76.82 |
| 2013-03-27 | 78.516 |
| 2013-03-28 | 76.613 |
| 2013-03-29 | 76.813 |
| 2013-03-30 | 76.584 |
| 2013-03-31 | 75.393 |
| 2013-04-01 | 77.677 |
| 2013-04-02 | 78.741 |
| 2013-04-03 | 79.799 |
| 2013-04-04 | 81.06 |
| 2013-04-05 | 81.38 |
| 2013-04-06 | 80.913 |
| 2013-04-07 | 80.843 |
| 2013-04-08 | 83.024 |
| 2013-04-09 | 83.855 |
| 2013-04-10 | 84.574 |
| 2013-04-11 | 83.31 |
| 2013-04-12 | 83.073 |
| 2013-04-13 | 84.025 |
| 2013-04-14 | 82.383 |
| 2013-04-15 | 82.977 |
| 2013-04-16 | 84.76 |
| 2013-04-17 | 86.307 |
| 2013-04-18 | 86.323 |
| 2013-04-19 | 86.946 |
| 2013-04-20 | 87.249 |
| 2013-04-21 | 85.769 |
| 2013-04-22 | 89.406 |
| 2013-04-23 | 92.517 |
| 2013-04-24 | 92.572 |
| 2013-04-25 | 92.195 |
| 2013-04-26 | 92.127 |
| 2013-04-27 | 92.551 |
| 2013-04-28 | 91.05 |
| 2013-04-29 | 92.057 |
| 2013-04-30 | 93.844 |
| 2013-05-01 | 92.823 |
| 2013-05-02 | 92.757 |
| 2013-05-03 | 92.929 |
| 2013-05-04 | 90.693 |
| 2013-05-05 | 89.441 |
| 2013-05-06 | 89.878 |
| 2013-05-07 | 89.637 |
| 2013-05-08 | 88.406 |
| 2013-05-09 | 87.841 |
| 2013-05-10 | 86.806 |
| 2013-05-11 | 87.35 |
| 2013-05-12 | 85.737 |
| 2013-05-13 | 85.745 |
| 2013-05-14 | 87.391 |
| 2013-05-15 | 85.364 |
| 2013-05-16 | 84.734 |
| 2013-05-17 | 83.137 |
| 2013-05-18 | 81.918 |
| 2013-05-19 | 82.329 |
| 2013-05-20 | 83.272 |
| 2013-05-21 | 84.277 |
| 2013-05-22 | 81.33 |
| 2013-05-23 | 79.583 |
| 2013-05-24 | 79.601 |
| 2013-05-25 | 80.35 |
| 2013-05-26 | 78.156 |
| 2013-05-27 | 80.037 |
| 2013-05-28 | 82.616 |
| 2013-05-29 | 83.241 |
| 2013-05-30 | 83.927 |
| 2013-05-31 | 83.867 |
| 2013-06-01 | 83.653 |
| 2013-06-02 | 82.615 |
| 2013-06-03 | 82.825 |
| 2013-06-04 | 84.43 |
| 2013-06-05 | 83.439 |
| 2013-06-06 | 83.358 |
| 2013-06-07 | 85.744 |
| 2013-06-08 | 86.185 |
| 2013-06-09 | 87.067 |
| 2013-06-10 | 87.956 |
| 2013-06-11 | 90.539 |
| 2013-06-12 | 90.61 |
| 2013-06-13 | 90.455 |
| 2013-06-14 | 91.634 |
| 2013-06-15 | 91.928 |
| 2013-06-16 | 91.404 |
| 2013-06-17 | 94.85 |
| 2013-06-18 | 95.54 |
| 2013-06-19 | 95.32 |
| 2013-06-20 | 95.186 |
| 2013-06-21 | 95.083 |
| 2013-06-22 | 93.136 |
| 2013-06-23 | 91.005 |
| 2013-06-24 | 90.699 |
| 2013-06-25 | 92.474 |
| 2013-06-26 | 91.489 |
| 2013-06-27 | 87.54 |
| 2013-06-28 | 85.25 |
| 2013-06-29 | 82.596 |
| 2013-06-30 | 82.58 |
| 2013-07-01 | 82.842 |
| 2013-07-02 | 84.731 |
| 2013-07-03 | 85.464 |
| 2013-07-04 | 84.378 |
| 2013-07-05 | 84.687 |
| 2013-07-06 | 83.452 |
| 2013-07-07 | 80.519 |
| 2013-07-08 | 80.84 |
| 2013-07-09 | 81.221 |
| 2013-07-10 | 80.87 |
| 2013-07-11 | 79.235 |
| 2013-07-12 | 79.042 |
| 2013-07-13 | 78.133 |
| 2013-07-14 | 78.578 |
| 2013-07-15 | 79.487 |
| 2013-07-16 | 79.842 |
| 2013-07-17 | 78.779 |
| 2013-07-18 | 76.484 |
| 2013-07-19 | 75.392 |
| 2013-07-20 | 74.008 |
| 2013-07-21 | 73.011 |
| 2013-07-22 | 74.196 |
| 2013-07-23 | 75.324 |
| 2013-07-24 | 73.973 |
| 2013-07-25 | 72.93 |
| 2013-07-26 | 72.625 |
| 2013-07-27 | 72.485 |
| 2013-07-28 | 74.109 |
| 2013-07-29 | 76.985 |
| 2013-07-30 | 77.97 |
| 2013-07-31 | 77.252 |
| 2013-08-01 | 75.19 |
| 2013-08-02 | 73.814 |
| 2013-08-03 | 73.42 |
| 2013-08-04 | 72.988 |
| 2013-08-05 | 74.399 |
| 2013-08-06 | 74.31 |
| 2013-08-07 | 75.668 |
| 2013-08-08 | 75.548 |
| 2013-08-09 | 75.35 |
| 2013-08-10 | 75.221 |
| 2013-08-11 | 73.441 |
| 2013-08-12 | 74.44 |
| 2013-08-13 | 73.952 |
| 2013-08-14 | 71.169 |
| 2013-08-15 | 70.339 |
| 2013-08-16 | 68.045 |
| 2013-08-17 | 68.668 |
| 2013-08-18 | 69.201 |
| 2013-08-19 | 71.311 |
| 2013-08-20 | 73.063 |
| 2013-08-21 | 72.539 |
| 2013-08-22 | 71.998 |
| 2013-08-23 | 73.623 |
| 2013-08-24 | 74.699 |
| 2013-08-25 | 74.096 |
| 2013-08-26 | 76.603 |
| 2013-08-27 | 78.823 |
| 2013-08-28 | 80.107 |
| 2013-08-29 | 83.154 |
| 2013-08-30 | 85.555 |
| 2013-08-31 | 90.277 |
| 2013-09-01 | 92.446 |
| 2013-09-02 | 93.741 |
| 2013-09-03 | 95.428 |
| 2013-09-04 | 94.242 |
| 2013-09-05 | 95.03 |
| 2013-09-06 | 94.943 |
| 2013-09-07 | 93.751 |
| 2013-09-08 | 93.251 |
| 2013-09-09 | 94.524 |
| 2013-09-10 | 96.025 |
| 2013-09-11 | 96.883 |
| 2013-09-12 | 96.808 |
| 2013-09-13 | 98.572 |
| 2013-09-14 | 98.634 |
| 2013-09-15 | 99.179 |
| 2013-09-16 | 100.969 |
| 2013-09-17 | 101.401 |
| 2013-09-18 | 100.402 |
| 2013-09-19 | 99.138 |
| 2013-09-20 | 100.087 |
| 2013-09-21 | 100.332 |
| 2013-09-22 | 99.766 |
| 2013-09-23 | 102.359 |
| 2013-09-24 | 105.843 |
| 2013-09-25 | 106.337 |
| 2013-09-26 | 105.488 |
| 2013-09-27 | 105.188 |
| 2013-09-28 | 101.979 |
| 2013-09-29 | 100.451 |
| 2013-09-30 | 98.078 |
| 2013-10-01 | 98.882 |
| 2013-10-02 | 97.58 |
| 2013-10-03 | 95.401 |
| 2013-10-04 | 97.127 |
| 2013-10-05 | 95.338 |
| 2013-10-06 | 94.421 |
| 2013-10-07 | 96.605 |
| 2013-10-08 | 97.525 |
| 2013-10-09 | 96.732 |
| 2013-10-10 | 96.431 |
| 2013-10-11 | 94.96 |
| 2013-10-12 | 93.724 |
| 2013-10-13 | 91.224 |
| 2013-10-14 | 91.476 |
| 2013-10-15 | 92.726 |
| 2013-10-16 | 90.681 |
| 2013-10-17 | 89.047 |
| 2013-10-18 | 88.701 |
| 2013-10-19 | 88.757 |
| 2013-10-20 | 87.459 |
| 2013-10-21 | 89.724 |
| 2013-10-22 | 89.375 |
| 2013-10-23 | 86.829 |
| 2013-10-24 | 83.053 |
| 2013-10-25 | 80.584 |
| 2013-10-26 | 78.207 |
| 2013-10-27 | 75.911 |
| 2013-10-28 | 75.309 |
| 2013-10-29 | 74.952 |
| 2013-10-30 | 74.011 |
| 2013-10-31 | 71.592 |
| 2013-11-01 | 71.562 |
| 2013-11-02 | 72.389 |
| 2013-11-03 | 71.315 |
| 2013-11-04 | 71.963 |
| 2013-11-05 | 70.669 |
| 2013-11-06 | 69.036 |
| 2013-11-07 | 67.694 |
| 2013-11-08 | 68.786 |
| 2013-11-09 | 70.357 |
| 2013-11-10 | 69.312 |
| 2013-11-11 | 71.05 |
| 2013-11-12 | 73.308 |
| 2013-11-13 | 71.974 |
| 2013-11-14 | 71.875 |
| 2013-11-15 | 72.76 |
| 2013-11-16 | 71.631 |
| 2013-11-17 | 70.798 |
| 2013-11-18 | 71.57 |
| 2013-11-19 | 72.98 |
| 2013-11-20 | 71.225 |
| 2013-11-21 | 70.942 |
| 2013-11-22 | 70.549 |
| 2013-11-23 | 70.385 |
| 2013-11-24 | 70.654 |
| 2013-11-25 | 74.207 |
| 2013-11-26 | 78.348 |
| 2013-11-27 | 78.155 |
| 2013-11-28 | 77.887 |
| 2013-11-29 | 77.483 |
| 2013-11-30 | 76.75 |
| 2013-12-01 | 75.072 |
| 2013-12-02 | 74.163 |
| 2013-12-03 | 74.568 |
| 2013-12-04 | 76.035 |
| 2013-12-05 | 75.528 |
| 2013-12-06 | 74.655 |
| 2013-12-07 | 74.354 |
| 2013-12-08 | 73.076 |
| 2013-12-09 | 71.776 |
| 2013-12-10 | 72.646 |
| 2013-12-11 | 71.851 |
| 2013-12-12 | 70.838 |
| 2013-12-13 | 70.837 |
| 2013-12-14 | 69.35 |
| 2013-12-15 | 67.377 |
| 2013-12-16 | 67.766 |
| 2013-12-17 | 70.042 |
| 2013-12-18 | 71.026 |
| 2013-12-19 | 70.132 |
| 2013-12-20 | 70.959 |
| 2013-12-21 | 71.026 |
| 2013-12-22 | 70.844 |
| 2013-12-23 | 70.562 |
| 2013-12-24 | 71.123 |
| 2013-12-25 | 68.73 |
| 2013-12-26 | 66 |
| 2013-12-27 | 67.586 |
| 2013-12-28 | 68.527 |
| 2013-12-29 | 67.513 |
| 2013-12-30 | 68.527 |
| 2013-12-31 | 72.107 |
| 2014-01-01 | 74.587 |
| 2014-01-02 | 74.593 |
| 2014-01-03 | 75.215 |
| 2014-01-04 | 74.805 |
| 2014-01-05 | 75.326 |
| 2014-01-06 | 77.291 |
| 2014-01-07 | 77.603 |
| 2014-01-08 | 78.534 |
| 2014-01-09 | 78.546 |
| 2014-01-10 | 79.517 |
| 2014-01-11 | 78.998 |
| 2014-01-12 | 77.726 |
| 2014-01-13 | 79.529 |
| 2014-01-14 | 81.46 |
| 2014-01-15 | 83.004 |
| 2014-01-16 | 81.164 |
| 2014-01-17 | 79.569 |
| 2014-01-18 | 79.429 |
| 2014-01-19 | 78.607 |
| 2014-01-20 | 79.326 |
| 2014-01-21 | 81.126 |
| 2014-01-22 | 82.275 |
| 2014-01-23 | 81.791 |
| 2014-01-24 | 82.245 |
| 2014-01-25 | 80.821 |
| 2014-01-26 | 80.039 |
| 2014-01-27 | 80.686 |
| 2014-01-28 | 81.317 |
| 2014-01-29 | 81.255 |
| 2014-01-30 | 78.717 |
| 2014-01-31 | 77.502 |
| 2014-02-01 | 75.988 |
| 2014-02-02 | 74.245 |
| 2014-02-03 | 78.388 |
| 2014-02-04 | 77.934 |
| 2014-02-05 | 77.529 |
| 2014-02-06 | 75.935 |
| 2014-02-07 | 74.829 |
| 2014-02-08 | 74.222 |
| 2014-02-09 | 73.395 |
| 2014-02-10 | 73.838 |
| 2014-02-11 | 76.193 |
| 2014-02-12 | 74.551 |
| 2014-02-13 | 73.766 |
| 2014-02-14 | 72.895 |
| 2014-02-15 | 73.153 |
| 2014-02-16 | 72.68 |
| 2014-02-17 | 73.389 |
| 2014-02-18 | 73.843 |
| 2014-02-19 | 73.821 |
| 2014-02-20 | 73.513 |
| 2014-02-21 | 74.667 |
| 2014-02-22 | 73.591 |
| 2014-02-23 | 71.328 |
| 2014-02-24 | 71.571 |
| 2014-02-25 | 70.569 |
| 2014-02-26 | 69.443 |
| 2014-02-27 | 69.486 |
| 2014-02-28 | 69.622 |
| 2014-03-01 | 71.503 |
| 2014-03-02 | 73.431 |
| 2014-03-03 | 78.209 |
| 2014-03-04 | 83.122 |
| 2014-03-05 | 85.031 |
| 2014-03-06 | 88.067 |
| 2014-03-07 | 90.531 |
| 2014-03-08 | 90.831 |
| 2014-03-09 | 92.239 |
| 2014-03-10 | 94.752 |
| 2014-03-11 | 96.194 |
| 2014-03-12 | 98.491 |
| 2014-03-13 | 98.732 |
| 2014-03-14 | 100.203 |
| 2014-03-15 | 101.19 |
| 2014-03-16 | 102.733 |
| 2014-03-17 | 104.956 |
| 2014-03-18 | 109.733 |
| 2014-03-19 | 112.022 |
| 2014-03-20 | 112.116 |
| 2014-03-21 | 113.203 |
| 2014-03-22 | 111.837 |
| 2014-03-23 | 110.771 |
| 2014-03-24 | 113.88 |
| 2014-03-25 | 117.282 |
| 2014-03-26 | 118.586 |
| 2014-03-27 | 119.439 |
| 2014-03-28 | 120.789 |
| 2014-03-29 | 121.026 |
| 2014-03-30 | 120.663 |
| 2014-03-31 | 120.124 |
| 2014-04-01 | 119.703 |
| 2014-04-02 | 116.86 |
| 2014-04-03 | 111.868 |
| 2014-04-04 | 106.725 |
| 2014-04-05 | 103.974 |
| 2014-04-06 | 99.114 |
| 2014-04-07 | 99.255 |
| 2014-04-08 | 99.691 |
| 2014-04-09 | 100.484 |
| 2014-04-10 | 99.483 |
| 2014-04-11 | 97.105 |
| 2014-04-12 | 96.363 |
| 2014-04-13 | 94.444 |
| 2014-04-14 | 95.354 |
| 2014-04-15 | 96.075 |
| 2014-04-16 | 96.363 |
| 2014-04-17 | 92.654 |
| 2014-04-18 | 90.723 |
| 2014-04-19 | 89.228 |
| 2014-04-20 | 87.607 |
| 2014-04-21 | 88.109 |
| 2014-04-22 | 89.805 |
| 2014-04-23 | 89.559 |
| 2014-04-24 | 87.099 |
| 2014-04-25 | 87.674 |
| 2014-04-26 | 86.956 |
| 2014-04-27 | 85.938 |
| 2014-04-28 | 87.381 |
| 2014-04-29 | 89.575 |
| 2014-04-30 | 92.782 |
| 2014-05-01 | 91.391 |
| 2014-05-02 | 91.303 |
| 2014-05-03 | 92.317 |
| 2014-05-04 | 93.369 |
| 2014-05-05 | 93.484 |
| 2014-05-06 | 96.56 |
| 2014-05-07 | 97.334 |
| 2014-05-08 | 97.516 |
| 2014-05-09 | 96.76 |
| 2014-05-10 | 95.602 |
| 2014-05-11 | 96.986 |
| 2014-05-12 | 98.025 |
| 2014-05-13 | 100.284 |
| 2014-05-14 | 99.895 |
| 2014-05-15 | 97.584 |
| 2014-05-16 | 95.436 |
| 2014-05-17 | 94.018 |
| 2014-05-18 | 93.1 |
| 2014-05-19 | 93.211 |
| 2014-05-20 | 93.502 |
| 2014-05-21 | 93.663 |
| 2014-05-22 | 91.095 |
| 2014-05-23 | 90.941 |
| 2014-05-24 | 90.934 |
| 2014-05-25 | 90.452 |
| 2014-05-26 | 89.706 |
| 2014-05-27 | 89.275 |
| 2014-05-28 | 88.614 |
| 2014-05-29 | 88.253 |
| 2014-05-30 | 84.347 |
| 2014-05-31 | 83.318 |
| 2014-06-01 | 81.408 |
| 2014-06-02 | 80.193 |
| 2014-06-03 | 79.969 |
| 2014-06-04 | 80.389 |
| 2014-06-05 | 80.263 |
| 2014-06-06 | 79.355 |
| 2014-06-07 | 76.104 |
| 2014-06-08 | 74.443 |
| 2014-06-09 | 75.294 |
| 2014-06-10 | 75.963 |
| 2014-06-11 | 77.171 |
| 2014-06-12 | 76.301 |
| 2014-06-13 | 75.838 |
| 2014-06-14 | 76.304 |
| 2014-06-15 | 75.844 |
| 2014-06-16 | 79.011 |
| 2014-06-17 | 83.659 |
| 2014-06-18 | 86.596 |
| 2014-06-19 | 87.496 |
| 2014-06-20 | 89.127 |
| 2014-06-21 | 90.146 |
| 2014-06-22 | 89.903 |
| 2014-06-23 | 91.984 |
| 2014-06-24 | 93.442 |
| 2014-06-25 | 95.156 |
| 2014-06-26 | 96.033 |
| 2014-06-27 | 97.371 |
| 2014-06-28 | 96.105 |
| 2014-06-29 | 96.981 |
| 2014-06-30 | 98.174 |
| 2014-07-01 | 101.271 |
| 2014-07-02 | 103.853 |
| 2014-07-03 | 104.143 |
| 2014-07-04 | 104.661 |
| 2014-07-05 | 103.502 |
| 2014-07-06 | 104.768 |
| 2014-07-07 | 108.106 |
| 2014-07-08 | 109.594 |
| 2014-07-09 | 110.703 |
| 2014-07-10 | 109.39 |
| 2014-07-11 | 108.936 |
| 2014-07-12 | 107.935 |
| 2014-07-13 | 108.727 |
| 2014-07-14 | 111.288 |
| 2014-07-15 | 112.345 |
| 2014-07-16 | 113.171 |
| 2014-07-17 | 111.185 |
| 2014-07-18 | 113.276 |
| 2014-07-19 | 115.579 |
| 2014-07-20 | 114.663 |
| 2014-07-21 | 118.477 |
| 2014-07-22 | 122.014 |
| 2014-07-23 | 124.953 |
| 2014-07-24 | 123.772 |
| 2014-07-25 | 126.626 |
| 2014-07-26 | 127.833 |
| 2014-07-27 | 126.959 |
| 2014-07-28 | 129.375 |
| 2014-07-29 | 132.002 |
| 2014-07-30 | 135.94 |
| 2014-07-31 | 136.408 |
| 2014-08-01 | 136.961 |
| 2014-08-02 | 135.425 |
| 2014-08-03 | 133.563 |
| 2014-08-04 | 136.313 |
| 2014-08-05 | 139.034 |
| 2014-08-06 | 140.218 |
| 2014-08-07 | 142.325 |
| 2014-08-08 | 145.764 |
| 2014-08-09 | 147.997 |
| 2014-08-10 | 148.033 |
| 2014-08-11 | 152.992 |
| 2014-08-12 | 153.903 |
| 2014-08-13 | 154.397 |
| 2014-08-14 | 154.712 |
| 2014-08-15 | 153.77 |
| 2014-08-16 | 151.651 |
| 2014-08-17 | 147.394 |
| 2014-08-18 | 145.461 |
| 2014-08-19 | 148.792 |
| 2014-08-20 | 146.111 |
| 2014-08-21 | 144.263 |
| 2014-08-22 | 140.677 |
| 2014-08-23 | 140.314 |
| 2014-08-24 | 136.531 |
| 2014-08-25 | 137.744 |
| 2014-08-26 | 138.001 |
| 2014-08-27 | 137.789 |
| 2014-08-28 | 135.374 |
| 2014-08-29 | 133.878 |
| 2014-08-30 | 133.403 |
| 2014-08-31 | 131.818 |
| 2014-09-01 | 137.845 |
| 2014-09-02 | 143.949 |
| 2014-09-03 | 144.901 |
| 2014-09-04 | 146.476 |
| 2014-09-05 | 145.081 |
| 2014-09-06 | 142.551 |
| 2014-09-07 | 138.095 |
| 2014-09-08 | 138.259 |
| 2014-09-09 | 138.027 |
| 2014-09-10 | 135.526 |
| 2014-09-11 | 134.447 |
| 2014-09-12 | 134.524 |
| 2014-09-13 | 134.297 |
| 2014-09-14 | 133.301 |
| 2014-09-15 | 134.266 |
| 2014-09-16 | 136.859 |
| 2014-09-17 | 138.324 |
| 2014-09-18 | 135.054 |
| 2014-09-19 | 135.38 |
| 2014-09-20 | 132.806 |
| 2014-09-21 | 131.814 |
| 2014-09-22 | 130.88 |
| 2014-09-23 | 134.626 |
| 2014-09-24 | 133.936 |
| 2014-09-25 | 133.582 |
| 2014-09-26 | 133.856 |
| 2014-09-27 | 134.897 |
| 2014-09-28 | 131.656 |
| 2014-09-29 | 130.78 |
| 2014-09-30 | 130.566 |
| 2014-10-01 | 126.582 |
| 2014-10-02 | 121.193 |
| 2014-10-03 | 118.517 |
| 2014-10-04 | 113.892 |
| 2014-10-05 | 111.652 |
| 2014-10-06 | 111.434 |
| 2014-10-07 | 111.063 |
| 2014-10-08 | 108.862 |
| 2014-10-09 | 107.689 |
| 2014-10-10 | 107.356 |
| 2014-10-11 | 105.562 |
| 2014-10-12 | 101.325 |
| 2014-10-13 | 100.683 |
| 2014-10-14 | 99.629 |
| 2014-10-15 | 98.851 |
| 2014-10-16 | 95.892 |
| 2014-10-17 | 93.449 |
| 2014-10-18 | 91.214 |
| 2014-10-19 | 88.709 |
| 2014-10-20 | 88.694 |
| 2014-10-21 | 88.058 |
| 2014-10-22 | 87.985 |
| 2014-10-23 | 84.489 |
| 2014-10-24 | 82.649 |
| 2014-10-25 | 82.797 |
| 2014-10-26 | 79.011 |
| 2014-10-27 | 77.942 |
| 2014-10-28 | 80.584 |
| 2014-10-29 | 80.287 |
| 2014-10-30 | 80.49 |
| 2014-10-31 | 79.874 |
| 2014-11-01 | 81.204 |
| 2014-11-02 | 79.236 |
| 2014-11-03 | 79.23 |
| 2014-11-04 | 80.21 |
| 2014-11-05 | 80.484 |
| 2014-11-06 | 79.598 |
| 2014-11-07 | 79.906 |
| 2014-11-08 | 79.477 |
| 2014-11-09 | 77.66 |
| 2014-11-10 | 77.444 |
| 2014-11-11 | 78.643 |
| 2014-11-12 | 77.867 |
| 2014-11-13 | 77.576 |
| 2014-11-14 | 77.173 |
| 2014-11-15 | 78.152 |
| 2014-11-16 | 76.977 |
| 2014-11-17 | 79.829 |
| 2014-11-18 | 80.82 |
| 2014-11-19 | 81.366 |
| 2014-11-20 | 82.313 |
| 2014-11-21 | 83.381 |
| 2014-11-22 | 82.705 |
| 2014-11-23 | 82.202 |
| 2014-11-24 | 83.207 |
| 2014-11-25 | 87.404 |
| 2014-11-26 | 88.151 |
| 2014-11-27 | 86.198 |
| 2014-11-28 | 86.148 |
| 2014-11-29 | 84.338 |
| 2014-11-30 | 84.142 |
| 2014-12-01 | 82.81 |
| 2014-12-02 | 84.942 |
| 2014-12-03 | 85.193 |
| 2014-12-04 | 85.525 |
| 2014-12-05 | 84.157 |
| 2014-12-06 | 84.845 |
| 2014-12-07 | 83.304 |
| 2014-12-08 | 84.87 |
| 2014-12-09 | 85.046 |
| 2014-12-10 | 86.71 |
| 2014-12-11 | 86.866 |
| 2014-12-12 | 87.537 |
| 2014-12-13 | 87.879 |
| 2014-12-14 | 88.239 |
| 2014-12-15 | 87.206 |
| 2014-12-16 | 90.033 |
| 2014-12-17 | 90.306 |
| 2014-12-18 | 91.487 |
| 2014-12-19 | 92.111 |
| 2014-12-20 | 91.588 |
| 2014-12-21 | 91.553 |
| 2014-12-22 | 92.226 |
| 2014-12-23 | 91.568 |
| 2014-12-24 | 90.953 |
| 2014-12-25 | 86.965 |
| 2014-12-26 | 86.796 |
| 2014-12-27 | 86.131 |
| 2014-12-28 | 84.192 |
| 2014-12-29 | 85.653 |
| 2014-12-30 | 85.176 |
| 2014-12-31 | 86.382 |
| 2015-01-01 | 85.238 |
| 2015-01-02 | 85.852 |
| 2015-01-03 | 84.639 |
| 2015-01-04 | 83.105 |
| 2015-01-05 | 84.407 |
| 2015-01-06 | 85.168 |
| 2015-01-07 | 84.145 |
| 2015-01-08 | 87.35 |
| 2015-01-09 | 85.914 |
| 2015-01-10 | 87.815 |
| 2015-01-11 | 88.435 |
| 2015-01-12 | 90.977 |
| 2015-01-13 | 93.087 |
| 2015-01-14 | 93.801 |
| 2015-01-15 | 93.692 |
| 2015-01-16 | 94.071 |
| 2015-01-17 | 93.585 |
| 2015-01-18 | 92.49 |
| 2015-01-19 | 94.05 |
| 2015-01-20 | 96.243 |
| 2015-01-21 | 98.72 |
| 2015-01-22 | 100.11 |
| 2015-01-23 | 99.626 |
| 2015-01-24 | 101.415 |
| 2015-01-25 | 101.295 |
| 2015-01-26 | 103.799 |
| 2015-01-27 | 105.88 |
| 2015-01-28 | 107.664 |
| 2015-01-29 | 108.853 |
| 2015-01-30 | 109.945 |
| 2015-01-31 | 109.465 |
| 2015-02-01 | 109.711 |
| 2015-02-02 | 111.301 |
| 2015-02-03 | 115.46 |
| 2015-02-04 | 115.126 |
| 2015-02-05 | 115.88 |
| 2015-02-06 | 118.802 |
| 2015-02-07 | 117.079 |
| 2015-02-08 | 118.492 |
| 2015-02-09 | 118.167 |
| 2015-02-10 | 119.437 |
| 2015-02-11 | 118.196 |
| 2015-02-12 | 115.698 |
| 2015-02-13 | 117.406 |
| 2015-02-14 | 114.991 |
| 2015-02-15 | 112.147 |
| 2015-02-16 | 111.957 |
| 2015-02-17 | 113.477 |
| 2015-02-18 | 114.624 |
| 2015-02-19 | 113.577 |
| 2015-02-20 | 113.188 |
| 2015-02-21 | 112.304 |
| 2015-02-22 | 111.456 |
| 2015-02-23 | 113.805 |
| 2015-02-24 | 115.094 |
| 2015-02-25 | 114.375 |
| 2015-02-26 | 114.372 |
| 2015-02-27 | 113.021 |
| 2015-02-28 | 111.23 |
| 2015-03-01 | 110.727 |
| 2015-03-02 | 112.237 |
| 2015-03-03 | 113.408 |
| 2015-03-04 | 117.314 |
| 2015-03-05 | 115.188 |
| 2015-03-06 | 115.033 |
| 2015-03-07 | 114.022 |
| 2015-03-08 | 111.342 |
| 2015-03-09 | 110.105 |
| 2015-03-10 | 109.527 |
| 2015-03-11 | 107.829 |
| 2015-03-12 | 106.875 |
| 2015-03-13 | 105.442 |
| 2015-03-14 | 105.117 |
| 2015-03-15 | 104.352 |
| 2015-03-16 | 105.983 |
| 2015-03-17 | 106.866 |
| 2015-03-18 | 107.362 |
| 2015-03-19 | 105.099 |
| 2015-03-20 | 103.102 |
| 2015-03-21 | 100.792 |
| 2015-03-22 | 98.859 |
| 2015-03-23 | 99.735 |
| 2015-03-24 | 100.292 |
| 2015-03-25 | 98.199 |
| 2015-03-26 | 96.676 |
| 2015-03-27 | 99.505 |
| 2015-03-28 | 99.397 |
| 2015-03-29 | 100.17 |
| 2015-03-30 | 102.56 |
| 2015-03-31 | 103.215 |
| 2015-04-01 | 104.33 |
| 2015-04-02 | 103.146 |
| 2015-04-03 | 100.873 |
| 2015-04-04 | 103.811 |
| 2015-04-05 | 104.825 |
| 2015-04-06 | 106.748 |
| 2015-04-07 | 107.551 |
| 2015-04-08 | 110.449 |
| 2015-04-09 | 111.95 |
| 2015-04-10 | 114.087 |
| 2015-04-11 | 113.062 |
| 2015-04-12 | 112.568 |
| 2015-04-13 | 112.979 |
| 2015-04-14 | 113.144 |
| 2015-04-15 | 114.291 |
| 2015-04-16 | 114.538 |
| 2015-04-17 | 113.928 |
| 2015-04-18 | 113.648 |
| 2015-04-19 | 113.75 |
| 2015-04-20 | 114.322 |
| 2015-04-21 | 114.536 |
| 2015-04-22 | 113.779 |
| 2015-04-23 | 112.469 |
| 2015-04-24 | 114.17 |
| 2015-04-25 | 112.105 |
| 2015-04-26 | 106.772 |
| 2015-04-27 | 106.247 |
| 2015-04-28 | 103.476 |
| 2015-04-29 | 102.171 |
| 2015-04-30 | 99.561 |
| 2015-05-01 | 97.471 |
| 2015-05-02 | 95.058 |
| 2015-05-03 | 91.514 |
| 2015-05-04 | 88.347 |
| 2015-05-05 | 85.957 |
| 2015-05-06 | 85.387 |
| 2015-05-07 | 83.859 |
| 2015-05-08 | 80.692 |
| 2015-05-09 | 77.867 |
| 2015-05-10 | 74.882 |
| 2015-05-11 | 76.342 |
| 2015-05-12 | 76.648 |
| 2015-05-13 | 77.82 |
| 2015-05-14 | 76.347 |
| 2015-05-15 | 74.733 |
| 2015-05-16 | 73.849 |
| 2015-05-17 | 73.11 |
| 2015-05-18 | 75.264 |
| 2015-05-19 | 76.285 |
| 2015-05-20 | 75.609 |
| 2015-05-21 | 74.66 |
| 2015-05-22 | 74.95 |
| 2015-05-23 | 75.607 |
| 2015-05-24 | 72.499 |
| 2015-05-25 | 74.006 |
| 2015-05-26 | 73.944 |
| 2015-05-27 | 74.185 |
| 2015-05-28 | 74.514 |
| 2015-05-29 | 73.56 |
| 2015-05-30 | 74.089 |
| 2015-05-31 | 74.349 |
| 2015-06-01 | 76.508 |
| 2015-06-02 | 77.226 |
| 2015-06-03 | 79.176 |
| 2015-06-04 | 80.488 |
| 2015-06-05 | 79.249 |
| 2015-06-06 | 78.329 |
| 2015-06-07 | 78.824 |
| 2015-06-08 | 79.881 |
| 2015-06-09 | 81.31 |
| 2015-06-10 | 78.974 |
| 2015-06-11 | 78.734 |
| 2015-06-12 | 76.309 |
| 2015-06-13 | 75.599 |
| 2015-06-14 | 74.581 |
| 2015-06-15 | 74.081 |
| 2015-06-16 | 75.325 |
| 2015-06-17 | 74.252 |
| 2015-06-18 | 72.741 |
| 2015-06-19 | 71.834 |
| 2015-06-20 | 73.257 |
| 2015-06-21 | 72.936 |
| 2015-06-22 | 73.266 |
| 2015-06-23 | 74.611 |
| 2015-06-24 | 74.549 |
| 2015-06-25 | 77.669 |
| 2015-06-26 | 77.609 |
| 2015-06-27 | 78.35 |
| 2015-06-28 | 80.167 |
| 2015-06-29 | 82.444 |
| 2015-06-30 | 85.286 |
| 2015-07-01 | 84.85 |
| 2015-07-02 | 85.49 |
| 2015-07-03 | 84.085 |
| 2015-07-04 | 82.951 |
| 2015-07-05 | 83.548 |
| 2015-07-06 | 85.969 |
| 2015-07-07 | 85.819 |
| 2015-07-08 | 85.152 |
| 2015-07-09 | 83.924 |
| 2015-07-10 | 85.884 |
| 2015-07-11 | 86.771 |
| 2015-07-12 | 88.891 |
| 2015-07-13 | 91.122 |
| 2015-07-14 | 91.222 |
| 2015-07-15 | 96.782 |
| 2015-07-16 | 96.896 |
| 2015-07-17 | 99.13 |
| 2015-07-18 | 98.477 |
| 2015-07-19 | 100.29 |
| 2015-07-20 | 101.152 |
| 2015-07-21 | 105.129 |
| 2015-07-22 | 107.204 |
| 2015-07-23 | 106.678 |
| 2015-07-24 | 107.629 |
| 2015-07-25 | 106.333 |
| 2015-07-26 | 107.864 |
| 2015-07-27 | 110.974 |
| 2015-07-28 | 111.74 |
| 2015-07-29 | 110.507 |
| 2015-07-30 | 107.363 |
| 2015-07-31 | 106.667 |
| 2015-08-01 | 105.982 |
| 2015-08-02 | 105.402 |
| 2015-08-03 | 104.68 |
| 2015-08-04 | 107.17 |
| 2015-08-05 | 106.12 |
| 2015-08-06 | 107.677 |
| 2015-08-07 | 108.622 |
| 2015-08-08 | 108.96 |
| 2015-08-09 | 108.225 |
| 2015-08-10 | 108.471 |
| 2015-08-11 | 108.088 |
| 2015-08-12 | 107.234 |
| 2015-08-13 | 108.647 |
| 2015-08-14 | 103.592 |
| 2015-08-15 | 101.265 |
| 2015-08-16 | 98.741 |
| 2015-08-17 | 99.812 |
| 2015-08-18 | 99.474 |
| 2015-08-19 | 99.333 |
| 2015-08-20 | 93.829 |
| 2015-08-21 | 91.606 |
| 2015-08-22 | 91.326 |
| 2015-08-23 | 89.387 |
| 2015-08-24 | 89.762 |
| 2015-08-25 | 87.452 |
| 2015-08-26 | 84.374 |
| 2015-08-27 | 82.8 |
| 2015-08-28 | 81.231 |
| 2015-08-29 | 80.875 |
| 2015-08-30 | 80.824 |
| 2015-08-31 | 81.332 |
| 2015-09-01 | 82.224 |
| 2015-09-02 | 83.799 |
| 2015-09-03 | 81.479 |
| 2015-09-04 | 82.152 |
| 2015-09-05 | 80.901 |
| 2015-09-06 | 80.652 |
| 2015-09-07 | 81.162 |
| 2015-09-08 | 82.249 |
| 2015-09-09 | 84.042 |
| 2015-09-10 | 85.693 |
| 2015-09-11 | 86.407 |
| 2015-09-12 | 86.129 |
| 2015-09-13 | 85.362 |
| 2015-09-14 | 86.432 |
| 2015-09-15 | 88.147 |
| 2015-09-16 | 87.742 |
| 2015-09-17 | 87.571 |
| 2015-09-18 | 86.333 |
| 2015-09-19 | 88.138 |
| 2015-09-20 | 87.535 |
| 2015-09-21 | 87.772 |
| 2015-09-22 | 92.223 |
| 2015-09-23 | 91.637 |
| 2015-09-24 | 92.657 |
| 2015-09-25 | 92.748 |
| 2015-09-26 | 92.504 |
| 2015-09-27 | 93.242 |
| 2015-09-28 | 94.171 |
| 2015-09-29 | 95.532 |
| 2015-09-30 | 96.267 |
| 2015-10-01 | 97.338 |
| 2015-10-02 | 100.825 |
| 2015-10-03 | 100.328 |
| 2015-10-04 | 99.793 |
| 2015-10-05 | 99.787 |
| 2015-10-06 | 100.804 |
| 2015-10-07 | 101.691 |
| 2015-10-08 | 100.113 |
| 2015-10-09 | 98.303 |
| 2015-10-10 | 97.111 |
| 2015-10-11 | 95.919 |
| 2015-10-12 | 95.171 |
| 2015-10-13 | 96.017 |
| 2015-10-14 | 96.867 |
| 2015-10-15 | 95.588 |
| 2015-10-16 | 95.812 |
| 2015-10-17 | 96.708 |
| 2015-10-18 | 96.148 |
| 2015-10-19 | 96.217 |
| 2015-10-20 | 96.283 |
| 2015-10-21 | 95.715 |
| 2015-10-22 | 91.718 |
| 2015-10-23 | 91.497 |
| 2015-10-24 | 90.984 |
| 2015-10-25 | 89.988 |
| 2015-10-26 | 90.17 |
| 2015-10-27 | 89.317 |
| 2015-10-28 | 88.514 |
| 2015-10-29 | 86.882 |
| 2015-10-30 | 86.556 |
| 2015-10-31 | 84.984 |
| 2015-11-01 | 80.524 |
| 2015-11-02 | 81.837 |
| 2015-11-03 | 80.879 |
| 2015-11-04 | 81.059 |
| 2015-11-05 | 79.303 |
| 2015-11-06 | 78.586 |
| 2015-11-07 | 79.639 |
| 2015-11-08 | 79.496 |
| 2015-11-09 | 78.82 |
| 2015-11-10 | 78.893 |
| 2015-11-11 | 77.982 |
| 2015-11-12 | 76.763 |
| 2015-11-13 | 75.301 |
| 2015-11-14 | 76.529 |
| 2015-11-15 | 77.824 |
| 2015-11-16 | 83.881 |
| 2015-11-17 | 93.446 |
| 2015-11-18 | 100.927 |
| 2015-11-19 | 106.684 |
| 2015-11-20 | 111.445 |
| 2015-11-21 | 114.868 |
| 2015-11-22 | 119.014 |
| 2015-11-23 | 122.237 |
| 2015-11-24 | 128.733 |
| 2015-11-25 | 134.192 |
| 2015-11-26 | 138.31 |
| 2015-11-27 | 143.962 |
| 2015-11-28 | 145.252 |
| 2015-11-29 | 145.652 |
| 2015-11-30 | 146.284 |
| 2015-12-01 | 150.415 |
| 2015-12-02 | 153.174 |
| 2015-12-03 | 156.663 |
| 2015-12-04 | 158.658 |
| 2015-12-05 | 161.914 |
| 2015-12-06 | 163.452 |
| 2015-12-07 | 166.624 |
| 2015-12-08 | 170.42 |
| 2015-12-09 | 174.159 |
| 2015-12-10 | 176.229 |
| 2015-12-11 | 179.497 |
| 2015-12-12 | 181.481 |
| 2015-12-13 | 182.149 |
| 2015-12-14 | 182.092 |
| 2015-12-15 | 182.532 |
| 2015-12-16 | 178.486 |
| 2015-12-17 | 172.117 |
| 2015-12-18 | 166.283 |
| 2015-12-19 | 162.034 |
| 2015-12-20 | 158.314 |
| 2015-12-21 | 158.097 |
| 2015-12-22 | 156.089 |
| 2015-12-23 | 152.88 |
| 2015-12-24 | 148.356 |
| 2015-12-25 | 145.466 |
| 2015-12-26 | 144.212 |
| 2015-12-27 | 139.724 |
| 2015-12-28 | 141.272 |
| 2015-12-29 | 141.466 |
| 2015-12-30 | 142.844 |
| 2015-12-31 | 139.498 |
| 2016-01-01 | 140.036 |
| 2016-01-02 | 137.765 |
| 2016-01-03 | 136.325 |
| 2016-01-04 | 135.506 |
| 2016-01-05 | 137.834 |
| 2016-01-06 | 136.637 |
| 2016-01-07 | 136.878 |
| 2016-01-08 | 136.262 |
| 2016-01-09 | 133.588 |
| 2016-01-10 | 131.949 |
| 2016-01-11 | 131.669 |
| 2016-01-12 | 132.494 |
| 2016-01-13 | 133.158 |
| 2016-01-14 | 132.599 |
| 2016-01-15 | 130.67 |
| 2016-01-16 | 128.336 |
| 2016-01-17 | 127.255 |
| 2016-01-18 | 128.34 |
| 2016-01-19 | 130.134 |
| 2016-01-20 | 131.111 |
| 2016-01-21 | 129.264 |
| 2016-01-22 | 130.502 |
| 2016-01-23 | 129.561 |
| 2016-01-24 | 127.061 |
| 2016-01-25 | 125.31 |
| 2016-01-26 | 124.279 |
| 2016-01-27 | 122.484 |
| 2016-01-28 | 121.401 |
| 2016-01-29 | 119.457 |
| 2016-01-30 | 118.472 |
| 2016-01-31 | 112.868 |
| 2016-02-01 | 114.298 |
| 2016-02-02 | 113.978 |
| 2016-02-03 | 112.993 |
| 2016-02-04 | 109.377 |
| 2016-02-05 | 107.64 |
| 2016-02-06 | 103.377 |
| 2016-02-07 | 101.017 |
| 2016-02-08 | 103.428 |
| 2016-02-09 | 102.654 |
| 2016-02-10 | 102.79 |
| 2016-02-11 | 103.192 |
| 2016-02-12 | 102.086 |
| 2016-02-13 | 100.058 |
| 2016-02-14 | 100.166 |
| 2016-02-15 | 99.773 |
| 2016-02-16 | 100.667 |
| 2016-02-17 | 100.204 |
| 2016-02-18 | 99.022 |
| 2016-02-19 | 97.93 |
| 2016-02-20 | 97.313 |
| 2016-02-21 | 95.658 |
| 2016-02-22 | 96.383 |
| 2016-02-23 | 98.531 |
| 2016-02-24 | 99.624 |
| 2016-02-25 | 99.13 |
| 2016-02-26 | 98.96 |
| 2016-02-27 | 97.948 |
| 2016-02-28 | 98.567 |
| 2016-02-29 | 99.206 |
| 2016-03-01 | 101.957 |
| 2016-03-02 | 100.262 |
| 2016-03-03 | 101.203 |
| 2016-03-04 | 100.136 |
| 2016-03-05 | 99.202 |
| 2016-03-06 | 97.278 |
| 2016-03-07 | 96.94 |
| 2016-03-08 | 96.702 |
| 2016-03-09 | 95.11 |
| 2016-03-10 | 95.854 |
| 2016-03-11 | 94.494 |
| 2016-03-12 | 92.409 |
| 2016-03-13 | 91.015 |
| 2016-03-14 | 93.353 |
| 2016-03-15 | 93.903 |
| 2016-03-16 | 94.543 |
| 2016-03-17 | 92.904 |
| 2016-03-18 | 91.916 |
| 2016-03-19 | 89.301 |
| 2016-03-20 | 86.393 |
| 2016-03-21 | 87.83 |
| 2016-03-22 | 88.335 |
| 2016-03-23 | 93.026 |
| 2016-03-24 | 92.742 |
| 2016-03-25 | 95.114 |
| 2016-03-26 | 96.593 |
| 2016-03-27 | 95.801 |
| 2016-03-28 | 99.492 |
| 2016-03-29 | 101.73 |
| 2016-03-30 | 104.421 |
| 2016-03-31 | 104.689 |
| 2016-04-01 | 107.184 |
| 2016-04-02 | 105.742 |
| 2016-04-03 | 106.868 |
| 2016-04-04 | 108.352 |
| 2016-04-05 | 109.605 |
| 2016-04-06 | 110.75 |
| 2016-04-07 | 110.444 |
| 2016-04-08 | 108.934 |
| 2016-04-09 | 107.088 |
| 2016-04-10 | 107.457 |
| 2016-04-11 | 108.784 |
| 2016-04-12 | 109.3 |
| 2016-04-13 | 108.065 |
| 2016-04-14 | 106.875 |
| 2016-04-15 | 106.409 |
| 2016-04-16 | 105.608 |
| 2016-04-17 | 104.263 |
| 2016-04-18 | 104.657 |
| 2016-04-19 | 105.186 |
| 2016-04-20 | 104.543 |
| 2016-04-21 | 105.108 |
| 2016-04-22 | 99.486 |
| 2016-04-23 | 96.108 |
| 2016-04-24 | 92.782 |
| 2016-04-25 | 92.071 |
| 2016-04-26 | 92.578 |
| 2016-04-27 | 89.81 |
| 2016-04-28 | 87.707 |
| 2016-04-29 | 85.609 |
| 2016-04-30 | 83.628 |
| 2016-05-01 | 80.983 |
| 2016-05-02 | 81.344 |
| 2016-05-03 | 80.188 |
| 2016-05-04 | 79.896 |
| 2016-05-05 | 80.381 |
| 2016-05-06 | 79.643 |
| 2016-05-07 | 78.333 |
| 2016-05-08 | 77.528 |
| 2016-05-09 | 79.39 |
| 2016-05-10 | 79.497 |
| 2016-05-11 | 80.092 |
| 2016-05-12 | 80.81 |
| 2016-05-13 | 80.494 |
| 2016-05-14 | 78.799 |
| 2016-05-15 | 78.351 |
| 2016-05-16 | 78.725 |
| 2016-05-17 | 79.535 |
| 2016-05-18 | 80.871 |
| 2016-05-19 | 80.327 |
| 2016-05-20 | 81.085 |
| 2016-05-21 | 80.771 |
| 2016-05-22 | 81.686 |
| 2016-05-23 | 84.393 |
| 2016-05-24 | 84.383 |
| 2016-05-25 | 84.232 |
| 2016-05-26 | 83.853 |
| 2016-05-27 | 84.109 |
| 2016-05-28 | 82.664 |
| 2016-05-29 | 81.578 |
| 2016-05-30 | 82.808 |
| 2016-05-31 | 84.932 |
| 2016-06-01 | 84.983 |
| 2016-06-02 | 85.767 |
| 2016-06-03 | 87.095 |
| 2016-06-04 | 85.527 |
| 2016-06-05 | 85 |
| 2016-06-06 | 86.561 |
| 2016-06-07 | 88.458 |
| 2016-06-08 | 87.669 |
| 2016-06-09 | 87.287 |
| 2016-06-10 | 85.573 |
| 2016-06-11 | 83.675 |
| 2016-06-12 | 81.28 |
| 2016-06-13 | 82.859 |
| 2016-06-14 | 84.038 |
| 2016-06-15 | 86.133 |
| 2016-06-16 | 85.819 |
| 2016-06-17 | 86.048 |
| 2016-06-18 | 85.948 |
| 2016-06-19 | 85.543 |
| 2016-06-20 | 85.773 |
| 2016-06-21 | 86.178 |
| 2016-06-22 | 85.605 |
| 2016-06-23 | 86.278 |
| 2016-06-24 | 86.006 |
| 2016-06-25 | 85.526 |
| 2016-06-26 | 84.072 |
| 2016-06-27 | 85.651 |
| 2016-06-28 | 87.367 |
| 2016-06-29 | 88.777 |
| 2016-06-30 | 88.547 |
| 2016-07-01 | 88.921 |
| 2016-07-02 | 88.729 |
| 2016-07-03 | 87.346 |
| 2016-07-04 | 86.88 |
| 2016-07-05 | 88.038 |
| 2016-07-06 | 88.246 |
| 2016-07-07 | 90.321 |
| 2016-07-08 | 92.131 |
| 2016-07-09 | 93.724 |
| 2016-07-10 | 95.701 |
| 2016-07-11 | 97.228 |
| 2016-07-12 | 100.51 |
| 2016-07-13 | 99.323 |
| 2016-07-14 | 99.359 |
| 2016-07-15 | 98.089 |
| 2016-07-16 | 103.374 |
| 2016-07-17 | 106.338 |
| 2016-07-18 | 109.243 |
| 2016-07-19 | 112.126 |
| 2016-07-20 | 112.575 |
| 2016-07-21 | 113.584 |
| 2016-07-22 | 115.105 |
| 2016-07-23 | 114.134 |
| 2016-07-24 | 115.348 |
| 2016-07-25 | 116.884 |
| 2016-07-26 | 118.335 |
| 2016-07-27 | 117.987 |
| 2016-07-28 | 117.802 |
| 2016-07-29 | 116.361 |
| 2016-07-30 | 114.103 |
| 2016-07-31 | 112.012 |
| 2016-08-01 | 112.336 |
| 2016-08-02 | 113.122 |
| 2016-08-03 | 115.645 |
| 2016-08-04 | 117.517 |
| 2016-08-05 | 117.039 |
| 2016-08-06 | 113.823 |
| 2016-08-07 | 111.885 |
| 2016-08-08 | 112.116 |
| 2016-08-09 | 111.867 |
| 2016-08-10 | 112.733 |
| 2016-08-11 | 112.159 |
| 2016-08-12 | 113.989 |
| 2016-08-13 | 113.568 |
| 2016-08-14 | 113.42 |
| 2016-08-15 | 108.762 |
| 2016-08-16 | 105.659 |
| 2016-08-17 | 102.43 |
| 2016-08-18 | 100.043 |
| 2016-08-19 | 99.18 |
| 2016-08-20 | 96.156 |
| 2016-08-21 | 91.922 |
| 2016-08-22 | 92.151 |
| 2016-08-23 | 91.683 |
| 2016-08-24 | 92.972 |
| 2016-08-25 | 96.144 |
| 2016-08-26 | 95.507 |
| 2016-08-27 | 96.387 |
| 2016-08-28 | 95.189 |
| 2016-08-29 | 98.011 |
| 2016-08-30 | 99.026 |
| 2016-08-31 | 98.612 |
| 2016-09-01 | 96.802 |
| 2016-09-02 | 95.431 |
| 2016-09-03 | 93.013 |
| 2016-09-04 | 92.786 |
| 2016-09-05 | 93.042 |
| 2016-09-06 | 93.657 |
| 2016-09-07 | 92.852 |
| 2016-09-08 | 91.064 |
| 2016-09-09 | 91.087 |
| 2016-09-10 | 91.511 |
| 2016-09-11 | 90.86 |
| 2016-09-12 | 92.219 |
| 2016-09-13 | 93.389 |
| 2016-09-14 | 93.98 |
| 2016-09-15 | 94.117 |
| 2016-09-16 | 93.78 |
| 2016-09-17 | 92.052 |
| 2016-09-18 | 92.928 |
| 2016-09-19 | 99.591 |
| 2016-09-20 | 104.924 |
| 2016-09-21 | 107.529 |
| 2016-09-22 | 107.711 |
| 2016-09-23 | 106.412 |
| 2016-09-24 | 102.902 |
| 2016-09-25 | 101.974 |
| 2016-09-26 | 102.525 |
| 2016-09-27 | 102.927 |
| 2016-09-28 | 101.75 |
| 2016-09-29 | 102.58 |
| 2016-09-30 | 103.717 |
| 2016-10-01 | 102.907 |
| 2016-10-02 | 102.488 |
| 2016-10-03 | 101.919 |
| 2016-10-04 | 103.947 |
| 2016-10-05 | 106.188 |
| 2016-10-06 | 106.233 |
| 2016-10-07 | 104.015 |
| 2016-10-08 | 103.674 |
| 2016-10-09 | 103.162 |
| 2016-10-10 | 102.486 |
| 2016-10-11 | 102.229 |
| 2016-10-12 | 101.031 |
| 2016-10-13 | 100.707 |
| 2016-10-14 | 99.962 |
| 2016-10-15 | 98.669 |
| 2016-10-16 | 98.753 |
| 2016-10-17 | 100.817 |
| 2016-10-18 | 101.141 |
| 2016-10-19 | 96.357 |
| 2016-10-20 | 94.105 |
| 2016-10-21 | 91.313 |
| 2016-10-22 | 90.852 |
| 2016-10-23 | 90.171 |
| 2016-10-24 | 90.65 |
| 2016-10-25 | 91.278 |
| 2016-10-26 | 90.049 |
| 2016-10-27 | 90.556 |
| 2016-10-28 | 89.434 |
| 2016-10-29 | 88.173 |
| 2016-10-30 | 86.911 |
| 2016-10-31 | 87.448 |
| 2016-11-01 | 88.277 |
| 2016-11-02 | 88.684 |
| 2016-11-03 | 85.841 |
| 2016-11-04 | 83.451 |
| 2016-11-05 | 82.532 |
| 2016-11-06 | 84.01 |
| 2016-11-07 | 84.537 |
| 2016-11-08 | 84.141 |
| 2016-11-09 | 82.813 |
| 2016-11-10 | 82.342 |
| 2016-11-11 | 82.118 |
| 2016-11-12 | 79.686 |
| 2016-11-13 | 78.834 |
| 2016-11-14 | 81.927 |
| 2016-11-15 | 82.857 |
| 2016-11-16 | 82.127 |
| 2016-11-17 | 80.311 |
| 2016-11-18 | 79.643 |
| 2016-11-19 | 77.854 |
| 2016-11-20 | 76.974 |
| 2016-11-21 | 78.203 |
| 2016-11-22 | 78.878 |
| 2016-11-23 | 78.533 |
| 2016-11-24 | 78.413 |
| 2016-11-25 | 77.731 |
| 2016-11-26 | 77.2 |
| 2016-11-27 | 78.122 |
| 2016-11-28 | 79.601 |
| 2016-11-29 | 81.701 |
| 2016-11-30 | 83.579 |
| 2016-12-01 | 85.477 |
| 2016-12-02 | 85.072 |
| 2016-12-03 | 84.215 |
| 2016-12-04 | 83.373 |
| 2016-12-05 | 84.043 |
| 2016-12-06 | 84.007 |
| 2016-12-07 | 85.251 |
| 2016-12-08 | 84.776 |
| 2016-12-09 | 85.472 |
| 2016-12-10 | 85.184 |
| 2016-12-11 | 83.598 |
| 2016-12-12 | 85.462 |
| 2016-12-13 | 87.777 |
| 2016-12-14 | 86.367 |
| 2016-12-15 | 87.283 |
| 2016-12-16 | 87.318 |
| 2016-12-17 | 87.224 |
| 2016-12-18 | 86.872 |
| 2016-12-19 | 87.672 |
| 2016-12-20 | 89.741 |
| 2016-12-21 | 92.296 |
| 2016-12-22 | 93.135 |
| 2016-12-23 | 96.707 |
| 2016-12-24 | 97.801 |
| 2016-12-25 | 98.254 |
| 2016-12-26 | 98.674 |
| 2016-12-27 | 98.039 |
| 2016-12-28 | 98.58 |
| 2016-12-29 | 97.025 |
| 2016-12-30 | 99.908 |
| 2016-12-31 | 100.12 |
| 2017-01-01 | 101.574 |
| 2017-01-02 | 105.25 |
| 2017-01-03 | 108.551 |
| 2017-01-04 | 109.34 |
| 2017-01-05 | 109.325 |
| 2017-01-06 | 110.183 |
| 2017-01-07 | 110.044 |
| 2017-01-08 | 108.935 |
| 2017-01-09 | 112.216 |
| 2017-01-10 | 112.855 |
| 2017-01-11 | 114.258 |
| 2017-01-12 | 114.016 |
| 2017-01-13 | 114.553 |
| 2017-01-14 | 113.07 |
| 2017-01-15 | 110.446 |
| 2017-01-16 | 110.961 |
| 2017-01-17 | 111.599 |
| 2017-01-18 | 112.153 |
| 2017-01-19 | 112.52 |
| 2017-01-20 | 109.503 |
| 2017-01-21 | 106.629 |
| 2017-01-22 | 103.373 |
| 2017-01-23 | 103.736 |
| 2017-01-24 | 103.966 |
| 2017-01-25 | 104.254 |
| 2017-01-26 | 104.94 |
| 2017-01-27 | 104.665 |
| 2017-01-28 | 104.66 |
| 2017-01-29 | 101.645 |
| 2017-01-30 | 102.096 |
| 2017-01-31 | 104.77 |
| 2017-02-01 | 104.9 |
| 2017-02-02 | 106.371 |
| 2017-02-03 | 108.876 |
| 2017-02-04 | 111.54 |
| 2017-02-05 | 108.922 |
| 2017-02-06 | 109.333 |
| 2017-02-07 | 114.217 |
| 2017-02-08 | 112.247 |
| 2017-02-09 | 113.108 |
| 2017-02-10 | 115.601 |
| 2017-02-11 | 115.548 |
| 2017-02-12 | 114.291 |
| 2017-02-13 | 116.543 |
| 2017-02-14 | 121.765 |
| 2017-02-15 | 123.308 |
| 2017-02-16 | 124.197 |
| 2017-02-17 | 123.731 |
| 2017-02-18 | 122.618 |
| 2017-02-19 | 122.298 |
| 2017-02-20 | 124.678 |
| 2017-02-21 | 126.481 |
| 2017-02-22 | 125.941 |
| 2017-02-23 | 124.701 |
| 2017-02-24 | 124.249 |
| 2017-02-25 | 121.984 |
| 2017-02-26 | 119.615 |
| 2017-02-27 | 119.04 |
| 2017-02-28 | 117.484 |
| 2017-03-01 | 116.271 |
| 2017-03-02 | 113.8 |
| 2017-03-03 | 110.94 |
| 2017-03-04 | 105.951 |
| 2017-03-05 | 103.887 |
| 2017-03-06 | 102.86 |
| 2017-03-07 | 105.906 |
| 2017-03-08 | 106.825 |
| 2017-03-09 | 104.781 |
| 2017-03-10 | 103.777 |
| 2017-03-11 | 102.464 |
| 2017-03-12 | 97.91 |
| 2017-03-13 | 96.253 |
| 2017-03-14 | 95.269 |
| 2017-03-15 | 94.064 |
| 2017-03-16 | 90.555 |
| 2017-03-17 | 89.827 |
| 2017-03-18 | 88.618 |
| 2017-03-19 | 88.998 |
| 2017-03-20 | 90.609 |
| 2017-03-21 | 90.147 |
| 2017-03-22 | 91.683 |
| 2017-03-23 | 91.415 |
| 2017-03-24 | 94.153 |
| 2017-03-25 | 94.954 |
| 2017-03-26 | 93.491 |
| 2017-03-27 | 95.927 |
| 2017-03-28 | 97.235 |
| 2017-03-29 | 97.641 |
| 2017-03-30 | 97.843 |
| 2017-03-31 | 97.444 |
| 2017-04-01 | 95.837 |
| 2017-04-02 | 95.947 |
| 2017-04-03 | 98.062 |
| 2017-04-04 | 99.01 |
| 2017-04-05 | 99.275 |
| 2017-04-06 | 98.682 |
| 2017-04-07 | 99.772 |
| 2017-04-08 | 101.558 |
| 2017-04-09 | 103.51 |
| 2017-04-10 | 106.245 |
| 2017-04-11 | 106.96 |
| 2017-04-12 | 110.056 |
| 2017-04-13 | 113.286 |
| 2017-04-14 | 114.222 |
| 2017-04-15 | 115.496 |
| 2017-04-16 | 115.133 |
| 2017-04-17 | 115.812 |
| 2017-04-18 | 116.037 |
| 2017-04-19 | 116.451 |
| 2017-04-20 | 119.702 |
| 2017-04-21 | 118.844 |
| 2017-04-22 | 118.718 |
| 2017-04-23 | 114.179 |
| 2017-04-24 | 116.143 |
| 2017-04-25 | 116.639 |
| 2017-04-26 | 115.826 |
| 2017-04-27 | 116.398 |
| 2017-04-28 | 117.492 |
| 2017-04-29 | 117.774 |
| 2017-04-30 | 115.102 |
| 2017-05-01 | 117.099 |
| 2017-05-02 | 119.055 |
| 2017-05-03 | 120.05 |
| 2017-05-04 | 118.229 |
| 2017-05-05 | 116.599 |
| 2017-05-06 | 114.791 |
| 2017-05-07 | 110.732 |
| 2017-05-08 | 107.271 |
| 2017-05-09 | 105.52 |
| 2017-05-10 | 105.155 |
| 2017-05-11 | 105.243 |
| 2017-05-12 | 102.164 |
| 2017-05-13 | 97.956 |
| 2017-05-14 | 95.08 |
| 2017-05-15 | 93.634 |
| 2017-05-16 | 93.26 |
| 2017-05-17 | 92.791 |
| 2017-05-18 | 92.493 |
| 2017-05-19 | 89.918 |
| 2017-05-20 | 86.042 |
| 2017-05-21 | 83.512 |
| 2017-05-22 | 84.048 |
| 2017-05-23 | 87.316 |
| 2017-05-24 | 88.623 |
| 2017-05-25 | 91.444 |
| 2017-05-26 | 95.641 |
| 2017-05-27 | 97.177 |
| 2017-05-28 | 95.851 |
| 2017-05-29 | 96.492 |
| 2017-05-30 | 99.499 |
| 2017-05-31 | 100.548 |
| 2017-06-01 | 99.346 |
| 2017-06-02 | 98.641 |
| 2017-06-03 | 98.136 |
| 2017-06-04 | 98.454 |
| 2017-06-05 | 105.346 |
| 2017-06-06 | 112.187 |
| 2017-06-07 | 117.959 |
| 2017-06-08 | 121.463 |
| 2017-06-09 | 121.373 |
| 2017-06-10 | 120.277 |
| 2017-06-11 | 119.328 |
| 2017-06-12 | 123.129 |
| 2017-06-13 | 125.443 |
| 2017-06-14 | 125.508 |
| 2017-06-15 | 126.611 |
| 2017-06-16 | 126.884 |
| 2017-06-17 | 126.006 |
| 2017-06-18 | 126.722 |
| 2017-06-19 | 130.339 |
| 2017-06-20 | 135.317 |
| 2017-06-21 | 136.542 |
| 2017-06-22 | 138.912 |
| 2017-06-23 | 136.424 |
| 2017-06-24 | 134.574 |
| 2017-06-25 | 129.475 |
| 2017-06-26 | 128.735 |
| 2017-06-27 | 129.385 |
| 2017-06-28 | 129.61 |
| 2017-06-29 | 128.783 |
| 2017-06-30 | 126.945 |
| 2017-07-01 | 127.138 |
| 2017-07-02 | 126.404 |
| 2017-07-03 | 127.73 |
| 2017-07-04 | 127.466 |
| 2017-07-05 | 125.209 |
| 2017-07-06 | 123.539 |
| 2017-07-07 | 119.198 |
| 2017-07-08 | 116.455 |
| 2017-07-09 | 116.185 |
| 2017-07-10 | 117.217 |
| 2017-07-11 | 119.284 |
| 2017-07-12 | 117.604 |
| 2017-07-13 | 115.882 |
| 2017-07-14 | 116.406 |
| 2017-07-15 | 113.986 |
| 2017-07-16 | 111.935 |
| 2017-07-17 | 113.355 |
| 2017-07-18 | 114.804 |
| 2017-07-19 | 111.338 |
| 2017-07-20 | 108.357 |
| 2017-07-21 | 105.019 |
| 2017-07-22 | 101.167 |
| 2017-07-23 | 101.601 |
| 2017-07-24 | 100.347 |
| 2017-07-25 | 101.517 |
| 2017-07-26 | 101.408 |
| 2017-07-27 | 101.445 |
| 2017-07-28 | 101.572 |
| 2017-07-29 | 100.336 |
| 2017-07-30 | 99.293 |
| 2017-07-31 | 101.769 |
| 2017-08-01 | 106.163 |
| 2017-08-02 | 106.987 |
| 2017-08-03 | 108.916 |
| 2017-08-04 | 105.138 |
| 2017-08-05 | 101.819 |
| 2017-08-06 | 100.56 |
| 2017-08-07 | 101.468 |
| 2017-08-08 | 103.353 |
| 2017-08-09 | 104.629 |
| 2017-08-10 | 108.056 |
| 2017-08-11 | 109.767 |
| 2017-08-12 | 113.985 |
| 2017-08-13 | 113.414 |
| 2017-08-14 | 118.989 |
| 2017-08-15 | 125.265 |
| 2017-08-16 | 126.778 |
| 2017-08-17 | 125.517 |
| 2017-08-18 | 127.913 |
| 2017-08-19 | 128.316 |
| 2017-08-20 | 128.104 |
| 2017-08-21 | 130.857 |
| 2017-08-22 | 135.179 |
| 2017-08-23 | 138.379 |
| 2017-08-24 | 138.215 |
| 2017-08-25 | 136.933 |
| 2017-08-26 | 137.693 |
| 2017-08-27 | 136.071 |
| 2017-08-28 | 138.075 |
| 2017-08-29 | 138.561 |
| 2017-08-30 | 137.624 |
| 2017-08-31 | 135.068 |
| 2017-09-01 | 134.681 |
| 2017-09-02 | 132.411 |
| 2017-09-03 | 131.129 |
| 2017-09-04 | 136.979 |
| 2017-09-05 | 140.653 |
| 2017-09-06 | 143.138 |
| 2017-09-07 | 142.569 |
| 2017-09-08 | 142.45 |
| 2017-09-09 | 136.777 |
| 2017-09-10 | 134.928 |
| 2017-09-11 | 130.988 |
| 2017-09-12 | 132.626 |
| 2017-09-13 | 130.499 |
| 2017-09-14 | 125.58 |
| 2017-09-15 | 124.271 |
| 2017-09-16 | 124.335 |
| 2017-09-17 | 122.669 |
| 2017-09-18 | 124.199 |
| 2017-09-19 | 126.064 |
| 2017-09-20 | 125.586 |
| 2017-09-21 | 121.905 |
| 2017-09-22 | 120.511 |
| 2017-09-23 | 120.531 |
| 2017-09-24 | 120.885 |
| 2017-09-25 | 118.398 |
| 2017-09-26 | 120.67 |
| 2017-09-27 | 120.861 |
| 2017-09-28 | 123.01 |
| 2017-09-29 | 120.659 |
| 2017-09-30 | 118.731 |
| 2017-10-01 | 116.296 |
| 2017-10-02 | 119.002 |
| 2017-10-03 | 120.111 |
| 2017-10-04 | 115.297 |
| 2017-10-05 | 111.823 |
| 2017-10-06 | 110.122 |
| 2017-10-07 | 107.679 |
| 2017-10-08 | 106.446 |
| 2017-10-09 | 106.986 |
| 2017-10-10 | 107.184 |
| 2017-10-11 | 108.902 |
| 2017-10-12 | 107.596 |
| 2017-10-13 | 105.245 |
| 2017-10-14 | 105.342 |
| 2017-10-15 | 104.624 |
| 2017-10-16 | 104.832 |
| 2017-10-17 | 105.469 |
| 2017-10-18 | 103.644 |
| 2017-10-19 | 103.356 |
| 2017-10-20 | 100.331 |
| 2017-10-21 | 97.711 |
| 2017-10-22 | 95.341 |
| 2017-10-23 | 95.612 |
| 2017-10-24 | 96.042 |
| 2017-10-25 | 98.165 |
| 2017-10-26 | 96.51 |
| 2017-10-27 | 95.269 |
| 2017-10-28 | 92.335 |
| 2017-10-29 | 91.585 |
| 2017-10-30 | 92.704 |
| 2017-10-31 | 92.957 |
| 2017-11-01 | 90.523 |
| 2017-11-02 | 93.788 |
| 2017-11-03 | 93.106 |
| 2017-11-04 | 91.772 |
| 2017-11-05 | 90.239 |
| 2017-11-06 | 92.011 |
| 2017-11-07 | 92.605 |
| 2017-11-08 | 96.597 |
| 2017-11-09 | 97.052 |
| 2017-11-10 | 96.796 |
| 2017-11-11 | 95.66 |
| 2017-11-12 | 95.367 |
| 2017-11-13 | 95.212 |
| 2017-11-14 | 95.649 |
| 2017-11-15 | 94.346 |
| 2017-11-16 | 94.721 |
| 2017-11-17 | 92.429 |
| 2017-11-18 | 89.293 |
| 2017-11-19 | 88.91 |
| 2017-11-20 | 88.778 |
| 2017-11-21 | 92.393 |
| 2017-11-22 | 93.707 |
| 2017-11-23 | 91.658 |
| 2017-11-24 | 90.159 |
| 2017-11-25 | 89.221 |
| 2017-11-26 | 86.607 |
| 2017-11-27 | 90.002 |
| 2017-11-28 | 91.729 |
| 2017-11-29 | 91.81 |
| 2017-11-30 | 93.254 |
| 2017-12-01 | 94.393 |
| 2017-12-02 | 88.829 |
| 2017-12-03 | 87.043 |
| 2017-12-04 | 87.727 |
| 2017-12-05 | 88.652 |
| 2017-12-06 | 87.869 |
| 2017-12-07 | 86.238 |
| 2017-12-08 | 83.172 |
| 2017-12-09 | 81.365 |
| 2017-12-10 | 80.99 |
| 2017-12-11 | 84.018 |
| 2017-12-12 | 85.289 |
| 2017-12-13 | 85.196 |
| 2017-12-14 | 84.944 |
| 2017-12-15 | 85.579 |
| 2017-12-16 | 82.847 |
| 2017-12-17 | 82.981 |
| 2017-12-18 | 84.329 |
| 2017-12-19 | 84.924 |
| 2017-12-20 | 86.125 |
| 2017-12-21 | 84.435 |
| 2017-12-22 | 81.986 |
| 2017-12-23 | 82.604 |
| 2017-12-24 | 83.117 |
| 2017-12-25 | 83.717 |
| 2017-12-26 | 86.434 |
| 2017-12-27 | 84.813 |
| 2017-12-28 | 85.714 |
| 2017-12-29 | 86.438 |
| 2017-12-30 | 85.845 |
| 2017-12-31 | 83.766 |
| 2018-01-01 | 86.272 |
| 2018-01-02 | 91.407 |
| 2018-01-03 | 93.861 |
| 2018-01-04 | 94.298 |
| 2018-01-05 | 92.881 |
| 2018-01-06 | 93.359 |
| 2018-01-07 | 91.405 |
| 2018-01-08 | 92.297 |
| 2018-01-09 | 91.657 |
| 2018-01-10 | 89.291 |
| 2018-01-11 | 89.219 |
| 2018-01-12 | 92.127 |
| 2018-01-13 | 91.451 |
| 2018-01-14 | 90.526 |
| 2018-01-15 | 91.248 |
| 2018-01-16 | 91.43 |
| 2018-01-17 | 93.459 |
| 2018-01-18 | 93.598 |
| 2018-01-19 | 93.9 |
| 2018-01-20 | 93.061 |
| 2018-01-21 | 93.105 |
| 2018-01-22 | 95.199 |
| 2018-01-23 | 96.515 |
| 2018-01-24 | 98.606 |
| 2018-01-25 | 98.091 |
| 2018-01-26 | 96.434 |
| 2018-01-27 | 93.593 |
| 2018-01-28 | 90.624 |
| 2018-01-29 | 90.045 |
| 2018-01-30 | 91.653 |
| 2018-01-31 | 91.847 |
| 2018-02-01 | 87.302 |
| 2018-02-02 | 83.734 |
| 2018-02-03 | 81.256 |
| 2018-02-04 | 80.82 |
| 2018-02-05 | 81.007 |
| 2018-02-06 | 81.883 |
| 2018-02-07 | 81.692 |
| 2018-02-08 | 82.237 |
| 2018-02-09 | 82.25 |
| 2018-02-10 | 80.279 |
| 2018-02-11 | 76.184 |
| 2018-02-12 | 77.541 |
| 2018-02-13 | 77.881 |
| 2018-02-14 | 77.165 |
| 2018-02-15 | 77.53 |
| 2018-02-16 | 75.025 |
| 2018-02-17 | 73.962 |
| 2018-02-18 | 72.719 |
| 2018-02-19 | 73.472 |
| 2018-02-20 | 74.141 |
| 2018-02-21 | 72.211 |
| 2018-02-22 | 69.704 |
| 2018-02-23 | 67.657 |
| 2018-02-24 | 66.534 |
| 2018-02-25 | 65.58 |
| 2018-02-26 | 67.151 |
| 2018-02-27 | 68.255 |
| 2018-02-28 | 68.044 |
| 2018-03-01 | 67.971 |
| 2018-03-02 | 69.601 |
| 2018-03-03 | 69.428 |
| 2018-03-04 | 70.254 |
| 2018-03-05 | 71.459 |
| 2018-03-06 | 72.626 |
| 2018-03-07 | 74.28 |
| 2018-03-08 | 75.925 |
| 2018-03-09 | 76.75 |
| 2018-03-10 | 77.189 |
| 2018-03-11 | 77.207 |
| 2018-03-12 | 80.524 |
| 2018-03-13 | 83.022 |
| 2018-03-14 | 82.038 |
| 2018-03-15 | 85.904 |
| 2018-03-16 | 90.432 |
| 2018-03-17 | 91.001 |
| 2018-03-18 | 91.285 |
| 2018-03-19 | 92.761 |
| 2018-03-20 | 95.093 |
| 2018-03-21 | 97.75 |
| 2018-03-22 | 100.106 |
| 2018-03-23 | 100.506 |
| 2018-03-24 | 103.668 |
| 2018-03-25 | 102.991 |
| 2018-03-26 | 104.077 |
| 2018-03-27 | 105.863 |
| 2018-03-28 | 105.901 |
| 2018-03-29 | 109.612 |
| 2018-03-30 | 108.89 |
| 2018-03-31 | 109.764 |
| 2018-04-01 | 106.215 |
| 2018-04-02 | 109.286 |
| 2018-04-03 | 110.95 |
| 2018-04-04 | 109.701 |
| 2018-04-05 | 109.056 |
| 2018-04-06 | 107.933 |
| 2018-04-07 | 107.784 |
| 2018-04-08 | 107.224 |
| 2018-04-09 | 107.076 |
| 2018-04-10 | 111.764 |
| 2018-04-11 | 110.651 |
| 2018-04-12 | 116.548 |
| 2018-04-13 | 117.302 |
| 2018-04-14 | 114.177 |
| 2018-04-15 | 111.604 |
| 2018-04-16 | 115.188 |
| 2018-04-17 | 119.079 |
| 2018-04-18 | 123.718 |
| 2018-04-19 | 126.363 |
| 2018-04-20 | 123.023 |
| 2018-04-21 | 119.223 |
| 2018-04-22 | 117.396 |
| 2018-04-23 | 115.392 |
| 2018-04-24 | 118.591 |
| 2018-04-25 | 122.316 |
| 2018-04-26 | 124.164 |
| 2018-04-27 | 124.173 |
| 2018-04-28 | 121.403 |
| 2018-04-29 | 121.539 |
| 2018-04-30 | 122.027 |
| 2018-05-01 | 125.71 |
| 2018-05-02 | 127.29 |
| 2018-05-03 | 127.944 |
| 2018-05-04 | 130.222 |
| 2018-05-05 | 130.068 |
| 2018-05-06 | 127.483 |
| 2018-05-07 | 126.752 |
| 2018-05-08 | 128.117 |
| 2018-05-09 | 134.183 |
| 2018-05-10 | 134.853 |
| 2018-05-11 | 136.891 |
| 2018-05-12 | 130.336 |
| 2018-05-13 | 129.693 |
| 2018-05-14 | 130.696 |
| 2018-05-15 | 131.246 |
| 2018-05-16 | 129.789 |
| 2018-05-17 | 128.933 |
| 2018-05-18 | 124.203 |
| 2018-05-19 | 118.917 |
| 2018-05-20 | 117.722 |
| 2018-05-21 | 120.31 |
| 2018-05-22 | 122.061 |
| 2018-05-23 | 125.082 |
| 2018-05-24 | 125.183 |
| 2018-05-25 | 123.431 |
| 2018-05-26 | 122.162 |
| 2018-05-27 | 121.914 |
| 2018-05-28 | 122.207 |
| 2018-05-29 | 122.829 |
| 2018-05-30 | 123.074 |
| 2018-05-31 | 120.967 |
| 2018-06-01 | 120.954 |
| 2018-06-02 | 119.8 |
| 2018-06-03 | 116.985 |
| 2018-06-04 | 119.707 |
| 2018-06-05 | 124.877 |
| 2018-06-06 | 125.84 |
| 2018-06-07 | 124.619 |
| 2018-06-08 | 119.018 |
| 2018-06-09 | 113.895 |
| 2018-06-10 | 111.489 |
| 2018-06-11 | 112.66 |
| 2018-06-12 | 114.579 |
| 2018-06-13 | 115.083 |
| 2018-06-14 | 117.612 |
| 2018-06-15 | 114.925 |
| 2018-06-16 | 114.021 |
| 2018-06-17 | 111.757 |
| 2018-06-18 | 111.475 |
| 2018-06-19 | 113.614 |
| 2018-06-20 | 113.47 |
| 2018-06-21 | 113.862 |
| 2018-06-22 | 109.8 |
| 2018-06-23 | 105.67 |
| 2018-06-24 | 102.581 |
| 2018-06-25 | 101.9 |
| 2018-06-26 | 103.663 |
| 2018-06-27 | 104.597 |
| 2018-06-28 | 105.171 |
| 2018-06-29 | 105.142 |
| 2018-06-30 | 103.357 |
| 2018-07-01 | 99.126 |
| 2018-07-02 | 100.203 |
| 2018-07-03 | 103.278 |
| 2018-07-04 | 100.047 |
| 2018-07-05 | 98.099 |
| 2018-07-06 | 98.756 |
| 2018-07-07 | 98.553 |
| 2018-07-08 | 96.95 |
| 2018-07-09 | 99.975 |
| 2018-07-10 | 100.99 |
| 2018-07-11 | 100.665 |
| 2018-07-12 | 101.231 |
| 2018-07-13 | 100.718 |
| 2018-07-14 | 97.866 |
| 2018-07-15 | 99.02 |
| 2018-07-16 | 100.46 |
| 2018-07-17 | 103.002 |
| 2018-07-18 | 104.385 |
| 2018-07-19 | 105.84 |
| 2018-07-20 | 103.598 |
| 2018-07-21 | 104.54 |
| 2018-07-22 | 105.054 |
| 2018-07-23 | 109.455 |
| 2018-07-24 | 113.229 |
| 2018-07-25 | 113.808 |
| 2018-07-26 | 112.829 |
| 2018-07-27 | 112.454 |
| 2018-07-28 | 110.788 |
| 2018-07-29 | 106.87 |
| 2018-07-30 | 109.545 |
| 2018-07-31 | 111.234 |
| 2018-08-01 | 111.801 |
| 2018-08-02 | 110.969 |
| 2018-08-03 | 114.258 |
| 2018-08-04 | 113.095 |
| 2018-08-05 | 110.615 |
| 2018-08-06 | 113.278 |
| 2018-08-07 | 117.691 |
| 2018-08-08 | 116.311 |
| 2018-08-09 | 117.944 |
| 2018-08-10 | 117.834 |
| 2018-08-11 | 117.286 |
| 2018-08-12 | 115.962 |
| 2018-08-13 | 117.279 |
| 2018-08-14 | 118.339 |
| 2018-08-15 | 116.427 |
| 2018-08-16 | 117.339 |
| 2018-08-17 | 117.958 |
| 2018-08-18 | 115.02 |
| 2018-08-19 | 115.12 |
| 2018-08-20 | 114.62 |
| 2018-08-21 | 117.263 |
| 2018-08-22 | 115.851 |
| 2018-08-23 | 114.489 |
| 2018-08-24 | 112.466 |
| 2018-08-25 | 111.304 |
| 2018-08-26 | 108.772 |
| 2018-08-27 | 111.138 |
| 2018-08-28 | 114.836 |
| 2018-08-29 | 115.538 |
| 2018-08-30 | 114.745 |
| 2018-08-31 | 112.145 |
| 2018-09-01 | 110.758 |
| 2018-09-02 | 107.466 |
| 2018-09-03 | 107.782 |
| 2018-09-04 | 106.463 |
| 2018-09-05 | 103.909 |
| 2018-09-06 | 100.484 |
| 2018-09-07 | 99.111 |
| 2018-09-08 | 95.402 |
| 2018-09-09 | 92.922 |
| 2018-09-10 | 89.554 |
| 2018-09-11 | 89.424 |
| 2018-09-12 | 87.372 |
| 2018-09-13 | 85.111 |
| 2018-09-14 | 85.341 |
| 2018-09-15 | 83.183 |
| 2018-09-16 | 79.853 |
| 2018-09-17 | 81.058 |
| 2018-09-18 | 82.655 |
| 2018-09-19 | 81.047 |
| 2018-09-20 | 79.578 |
| 2018-09-21 | 79.393 |
| 2018-09-22 | 76.644 |
| 2018-09-23 | 76.094 |
| 2018-09-24 | 78.442 |
| 2018-09-25 | 80.177 |
| 2018-09-26 | 80.2 |
| 2018-09-27 | 78.175 |
| 2018-09-28 | 76.227 |
| 2018-09-29 | 74.823 |
| 2018-09-30 | 73.963 |
| 2018-10-01 | 75.314 |
| 2018-10-02 | 74.877 |
| 2018-10-03 | 74.885 |
| 2018-10-04 | 76.707 |
| 2018-10-05 | 76.45 |
| 2018-10-06 | 74.884 |
| 2018-10-07 | 73.374 |
| 2018-10-08 | 73.023 |
| 2018-10-09 | 74.635 |
| 2018-10-10 | 76.261 |
| 2018-10-11 | 77.89 |
| 2018-10-12 | 78.096 |
| 2018-10-13 | 77.413 |
| 2018-10-14 | 76.196 |
| 2018-10-15 | 78.178 |
| 2018-10-16 | 82.424 |
| 2018-10-17 | 83.315 |
| 2018-10-18 | 84.05 |
| 2018-10-19 | 85.636 |
| 2018-10-20 | 84.913 |
| 2018-10-21 | 82.289 |
| 2018-10-22 | 83.826 |
| 2018-10-23 | 86.522 |
| 2018-10-24 | 85.993 |
| 2018-10-25 | 87.514 |
| 2018-10-26 | 89.145 |
| 2018-10-27 | 89.837 |
| 2018-10-28 | 88.824 |
| 2018-10-29 | 90.501 |
| 2018-10-30 | 92.951 |
| 2018-10-31 | 91.643 |
| 2018-11-01 | 93.825 |
| 2018-11-02 | 94.124 |
| 2018-11-03 | 93.421 |
| 2018-11-04 | 92.291 |
| 2018-11-05 | 94.423 |
| 2018-11-06 | 95.091 |
| 2018-11-07 | 98.135 |
| 2018-11-08 | 96.966 |
| 2018-11-09 | 97.306 |
| 2018-11-10 | 94.202 |
| 2018-11-11 | 92.053 |
| 2018-11-12 | 91.875 |
| 2018-11-13 | 93.891 |
| 2018-11-14 | 90.908 |
| 2018-11-15 | 89.983 |
| 2018-11-16 | 87.54 |
| 2018-11-17 | 84.825 |
| 2018-11-18 | 82.444 |
| 2018-11-19 | 81.426 |
| 2018-11-20 | 82.191 |
| 2018-11-21 | 82.214 |
| 2018-11-22 | 80.536 |
| 2018-11-23 | 80.793 |
| 2018-11-24 | 78.426 |
| 2018-11-25 | 75.196 |
| 2018-11-26 | 75.423 |
| 2018-11-27 | 78.051 |
| 2018-11-28 | 78.269 |
| 2018-11-29 | 77.811 |
| 2018-11-30 | 79.833 |
| 2018-12-01 | 78.224 |
| 2018-12-02 | 75.491 |
| 2018-12-03 | 75.567 |
| 2018-12-04 | 77.411 |
| 2018-12-05 | 77.035 |
| 2018-12-06 | 79.324 |
| 2018-12-07 | 81.179 |
| 2018-12-08 | 81.711 |
| 2018-12-09 | 79.085 |
| 2018-12-10 | 80.864 |
| 2018-12-11 | 83.29 |
| 2018-12-12 | 84.732 |
| 2018-12-13 | 84.394 |
| 2018-12-14 | 87.284 |
| 2018-12-15 | 86.282 |
| 2018-12-16 | 86.106 |
| 2018-12-17 | 87.013 |
| 2018-12-18 | 88.26 |
| 2018-12-19 | 88.482 |
| 2018-12-20 | 91.971 |
| 2018-12-21 | 96.16 |
| 2018-12-22 | 96.347 |
| 2018-12-23 | 94.563 |
| 2018-12-24 | 95.936 |
| 2018-12-25 | 96.049 |
| 2018-12-26 | 94.777 |
| 2018-12-27 | 91.454 |
| 2018-12-28 | 91.492 |
| 2018-12-29 | 90.231 |
| 2018-12-30 | 86.577 |
| 2018-12-31 | 87.694 |
| 2019-01-01 | 89.771 |
| 2019-01-02 | 94.427 |
| 2019-01-03 | 91.421 |
| 2019-01-04 | 91.276 |
| 2019-01-05 | 88.249 |
| 2019-01-06 | 83.063 |
| 2019-01-07 | 83.276 |
| 2019-01-08 | 84.352 |
| 2019-01-09 | 84.868 |
| 2019-01-10 | 84.249 |
| 2019-01-11 | 84.758 |
| 2019-01-12 | 82.078 |
| 2019-01-13 | 79.333 |
| 2019-01-14 | 79.749 |
| 2019-01-15 | 81.859 |
| 2019-01-16 | 82.524 |
| 2019-01-17 | 85.471 |
| 2019-01-18 | 87.154 |
| 2019-01-19 | 82.475 |
| 2019-01-20 | 77.059 |
| 2019-01-21 | 77.284 |
| 2019-01-22 | 79.383 |
| 2019-01-23 | 77.615 |
| 2019-01-24 | 78.472 |
| 2019-01-25 | 79.407 |
| 2019-01-26 | 79.737 |
| 2019-01-27 | 78.858 |
| 2019-01-28 | 80.29 |
| 2019-01-29 | 82.586 |
| 2019-01-30 | 85.486 |
| 2019-01-31 | 87.633 |
| 2019-02-01 | 85.09 |
| 2019-02-02 | 87.301 |
| 2019-02-03 | 86.743 |
| 2019-02-04 | 91.393 |
| 2019-02-05 | 93.59 |
| 2019-02-06 | 94.254 |
| 2019-02-07 | 95.074 |
| 2019-02-08 | 93.605 |
| 2019-02-09 | 92.055 |
| 2019-02-10 | 89.986 |
| 2019-02-11 | 91.478 |
| 2019-02-12 | 92.528 |
| 2019-02-13 | 92.51 |
| 2019-02-14 | 91.643 |
| 2019-02-15 | 93.388 |
| 2019-02-16 | 90.088 |
| 2019-02-17 | 89.202 |
| 2019-02-18 | 90.696 |
| 2019-02-19 | 92.987 |
| 2019-02-20 | 96.339 |
| 2019-02-21 | 95.398 |
| 2019-02-22 | 95.773 |
| 2019-02-23 | 94.292 |
| 2019-02-24 | 93.754 |
| 2019-02-25 | 97.05 |
| 2019-02-26 | 98.693 |
| 2019-02-27 | 100.673 |
| 2019-02-28 | 102.713 |
| 2019-03-01 | 103.073 |
| 2019-03-02 | 102.526 |
| 2019-03-03 | 101.333 |
| 2019-03-04 | 100.903 |
| 2019-03-05 | 101.598 |
| 2019-03-06 | 98.299 |
| 2019-03-07 | 97.788 |
| 2019-03-08 | 96.185 |
| 2019-03-09 | 95.823 |
| 2019-03-10 | 94.518 |
| 2019-03-11 | 95.004 |
| 2019-03-12 | 97.076 |
| 2019-03-13 | 97.7 |
| 2019-03-14 | 97.615 |
| 2019-03-15 | 96.695 |
| 2019-03-16 | 96.863 |
| 2019-03-17 | 93.112 |
| 2019-03-18 | 93.721 |
| 2019-03-19 | 94.428 |
| 2019-03-20 | 94.2 |
| 2019-03-21 | 93.277 |
| 2019-03-22 | 91.66 |
| 2019-03-23 | 90.366 |
| 2019-03-24 | 90.292 |
| 2019-03-25 | 90.441 |
| 2019-03-26 | 90.899 |
| 2019-03-27 | 88.962 |
| 2019-03-28 | 87.51 |
| 2019-03-29 | 84.747 |
| 2019-03-30 | 81.567 |
| 2019-03-31 | 76.161 |
| 2019-04-01 | 73.951 |
| 2019-04-02 | 73.381 |
| 2019-04-03 | 74.081 |
| 2019-04-04 | 73.064 |
| 2019-04-05 | 72.737 |
| 2019-04-06 | 71.654 |
| 2019-04-07 | 70.337 |
| 2019-04-08 | 70.845 |
| 2019-04-09 | 75.655 |
| 2019-04-10 | 76.704 |
| 2019-04-11 | 76.8 |
| 2019-04-12 | 76.412 |
| 2019-04-13 | 76.893 |
| 2019-04-14 | 76.585 |
| 2019-04-15 | 75.754 |
| 2019-04-16 | 78.817 |
| 2019-04-17 | 78.41 |
| 2019-04-18 | 76.648 |
| 2019-04-19 | 76.349 |
| 2019-04-20 | 74.927 |
| 2019-04-21 | 73.731 |
| 2019-04-22 | 74.338 |
| 2019-04-23 | 77.315 |
| 2019-04-24 | 78.544 |
| 2019-04-25 | 78.908 |
| 2019-04-26 | 80.53 |
| 2019-04-27 | 79.609 |
| 2019-04-28 | 78.01 |
| 2019-04-29 | 78.063 |
| 2019-04-30 | 78.964 |
| 2019-05-01 | 78.833 |
| 2019-05-02 | 83.023 |
| 2019-05-03 | 82.562 |
| 2019-05-04 | 81.87 |
| 2019-05-05 | 82.607 |
| 2019-05-06 | 85.154 |
| 2019-05-07 | 88.72 |
| 2019-05-08 | 87.383 |
| 2019-05-09 | 87.37 |
| 2019-05-10 | 89.357 |
| 2019-05-11 | 87.759 |
| 2019-05-12 | 85.344 |
| 2019-05-13 | 87.006 |
| 2019-05-14 | 93.566 |
| 2019-05-15 | 97.836 |
| 2019-05-16 | 98.972 |
| 2019-05-17 | 101.416 |
| 2019-05-18 | 102.32 |
| 2019-05-19 | 102.518 |
| 2019-05-20 | 104.404 |
| 2019-05-21 | 105.879 |
| 2019-05-22 | 105.787 |
| 2019-05-23 | 103.988 |
| 2019-05-24 | 106.002 |
| 2019-05-25 | 104.819 |
| 2019-05-26 | 101.824 |
| 2019-05-27 | 101.478 |
| 2019-05-28 | 102.803 |
| 2019-05-29 | 102.76 |
| 2019-05-30 | 105.121 |
| 2019-05-31 | 106.556 |
| 2019-06-01 | 104.684 |
| 2019-06-02 | 103.312 |
| 2019-06-03 | 105.893 |
| 2019-06-04 | 105.096 |
| 2019-06-05 | 104.676 |
| 2019-06-06 | 103.357 |
| 2019-06-07 | 103.796 |
| 2019-06-08 | 99.921 |
| 2019-06-09 | 97.186 |
| 2019-06-10 | 97.209 |
| 2019-06-11 | 98.646 |
| 2019-06-12 | 97.448 |
| 2019-06-13 | 92.981 |
| 2019-06-14 | 93.244 |
| 2019-06-15 | 91.568 |
| 2019-06-16 | 88.949 |
| 2019-06-17 | 90.438 |
| 2019-06-18 | 93.788 |
| 2019-06-19 | 94.878 |
| 2019-06-20 | 92.924 |
| 2019-06-21 | 94.018 |
| 2019-06-22 | 96.183 |
| 2019-06-23 | 94.536 |
| 2019-06-24 | 98.107 |
| 2019-06-25 | 99.517 |
| 2019-06-26 | 102.198 |
| 2019-06-27 | 104.381 |
| 2019-06-28 | 107.26 |
| 2019-06-29 | 106.029 |
| 2019-06-30 | 103.332 |
| 2019-07-01 | 102.744 |
| 2019-07-02 | 106.385 |
| 2019-07-03 | 104.304 |
| 2019-07-04 | 105.518 |
| 2019-07-05 | 104.717 |
| 2019-07-06 | 103.687 |
| 2019-07-07 | 103.09 |
| 2019-07-08 | 103.178 |
| 2019-07-09 | 104.603 |
| 2019-07-10 | 106.064 |
| 2019-07-11 | 107.577 |
| 2019-07-12 | 107.988 |
| 2019-07-13 | 106.757 |
| 2019-07-14 | 101.379 |
| 2019-07-15 | 98.806 |
| 2019-07-16 | 99.268 |
| 2019-07-17 | 99.964 |
| 2019-07-18 | 98.128 |
| 2019-07-19 | 95.236 |
| 2019-07-20 | 95.711 |
| 2019-07-21 | 93.545 |
| 2019-07-22 | 94.397 |
| 2019-07-23 | 95.729 |
| 2019-07-24 | 93.338 |
| 2019-07-25 | 93.085 |
| 2019-07-26 | 93.548 |
| 2019-07-27 | 91.144 |
| 2019-07-28 | 87.073 |
| 2019-07-29 | 88.884 |
| 2019-07-30 | 93.174 |
| 2019-07-31 | 92.412 |
| 2019-08-01 | 91.396 |
| 2019-08-02 | 92.868 |
| 2019-08-03 | 93.079 |
| 2019-08-04 | 93.646 |
| 2019-08-05 | 95.363 |
| 2019-08-06 | 102.66 |
| 2019-08-07 | 104.41 |
| 2019-08-08 | 106.009 |
| 2019-08-09 | 106.179 |
| 2019-08-10 | 105.211 |
| 2019-08-11 | 104.171 |
| 2019-08-12 | 106.631 |
| 2019-08-13 | 106.943 |
| 2019-08-14 | 109.433 |
| 2019-08-15 | 110.117 |
| 2019-08-16 | 108.696 |
| 2019-08-17 | 108.596 |
| 2019-08-18 | 109.925 |
| 2019-08-19 | 111.293 |
| 2019-08-20 | 111.815 |
| 2019-08-21 | 109.194 |
| 2019-08-22 | 109.484 |
| 2019-08-23 | 109.393 |
| 2019-08-24 | 109.114 |
| 2019-08-25 | 107.292 |
| 2019-08-26 | 109.238 |
| 2019-08-27 | 114.116 |
| 2019-08-28 | 112.311 |
| 2019-08-29 | 109.778 |
| 2019-08-30 | 108.315 |
| 2019-08-31 | 105.959 |
| 2019-09-01 | 103.444 |
| 2019-09-02 | 103.669 |
| 2019-09-03 | 102.614 |
| 2019-09-04 | 102.152 |
| 2019-09-05 | 95.821 |
| 2019-09-06 | 95.012 |
| 2019-09-07 | 90.823 |
| 2019-09-08 | 89.459 |
| 2019-09-09 | 88.866 |
| 2019-09-10 | 89.824 |
| 2019-09-11 | 88.064 |
| 2019-09-12 | 89.359 |
| 2019-09-13 | 88.185 |
| 2019-09-14 | 86.504 |
| 2019-09-15 | 85.496 |
| 2019-09-16 | 88.137 |
| 2019-09-17 | 93.627 |
| 2019-09-18 | 93.21 |
| 2019-09-19 | 95.892 |
| 2019-09-20 | 96.311 |
| 2019-09-21 | 94.064 |
| 2019-09-22 | 94.449 |
| 2019-09-23 | 94 |
| 2019-09-24 | 94.674 |
| 2019-09-25 | 94.771 |
| 2019-09-26 | 91.19 |
| 2019-09-27 | 91.343 |
| 2019-09-28 | 90.092 |
| 2019-09-29 | 90.601 |
| 2019-09-30 | 92.552 |
| 2019-10-01 | 94.372 |
| 2019-10-02 | 92.73 |
| 2019-10-03 | 91.488 |
| 2019-10-04 | 92.209 |
| 2019-10-05 | 91.313 |
| 2019-10-06 | 89.888 |
| 2019-10-07 | 91.021 |
| 2019-10-08 | 92.816 |
| 2019-10-09 | 93.136 |
| 2019-10-10 | 95.146 |
| 2019-10-11 | 98.665 |
| 2019-10-12 | 99.45 |
| 2019-10-13 | 100.26 |
| 2019-10-14 | 102.661 |
| 2019-10-15 | 103.785 |
| 2019-10-16 | 104.271 |
| 2019-10-17 | 99.652 |
| 2019-10-18 | 99.359 |
| 2019-10-19 | 97.894 |
| 2019-10-20 | 94.878 |
| 2019-10-21 | 95.308 |
| 2019-10-22 | 93.507 |
| 2019-10-23 | 94.99 |
| 2019-10-24 | 95.425 |
| 2019-10-25 | 95.984 |
| 2019-10-26 | 94.585 |
| 2019-10-27 | 91.905 |
| 2019-10-28 | 93.887 |
| 2019-10-29 | 95.019 |
| 2019-10-30 | 95.61 |
| 2019-10-31 | 95.377 |
| 2019-11-01 | 96.411 |
| 2019-11-02 | 96.889 |
| 2019-11-03 | 94.99 |
| 2019-11-04 | 95.159 |
| 2019-11-05 | 96.458 |
| 2019-11-06 | 97.553 |
| 2019-11-07 | 95.714 |
| 2019-11-08 | 96.263 |
| 2019-11-09 | 91.653 |
| 2019-11-10 | 86.696 |
| 2019-11-11 | 86.346 |
| 2019-11-12 | 85.265 |
| 2019-11-13 | 86.654 |
| 2019-11-14 | 85.911 |
| 2019-11-15 | 81.963 |
| 2019-11-16 | 80.446 |
| 2019-11-17 | 79.358 |
| 2019-11-18 | 79.222 |
| 2019-11-19 | 80.045 |
| 2019-11-20 | 80.328 |
| 2019-11-21 | 80.614 |
| 2019-11-22 | 79.522 |
| 2019-11-23 | 76.885 |
| 2019-11-24 | 73.938 |
| 2019-11-25 | 74.203 |
| 2019-11-26 | 76.297 |
| 2019-11-27 | 76.128 |
| 2019-11-28 | 74.228 |
| 2019-11-29 | 74.065 |
| 2019-11-30 | 73.709 |
| 2019-12-01 | 72.336 |
| 2019-12-02 | 72.905 |
| 2019-12-03 | 73.956 |
| 2019-12-04 | 73.57 |
| 2019-12-05 | 74.41 |
| 2019-12-06 | 74.506 |
| 2019-12-07 | 72.793 |
| 2019-12-08 | 70.744 |
| 2019-12-09 | 72.609 |
| 2019-12-10 | 73.299 |
| 2019-12-11 | 73.46 |
| 2019-12-12 | 74.636 |
| 2019-12-13 | 72.619 |
| 2019-12-14 | 71.369 |
| 2019-12-15 | 70.479 |
| 2019-12-16 | 71.335 |
| 2019-12-17 | 71.614 |
| 2019-12-18 | 71.948 |
| 2019-12-19 | 72.21 |
| 2019-12-20 | 70.463 |
| 2019-12-21 | 70.125 |
| 2019-12-22 | 68.829 |
| 2019-12-23 | 68.749 |
| 2019-12-24 | 68.941 |
| 2019-12-25 | 69.232 |
| 2019-12-26 | 68.355 |
| 2019-12-27 | 68.977 |
| 2019-12-28 | 69.741 |
| 2019-12-29 | 67.339 |
| 2019-12-30 | 69.211 |
| 2019-12-31 | 72.741 |
| 2020-01-01 | 73.963 |
| 2020-01-02 | 76.541 |
| 2020-01-03 | 77.645 |
| 2020-01-04 | 81.873 |
| 2020-01-05 | 85.56 |
| 2020-01-06 | 93.551 |
| 2020-01-07 | 106.084 |
| 2020-01-08 | 109.344 |
| 2020-01-09 | 119.949 |
| 2020-01-10 | 122.278 |
| 2020-01-11 | 123.027 |
| 2020-01-12 | 125.564 |
| 2020-01-13 | 129.045 |
| 2020-01-14 | 131.825 |
| 2020-01-15 | 133.779 |
| 2020-01-16 | 135.899 |
| 2020-01-17 | 136.256 |
| 2020-01-18 | 135.249 |
| 2020-01-19 | 136.709 |
| 2020-01-20 | 138.921 |
| 2020-01-21 | 142.052 |
| 2020-01-22 | 143.491 |
| 2020-01-23 | 144.653 |
| 2020-01-24 | 144.873 |
| 2020-01-25 | 144.504 |
| 2020-01-26 | 141.552 |
| 2020-01-27 | 141.921 |
| 2020-01-28 | 144.03 |
| 2020-01-29 | 141.31 |
| 2020-01-30 | 142.067 |
| 2020-01-31 | 140.715 |
| 2020-02-01 | 138.244 |
| 2020-02-02 | 136.922 |
| 2020-02-03 | 132.84 |
| 2020-02-04 | 130.985 |
| 2020-02-05 | 124.864 |
| 2020-02-06 | 114.103 |
| 2020-02-07 | 110.715 |
| 2020-02-08 | 98.605 |
| 2020-02-09 | 94.078 |
| 2020-02-10 | 90.898 |
| 2020-02-11 | 88.049 |
| 2020-02-12 | 85.025 |
| 2020-02-13 | 82.595 |
| 2020-02-14 | 80.45 |
| 2020-02-15 | 77.384 |
| 2020-02-16 | 75.504 |
| 2020-02-17 | 77.032 |
| 2020-02-18 | 76.702 |
| 2020-02-19 | 74.557 |
| 2020-02-20 | 74.289 |
| 2020-02-21 | 75.154 |
| 2020-02-22 | 74.629 |
| 2020-02-23 | 74.16 |
| 2020-02-24 | 75.754 |
| 2020-02-25 | 78.824 |
| 2020-02-26 | 79.844 |
| 2020-02-27 | 78.656 |
| 2020-02-28 | 78.927 |
| 2020-02-29 | 75.669 |
| 2020-03-01 | 74.992 |
| 2020-03-02 | 75.565 |
| 2020-03-03 | 78.294 |
| 2020-03-04 | 79.541 |
| 2020-03-05 | 77.394 |
| 2020-03-06 | 76.827 |
| 2020-03-07 | 75.948 |
| 2020-03-08 | 75.485 |
| 2020-03-09 | 76.873 |
| 2020-03-10 | 78.212 |
| 2020-03-11 | 80.42 |
| 2020-03-12 | 79.906 |
| 2020-03-13 | 80.107 |
| 2020-03-14 | 80.377 |
| 2020-03-15 | 78.473 |
| 2020-03-16 | 77.823 |
| 2020-03-17 | 78.678 |
| 2020-03-18 | 78.777 |
| 2020-03-19 | 78.969 |
| 2020-03-20 | 79.07 |
| 2020-03-21 | 77.358 |
| 2020-03-22 | 76.555 |
| 2020-03-23 | 78.016 |
| 2020-03-24 | 83.12 |
| 2020-03-25 | 82.201 |
| 2020-03-26 | 80.243 |
| 2020-03-27 | 78.561 |
| 2020-03-28 | 78.691 |
| 2020-03-29 | 82.111 |
| 2020-03-30 | 82.551 |
| 2020-03-31 | 83.737 |
| 2020-04-01 | 82.383 |
| 2020-04-02 | 79.868 |
| 2020-04-03 | 77.856 |
| 2020-04-04 | 77.766 |
| 2020-04-05 | 79.227 |
| 2020-04-06 | 80.396 |
| 2020-04-07 | 81.777 |
| 2020-04-08 | 81.957 |
| 2020-04-09 | 81.599 |
| 2020-04-10 | 81.416 |
| 2020-04-11 | 80.352 |
| 2020-04-12 | 79.506 |
| 2020-04-13 | 80.234 |
| 2020-04-14 | 82.204 |
| 2020-04-15 | 84.039 |
| 2020-04-16 | 82.351 |
| 2020-04-17 | 81.881 |
| 2020-04-18 | 80.37 |
| 2020-04-19 | 79.692 |
| 2020-04-20 | 78.557 |
| 2020-04-21 | 77.699 |
| 2020-04-22 | 78.235 |
| 2020-04-23 | 75.232 |
| 2020-04-24 | 74.981 |
| 2020-04-25 | 74.712 |
| 2020-04-26 | 74.341 |
| 2020-04-27 | 73.712 |
| 2020-04-28 | 71.643 |
| 2020-04-29 | 70.841 |
| 2020-04-30 | 69.764 |
| 2020-05-01 | 69.592 |
| 2020-05-02 | 70.337 |
| 2020-05-03 | 68.39 |
| 2020-05-04 | 67.826 |
| 2020-05-05 | 66.043 |
| 2020-05-06 | 65.425 |
| 2020-05-07 | 63.746 |
| 2020-05-08 | 63.488 |
| 2020-05-09 | 62.28 |
| 2020-05-10 | 60.821 |
| 2020-05-11 | 60.654 |
| 2020-05-12 | 60.545 |
| 2020-05-13 | 59.57 |
| 2020-05-14 | 59.269 |
| 2020-05-15 | 57.812 |
| 2020-05-16 | 57.929 |
| 2020-05-17 | 57.995 |
| 2020-05-18 | 61.037 |
| 2020-05-19 | 63.104 |
| 2020-05-20 | 65.565 |
| 2020-05-21 | 66.202 |
| 2020-05-22 | 66.148 |
| 2020-05-23 | 63.995 |
| 2020-05-24 | 63.059 |
| 2020-05-25 | 65.743 |
| 2020-05-26 | 68.389 |
| 2020-05-27 | 67.536 |
| 2020-05-28 | 66.381 |
| 2020-05-29 | 68.314 |
| 2020-05-30 | 69.223 |
| 2020-05-31 | 69.804 |
| 2020-06-01 | 69.269 |
| 2020-06-02 | 71.166 |
| 2020-06-03 | 72.997 |
| 2020-06-04 | 72.814 |
| 2020-06-05 | 73.787 |
| 2020-06-06 | 73.752 |
| 2020-06-07 | 73.431 |
| 2020-06-08 | 74.797 |
| 2020-06-09 | 75.683 |
| 2020-06-10 | 77.609 |
| 2020-06-11 | 79.208 |
| 2020-06-12 | 79.677 |
| 2020-06-13 | 78.902 |
| 2020-06-14 | 78.27 |
| 2020-06-15 | 79.967 |
| 2020-06-16 | 80.091 |
| 2020-06-17 | 80.634 |
| 2020-06-18 | 80.695 |
| 2020-06-19 | 79.166 |
| 2020-06-20 | 79.463 |
| 2020-06-21 | 76.391 |
| 2020-06-22 | 79.561 |
| 2020-06-23 | 80.849 |
| 2020-06-24 | 79.218 |
| 2020-06-25 | 76.566 |
| 2020-06-26 | 77.263 |
| 2020-06-27 | 76.216 |
| 2020-06-28 | 72.844 |
| 2020-06-29 | 71.636 |
| 2020-06-30 | 71.606 |
| 2020-07-01 | 73.404 |
| 2020-07-02 | 71.416 |
| 2020-07-03 | 69.064 |
| 2020-07-04 | 68.674 |
| 2020-07-05 | 66.912 |
| 2020-07-06 | 67.476 |
| 2020-07-07 | 68.986 |
| 2020-07-08 | 69.085 |
| 2020-07-09 | 68.669 |
| 2020-07-10 | 68.727 |
| 2020-07-11 | 66.516 |
| 2020-07-12 | 64.912 |
| 2020-07-13 | 66.041 |
| 2020-07-14 | 68.272 |
| 2020-07-15 | 68.299 |
| 2020-07-16 | 66.642 |
| 2020-07-17 | 62.873 |
| 2020-07-18 | 60.524 |
| 2020-07-19 | 59.845 |
| 2020-07-20 | 60.013 |
| 2020-07-21 | 62.438 |
| 2020-07-22 | 61.961 |
| 2020-07-23 | 62.683 |
| 2020-07-24 | 63.101 |
| 2020-07-25 | 62.933 |
| 2020-07-26 | 62.763 |
| 2020-07-27 | 66.348 |
| 2020-07-28 | 69.193 |
| 2020-07-29 | 70.29 |
| 2020-07-30 | 69.528 |
| 2020-07-31 | 67.221 |
| 2020-08-01 | 67.332 |
| 2020-08-02 | 66.712 |
| 2020-08-03 | 67.302 |
| 2020-08-04 | 67.022 |
| 2020-08-05 | 65.748 |
| 2020-08-06 | 65.955 |
| 2020-08-07 | 65.128 |
| 2020-08-08 | 64.174 |
| 2020-08-09 | 62.241 |
| 2020-08-10 | 62.891 |
| 2020-08-11 | 63.884 |
| 2020-08-12 | 62.854 |
| 2020-08-13 | 62.691 |
| 2020-08-14 | 60.711 |
| 2020-08-15 | 62.468 |
| 2020-08-16 | 63.33 |
| 2020-08-17 | 64.487 |
| 2020-08-18 | 66.175 |
| 2020-08-19 | 64.824 |
| 2020-08-20 | 65.017 |
| 2020-08-21 | 66.656 |
| 2020-08-22 | 65.893 |
| 2020-08-23 | 63.633 |
| 2020-08-24 | 64.817 |
| 2020-08-25 | 66.375 |
| 2020-08-26 | 65.324 |
| 2020-08-27 | 66.006 |
| 2020-08-28 | 65.446 |
| 2020-08-29 | 65.148 |
| 2020-08-30 | 64.14 |
| 2020-08-31 | 66.203 |
| 2020-09-01 | 68.904 |
| 2020-09-02 | 71.138 |
| 2020-09-03 | 72.656 |
| 2020-09-04 | 74.693 |
| 2020-09-05 | 72.851 |
| 2020-09-06 | 72.34 |
| 2020-09-07 | 76.417 |
| 2020-09-08 | 77.39 |
| 2020-09-09 | 77.614 |
| 2020-09-10 | 80.613 |
| 2020-09-11 | 83.417 |
| 2020-09-12 | 82.308 |
| 2020-09-13 | 83.69 |
| 2020-09-14 | 83.194 |
| 2020-09-15 | 84.92 |
| 2020-09-16 | 85.484 |
| 2020-09-17 | 86.017 |
| 2020-09-18 | 87.339 |
| 2020-09-19 | 84.777 |
| 2020-09-20 | 81.142 |
| 2020-09-21 | 81.068 |
| 2020-09-22 | 83.382 |
| 2020-09-23 | 83.08 |
| 2020-09-24 | 82.376 |
| 2020-09-25 | 80.698 |
| 2020-09-26 | 77.364 |
| 2020-09-27 | 77.295 |
| 2020-09-28 | 79.271 |
| 2020-09-29 | 82.497 |
| 2020-09-30 | 83.041 |
| 2020-10-01 | 82.029 |
| 2020-10-02 | 81.786 |
| 2020-10-03 | 80.125 |
| 2020-10-04 | 79.449 |
| 2020-10-05 | 79.776 |
| 2020-10-06 | 81.683 |
| 2020-10-07 | 79.474 |
| 2020-10-08 | 80.975 |
| 2020-10-09 | 82.117 |
| 2020-10-10 | 79.145 |
| 2020-10-11 | 75.643 |
| 2020-10-12 | 76.045 |
| 2020-10-13 | 75.79 |
| 2020-10-14 | 75.137 |
| 2020-10-15 | 74.871 |
| 2020-10-16 | 76.239 |
| 2020-10-17 | 74.443 |
| 2020-10-18 | 73.201 |
| 2020-10-19 | 74.87 |
| 2020-10-20 | 76.25 |
| 2020-10-21 | 76.887 |
| 2020-10-22 | 77.128 |
| 2020-10-23 | 77.246 |
| 2020-10-24 | 77.312 |
| 2020-10-25 | 77.033 |
| 2020-10-26 | 78.629 |
| 2020-10-27 | 80.908 |
| 2020-10-28 | 80.155 |
| 2020-10-29 | 79.637 |
| 2020-10-30 | 78.817 |
| 2020-10-31 | 76.734 |
| 2020-11-01 | 74.999 |
| 2020-11-02 | 75.406 |
| 2020-11-03 | 78.34 |
| 2020-11-04 | 80.428 |
| 2020-11-05 | 79.893 |
| 2020-11-06 | 79.215 |
| 2020-11-07 | 76.833 |
| 2020-11-08 | 75.61 |
| 2020-11-09 | 77.253 |
| 2020-11-10 | 77.843 |
| 2020-11-11 | 78.85 |
| 2020-11-12 | 78.009 |
| 2020-11-13 | 78.726 |
| 2020-11-14 | 76.253 |
| 2020-11-15 | 74.356 |
| 2020-11-16 | 75.169 |
| 2020-11-17 | 75.06 |
| 2020-11-18 | 75.545 |
| 2020-11-19 | 73.89 |
| 2020-11-20 | 74.628 |
| 2020-11-21 | 72.819 |
| 2020-11-22 | 72.256 |
| 2020-11-23 | 71.253 |
| 2020-11-24 | 73.164 |
| 2020-11-25 | 70.944 |
| 2020-11-26 | 68.9 |
| 2020-11-27 | 68.52 |
| 2020-11-28 | 68.56 |
| 2020-11-29 | 69.255 |
| 2020-11-30 | 70.365 |
| 2020-12-01 | 73.025 |
| 2020-12-02 | 74.213 |
| 2020-12-03 | 71.051 |
| 2020-12-04 | 68.021 |
| 2020-12-05 | 67.311 |
| 2020-12-06 | 67.347 |
| 2020-12-07 | 67.776 |
| 2020-12-08 | 68.913 |
| 2020-12-09 | 67.491 |
| 2020-12-10 | 68.719 |
| 2020-12-11 | 66.883 |
| 2020-12-12 | 66.82 |
| 2020-12-13 | 65.451 |
| 2020-12-14 | 65.318 |
| 2020-12-15 | 66.082 |
| 2020-12-16 | 65.48 |
| 2020-12-17 | 67.056 |
| 2020-12-18 | 66.065 |
| 2020-12-19 | 66.636 |
| 2020-12-20 | 63.792 |
| 2020-12-21 | 65.252 |
| 2020-12-22 | 65.714 |
| 2020-12-23 | 66.775 |
| 2020-12-24 | 65.132 |
| 2020-12-25 | 65.961 |
| 2020-12-26 | 65.379 |
| 2020-12-27 | 63.982 |
| 2020-12-28 | 62.334 |
| 2020-12-29 | 61.261 |
| 2020-12-30 | 61.672 |
| 2020-12-31 | 60.043 |
| 2021-01-01 | 59.143 |
| 2021-01-02 | 58.198 |
| 2021-01-03 | 57.544 |
| 2021-01-04 | 59.226 |
| 2021-01-05 | 61.818 |
| 2021-01-06 | 63.695 |
| 2021-01-07 | 62.817 |
| 2021-01-08 | 63.416 |
| 2021-01-09 | 63.055 |
| 2021-01-10 | 63.987 |
| 2021-01-11 | 64.947 |
| 2021-01-12 | 69.558 |
| 2021-01-13 | 70.73 |
| 2021-01-14 | 69.914 |
| 2021-01-15 | 70.055 |
| 2021-01-16 | 69.351 |
| 2021-01-17 | 69.062 |
| 2021-01-18 | 70.208 |
| 2021-01-19 | 72.235 |
| 2021-01-20 | 72.1 |
| 2021-01-21 | 71.532 |
| 2021-01-22 | 72.51 |
| 2021-01-23 | 72.558 |
| 2021-01-24 | 72.085 |
| 2021-01-25 | 75.305 |
| 2021-01-26 | 76.099 |
| 2021-01-27 | 77.135 |
| 2021-01-28 | 78.632 |
| 2021-01-29 | 78.727 |
| 2021-01-30 | 78.096 |
| 2021-01-31 | 76.716 |
| 2021-02-01 | 77.495 |
| 2021-02-02 | 83.268 |
| 2021-02-03 | 82.408 |
| 2021-02-04 | 80.418 |
| 2021-02-05 | 80.273 |
| 2021-02-06 | 80.618 |
| 2021-02-07 | 79.544 |
| 2021-02-08 | 79.274 |
| 2021-02-09 | 79.06 |
| 2021-02-10 | 78.874 |
| 2021-02-11 | 75.53 |
| 2021-02-12 | 75.929 |
| 2021-02-13 | 74.982 |
| 2021-02-14 | 73.936 |
| 2021-02-15 | 73.7 |
| 2021-02-16 | 74.537 |
| 2021-02-17 | 74.522 |
| 2021-02-18 | 73.381 |
| 2021-02-19 | 73.295 |
| 2021-02-20 | 72.566 |
| 2021-02-21 | 70.55 |
| 2021-02-22 | 70.858 |
| 2021-02-23 | 73.139 |
| 2021-02-24 | 70.769 |
| 2021-02-25 | 70.49 |
| 2021-02-26 | 71.997 |
| 2021-02-27 | 70.906 |
| 2021-02-28 | 71.07 |
| 2021-03-01 | 72.235 |
| 2021-03-02 | 76.066 |
| 2021-03-03 | 79.238 |
| 2021-03-04 | 75.905 |
| 2021-03-05 | 76.578 |
| 2021-03-06 | 75.776 |
| 2021-03-07 | 72.752 |
| 2021-03-08 | 72.778 |
| 2021-03-09 | 71.95 |
| 2021-03-10 | 71.411 |
| 2021-03-11 | 71.715 |
| 2021-03-12 | 70.954 |
| 2021-03-13 | 71.171 |
| 2021-03-14 | 70.067 |
| 2021-03-15 | 72.586 |
| 2021-03-16 | 75.572 |
| 2021-03-17 | 76.363 |
| 2021-03-18 | 77.876 |
| 2021-03-19 | 75.888 |
| 2021-03-20 | 75.69 |
| 2021-03-21 | 73.752 |
| 2021-03-22 | 77.123 |
| 2021-03-23 | 79.188 |
| 2021-03-24 | 79.509 |
| 2021-03-25 | 78.322 |
| 2021-03-26 | 78.169 |
| 2021-03-27 | 78.083 |
| 2021-03-28 | 76.692 |
| 2021-03-29 | 78.153 |
| 2021-03-30 | 79.268 |
| 2021-03-31 | 78.687 |
| 2021-04-01 | 76.42 |
| 2021-04-02 | 73.467 |
| 2021-04-03 | 73.456 |
| 2021-04-04 | 71.136 |
| 2021-04-05 | 71.828 |
| 2021-04-06 | 74.566 |
| 2021-04-07 | 76.399 |
| 2021-04-08 | 76.755 |
| 2021-04-09 | 76.42 |
| 2021-04-10 | 75.053 |
| 2021-04-11 | 74.981 |
| 2021-04-12 | 76.104 |
| 2021-04-13 | 77.794 |
| 2021-04-14 | 80.586 |
| 2021-04-15 | 80.341 |
| 2021-04-16 | 80.702 |
| 2021-04-17 | 79.347 |
| 2021-04-18 | 79.839 |
| 2021-04-19 | 82.732 |
| 2021-04-20 | 86.18 |
| 2021-04-21 | 87.787 |
| 2021-04-22 | 88.438 |
| 2021-04-23 | 91.025 |
| 2021-04-24 | 92.523 |
| 2021-04-25 | 90.657 |
| 2021-04-26 | 91.183 |
| 2021-04-27 | 93.221 |
| 2021-04-28 | 90.793 |
| 2021-04-29 | 88.659 |
| 2021-04-30 | 87.283 |
| 2021-05-01 | 86.794 |
| 2021-05-02 | 86.137 |
| 2021-05-03 | 86.471 |
| 2021-05-04 | 88.936 |
| 2021-05-05 | 88.275 |
| 2021-05-06 | 87.679 |
| 2021-05-07 | 85.681 |
| 2021-05-08 | 84.657 |
| 2021-05-09 | 83.262 |
| 2021-05-10 | 83.901 |
| 2021-05-11 | 85.788 |
| 2021-05-12 | 84.458 |
| 2021-05-13 | 86.04 |
| 2021-05-14 | 83.517 |
| 2021-05-15 | 82.881 |
| 2021-05-16 | 81.216 |
| 2021-05-17 | 80.89 |
| 2021-05-18 | 82.327 |
| 2021-05-19 | 83.91 |
| 2021-05-20 | 83.836 |
| 2021-05-21 | 83.383 |
| 2021-05-22 | 81.69 |
| 2021-05-23 | 78.813 |
| 2021-05-24 | 79.633 |
| 2021-05-25 | 84.959 |
| 2021-05-26 | 89.098 |
| 2021-05-27 | 89.195 |
| 2021-05-28 | 92.385 |
| 2021-05-29 | 93.145 |
| 2021-05-30 | 92.91 |
| 2021-05-31 | 92.959 |
| 2021-06-01 | 93.423 |
| 2021-06-02 | 92.44 |
| 2021-06-03 | 91.13 |
| 2021-06-04 | 91.799 |
| 2021-06-05 | 90.497 |
| 2021-06-06 | 90.113 |
| 2021-06-07 | 91.892 |
| 2021-06-08 | 93.72 |
| 2021-06-09 | 94.948 |
| 2021-06-10 | 94.409 |
| 2021-06-11 | 96.606 |
| 2021-06-12 | 93.453 |
| 2021-06-13 | 91.414 |
| 2021-06-14 | 89.494 |
| 2021-06-15 | 90.099 |
| 2021-06-16 | 92.28 |
| 2021-06-17 | 93.845 |
| 2021-06-18 | 91.332 |
| 2021-06-19 | 88.488 |
| 2021-06-20 | 86.333 |
| 2021-06-21 | 87.386 |
| 2021-06-22 | 91.189 |
| 2021-06-23 | 88.086 |
| 2021-06-24 | 84.906 |
| 2021-06-25 | 80.637 |
| 2021-06-26 | 76.818 |
| 2021-06-27 | 72.174 |
| 2021-06-28 | 73.627 |
| 2021-06-29 | 75.956 |
| 2021-06-30 | 75.571 |
| 2021-07-01 | 75.704 |
| 2021-07-02 | 76.05 |
| 2021-07-03 | 75.673 |
| 2021-07-04 | 74.599 |
| 2021-07-05 | 75.412 |
| 2021-07-06 | 75.892 |
| 2021-07-07 | 75.204 |
| 2021-07-08 | 75.11 |
| 2021-07-09 | 73.293 |
| 2021-07-10 | 71.342 |
| 2021-07-11 | 67.849 |
| 2021-07-12 | 68.723 |
| 2021-07-13 | 69.468 |
| 2021-07-14 | 70.411 |
| 2021-07-15 | 71.835 |
| 2021-07-16 | 69.045 |
| 2021-07-17 | 66.758 |
| 2021-07-18 | 64.901 |
| 2021-07-19 | 65.265 |
| 2021-07-20 | 63.413 |
| 2021-07-21 | 61.858 |
| 2021-07-22 | 59.196 |
| 2021-07-23 | 60.801 |
| 2021-07-24 | 60.282 |
| 2021-07-25 | 59.384 |
| 2021-07-26 | 60.612 |
| 2021-07-27 | 62.958 |
| 2021-07-28 | 61.394 |
| 2021-07-29 | 59.114 |
| 2021-07-30 | 60.408 |
| 2021-07-31 | 59.168 |
| 2021-08-01 | 57.764 |
| 2021-08-02 | 60.13 |
| 2021-08-03 | 60.362 |
| 2021-08-04 | 61.33 |
| 2021-08-05 | 62.78 |
| 2021-08-06 | 63.791 |
| 2021-08-07 | 63.476 |
| 2021-08-08 | 62.962 |
| 2021-08-09 | 63.424 |
| 2021-08-10 | 66.303 |
| 2021-08-11 | 66.336 |
| 2021-08-12 | 66.3 |
| 2021-08-13 | 67.627 |
| 2021-08-14 | 64.318 |
| 2021-08-15 | 63.75 |
| 2021-08-16 | 65.442 |
| 2021-08-17 | 69.858 |
| 2021-08-18 | 70.665 |
| 2021-08-19 | 71.089 |
| 2021-08-20 | 71.513 |
| 2021-08-21 | 71.331 |
| 2021-08-22 | 70.436 |
| 2021-08-23 | 74.786 |
| 2021-08-24 | 78.413 |
| 2021-08-25 | 77.996 |
| 2021-08-26 | 79.209 |
| 2021-08-27 | 80.778 |
| 2021-08-28 | 83.573 |
| 2021-08-29 | 83.498 |
| 2021-08-30 | 86.047 |
| 2021-08-31 | 91.115 |
| 2021-09-01 | 89.831 |
| 2021-09-02 | 91.597 |
| 2021-09-03 | 91.824 |
| 2021-09-04 | 90.079 |
| 2021-09-05 | 89.566 |
| 2021-09-06 | 90.591 |
| 2021-09-07 | 94.054 |
| 2021-09-08 | 95.517 |
| 2021-09-09 | 94.262 |
| 2021-09-10 | 93.771 |
| 2021-09-11 | 94.068 |
| 2021-09-12 | 93.081 |
| 2021-09-13 | 96.373 |
| 2021-09-14 | 96.765 |
| 2021-09-15 | 94.808 |
| 2021-09-16 | 93.429 |
| 2021-09-17 | 96.1 |
| 2021-09-18 | 97.815 |
| 2021-09-19 | 96.994 |
| 2021-09-20 | 95.899 |
| 2021-09-21 | 96.526 |
| 2021-09-22 | 91.867 |
| 2021-09-23 | 89.738 |
| 2021-09-24 | 91.303 |
| 2021-09-25 | 88.67 |
| 2021-09-26 | 86.358 |
| 2021-09-27 | 84.464 |
| 2021-09-28 | 85.058 |
| 2021-09-29 | 83.549 |
| 2021-09-30 | 80.396 |
| 2021-10-01 | 80.136 |
| 2021-10-02 | 78.501 |
| 2021-10-03 | 76.567 |
| 2021-10-04 | 77.082 |
| 2021-10-05 | 81.338 |
| 2021-10-06 | 80.552 |
| 2021-10-07 | 80.66 |
| 2021-10-08 | 80.989 |
| 2021-10-09 | 79.711 |
| 2021-10-10 | 78.595 |
| 2021-10-11 | 77.389 |
| 2021-10-12 | 77.736 |
| 2021-10-13 | 77.353 |
| 2021-10-14 | 77.01 |
| 2021-10-15 | 78.421 |
| 2021-10-16 | 75.089 |
| 2021-10-17 | 71.014 |
| 2021-10-18 | 71.924 |
| 2021-10-19 | 75.027 |
| 2021-10-20 | 75.767 |
| 2021-10-21 | 76.234 |
| 2021-10-22 | 77.339 |
| 2021-10-23 | 77.046 |
| 2021-10-24 | 75.494 |
| 2021-10-25 | 77.234 |
| 2021-10-26 | 81.112 |
| 2021-10-27 | 82.708 |
| 2021-10-28 | 82.691 |
| 2021-10-29 | 82.567 |
| 2021-10-30 | 80.964 |
| 2021-10-31 | 80.83 |
| 2021-11-01 | 83.363 |
| 2021-11-02 | 83.932 |
| 2021-11-03 | 84.208 |
| 2021-11-04 | 82.35 |
| 2021-11-05 | 83.058 |
| 2021-11-06 | 79.808 |
| 2021-11-07 | 78.072 |
| 2021-11-08 | 78.421 |
| 2021-11-09 | 80.482 |
| 2021-11-10 | 83.364 |
| 2021-11-11 | 83.454 |
| 2021-11-12 | 83.694 |
| 2021-11-13 | 83.887 |
| 2021-11-14 | 81.916 |
| 2021-11-15 | 86.038 |
| 2021-11-16 | 89.123 |
| 2021-11-17 | 88.98 |
| 2021-11-18 | 90.009 |
| 2021-11-19 | 90.955 |
| 2021-11-20 | 89.171 |
| 2021-11-21 | 87.333 |
| 2021-11-22 | 89.747 |
| 2021-11-23 | 90.727 |
| 2021-11-24 | 90.798 |
| 2021-11-25 | 89.739 |
| 2021-11-26 | 88.21 |
| 2021-11-27 | 86.786 |
| 2021-11-28 | 86.044 |
| 2021-11-29 | 87.176 |
| 2021-11-30 | 88.133 |
| 2021-12-01 | 86.679 |
| 2021-12-02 | 87.746 |
| 2021-12-03 | 88.839 |
| 2021-12-04 | 87.176 |
| 2021-12-05 | 87.444 |
| 2021-12-06 | 90.692 |
| 2021-12-07 | 96.168 |
| 2021-12-08 | 99.469 |
| 2021-12-09 | 100.133 |
| 2021-12-10 | 101.126 |
| 2021-12-11 | 101.568 |
| 2021-12-12 | 100.589 |
| 2021-12-13 | 102.283 |
| 2021-12-14 | 105.067 |
| 2021-12-15 | 102.637 |
| 2021-12-16 | 102.96 |
| 2021-12-17 | 101.881 |
| 2021-12-18 | 99.272 |
| 2021-12-19 | 97.548 |
| 2021-12-20 | 97.928 |
| 2021-12-21 | 100.292 |
| 2021-12-22 | 100.557 |
| 2021-12-23 | 102.592 |
| 2021-12-24 | 104.095 |
| 2021-12-25 | 101.612 |
| 2021-12-26 | 101.015 |
| 2021-12-27 | 101.893 |
| 2021-12-28 | 102.765 |
| 2021-12-29 | 101.293 |
| 2021-12-30 | 103.988 |
| 2021-12-31 | 104.019 |
| 2022-01-01 | 103 |
| 2022-01-02 | 100.626 |
| 2022-01-03 | 100.04 |
| 2022-01-04 | 100.246 |
| 2022-01-05 | 99.239 |
| 2022-01-06 | 94.665 |
| 2022-01-07 | 93.723 |
| 2022-01-08 | 91.393 |
| 2022-01-09 | 87.881 |
| 2022-01-10 | 89.201 |
| 2022-01-11 | 93.091 |
| 2022-01-12 | 91.992 |
| 2022-01-13 | 93.391 |
| 2022-01-14 | 95.372 |
| 2022-01-15 | 93.156 |
| 2022-01-16 | 91.546 |
| 2022-01-17 | 92.416 |
| 2022-01-18 | 95.301 |
| 2022-01-19 | 98.6 |
| 2022-01-20 | 100.24 |
| 2022-01-21 | 101.885 |
| 2022-01-22 | 102.052 |
| 2022-01-23 | 101.09 |
| 2022-01-24 | 105.741 |
| 2022-01-25 | 114.128 |
| 2022-01-26 | 120.389 |
| 2022-01-27 | 127.108 |
| 2022-01-28 | 131.946 |
| 2022-01-29 | 132.843 |
| 2022-01-30 | 131.953 |
| 2022-01-31 | 134.853 |
| 2022-02-01 | 140.038 |
| 2022-02-02 | 146.63 |
| 2022-02-03 | 147.896 |
| 2022-02-04 | 148.013 |
| 2022-02-05 | 146.696 |
| 2022-02-06 | 145.326 |
| 2022-02-07 | 147.524 |
| 2022-02-08 | 149.09 |
| 2022-02-09 | 147.305 |
| 2022-02-10 | 143.265 |
| 2022-02-11 | 145.479 |
| 2022-02-12 | 143.511 |
| 2022-02-13 | 143.008 |
| 2022-02-14 | 146.491 |
| 2022-02-15 | 152.756 |
| 2022-02-16 | 155.134 |
| 2022-02-17 | 156.374 |
| 2022-02-18 | 157.749 |
| 2022-02-19 | 157.634 |
| 2022-02-20 | 154.012 |
| 2022-02-21 | 153.618 |
| 2022-02-22 | 157.479 |
| 2022-02-23 | 161.005 |
| 2022-02-24 | 159.671 |
| 2022-02-25 | 166.005 |
| 2022-02-26 | 169.56 |
| 2022-02-27 | 169.855 |
| 2022-02-28 | 175.248 |
| 2022-03-01 | 186.688 |
| 2022-03-02 | 193.807 |
| 2022-03-03 | 194.977 |
| 2022-03-04 | 197.055 |
| 2022-03-05 | 217.003 |
| 2022-03-06 | 220.372 |
| 2022-03-07 | 230.359 |
| 2022-03-08 | 240.003 |
| 2022-03-09 | 244.524 |
| 2022-03-10 | 248.523 |
| 2022-03-11 | 256.056 |
| 2022-03-12 | 261.335 |
| 2022-03-13 | 261.075 |
| 2022-03-14 | 265.912 |
| 2022-03-15 | 270.442 |
| 2022-03-16 | 275.245 |
| 2022-03-17 | 276.272 |
| 2022-03-18 | 277.494 |
| 2022-03-19 | 275.448 |
| 2022-03-20 | 271.735 |
| 2022-03-21 | 273.099 |